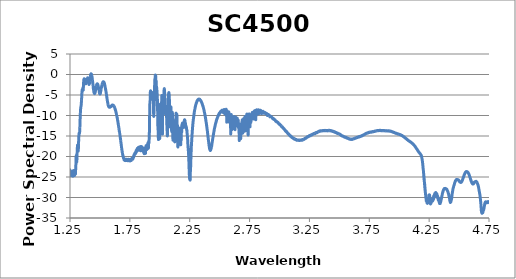
| Category | Power Spectral Density (dBm/nm) |
|---|---|
| 0.9997208862 | -20.139 |
| 0.9997697754 | -20.165 |
| 0.9998187865999999 | -20.043 |
| 0.9998677368 | -20.116 |
| 0.999916748 | -20.263 |
| 0.9999657593 | -20.32 |
| 1.000014709 | -20.365 |
| 1.000063721 | -20.375 |
| 1.000112671 | -20.276 |
| 1.000161743 | -20.173 |
| 1.000210693 | -20.198 |
| 1.000259766 | -20.168 |
| 1.000308716 | -20.151 |
| 1.000357788 | -20.114 |
| 1.000406799 | -20.045 |
| 1.000455872 | -20.029 |
| 1.000504822 | -20.031 |
| 1.000553955 | -19.992 |
| 1.000602905 | -19.99 |
| 1.000652039 | -20.023 |
| 1.00070105 | -20.12 |
| 1.0007501220000001 | -20.165 |
| 1.000799133 | -20.117 |
| 1.000848267 | -19.952 |
| 1.000897278 | -19.904 |
| 1.000946411 | -19.742 |
| 1.000995544 | -19.759 |
| 1.001044617 | -19.882 |
| 1.00109375 | -19.993 |
| 1.0011427609999999 | -20.057 |
| 1.001191956 | -20.022 |
| 1.001240967 | -19.925 |
| 1.001290161 | -19.876 |
| 1.001339233 | -20.106 |
| 1.0013883670000001 | -20.157 |
| 1.001437439 | -20.359 |
| 1.001486633 | -20.383 |
| 1.001535706 | -20.393 |
| 1.0015849 | -20.292 |
| 1.001634033 | -20.338 |
| 1.001683228 | -20.247 |
| 1.0017323 | -20.207 |
| 1.001781555 | -20.369 |
| 1.0018306270000001 | -20.406 |
| 1.001879883 | -20.332 |
| 1.001929016 | -20.382 |
| 1.00197821 | -20.379 |
| 1.002027466 | -20.26 |
| 1.002076599 | -20.318 |
| 1.002125854 | -20.449 |
| 1.002174988 | -20.582 |
| 1.002224243 | -20.711 |
| 1.002273376 | -20.671 |
| 1.002322632 | -20.561 |
| 1.002371826 | -20.684 |
| 1.002421082 | -20.679 |
| 1.002470276 | -20.703 |
| 1.0025195310000001 | -20.886 |
| 1.002568726 | -20.892 |
| 1.002618042 | -20.703 |
| 1.002667236 | -20.747 |
| 1.002716553 | -20.786 |
| 1.002765747 | -20.714 |
| 1.0028150630000001 | -20.658 |
| 1.002864258 | -20.663 |
| 1.0029135740000001 | -20.63 |
| 1.00296283 | -20.564 |
| 1.003012146 | -20.503 |
| 1.003061462 | -20.58 |
| 1.003110718 | -20.808 |
| 1.003160095 | -20.86 |
| 1.003209351 | -20.856 |
| 1.0032586669999999 | -20.959 |
| 1.0033079219999999 | -20.999 |
| 1.0033573 | -20.98 |
| 1.003406555 | -20.862 |
| 1.003455933 | -20.922 |
| 1.003505249 | -20.929 |
| 1.003554626 | -20.678 |
| 1.003603882 | -20.366 |
| 1.00365332 | -20.426 |
| 1.003702576 | -20.477 |
| 1.003752014 | -20.456 |
| 1.003801331 | -20.574 |
| 1.003850708 | -20.634 |
| 1.003900024 | -20.739 |
| 1.003949463 | -20.867 |
| 1.003998779 | -20.813 |
| 1.004048218 | -21.013 |
| 1.004097534 | -21.193 |
| 1.004146973 | -21.091 |
| 1.004196472 | -21.089 |
| 1.004245789 | -21.21 |
| 1.0042952269999998 | -20.983 |
| 1.004344604 | -20.905 |
| 1.004394104 | -20.972 |
| 1.004443481 | -20.967 |
| 1.0044929200000001 | -20.914 |
| 1.004542297 | -20.917 |
| 1.004591797 | -20.922 |
| 1.004641174 | -20.859 |
| 1.004690674 | -20.739 |
| 1.004740112 | -20.684 |
| 1.004789612 | -20.82 |
| 1.004838989 | -20.849 |
| 1.00488855 | -20.797 |
| 1.0049379269999998 | -20.879 |
| 1.004987488 | -21.038 |
| 1.0050368650000001 | -20.986 |
| 1.0050864259999999 | -20.998 |
| 1.0051358639999999 | -20.957 |
| 1.005185425 | -20.895 |
| 1.005234985 | -20.931 |
| 1.0052844239999998 | -20.945 |
| 1.005333984 | -20.971 |
| 1.005383423 | -20.921 |
| 1.005432983 | -20.832 |
| 1.005482483 | -20.871 |
| 1.005532043 | -20.843 |
| 1.005581543 | -20.839 |
| 1.005631165 | -20.859 |
| 1.005680603 | -20.899 |
| 1.005730225 | -20.981 |
| 1.005779724 | -21.065 |
| 1.005829346 | -21.14 |
| 1.005878845 | -21.236 |
| 1.005928467 | -21.141 |
| 1.0059779660000001 | -21.056 |
| 1.006027649 | -21.083 |
| 1.006077148 | -21.098 |
| 1.00612677 | -21.261 |
| 1.006176331 | -21.437 |
| 1.006225952 | -21.449 |
| 1.006275635 | -21.413 |
| 1.006325195 | -21.522 |
| 1.006374878 | -21.502 |
| 1.006424438 | -21.561 |
| 1.00647406 | -21.532 |
| 1.006523682 | -21.541 |
| 1.0065733639999999 | -21.5 |
| 1.006622925 | -21.345 |
| 1.006672607 | -21.195 |
| 1.006722229 | -21.181 |
| 1.006771912 | -21.209 |
| 1.006821533 | -21.071 |
| 1.006871216 | -21.017 |
| 1.006920837 | -21.099 |
| 1.006970581 | -21.027 |
| 1.007020203 | -20.998 |
| 1.0070699459999999 | -21.001 |
| 1.007119568 | -21.035 |
| 1.007169312 | -21.033 |
| 1.007218933 | -21.062 |
| 1.0072686770000001 | -21.015 |
| 1.007318481 | -20.98 |
| 1.0073681030000001 | -20.962 |
| 1.007417908 | -20.983 |
| 1.007467529 | -21.079 |
| 1.007517334 | -21.04 |
| 1.007567017 | -21.127 |
| 1.00761676 | -21.138 |
| 1.0076665040000001 | -21.213 |
| 1.007716248 | -20.931 |
| 1.007765991 | -20.962 |
| 1.007815796 | -21 |
| 1.0078654790000001 | -21.077 |
| 1.007915283 | -21.07 |
| 1.007965027 | -21.159 |
| 1.008014832 | -21.103 |
| 1.008064575 | -20.989 |
| 1.00811438 | -20.917 |
| 1.008164124 | -20.796 |
| 1.008213989 | -20.761 |
| 1.008263733 | -20.78 |
| 1.008313599 | -20.818 |
| 1.008363342 | -20.766 |
| 1.0084132080000001 | -20.628 |
| 1.008463074 | -20.517 |
| 1.008512817 | -20.68 |
| 1.008562744 | -20.749 |
| 1.008612488 | -20.771 |
| 1.008662415 | -20.734 |
| 1.008712158 | -20.832 |
| 1.0087620849999999 | -20.725 |
| 1.00881189 | -20.592 |
| 1.008861816 | -20.518 |
| 1.008911621 | -20.544 |
| 1.008961548 | -20.555 |
| 1.009011353 | -20.557 |
| 1.009061279 | -20.407 |
| 1.009111084 | -20.495 |
| 1.009161072 | -20.584 |
| 1.009210876 | -20.664 |
| 1.009260803 | -20.641 |
| 1.009310669 | -20.598 |
| 1.009360657 | -20.784 |
| 1.009410522 | -20.827 |
| 1.009460449 | -20.74 |
| 1.009510437 | -20.658 |
| 1.009560303 | -20.73 |
| 1.009610291 | -20.625 |
| 1.009660156 | -20.744 |
| 1.009710205 | -20.743 |
| 1.009760071 | -20.697 |
| 1.009810059 | -20.754 |
| 1.009859985 | -20.678 |
| 1.009909973 | -20.674 |
| 1.0099599 | -20.776 |
| 1.010009949 | -20.907 |
| 1.010059875 | -20.98 |
| 1.010109863 | -21.088 |
| 1.0101597900000001 | -20.87 |
| 1.010209839 | -20.93 |
| 1.010259827 | -20.917 |
| 1.0103098750000001 | -20.944 |
| 1.010359802 | -20.866 |
| 1.010409851 | -20.786 |
| 1.010459839 | -20.815 |
| 1.010509888 | -20.57 |
| 1.010559998 | -20.558 |
| 1.010609985 | -20.427 |
| 1.010660034 | -20.526 |
| 1.010710022 | -20.35 |
| 1.010760132 | -20.505 |
| 1.01081012 | -20.471 |
| 1.010860229 | -20.547 |
| 1.0109102779999999 | -20.584 |
| 1.010960388 | -20.616 |
| 1.011010376 | -20.815 |
| 1.0110604859999999 | -20.783 |
| 1.011110535 | -20.877 |
| 1.0111606450000001 | -20.985 |
| 1.011210693 | -21.127 |
| 1.011260864 | -21.026 |
| 1.011310913 | -21.104 |
| 1.011361084 | -21.018 |
| 1.011411133 | -20.986 |
| 1.011461304 | -20.969 |
| 1.011511353 | -20.918 |
| 1.011561523 | -20.99 |
| 1.011611694 | -20.955 |
| 1.011661804 | -20.963 |
| 1.011711975 | -20.901 |
| 1.011762085 | -20.828 |
| 1.011812256 | -20.885 |
| 1.011862366 | -20.974 |
| 1.011912598 | -21.093 |
| 1.011962708 | -20.989 |
| 1.012012939 | -20.958 |
| 1.012063049 | -20.956 |
| 1.012113281 | -20.931 |
| 1.012163391 | -20.833 |
| 1.012213684 | -20.859 |
| 1.0122637939999999 | -20.975 |
| 1.012314026 | -21.017 |
| 1.012364197 | -20.915 |
| 1.01241449 | -20.779 |
| 1.0124646 | -20.805 |
| 1.012514893 | -20.927 |
| 1.012565063 | -20.952 |
| 1.012615356 | -20.9 |
| 1.012665527 | -20.996 |
| 1.01271582 | -21.111 |
| 1.012766113 | -21.128 |
| 1.012816284 | -20.947 |
| 1.012866638 | -21.001 |
| 1.012916809 | -21.017 |
| 1.0129671630000001 | -21.051 |
| 1.013017334 | -20.893 |
| 1.013067688 | -20.911 |
| 1.01311792 | -20.904 |
| 1.013168274 | -20.85 |
| 1.013218506 | -20.862 |
| 1.013268799 | -21.033 |
| 1.013319092 | -21.157 |
| 1.013369446 | -21.195 |
| 1.013419678 | -21.196 |
| 1.0134700319999999 | -21.149 |
| 1.013520325 | -21.22 |
| 1.013570679 | -21.131 |
| 1.013620972 | -21.244 |
| 1.013671387 | -21.19 |
| 1.013721619 | -20.959 |
| 1.013772034 | -20.819 |
| 1.013822449 | -20.85 |
| 1.013872742 | -20.87 |
| 1.013923157 | -20.885 |
| 1.01397345 | -20.968 |
| 1.014023865 | -20.995 |
| 1.014074219 | -21.011 |
| 1.014124634 | -21.165 |
| 1.014174988 | -21.284 |
| 1.014225403 | -21.372 |
| 1.014275757 | -21.387 |
| 1.014326233 | -21.418 |
| 1.0143765869999999 | -21.415 |
| 1.014427002 | -21.461 |
| 1.014477356 | -21.522 |
| 1.014527832 | -21.501 |
| 1.014578247 | -21.567 |
| 1.014628723 | -21.388 |
| 1.014679077 | -21.294 |
| 1.014729553 | -21.349 |
| 1.014779968 | -21.267 |
| 1.014830444 | -21.114 |
| 1.0148809810000001 | -21.101 |
| 1.014931396 | -20.989 |
| 1.014981873 | -20.783 |
| 1.015032288 | -20.877 |
| 1.015082825 | -20.8 |
| 1.01513324 | -20.74 |
| 1.015183777 | -20.834 |
| 1.015234253 | -20.919 |
| 1.01528479 | -20.988 |
| 1.0153352660000001 | -21.204 |
| 1.015385803 | -21.305 |
| 1.015436279 | -21.502 |
| 1.015486816 | -21.612 |
| 1.0155372919999999 | -21.623 |
| 1.01558783 | -21.622 |
| 1.015638367 | -21.828 |
| 1.015688904 | -21.787 |
| 1.015739441 | -21.69 |
| 1.015789978 | -21.613 |
| 1.015840515 | -21.571 |
| 1.0158911130000001 | -21.475 |
| 1.015941711 | -21.539 |
| 1.015992249 | -21.613 |
| 1.016042847 | -21.608 |
| 1.016093384 | -21.536 |
| 1.016143982 | -21.457 |
| 1.016194519 | -21.273 |
| 1.016245178 | -21.227 |
| 1.016295715 | -21.352 |
| 1.016346375 | -21.279 |
| 1.016396912 | -21.265 |
| 1.016447571 | -21.154 |
| 1.016498169 | -21.071 |
| 1.016548828 | -20.847 |
| 1.016599426 | -21.034 |
| 1.016650085 | -20.967 |
| 1.0167006840000001 | -21.177 |
| 1.016751343 | -21.222 |
| 1.016801941 | -21.238 |
| 1.016852661 | -21.164 |
| 1.016903259 | -21.279 |
| 1.016953979 | -21.311 |
| 1.0170047 | -21.391 |
| 1.017055298 | -21.569 |
| 1.017106018 | -21.491 |
| 1.017156677 | -21.678 |
| 1.017207397 | -21.641 |
| 1.017258057 | -21.642 |
| 1.017308777 | -21.543 |
| 1.017359436 | -21.628 |
| 1.017410217 | -21.587 |
| 1.017460876 | -21.57 |
| 1.0175115970000002 | -21.428 |
| 1.017562317 | -21.354 |
| 1.017613037 | -21.385 |
| 1.017663757 | -21.322 |
| 1.017714539 | -21.332 |
| 1.017765198 | -21.468 |
| 1.01781604 | -21.462 |
| 1.017866699 | -21.324 |
| 1.017917542 | -21.306 |
| 1.017968262 | -21.257 |
| 1.018019043 | -21.268 |
| 1.018069763 | -21.221 |
| 1.018120605 | -21.194 |
| 1.0181714480000001 | -21.186 |
| 1.018222168 | -21.255 |
| 1.01827301 | -21.205 |
| 1.0183237920000001 | -21.23 |
| 1.018374634 | -21.235 |
| 1.018425354 | -21.179 |
| 1.018476257 | -21.299 |
| 1.018526978 | -21.465 |
| 1.0185778810000001 | -21.618 |
| 1.018628662 | -21.634 |
| 1.0186795039999998 | -21.697 |
| 1.018730347 | -21.666 |
| 1.018781189 | -21.59 |
| 1.018832031 | -21.639 |
| 1.018882935 | -21.757 |
| 1.018933716 | -21.733 |
| 1.018984619 | -21.529 |
| 1.019035461 | -21.476 |
| 1.019086365 | -21.287 |
| 1.019137207 | -21.231 |
| 1.01918811 | -21.324 |
| 1.019239075 | -21.334 |
| 1.019289917 | -21.4 |
| 1.019340881 | -21.214 |
| 1.0193917239999999 | -21.181 |
| 1.019442688 | -21.202 |
| 1.0194935299999999 | -21.239 |
| 1.0195444949999999 | -21.189 |
| 1.019595398 | -21.399 |
| 1.019646362 | -21.367 |
| 1.019697266 | -21.236 |
| 1.01974823 | -21.241 |
| 1.019799133 | -21.222 |
| 1.019850159 | -21.335 |
| 1.019901062 | -21.347 |
| 1.0199520260000001 | -21.41 |
| 1.02000293 | -21.534 |
| 1.020053955 | -21.569 |
| 1.020104919 | -21.601 |
| 1.020155945 | -21.773 |
| 1.020206848 | -21.718 |
| 1.020257935 | -21.586 |
| 1.02030896 | -21.385 |
| 1.020359924 | -21.388 |
| 1.02041095 | -21.462 |
| 1.020461914 | -21.41 |
| 1.020513 | -21.402 |
| 1.020563965 | -21.405 |
| 1.020615051 | -21.373 |
| 1.020666016 | -21.164 |
| 1.0207171019999999 | -21.208 |
| 1.020768066 | -21.303 |
| 1.020819214 | -21.467 |
| 1.020870178 | -21.418 |
| 1.020921326 | -21.482 |
| 1.02097229 | -21.395 |
| 1.021023438 | -21.297 |
| 1.021074463 | -21.344 |
| 1.021125549 | -21.253 |
| 1.021176575 | -21.326 |
| 1.021227722 | -21.232 |
| 1.021278809 | -21.09 |
| 1.021329956 | -21.042 |
| 1.021381104 | -21.166 |
| 1.0214321290000001 | -21.046 |
| 1.021483276 | -21.188 |
| 1.021534363 | -21.264 |
| 1.021585571 | -21.211 |
| 1.021636597 | -21.271 |
| 1.021687805 | -21.28 |
| 1.021738892 | -21.428 |
| 1.0217901 | -21.461 |
| 1.021841187 | -21.606 |
| 1.021892395 | -21.629 |
| 1.021943481 | -21.64 |
| 1.02199469 | -21.503 |
| 1.022045837 | -21.61 |
| 1.022097046 | -21.718 |
| 1.022148193 | -21.744 |
| 1.022199402 | -21.788 |
| 1.022250549 | -21.809 |
| 1.022301819 | -21.977 |
| 1.0223529660000001 | -21.988 |
| 1.022404236 | -21.946 |
| 1.022455383 | -21.86 |
| 1.022506653 | -22.031 |
| 1.022557922 | -22.046 |
| 1.02260907 | -21.993 |
| 1.022660339 | -21.958 |
| 1.022711548 | -21.946 |
| 1.022762817 | -21.959 |
| 1.022814026 | -21.822 |
| 1.022865356 | -21.601 |
| 1.022916565 | -21.473 |
| 1.0229678340000001 | -21.502 |
| 1.023019043 | -21.438 |
| 1.023070374 | -21.338 |
| 1.0231216429999999 | -21.312 |
| 1.023172974 | -21.369 |
| 1.023224182 | -21.377 |
| 1.023275513 | -21.34 |
| 1.023326782 | -21.336 |
| 1.023378113 | -21.5 |
| 1.023429382 | -21.528 |
| 1.023480774 | -21.557 |
| 1.0235320430000001 | -21.496 |
| 1.023583374 | -21.508 |
| 1.023634766 | -21.573 |
| 1.0236860349999999 | -21.612 |
| 1.023737427 | -21.59 |
| 1.023788757 | -21.49 |
| 1.023840149 | -21.656 |
| 1.023891418 | -21.55 |
| 1.023942871 | -21.587 |
| 1.023994141 | -21.804 |
| 1.0240455320000001 | -21.896 |
| 1.024096924 | -21.753 |
| 1.024148315 | -21.583 |
| 1.024199707 | -21.619 |
| 1.024251099 | -21.725 |
| 1.02430249 | -21.883 |
| 1.0243538820000002 | -21.82 |
| 1.0244052730000002 | -21.918 |
| 1.024456665 | -22.034 |
| 1.024508057 | -21.836 |
| 1.0245595699999999 | -21.909 |
| 1.024610962 | -21.984 |
| 1.024662354 | -22.122 |
| 1.024713867 | -21.937 |
| 1.024765259 | -21.806 |
| 1.0248167719999999 | -21.673 |
| 1.024868164 | -21.65 |
| 1.024919678 | -21.566 |
| 1.024971069 | -21.522 |
| 1.025022583 | -21.571 |
| 1.0250740969999999 | -21.586 |
| 1.0251256100000001 | -21.695 |
| 1.025177002 | -21.758 |
| 1.0252285159999999 | -21.767 |
| 1.025280029 | -21.899 |
| 1.025331543 | -21.961 |
| 1.025382935 | -21.993 |
| 1.0254345699999998 | -22.174 |
| 1.0254859619999999 | -22.144 |
| 1.0255375979999999 | -22.2 |
| 1.025589111 | -22.054 |
| 1.025640625 | -22.014 |
| 1.025692139 | -22.01 |
| 1.025743774 | -22.075 |
| 1.025795288 | -22.025 |
| 1.025846802 | -21.983 |
| 1.025898438 | -21.849 |
| 1.025949951 | -21.727 |
| 1.0260015869999999 | -21.577 |
| 1.026053101 | -21.469 |
| 1.026104736 | -21.486 |
| 1.02615625 | -21.503 |
| 1.026207886 | -21.398 |
| 1.026259399 | -21.356 |
| 1.026311035 | -21.472 |
| 1.026362549 | -21.571 |
| 1.026414307 | -21.657 |
| 1.0264658199999999 | -21.729 |
| 1.026517456 | -21.864 |
| 1.026569092 | -21.788 |
| 1.0266207280000001 | -21.751 |
| 1.0266723629999999 | -21.667 |
| 1.026723999 | -21.56 |
| 1.026775635 | -21.584 |
| 1.0268272710000002 | -21.348 |
| 1.026879028 | -21.268 |
| 1.026930664 | -21.153 |
| 1.0269822999999998 | -21.137 |
| 1.027033936 | -21.251 |
| 1.027085693 | -21.295 |
| 1.0271373289999999 | -21.259 |
| 1.027189087 | -21.2 |
| 1.0272407229999998 | -21.423 |
| 1.02729248 | -21.539 |
| 1.027344116 | -21.592 |
| 1.027395874 | -21.626 |
| 1.02744751 | -21.705 |
| 1.0274992680000001 | -21.66 |
| 1.027550903 | -21.526 |
| 1.027602661 | -21.765 |
| 1.0276544189999999 | -21.928 |
| 1.027706177 | -22.039 |
| 1.027757813 | -22.026 |
| 1.027809692 | -21.961 |
| 1.027861328 | -21.995 |
| 1.027913208 | -21.818 |
| 1.027964844 | -21.746 |
| 1.028016724 | -21.584 |
| 1.028068481 | -21.516 |
| 1.0281202390000002 | -21.292 |
| 1.0281721190000002 | -21.198 |
| 1.0282238769999998 | -21.291 |
| 1.028275635 | -21.271 |
| 1.028327393 | -21.155 |
| 1.028379272 | -21.144 |
| 1.02843103 | -21.34 |
| 1.02848291 | -21.377 |
| 1.028534668 | -21.678 |
| 1.028586548 | -21.76 |
| 1.028638306 | -21.786 |
| 1.028690186 | -21.872 |
| 1.0287420649999999 | -21.671 |
| 1.0287939449999999 | -21.535 |
| 1.028845703 | -21.52 |
| 1.028897583 | -21.639 |
| 1.028949463 | -21.577 |
| 1.029001343 | -21.483 |
| 1.0290532229999998 | -21.412 |
| 1.029105103 | -21.423 |
| 1.0291571039999998 | -21.452 |
| 1.029208862 | -21.42 |
| 1.029260864 | -21.534 |
| 1.029312622 | -21.608 |
| 1.029364624 | -21.802 |
| 1.029416504 | -21.711 |
| 1.029468506 | -21.65 |
| 1.029520264 | -21.893 |
| 1.029572266 | -21.8 |
| 1.0296241460000002 | -21.751 |
| 1.029676147 | -21.757 |
| 1.0297280270000002 | -21.677 |
| 1.029780029 | -21.7 |
| 1.029831909 | -21.647 |
| 1.029883911 | -21.492 |
| 1.029935913 | -21.474 |
| 1.029987915 | -21.532 |
| 1.030039795 | -21.607 |
| 1.030091797 | -21.693 |
| 1.030143799 | -21.832 |
| 1.030195801 | -21.777 |
| 1.030247803 | -21.872 |
| 1.030299805 | -21.924 |
| 1.030351807 | -22.079 |
| 1.0304038089999998 | -22.102 |
| 1.030455933 | -22.087 |
| 1.030507813 | -22.125 |
| 1.030559937 | -22.081 |
| 1.030611938 | -22.09 |
| 1.03066394 | -21.986 |
| 1.030715942 | -22.028 |
| 1.030768066 | -22.03 |
| 1.030820068 | -21.928 |
| 1.0308721920000001 | -21.706 |
| 1.030924194 | -21.754 |
| 1.030976318 | -21.72 |
| 1.0310283199999999 | -21.618 |
| 1.0310804439999999 | -21.51 |
| 1.031132446 | -21.393 |
| 1.031184692 | -21.492 |
| 1.031236694 | -21.612 |
| 1.031288818 | -21.483 |
| 1.0313409420000001 | -21.586 |
| 1.0313930660000001 | -21.709 |
| 1.03144519 | -21.609 |
| 1.0314973139999999 | -21.761 |
| 1.031549438 | -21.925 |
| 1.031601563 | -21.976 |
| 1.031653687 | -22.054 |
| 1.0317058110000001 | -21.951 |
| 1.031758057 | -21.935 |
| 1.031810059 | -22.025 |
| 1.0318623050000002 | -21.954 |
| 1.031914429 | -21.912 |
| 1.0319666749999998 | -21.99 |
| 1.032018799 | -21.988 |
| 1.032071045 | -21.898 |
| 1.032123169 | -21.875 |
| 1.032175415 | -21.847 |
| 1.032227539 | -21.91 |
| 1.0322797849999998 | -21.857 |
| 1.032331909 | -21.806 |
| 1.032384155 | -21.81 |
| 1.0324362790000001 | -21.7 |
| 1.0324886469999999 | -21.679 |
| 1.032540894 | -21.611 |
| 1.032593018 | -21.481 |
| 1.032645386 | -21.481 |
| 1.03269751 | -21.561 |
| 1.0327498780000002 | -21.583 |
| 1.032802002 | -21.444 |
| 1.03285437 | -21.54 |
| 1.032906616 | -21.535 |
| 1.0329588619999999 | -21.737 |
| 1.033011108 | -21.776 |
| 1.033063477 | -21.756 |
| 1.033115601 | -21.829 |
| 1.0331679690000002 | -21.779 |
| 1.033220215 | -21.786 |
| 1.033272583 | -21.691 |
| 1.033324829 | -21.897 |
| 1.033377197 | -22.028 |
| 1.033429443 | -21.907 |
| 1.033481812 | -21.915 |
| 1.0335340579999999 | -22.052 |
| 1.033586548 | -22.165 |
| 1.0336389160000001 | -22.106 |
| 1.033691162 | -22.133 |
| 1.03374353 | -22.114 |
| 1.0337958980000002 | -22.119 |
| 1.033848267 | -21.92 |
| 1.033900635 | -21.82 |
| 1.0339530030000001 | -21.922 |
| 1.034005371 | -21.828 |
| 1.034057739 | -21.69 |
| 1.034110107 | -21.64 |
| 1.034162598 | -21.733 |
| 1.034214844 | -21.743 |
| 1.034267334 | -21.674 |
| 1.034319702 | -21.755 |
| 1.034372192 | -21.854 |
| 1.034424561 | -21.877 |
| 1.034476929 | -21.879 |
| 1.034529419 | -21.976 |
| 1.034581787 | -21.971 |
| 1.034634277 | -21.902 |
| 1.034686768 | -21.844 |
| 1.034739258 | -21.78 |
| 1.0347916259999999 | -21.676 |
| 1.034844116 | -21.682 |
| 1.034896606 | -21.628 |
| 1.034949097 | -21.583 |
| 1.0350014650000001 | -21.537 |
| 1.035054077 | -21.569 |
| 1.0351064449999998 | -21.612 |
| 1.0351590579999999 | -21.703 |
| 1.035211426 | -21.779 |
| 1.035264038 | -21.784 |
| 1.035316406 | -21.94 |
| 1.035369019 | -21.841 |
| 1.035421509 | -21.86 |
| 1.0354739990000001 | -21.792 |
| 1.035526489 | -21.898 |
| 1.035579102 | -21.773 |
| 1.0356315919999999 | -21.691 |
| 1.0356842039999998 | -21.588 |
| 1.035736694 | -21.498 |
| 1.035789307 | -21.557 |
| 1.0358419189999999 | -21.611 |
| 1.035894409 | -21.637 |
| 1.035947021 | -21.696 |
| 1.035999512 | -21.686 |
| 1.036052246 | -21.653 |
| 1.036104736 | -21.757 |
| 1.036157349 | -21.94 |
| 1.036209961 | -21.829 |
| 1.036262573 | -21.899 |
| 1.036315186 | -21.897 |
| 1.036367798 | -21.772 |
| 1.0364204099999998 | -21.789 |
| 1.0364730219999998 | -21.803 |
| 1.036525635 | -21.683 |
| 1.036578369 | -21.707 |
| 1.0366308590000002 | -21.666 |
| 1.036683594 | -21.501 |
| 1.036736206 | -21.702 |
| 1.0367889399999999 | -21.72 |
| 1.036841553 | -21.844 |
| 1.036894287 | -21.857 |
| 1.036946899 | -21.975 |
| 1.036999634 | -21.953 |
| 1.037052368 | -22.061 |
| 1.03710498 | -21.958 |
| 1.037157715 | -21.931 |
| 1.037210327 | -21.993 |
| 1.037263062 | -21.959 |
| 1.0373157960000001 | -21.855 |
| 1.03736853 | -21.782 |
| 1.037421143 | -21.648 |
| 1.0374739990000001 | -21.624 |
| 1.037526611 | -21.473 |
| 1.037579468 | -21.458 |
| 1.03763208 | -21.372 |
| 1.037684937 | -21.399 |
| 1.0377376710000001 | -21.417 |
| 1.037790405 | -21.418 |
| 1.0378431399999999 | -21.518 |
| 1.037895996 | -21.474 |
| 1.03794873 | -21.789 |
| 1.038001465 | -21.632 |
| 1.0380543210000002 | -21.787 |
| 1.038107056 | -21.855 |
| 1.038159912 | -21.88 |
| 1.0382126459999999 | -21.981 |
| 1.038265503 | -21.969 |
| 1.038318359 | -21.91 |
| 1.038371216 | -21.764 |
| 1.03842395 | -21.708 |
| 1.0384768070000001 | -21.66 |
| 1.0385295410000002 | -21.798 |
| 1.0385825199999998 | -21.804 |
| 1.0386352540000001 | -21.804 |
| 1.038688232 | -21.831 |
| 1.0387409669999998 | -21.648 |
| 1.0387939449999999 | -21.627 |
| 1.03884668 | -21.674 |
| 1.038899658 | -21.826 |
| 1.0389525149999999 | -21.705 |
| 1.039005371 | -21.551 |
| 1.039058228 | -21.574 |
| 1.039111206 | -21.46 |
| 1.0391640629999999 | -21.516 |
| 1.039216919 | -21.456 |
| 1.0392698969999998 | -21.447 |
| 1.039322754 | -21.434 |
| 1.0393757319999999 | -21.407 |
| 1.0394285890000001 | -21.49 |
| 1.039481567 | -21.643 |
| 1.039534546 | -21.803 |
| 1.039587524 | -21.679 |
| 1.039640381 | -21.665 |
| 1.0396933590000002 | -21.608 |
| 1.0397463379999998 | -21.785 |
| 1.039799316 | -22.048 |
| 1.039852173 | -22.152 |
| 1.039905273 | -22.084 |
| 1.03995813 | -21.999 |
| 1.0400112300000002 | -21.972 |
| 1.040064087 | -21.805 |
| 1.040117188 | -21.864 |
| 1.040170166 | -22.005 |
| 1.040223145 | -22.006 |
| 1.0402761230000002 | -21.988 |
| 1.0403292240000002 | -21.814 |
| 1.0403823239999999 | -21.807 |
| 1.040435303 | -21.777 |
| 1.0404884030000001 | -21.768 |
| 1.040541382 | -21.798 |
| 1.040594482 | -21.942 |
| 1.040647461 | -21.962 |
| 1.040700562 | -22.01 |
| 1.0407535399999999 | -22.179 |
| 1.0408066409999999 | -22.222 |
| 1.0408596190000001 | -22.299 |
| 1.040912842 | -22.334 |
| 1.0409658199999998 | -22.492 |
| 1.041018921 | -22.542 |
| 1.041072021 | -22.502 |
| 1.041125122 | -22.492 |
| 1.041178223 | -22.503 |
| 1.0412313229999999 | -22.516 |
| 1.0412844239999999 | -22.336 |
| 1.041337646 | -22.222 |
| 1.041390625 | -22 |
| 1.041443848 | -21.824 |
| 1.04149707 | -21.813 |
| 1.0415501710000001 | -21.749 |
| 1.041603394 | -21.998 |
| 1.0416563719999998 | -21.96 |
| 1.041709595 | -21.904 |
| 1.0417626949999998 | -21.799 |
| 1.041815918 | -21.782 |
| 1.0418691409999998 | -21.87 |
| 1.0419223629999999 | -21.804 |
| 1.041975464 | -21.932 |
| 1.042028687 | -21.82 |
| 1.042081787 | -21.879 |
| 1.042135132 | -21.718 |
| 1.042188232 | -21.75 |
| 1.042241455 | -21.637 |
| 1.042294678 | -21.692 |
| 1.0423479 | -21.839 |
| 1.042401123 | -21.852 |
| 1.0424544679999999 | -22.151 |
| 1.042507568 | -22.097 |
| 1.042560913 | -22.225 |
| 1.0426141359999999 | -22.223 |
| 1.0426673579999999 | -22.177 |
| 1.0427207029999999 | -22.101 |
| 1.0427739260000002 | -22.245 |
| 1.0428272710000002 | -22.342 |
| 1.042880493 | -22.152 |
| 1.042933838 | -21.975 |
| 1.042987061 | -21.934 |
| 1.043040405 | -22.04 |
| 1.043093628 | -22.046 |
| 1.0431469729999998 | -22.073 |
| 1.0432001949999998 | -22.219 |
| 1.0432536620000001 | -22.22 |
| 1.043306885 | -22.258 |
| 1.043360229 | -22.076 |
| 1.043413574 | -22.244 |
| 1.0434669189999999 | -22.319 |
| 1.043520264 | -22.283 |
| 1.043573608 | -22.263 |
| 1.043626953 | -22.237 |
| 1.043680298 | -22.074 |
| 1.043733765 | -21.907 |
| 1.0437871090000002 | -21.89 |
| 1.043840454 | -21.83 |
| 1.043893799 | -21.915 |
| 1.043947266 | -21.844 |
| 1.04400061 | -21.864 |
| 1.044054077 | -21.724 |
| 1.044107422 | -21.699 |
| 1.044160889 | -21.668 |
| 1.044214233 | -21.779 |
| 1.0442677 | -21.874 |
| 1.044321045 | -21.755 |
| 1.044374512 | -21.746 |
| 1.044427856 | -21.772 |
| 1.044481445 | -21.758 |
| 1.04453479 | -21.806 |
| 1.044588257 | -21.853 |
| 1.044641724 | -21.866 |
| 1.0446951899999999 | -21.889 |
| 1.0447486570000002 | -21.88 |
| 1.044802124 | -21.736 |
| 1.044855591 | -21.85 |
| 1.044909058 | -21.907 |
| 1.0449626459999999 | -21.874 |
| 1.045016113 | -21.795 |
| 1.045069702 | -21.795 |
| 1.0451230470000001 | -21.817 |
| 1.0451766359999999 | -21.811 |
| 1.0452301030000002 | -21.875 |
| 1.045283691 | -21.785 |
| 1.0453371580000002 | -21.9 |
| 1.045390747 | -21.99 |
| 1.0454442140000002 | -21.918 |
| 1.045497803 | -22.021 |
| 1.0455513920000001 | -22.146 |
| 1.04560498 | -22.061 |
| 1.045658447 | -22.119 |
| 1.0457120359999998 | -22.131 |
| 1.045765625 | -22.044 |
| 1.045819214 | -22.309 |
| 1.045872803 | -22.169 |
| 1.0459263920000001 | -22.098 |
| 1.04597998 | -22.077 |
| 1.046033569 | -21.914 |
| 1.04608728 | -21.908 |
| 1.046140869 | -21.907 |
| 1.046194458 | -21.872 |
| 1.046248047 | -21.753 |
| 1.046301758 | -21.903 |
| 1.046355347 | -21.698 |
| 1.046408936 | -21.936 |
| 1.046462524 | -21.999 |
| 1.0465162350000001 | -21.969 |
| 1.046569946 | -21.988 |
| 1.046623657 | -21.898 |
| 1.046677246 | -21.971 |
| 1.046730957 | -22.029 |
| 1.046784546 | -22.189 |
| 1.046838257 | -22.064 |
| 1.046891968 | -22.116 |
| 1.046945679 | -21.918 |
| 1.046999268 | -21.896 |
| 1.047053101 | -22.018 |
| 1.047106689 | -21.936 |
| 1.047160522 | -22.078 |
| 1.0472142329999998 | -21.996 |
| 1.047267944 | -21.912 |
| 1.047321777 | -21.852 |
| 1.047375366 | -21.756 |
| 1.047429199 | -21.853 |
| 1.04748291 | -21.915 |
| 1.047536743 | -21.944 |
| 1.0475904539999998 | -21.807 |
| 1.047644287 | -21.915 |
| 1.047697998 | -21.82 |
| 1.047751831 | -21.859 |
| 1.047805542 | -21.785 |
| 1.047859375 | -21.587 |
| 1.047913086 | -21.696 |
| 1.047966919 | -21.543 |
| 1.04802063 | -21.627 |
| 1.0480745850000002 | -21.572 |
| 1.048128296 | -21.688 |
| 1.048182129 | -21.739 |
| 1.048235962 | -21.774 |
| 1.0482897949999999 | -21.776 |
| 1.04834375 | -21.924 |
| 1.048397461 | -22.037 |
| 1.048451416 | -21.979 |
| 1.048505249 | -22.062 |
| 1.048559082 | -21.932 |
| 1.0486129149999999 | -21.789 |
| 1.04866687 | -21.732 |
| 1.0487207029999999 | -21.578 |
| 1.0487746580000001 | -21.701 |
| 1.048828491 | -21.76 |
| 1.048882324 | -21.626 |
| 1.048936279 | -21.674 |
| 1.0489902340000001 | -21.739 |
| 1.049044067 | -21.708 |
| 1.049098022 | -21.837 |
| 1.049151855 | -21.985 |
| 1.049205811 | -21.992 |
| 1.0492597659999998 | -22.016 |
| 1.049313721 | -21.786 |
| 1.049367554 | -21.711 |
| 1.049421631 | -21.66 |
| 1.049475586 | -21.715 |
| 1.049529541 | -21.739 |
| 1.049583496 | -21.705 |
| 1.0496374510000002 | -21.481 |
| 1.049691528 | -21.494 |
| 1.049745361 | -21.524 |
| 1.049799438 | -21.519 |
| 1.0498533939999999 | -21.621 |
| 1.049907471 | -21.53 |
| 1.049961426 | -21.739 |
| 1.050015381 | -21.617 |
| 1.050069336 | -21.578 |
| 1.0501234130000001 | -21.626 |
| 1.05017749 | -21.809 |
| 1.050231567 | -21.807 |
| 1.0502855219999998 | -21.503 |
| 1.0503396 | -21.574 |
| 1.050393555 | -21.533 |
| 1.0504477540000001 | -21.703 |
| 1.050501709 | -21.591 |
| 1.0505557859999999 | -21.62 |
| 1.0506099850000001 | -21.589 |
| 1.05066394 | -21.596 |
| 1.0507181399999999 | -21.55 |
| 1.0507720950000001 | -21.651 |
| 1.050826294 | -21.98 |
| 1.0508803709999999 | -21.978 |
| 1.050934448 | -21.865 |
| 1.050988525 | -21.849 |
| 1.051042725 | -21.863 |
| 1.051096802 | -21.991 |
| 1.051150879 | -21.939 |
| 1.051204956 | -21.869 |
| 1.051259155 | -21.833 |
| 1.051313232 | -21.665 |
| 1.051367432 | -21.749 |
| 1.051421631 | -21.72 |
| 1.05147583 | -21.757 |
| 1.0515299070000002 | -21.636 |
| 1.051584106 | -21.66 |
| 1.051638306 | -21.596 |
| 1.0516925049999999 | -21.554 |
| 1.051746582 | -21.551 |
| 1.051800903 | -21.557 |
| 1.051855103 | -21.635 |
| 1.051909302 | -21.389 |
| 1.051963501 | -21.486 |
| 1.0520177000000002 | -21.406 |
| 1.0520720209999999 | -21.542 |
| 1.052126099 | -21.64 |
| 1.05218042 | -21.617 |
| 1.052234619 | -21.82 |
| 1.05228894 | -21.814 |
| 1.0523431399999998 | -21.765 |
| 1.052397339 | -21.686 |
| 1.05245166 | -21.804 |
| 1.052505981 | -21.645 |
| 1.052560181 | -21.753 |
| 1.052614502 | -21.714 |
| 1.052668701 | -21.499 |
| 1.052723022 | -21.41 |
| 1.052777222 | -21.269 |
| 1.052831665 | -21.228 |
| 1.052885864 | -21.295 |
| 1.052940186 | -21.278 |
| 1.052994629 | -21.283 |
| 1.0530488279999999 | -21.385 |
| 1.053103271 | -21.502 |
| 1.053157471 | -21.464 |
| 1.053211914 | -21.494 |
| 1.0532662350000002 | -21.45 |
| 1.053320557 | -21.388 |
| 1.053374878 | -21.299 |
| 1.053429321 | -21.365 |
| 1.053483643 | -21.365 |
| 1.053538086 | -21.574 |
| 1.053592407 | -21.581 |
| 1.0536468509999999 | -21.436 |
| 1.053701172 | -21.33 |
| 1.053755615 | -21.38 |
| 1.053809937 | -21.518 |
| 1.05386438 | -21.477 |
| 1.053918701 | -21.663 |
| 1.0539732670000002 | -21.591 |
| 1.0540275879999998 | -21.757 |
| 1.0540820309999999 | -21.459 |
| 1.0541365969999998 | -21.355 |
| 1.054190918 | -21.291 |
| 1.0542454829999999 | -21.424 |
| 1.054299805 | -21.456 |
| 1.05435437 | -21.41 |
| 1.054408813 | -21.52 |
| 1.054463257 | -21.467 |
| 1.0545177000000001 | -21.439 |
| 1.0545722659999999 | -21.239 |
| 1.0546267089999999 | -21.25 |
| 1.0546811520000001 | -21.216 |
| 1.054735596 | -21.357 |
| 1.054790161 | -21.327 |
| 1.054844604 | -21.317 |
| 1.0548991699999999 | -21.255 |
| 1.054953613 | -21.079 |
| 1.055008301 | -21 |
| 1.055062744 | -20.973 |
| 1.0551173100000002 | -20.986 |
| 1.055171753 | -20.924 |
| 1.05522644 | -20.993 |
| 1.055281006 | -20.913 |
| 1.055335449 | -20.914 |
| 1.055390137 | -20.873 |
| 1.05544458 | -20.856 |
| 1.055499268 | -20.929 |
| 1.0555538329999998 | -20.926 |
| 1.0556083980000002 | -21.004 |
| 1.0556629640000001 | -20.952 |
| 1.055717651 | -20.968 |
| 1.055772217 | -20.89 |
| 1.055826782 | -20.855 |
| 1.055881348 | -20.784 |
| 1.055936035 | -20.82 |
| 1.055990601 | -20.92 |
| 1.056045288 | -21.011 |
| 1.056099854 | -21.09 |
| 1.0561545410000002 | -20.989 |
| 1.056209229 | -20.984 |
| 1.056263916 | -21.069 |
| 1.056318481 | -21.147 |
| 1.056373169 | -21.272 |
| 1.056427979 | -21.237 |
| 1.0564825439999999 | -21.177 |
| 1.056537231 | -21.185 |
| 1.056591919 | -21.099 |
| 1.056646606 | -20.969 |
| 1.056701294 | -20.968 |
| 1.056756104 | -21.018 |
| 1.0568106689999999 | -20.889 |
| 1.056865479 | -20.904 |
| 1.056920166 | -20.82 |
| 1.056974976 | -20.848 |
| 1.057029663 | -20.897 |
| 1.0570843509999999 | -20.907 |
| 1.057139038 | -21.037 |
| 1.0571938479999998 | -21.137 |
| 1.057248535 | -21.182 |
| 1.0573034669999999 | -21.163 |
| 1.057358154 | -21.324 |
| 1.057412964 | -21.337 |
| 1.0574676509999998 | -21.376 |
| 1.057522461 | -21.434 |
| 1.057577393 | -21.383 |
| 1.05763208 | -21.181 |
| 1.05768689 | -21.077 |
| 1.057741699 | -21.04 |
| 1.057796509 | -21.021 |
| 1.057851318 | -21.059 |
| 1.05790625 | -21.018 |
| 1.057960938 | -20.936 |
| 1.058015869 | -20.909 |
| 1.0580706789999998 | -20.874 |
| 1.058125488 | -20.836 |
| 1.058180298 | -20.848 |
| 1.0582352289999999 | -20.881 |
| 1.058290039 | -20.865 |
| 1.058344971 | -20.887 |
| 1.05839978 | -20.824 |
| 1.058454712 | -20.882 |
| 1.058509521 | -20.898 |
| 1.0585645750000001 | -20.956 |
| 1.0586193849999999 | -21.058 |
| 1.058674316 | -21.084 |
| 1.058729126 | -21.184 |
| 1.0587841800000002 | -21.153 |
| 1.058839111 | -21.177 |
| 1.0588939210000001 | -21.013 |
| 1.058948975 | -21.084 |
| 1.0590039059999998 | -21.11 |
| 1.059058838 | -21.219 |
| 1.05911377 | -21.127 |
| 1.0591687010000002 | -20.998 |
| 1.059223633 | -20.991 |
| 1.059278687 | -20.854 |
| 1.059333618 | -21.001 |
| 1.059388672 | -21.044 |
| 1.059443481 | -21.194 |
| 1.059498535 | -21.151 |
| 1.059553467 | -21.001 |
| 1.0596085210000001 | -20.741 |
| 1.059663574 | -20.756 |
| 1.0597186280000002 | -20.743 |
| 1.05977356 | -20.867 |
| 1.0598286129999999 | -21.04 |
| 1.059883545 | -20.994 |
| 1.059938721 | -20.974 |
| 1.059993774 | -21.105 |
| 1.060048828 | -21.147 |
| 1.0601038820000002 | -21.139 |
| 1.060158936 | -21.269 |
| 1.0602139890000002 | -21.225 |
| 1.060269043 | -21.09 |
| 1.0603240969999999 | -20.91 |
| 1.06037915 | -20.84 |
| 1.060434326 | -20.768 |
| 1.06048938 | -20.613 |
| 1.0605444339999999 | -20.465 |
| 1.060599487 | -20.391 |
| 1.060654663 | -20.44 |
| 1.060709717 | -20.488 |
| 1.060764893 | -20.474 |
| 1.060819946 | -20.601 |
| 1.060875244 | -20.604 |
| 1.060930298 | -20.58 |
| 1.060985474 | -20.673 |
| 1.061040527 | -20.8 |
| 1.0610958250000002 | -20.937 |
| 1.061151001 | -20.954 |
| 1.0612060550000002 | -20.941 |
| 1.0612613530000001 | -20.899 |
| 1.061316406 | -20.907 |
| 1.061371704 | -20.861 |
| 1.061426758 | -20.928 |
| 1.061482056 | -20.882 |
| 1.061537231 | -20.733 |
| 1.061592407 | -20.669 |
| 1.0616475829999998 | -20.532 |
| 1.061702881 | -20.595 |
| 1.061758057 | -20.671 |
| 1.0618133539999999 | -20.684 |
| 1.06186853 | -20.699 |
| 1.0619238279999998 | -20.73 |
| 1.0619790040000001 | -20.64 |
| 1.062034302 | -20.706 |
| 1.062089478 | -20.735 |
| 1.062144775 | -20.668 |
| 1.062200073 | -20.618 |
| 1.062255371 | -20.541 |
| 1.062310669 | -20.426 |
| 1.0623659669999999 | -20.479 |
| 1.062421265 | -20.49 |
| 1.062476563 | -20.515 |
| 1.06253186 | -20.589 |
| 1.0625871580000001 | -20.669 |
| 1.062642456 | -20.636 |
| 1.062697754 | -20.812 |
| 1.062753174 | -20.853 |
| 1.062808472 | -20.892 |
| 1.0628637699999999 | -20.866 |
| 1.062919067 | -20.765 |
| 1.062974487 | -20.712 |
| 1.063029785 | -20.709 |
| 1.0630852050000001 | -20.798 |
| 1.063140503 | -20.76 |
| 1.063195923 | -20.796 |
| 1.063251343 | -20.74 |
| 1.0633067630000002 | -20.678 |
| 1.063362061 | -20.75 |
| 1.06341748 | -20.759 |
| 1.063473022 | -20.684 |
| 1.0635283199999999 | -20.689 |
| 1.06358374 | -20.757 |
| 1.06363916 | -20.744 |
| 1.0636945800000002 | -20.697 |
| 1.06375 | -20.693 |
| 1.063805542 | -20.616 |
| 1.06386084 | -20.664 |
| 1.0639163820000002 | -20.52 |
| 1.063971802 | -20.644 |
| 1.064027344 | -20.755 |
| 1.064082764 | -20.826 |
| 1.064138184 | -20.745 |
| 1.064193604 | -20.532 |
| 1.064249146 | -20.515 |
| 1.064304688 | -20.493 |
| 1.0643602289999998 | -20.636 |
| 1.064415649 | -20.773 |
| 1.064471191 | -20.891 |
| 1.064526611 | -20.82 |
| 1.0645821530000001 | -20.881 |
| 1.064637817 | -20.944 |
| 1.064693237 | -21.006 |
| 1.064748901 | -20.932 |
| 1.064804321 | -20.975 |
| 1.064859985 | -20.96 |
| 1.064915405 | -20.806 |
| 1.064971069 | -20.589 |
| 1.065026611 | -20.562 |
| 1.065082153 | -20.631 |
| 1.065137695 | -20.678 |
| 1.065193359 | -20.749 |
| 1.065248901 | -20.861 |
| 1.065304565 | -21.091 |
| 1.065360107 | -21.059 |
| 1.0654157709999998 | -21.027 |
| 1.065471313 | -20.925 |
| 1.065526978 | -20.911 |
| 1.06558252 | -20.792 |
| 1.065638184 | -20.705 |
| 1.065693726 | -20.389 |
| 1.065749512 | -20.311 |
| 1.065805176 | -20.113 |
| 1.065860718 | -20.053 |
| 1.065916504 | -20.163 |
| 1.0659720460000002 | -20.226 |
| 1.066027832 | -20.422 |
| 1.066083374 | -20.498 |
| 1.0661391599999999 | -20.614 |
| 1.0661948239999999 | -20.707 |
| 1.0662504879999999 | -20.911 |
| 1.0663061520000001 | -20.899 |
| 1.066361938 | -20.882 |
| 1.066417603 | -20.968 |
| 1.066473389 | -20.688 |
| 1.066529053 | -20.666 |
| 1.0665848390000001 | -20.481 |
| 1.0666405030000001 | -20.534 |
| 1.066696289 | -20.57 |
| 1.066751953 | -20.541 |
| 1.0668077390000001 | -20.592 |
| 1.0668634030000002 | -20.57 |
| 1.066919312 | -20.715 |
| 1.066974976 | -20.742 |
| 1.0670307620000001 | -20.876 |
| 1.06708667 | -20.93 |
| 1.067142334 | -21.142 |
| 1.067198242 | -21.13 |
| 1.067253906 | -20.971 |
| 1.067309814 | -20.79 |
| 1.0673656009999999 | -20.629 |
| 1.067421387 | -20.527 |
| 1.067477173 | -20.363 |
| 1.067533081 | -20.294 |
| 1.067588867 | -20.269 |
| 1.067644775 | -20.215 |
| 1.067700562 | -20.176 |
| 1.06775647 | -20.191 |
| 1.0678122559999998 | -20.306 |
| 1.067868164 | -20.314 |
| 1.0679239500000002 | -20.385 |
| 1.067979858 | -20.415 |
| 1.068035645 | -20.457 |
| 1.0680916749999998 | -20.418 |
| 1.0681474610000001 | -20.405 |
| 1.0682033690000001 | -20.441 |
| 1.068259399 | -20.44 |
| 1.068315186 | -20.435 |
| 1.068371216 | -20.368 |
| 1.068427002 | -20.518 |
| 1.068483032 | -20.645 |
| 1.0685389399999998 | -20.675 |
| 1.0685948490000001 | -20.803 |
| 1.0686507570000001 | -20.853 |
| 1.068706787 | -20.962 |
| 1.068762695 | -20.891 |
| 1.068818726 | -20.9 |
| 1.068874634 | -20.907 |
| 1.068930664 | -20.816 |
| 1.068986572 | -20.591 |
| 1.0690426030000002 | -20.463 |
| 1.069098511 | -20.484 |
| 1.069154541 | -20.41 |
| 1.0692105710000002 | -20.498 |
| 1.069266602 | -20.509 |
| 1.06932251 | -20.71 |
| 1.069378662 | -20.759 |
| 1.069434692 | -20.673 |
| 1.069490723 | -20.789 |
| 1.069546753 | -21.099 |
| 1.0696027830000001 | -21.082 |
| 1.069658813 | -21.068 |
| 1.0697148440000002 | -21.145 |
| 1.069770996 | -21.024 |
| 1.069827026 | -20.944 |
| 1.069883057 | -20.739 |
| 1.069939087 | -20.624 |
| 1.069995239 | -20.593 |
| 1.07005127 | -20.565 |
| 1.070107422 | -20.45 |
| 1.070163452 | -20.592 |
| 1.0702196039999998 | -20.616 |
| 1.070275757 | -20.616 |
| 1.070331909 | -20.683 |
| 1.070387939 | -20.77 |
| 1.070444092 | -20.854 |
| 1.070500244 | -20.988 |
| 1.070556396 | -21.035 |
| 1.0706126710000001 | -21.185 |
| 1.070668701 | -21.249 |
| 1.070724976 | -20.997 |
| 1.070781006 | -21.001 |
| 1.07083728 | -20.896 |
| 1.070893433 | -20.842 |
| 1.0709495850000001 | -20.719 |
| 1.071005737 | -20.713 |
| 1.071062012 | -20.61 |
| 1.071118164 | -20.691 |
| 1.0711744380000001 | -20.671 |
| 1.071230591 | -20.73 |
| 1.071286865 | -20.934 |
| 1.071343018 | -20.97 |
| 1.0713992920000002 | -21.116 |
| 1.071455444 | -21.218 |
| 1.071511719 | -21.311 |
| 1.071567993 | -21.054 |
| 1.071624268 | -21.026 |
| 1.071680542 | -20.788 |
| 1.071736816 | -20.787 |
| 1.071793091 | -20.78 |
| 1.071849365 | -20.816 |
| 1.07190564 | -20.782 |
| 1.071961914 | -20.744 |
| 1.0720183110000001 | -20.626 |
| 1.0720744629999999 | -20.672 |
| 1.072130859 | -21.033 |
| 1.072187134 | -21.255 |
| 1.07224353 | -21.564 |
| 1.072299805 | -21.438 |
| 1.072356201 | -21.268 |
| 1.072412476 | -21.195 |
| 1.072468872 | -21.101 |
| 1.072525146 | -20.908 |
| 1.072581543 | -20.948 |
| 1.072637817 | -20.869 |
| 1.072694336 | -20.68 |
| 1.0727506100000002 | -20.666 |
| 1.0728070070000002 | -20.638 |
| 1.0728634030000002 | -20.667 |
| 1.0729198 | -20.861 |
| 1.0729761960000002 | -20.817 |
| 1.073032593 | -20.978 |
| 1.073089111 | -21.188 |
| 1.073145386 | -21.256 |
| 1.073201904 | -21.309 |
| 1.073258301 | -21.26 |
| 1.073314697 | -21.12 |
| 1.073371094 | -21.002 |
| 1.073427612 | -20.861 |
| 1.073484009 | -20.59 |
| 1.073540527 | -20.488 |
| 1.0735969239999998 | -20.366 |
| 1.0736534420000001 | -20.251 |
| 1.0737098390000002 | -20.205 |
| 1.073766357 | -20.311 |
| 1.073822876 | -20.304 |
| 1.0738793949999998 | -20.407 |
| 1.073935791 | -20.502 |
| 1.073992432 | -20.603 |
| 1.074048828 | -20.675 |
| 1.074105347 | -20.69 |
| 1.0741619869999999 | -20.697 |
| 1.074218506 | -20.833 |
| 1.074275024 | -20.804 |
| 1.074331543 | -20.646 |
| 1.0743881839999998 | -20.776 |
| 1.07444458 | -20.646 |
| 1.074501221 | -20.641 |
| 1.074557739 | -20.61 |
| 1.07461438 | -20.722 |
| 1.0746708980000002 | -20.719 |
| 1.074727539 | -20.756 |
| 1.0747840579999999 | -20.691 |
| 1.074840698 | -20.74 |
| 1.074897217 | -20.729 |
| 1.074953857 | -20.677 |
| 1.0750104980000001 | -20.71 |
| 1.075067139 | -20.843 |
| 1.075123657 | -21.038 |
| 1.07518042 | -21.046 |
| 1.075236938 | -21.161 |
| 1.075293579 | -21.132 |
| 1.07535022 | -21.08 |
| 1.075406982 | -21.108 |
| 1.075463623 | -21.166 |
| 1.075520264 | -21.172 |
| 1.075577026 | -21.143 |
| 1.0756335449999999 | -21.06 |
| 1.075690308 | -21.04 |
| 1.075746948 | -20.864 |
| 1.075803711 | -20.865 |
| 1.0758603519999999 | -20.854 |
| 1.0759171140000001 | -20.9 |
| 1.075973755 | -20.939 |
| 1.076030518 | -20.934 |
| 1.076087158 | -20.982 |
| 1.076144043 | -21.113 |
| 1.076200684 | -20.981 |
| 1.076257446 | -20.886 |
| 1.076314209 | -20.896 |
| 1.0763709719999999 | -20.894 |
| 1.0764277340000001 | -20.885 |
| 1.0764844969999998 | -20.831 |
| 1.07654126 | -20.753 |
| 1.076598022 | -20.664 |
| 1.076654907 | -20.524 |
| 1.07671167 | -20.501 |
| 1.076768433 | -20.566 |
| 1.0768251949999998 | -20.407 |
| 1.07688208 | -20.449 |
| 1.076938843 | -20.41 |
| 1.0769957280000002 | -20.522 |
| 1.07705249 | -20.534 |
| 1.077109375 | -20.5 |
| 1.077166138 | -20.505 |
| 1.0772230219999999 | -20.662 |
| 1.077279785 | -20.54 |
| 1.077336792 | -20.523 |
| 1.077393555 | -20.713 |
| 1.077450439 | -20.737 |
| 1.077507324 | -20.722 |
| 1.077564209 | -20.633 |
| 1.0776210940000002 | -20.568 |
| 1.077677979 | -20.47 |
| 1.0777348629999999 | -20.436 |
| 1.077791748 | -20.436 |
| 1.077848755 | -20.414 |
| 1.07790564 | -20.288 |
| 1.077962646 | -20.182 |
| 1.0780195309999998 | -20.178 |
| 1.078076416 | -20.335 |
| 1.078133301 | -20.328 |
| 1.078190308 | -20.47 |
| 1.078247192 | -20.572 |
| 1.078304321 | -20.559 |
| 1.078361206 | -20.451 |
| 1.078418213 | -20.542 |
| 1.078475098 | -20.601 |
| 1.078532104 | -20.717 |
| 1.078589111 | -20.624 |
| 1.078646118 | -20.377 |
| 1.078703125 | -20.173 |
| 1.0787601320000002 | -20.001 |
| 1.078817139 | -19.911 |
| 1.0788741460000002 | -19.939 |
| 1.078931152 | -20.014 |
| 1.078988159 | -19.993 |
| 1.079045288 | -19.958 |
| 1.079102295 | -19.897 |
| 1.079159424 | -19.957 |
| 1.079216431 | -19.943 |
| 1.07927356 | -20.174 |
| 1.079330566 | -20.226 |
| 1.0793876949999999 | -20.272 |
| 1.079444702 | -20.269 |
| 1.079501831 | -20.143 |
| 1.0795588379999999 | -20.036 |
| 1.079615967 | -20.04 |
| 1.079673096 | -19.999 |
| 1.079730225 | -20.106 |
| 1.079787231 | -20.226 |
| 1.079844482 | -20.204 |
| 1.079901489 | -20.193 |
| 1.0799587400000001 | -20.164 |
| 1.080015747 | -20.22 |
| 1.0800729980000001 | -20.096 |
| 1.0801301269999999 | -20.151 |
| 1.0801872559999999 | -20.109 |
| 1.0802445070000002 | -20.121 |
| 1.080301636 | -19.985 |
| 1.080358887 | -19.937 |
| 1.0804160159999998 | -19.838 |
| 1.0804732670000001 | -19.844 |
| 1.0805303960000001 | -19.878 |
| 1.080587646 | -19.98 |
| 1.080644775 | -20.18 |
| 1.080702026 | -20.231 |
| 1.080759155 | -20.276 |
| 1.0808164059999998 | -20.248 |
| 1.0808736570000002 | -20.253 |
| 1.080930908 | -20.248 |
| 1.080988159 | -20.201 |
| 1.08104541 | -20.32 |
| 1.0811026609999999 | -20.399 |
| 1.0811599120000002 | -20.194 |
| 1.081217163 | -20.089 |
| 1.081274414 | -20.134 |
| 1.081331665 | -20.207 |
| 1.081389038 | -20.25 |
| 1.081446411 | -20.401 |
| 1.08150354 | -20.452 |
| 1.0815609130000001 | -20.603 |
| 1.081618164 | -20.49 |
| 1.0816755370000002 | -20.492 |
| 1.081732788 | -20.554 |
| 1.0817902830000001 | -20.564 |
| 1.081847534 | -20.395 |
| 1.0819049070000002 | -20.357 |
| 1.081962158 | -20.187 |
| 1.0820195309999998 | -19.993 |
| 1.082076904 | -19.854 |
| 1.0821342770000002 | -19.772 |
| 1.08219165 | -19.726 |
| 1.0822490230000001 | -19.62 |
| 1.082306396 | -19.698 |
| 1.08236377 | -19.706 |
| 1.082421143 | -19.743 |
| 1.082478638 | -19.761 |
| 1.082536011 | -19.882 |
| 1.082593384 | -19.956 |
| 1.082650879 | -20.03 |
| 1.082708252 | -19.919 |
| 1.0827657469999998 | -19.949 |
| 1.08282312 | -19.987 |
| 1.082880615 | -19.837 |
| 1.0829379879999999 | -19.752 |
| 1.082995483 | -19.736 |
| 1.083052979 | -19.668 |
| 1.0831104740000002 | -19.634 |
| 1.083167847 | -19.675 |
| 1.083225464 | -19.718 |
| 1.083282837 | -19.945 |
| 1.083340332 | -19.983 |
| 1.083397827 | -19.889 |
| 1.083455322 | -19.812 |
| 1.0835128170000001 | -19.904 |
| 1.0835704350000002 | -19.845 |
| 1.083627808 | -19.808 |
| 1.0836854249999999 | -19.899 |
| 1.08374292 | -19.842 |
| 1.0838005370000001 | -19.728 |
| 1.083858154 | -19.611 |
| 1.083915649 | -19.475 |
| 1.0839732670000002 | -19.501 |
| 1.084030762 | -19.614 |
| 1.084088379 | -19.725 |
| 1.084145874 | -19.724 |
| 1.084203491 | -19.681 |
| 1.084261108 | -19.56 |
| 1.084318726 | -19.42 |
| 1.084376221 | -19.375 |
| 1.0844339600000001 | -19.283 |
| 1.084491455 | -19.29 |
| 1.084549194 | -19.255 |
| 1.084606689 | -19.244 |
| 1.0846644289999998 | -19.098 |
| 1.084721924 | -19.048 |
| 1.084779663 | -19.021 |
| 1.08483728 | -19.05 |
| 1.0848950199999998 | -19.077 |
| 1.084952637 | -19.178 |
| 1.085010254 | -19.243 |
| 1.0850679929999998 | -19.27 |
| 1.08512561 | -19.252 |
| 1.08518335 | -19.208 |
| 1.0852410890000002 | -19.19 |
| 1.085298828 | -19.234 |
| 1.085356445 | -19.285 |
| 1.085414185 | -19.296 |
| 1.085471924 | -19.319 |
| 1.085529663 | -19.235 |
| 1.08558728 | -19.184 |
| 1.0856451420000002 | -19.182 |
| 1.085702759 | -19.193 |
| 1.08576062 | -19.189 |
| 1.0858183590000001 | -19.267 |
| 1.085876099 | -19.25 |
| 1.0859338379999999 | -19.221 |
| 1.085991699 | -19.119 |
| 1.086049438 | -19.094 |
| 1.086107178 | -19.153 |
| 1.086164917 | -19.293 |
| 1.086222778 | -19.359 |
| 1.0862805180000001 | -19.424 |
| 1.086338379 | -19.366 |
| 1.08639624 | -19.186 |
| 1.0864541019999998 | -19.133 |
| 1.086511963 | -19.154 |
| 1.086569702 | -19.179 |
| 1.086627563 | -19.298 |
| 1.086685425 | -19.368 |
| 1.086743286 | -19.209 |
| 1.0868011469999999 | -19.009 |
| 1.086859009 | -18.911 |
| 1.08691687 | -18.984 |
| 1.086974731 | -19.164 |
| 1.087032593 | -19.318 |
| 1.087090576 | -19.398 |
| 1.087148438 | -19.472 |
| 1.087206299 | -19.297 |
| 1.08726416 | -19.132 |
| 1.087322144 | -19.108 |
| 1.087380005 | -19.212 |
| 1.0874379879999998 | -19.327 |
| 1.08749585 | -19.351 |
| 1.0875538329999999 | -19.233 |
| 1.087611938 | -19.104 |
| 1.0876697999999998 | -18.953 |
| 1.087727783 | -18.884 |
| 1.0877856449999999 | -18.904 |
| 1.08784375 | -19.016 |
| 1.087901611 | -19.138 |
| 1.087959717 | -19.161 |
| 1.0880175779999999 | -19.043 |
| 1.0880756839999999 | -18.996 |
| 1.0881336670000001 | -18.978 |
| 1.08819165 | -19.009 |
| 1.088249634 | -19.086 |
| 1.088307739 | -19.154 |
| 1.088365723 | -19.314 |
| 1.088423706 | -19.277 |
| 1.088481689 | -19.102 |
| 1.088539795 | -19.044 |
| 1.088597778 | -19.079 |
| 1.088656006 | -19.142 |
| 1.0887139890000002 | -19.236 |
| 1.088772095 | -19.462 |
| 1.0888302 | -19.506 |
| 1.088888184 | -19.432 |
| 1.088946411 | -19.349 |
| 1.089004395 | -19.408 |
| 1.089062622 | -19.58 |
| 1.089120605 | -19.737 |
| 1.0891788329999998 | -19.867 |
| 1.089236816 | -19.838 |
| 1.089295044 | -19.821 |
| 1.0893531490000001 | -19.704 |
| 1.089411255 | -19.602 |
| 1.08946936 | -19.663 |
| 1.089527588 | -19.755 |
| 1.089585693 | -19.839 |
| 1.0896439210000002 | -19.919 |
| 1.0897020259999999 | -19.962 |
| 1.089760254 | -19.906 |
| 1.0898183590000001 | -19.889 |
| 1.089876587 | -19.928 |
| 1.0899346920000001 | -19.742 |
| 1.0899930420000001 | -19.871 |
| 1.09005127 | -20.109 |
| 1.090109375 | -19.989 |
| 1.090167725 | -19.789 |
| 1.09022583 | -19.667 |
| 1.09028418 | -19.458 |
| 1.090342285 | -19.451 |
| 1.090400635 | -19.508 |
| 1.090458862 | -19.601 |
| 1.09051709 | -19.821 |
| 1.090575317 | -19.788 |
| 1.090633667 | -19.605 |
| 1.090691895 | -19.528 |
| 1.090750244 | -19.511 |
| 1.090808472 | -19.59 |
| 1.090866821 | -19.78 |
| 1.090925049 | -19.898 |
| 1.090983398 | -19.893 |
| 1.091041626 | -19.68 |
| 1.091099976 | -19.504 |
| 1.091158325 | -19.381 |
| 1.0912166749999999 | -19.273 |
| 1.091275024 | -19.361 |
| 1.091333374 | -19.522 |
| 1.0913917240000002 | -19.536 |
| 1.091450073 | -19.544 |
| 1.091508423 | -19.436 |
| 1.091566772 | -19.292 |
| 1.091625244 | -19.357 |
| 1.091683472 | -19.468 |
| 1.091741943 | -19.575 |
| 1.091800293 | -19.669 |
| 1.091858765 | -19.687 |
| 1.0919171140000001 | -19.558 |
| 1.091975586 | -19.491 |
| 1.092033936 | -19.252 |
| 1.092092407 | -19.148 |
| 1.0921507570000002 | -19.256 |
| 1.092209229 | -19.309 |
| 1.0922677 | -19.305 |
| 1.0923261720000002 | -19.312 |
| 1.092384521 | -19.281 |
| 1.092443115 | -19.294 |
| 1.0925015869999999 | -19.248 |
| 1.092560059 | -19.259 |
| 1.09261853 | -19.521 |
| 1.0926770019999998 | -19.729 |
| 1.0927354740000002 | -19.842 |
| 1.092793945 | -19.782 |
| 1.092852539 | -19.686 |
| 1.092911011 | -19.66 |
| 1.0929696039999999 | -19.654 |
| 1.093028076 | -19.56 |
| 1.09308667 | -19.666 |
| 1.093145142 | -19.659 |
| 1.0932037350000001 | -19.545 |
| 1.093262207 | -19.497 |
| 1.0933208010000002 | -19.412 |
| 1.093379272 | -19.428 |
| 1.093437866 | -19.595 |
| 1.0934964600000001 | -19.613 |
| 1.0935550539999999 | -19.696 |
| 1.093613647 | -19.766 |
| 1.093672241 | -19.781 |
| 1.093730957 | -19.708 |
| 1.0937894289999999 | -19.618 |
| 1.093848145 | -19.573 |
| 1.0939067379999998 | -19.519 |
| 1.093965332 | -19.544 |
| 1.094023926 | -19.492 |
| 1.094082642 | -19.488 |
| 1.0941412350000002 | -19.425 |
| 1.094199951 | -19.361 |
| 1.094258545 | -19.333 |
| 1.0943172609999998 | -19.442 |
| 1.094375854 | -19.558 |
| 1.09443457 | -19.599 |
| 1.094493164 | -19.588 |
| 1.09455188 | -19.492 |
| 1.0946105959999999 | -19.354 |
| 1.094669312 | -19.381 |
| 1.0947280270000002 | -19.401 |
| 1.0947867429999998 | -19.521 |
| 1.0948454589999999 | -19.51 |
| 1.094904175 | -19.52 |
| 1.094963013 | -19.439 |
| 1.095021606 | -19.366 |
| 1.095080444 | -19.429 |
| 1.09513916 | -19.465 |
| 1.0951979980000002 | -19.549 |
| 1.095256714 | -19.575 |
| 1.095315552 | -19.625 |
| 1.095374268 | -19.569 |
| 1.0954331050000001 | -19.567 |
| 1.095491821 | -19.569 |
| 1.095550659 | -19.58 |
| 1.095609375 | -19.625 |
| 1.095668213 | -19.566 |
| 1.095726929 | -19.578 |
| 1.095785889 | -19.508 |
| 1.0958446039999998 | -19.409 |
| 1.0959035639999999 | -19.365 |
| 1.09596228 | -19.455 |
| 1.09602124 | -19.488 |
| 1.096079956 | -19.495 |
| 1.0961389160000001 | -19.617 |
| 1.096197876 | -19.607 |
| 1.096256592 | -19.711 |
| 1.096315552 | -19.716 |
| 1.09637439 | -19.757 |
| 1.09643335 | -19.866 |
| 1.096492188 | -19.932 |
| 1.096551147 | -19.951 |
| 1.096609985 | -19.919 |
| 1.0966689449999998 | -19.927 |
| 1.096727783 | -19.909 |
| 1.096786865 | -20.052 |
| 1.096845703 | -20.049 |
| 1.0969046630000001 | -20.185 |
| 1.0969636230000002 | -20.355 |
| 1.097022583 | -20.436 |
| 1.0970814210000002 | -20.338 |
| 1.097140503 | -20.232 |
| 1.097199463 | -20.266 |
| 1.097258423 | -20.144 |
| 1.097317383 | -20.141 |
| 1.097376465 | -20.148 |
| 1.0974354249999998 | -20.178 |
| 1.097494385 | -20.208 |
| 1.097553467 | -20.043 |
| 1.097612427 | -19.94 |
| 1.097671509 | -19.994 |
| 1.097730469 | -19.995 |
| 1.097789551 | -20.084 |
| 1.097848511 | -20.285 |
| 1.097907715 | -20.307 |
| 1.097966675 | -20.232 |
| 1.098025757 | -20.023 |
| 1.0980848390000002 | -19.904 |
| 1.0981439210000001 | -19.966 |
| 1.098202881 | -20.03 |
| 1.098262085 | -19.937 |
| 1.0983211670000002 | -20.063 |
| 1.098380249 | -19.952 |
| 1.098439331 | -19.818 |
| 1.098498535 | -19.693 |
| 1.098557495 | -19.588 |
| 1.098616699 | -19.64 |
| 1.0986757809999999 | -19.649 |
| 1.098734985 | -19.661 |
| 1.098794189 | -19.588 |
| 1.0988532709999999 | -19.689 |
| 1.098912476 | -19.654 |
| 1.098971558 | -19.672 |
| 1.099030884 | -19.687 |
| 1.099089966 | -19.796 |
| 1.09914917 | -19.899 |
| 1.099208252 | -19.981 |
| 1.0992675779999999 | -20.015 |
| 1.09932666 | -19.959 |
| 1.099385986 | -19.974 |
| 1.099445068 | -19.86 |
| 1.0995043949999999 | -19.841 |
| 1.0995635990000001 | -19.83 |
| 1.099622803 | -19.833 |
| 1.0996820070000002 | -19.853 |
| 1.0997413329999999 | -19.902 |
| 1.0998005370000001 | -19.898 |
| 1.0998598629999998 | -19.859 |
| 1.099919067 | -19.793 |
| 1.099978394 | -19.703 |
| 1.10003772 | -19.851 |
| 1.100096924 | -19.784 |
| 1.10015625 | -19.879 |
| 1.100215576 | -19.882 |
| 1.1002749020000002 | -19.903 |
| 1.100334106 | -19.759 |
| 1.1003935550000001 | -19.726 |
| 1.100452759 | -19.688 |
| 1.100512207 | -19.835 |
| 1.100571411 | -19.964 |
| 1.100630859 | -19.846 |
| 1.100690063 | -19.897 |
| 1.1007495120000002 | -19.823 |
| 1.1008088379999998 | -19.904 |
| 1.1008682859999999 | -19.828 |
| 1.100927612 | -20.014 |
| 1.100986938 | -20.011 |
| 1.101046265 | -20.177 |
| 1.101105713 | -20.153 |
| 1.101165161 | -20.129 |
| 1.1012246090000002 | -20.11 |
| 1.101284058 | -20.081 |
| 1.101343384 | -20.072 |
| 1.101402832 | -20.006 |
| 1.10146228 | -20.182 |
| 1.1015217290000001 | -20.074 |
| 1.1015811770000001 | -20.257 |
| 1.101640625 | -20.23 |
| 1.101700073 | -20.26 |
| 1.101759521 | -20.304 |
| 1.10181897 | -20.501 |
| 1.10187854 | -20.508 |
| 1.1019378659999999 | -20.444 |
| 1.101997437 | -20.441 |
| 1.1020568849999999 | -20.438 |
| 1.102116455 | -20.452 |
| 1.102175903 | -20.269 |
| 1.102235474 | -20.202 |
| 1.102294922 | -20.154 |
| 1.102354492 | -20.131 |
| 1.10241394 | -19.973 |
| 1.102473633 | -20.079 |
| 1.102533203 | -20.227 |
| 1.102592651 | -20.345 |
| 1.102652344 | -20.304 |
| 1.102711792 | -20.392 |
| 1.102771484 | -20.442 |
| 1.102830933 | -20.432 |
| 1.102890625 | -20.466 |
| 1.1029501949999998 | -20.566 |
| 1.103009766 | -20.745 |
| 1.1030693360000001 | -20.782 |
| 1.1031290280000001 | -20.797 |
| 1.103188599 | -20.726 |
| 1.103248291 | -20.62 |
| 1.103307861 | -20.665 |
| 1.1033675539999999 | -20.743 |
| 1.103427124 | -20.832 |
| 1.103486816 | -20.882 |
| 1.1035463870000002 | -20.895 |
| 1.103606079 | -20.82 |
| 1.103665771 | -20.759 |
| 1.103725464 | -20.761 |
| 1.1037851559999998 | -20.777 |
| 1.1038448490000001 | -20.747 |
| 1.1039045410000001 | -20.663 |
| 1.103964233 | -20.683 |
| 1.104023926 | -20.681 |
| 1.104083618 | -20.688 |
| 1.104143433 | -20.605 |
| 1.104203125 | -20.738 |
| 1.104262817 | -20.726 |
| 1.10432251 | -20.778 |
| 1.104382324 | -20.668 |
| 1.104442017 | -20.703 |
| 1.104501831 | -20.728 |
| 1.104561523 | -20.629 |
| 1.1046214600000002 | -20.612 |
| 1.1046811520000002 | -20.663 |
| 1.104740967 | -20.781 |
| 1.104800659 | -20.682 |
| 1.104860596 | -20.659 |
| 1.104920288 | -20.54 |
| 1.104980225 | -20.624 |
| 1.105040039 | -20.7 |
| 1.105099854 | -20.737 |
| 1.105159668 | -20.774 |
| 1.1052194819999999 | -20.843 |
| 1.105279419 | -20.837 |
| 1.105339111 | -20.715 |
| 1.105399048 | -20.73 |
| 1.1054588619999999 | -20.701 |
| 1.105518799 | -20.784 |
| 1.1055786129999998 | -20.753 |
| 1.1056385499999999 | -20.808 |
| 1.105698364 | -20.78 |
| 1.105758301 | -20.778 |
| 1.105818237 | -20.667 |
| 1.1058781739999999 | -20.533 |
| 1.105937988 | -20.509 |
| 1.1059980470000002 | -20.522 |
| 1.106057861 | -20.551 |
| 1.106117798 | -20.587 |
| 1.106177734 | -20.653 |
| 1.1062376710000001 | -20.553 |
| 1.1062977289999998 | -20.548 |
| 1.106357666 | -20.633 |
| 1.106417725 | -20.652 |
| 1.106477539 | -20.737 |
| 1.1065375979999998 | -20.778 |
| 1.106597534 | -20.814 |
| 1.106657593 | -20.827 |
| 1.106717529 | -20.727 |
| 1.106777588 | -20.78 |
| 1.1068375240000001 | -20.717 |
| 1.1068975829999999 | -20.615 |
| 1.106957642 | -20.418 |
| 1.1070177 | -20.489 |
| 1.1070776370000002 | -20.54 |
| 1.1071378170000001 | -20.659 |
| 1.107197754 | -20.667 |
| 1.107257813 | -20.7 |
| 1.107317871 | -20.697 |
| 1.107378052 | -20.637 |
| 1.1074379879999998 | -20.731 |
| 1.1074981689999999 | -20.692 |
| 1.10755835 | -20.935 |
| 1.107618286 | -20.953 |
| 1.107678467 | -21.075 |
| 1.107738525 | -21.121 |
| 1.107798706 | -21.117 |
| 1.107858765 | -21.085 |
| 1.107918945 | -21.057 |
| 1.107979004 | -21.114 |
| 1.108039307 | -21.128 |
| 1.108099365 | -21.212 |
| 1.108159546 | -21.063 |
| 1.1082196039999999 | -21.17 |
| 1.108279907 | -20.99 |
| 1.108339966 | -20.868 |
| 1.1084002689999999 | -20.699 |
| 1.108460327 | -20.575 |
| 1.10852063 | -20.488 |
| 1.108580811 | -20.35 |
| 1.108640991 | -20.34 |
| 1.108701172 | -20.449 |
| 1.108761475 | -20.521 |
| 1.1088217770000002 | -20.424 |
| 1.108881958 | -20.42 |
| 1.108942261 | -20.281 |
| 1.1090024410000001 | -20.297 |
| 1.109062744 | -20.303 |
| 1.1091229249999999 | -20.38 |
| 1.109183228 | -20.468 |
| 1.109243408 | -20.471 |
| 1.109303833 | -20.457 |
| 1.109364014 | -20.391 |
| 1.1094243160000001 | -20.176 |
| 1.109484619 | -20.078 |
| 1.109544922 | -20.156 |
| 1.109605225 | -20.147 |
| 1.109665649 | -20.363 |
| 1.1097258300000001 | -20.388 |
| 1.109786255 | -20.439 |
| 1.1098465579999999 | -20.572 |
| 1.109906982 | -20.487 |
| 1.109967285 | -20.46 |
| 1.11002771 | -20.624 |
| 1.110088135 | -20.655 |
| 1.110148438 | -20.723 |
| 1.110208862 | -20.841 |
| 1.1102691649999998 | -20.804 |
| 1.11032959 | -20.863 |
| 1.110389893 | -20.797 |
| 1.110450439 | -20.612 |
| 1.110510742 | -20.501 |
| 1.110571289 | -20.401 |
| 1.110631592 | -20.398 |
| 1.110692139 | -20.54 |
| 1.110752441 | -20.54 |
| 1.110812988 | -20.51 |
| 1.110873291 | -20.403 |
| 1.110933838 | -20.42 |
| 1.110994263 | -20.473 |
| 1.1110548100000002 | -20.532 |
| 1.1111152340000001 | -20.68 |
| 1.1111757809999998 | -20.974 |
| 1.111236206 | -20.931 |
| 1.111296753 | -20.802 |
| 1.1113572999999999 | -20.665 |
| 1.111417725 | -20.64 |
| 1.111478271 | -20.463 |
| 1.111538818 | -20.433 |
| 1.111599365 | -20.391 |
| 1.1116599120000001 | -20.404 |
| 1.1117204589999998 | -20.357 |
| 1.111780884 | -20.179 |
| 1.1118415529999999 | -20.189 |
| 1.1119021 | -20.183 |
| 1.111962646 | -20.235 |
| 1.112023193 | -20.162 |
| 1.112083862 | -20.339 |
| 1.112144409 | -20.298 |
| 1.112205078 | -20.177 |
| 1.112265625 | -20.141 |
| 1.112326294 | -20.144 |
| 1.112386841 | -20.167 |
| 1.11244751 | -20.088 |
| 1.112508057 | -20.106 |
| 1.112568726 | -20.072 |
| 1.112629395 | -20.086 |
| 1.112690063 | -19.978 |
| 1.112750732 | -19.924 |
| 1.112811279 | -19.922 |
| 1.1128720699999999 | -19.82 |
| 1.112932617 | -19.768 |
| 1.1129934080000001 | -19.59 |
| 1.113054077 | -19.573 |
| 1.113114746 | -19.566 |
| 1.113175415 | -19.584 |
| 1.113236206 | -19.56 |
| 1.113296875 | -19.608 |
| 1.1133576660000002 | -19.673 |
| 1.113418335 | -19.742 |
| 1.1134791259999999 | -19.715 |
| 1.1135397949999999 | -19.69 |
| 1.113600586 | -19.765 |
| 1.113661255 | -19.781 |
| 1.1137220460000001 | -19.757 |
| 1.113782837 | -19.721 |
| 1.1138436280000001 | -19.72 |
| 1.113904419 | -19.716 |
| 1.1139652100000002 | -19.565 |
| 1.114026001 | -19.413 |
| 1.1140867920000002 | -19.354 |
| 1.1141477050000002 | -19.389 |
| 1.114208374 | -19.386 |
| 1.1142692870000002 | -19.45 |
| 1.114330078 | -19.51 |
| 1.114390991 | -19.459 |
| 1.1144517820000002 | -19.562 |
| 1.114512695 | -19.584 |
| 1.114573486 | -19.596 |
| 1.114634399 | -19.641 |
| 1.11469519 | -19.815 |
| 1.114756104 | -19.659 |
| 1.114816895 | -19.757 |
| 1.114877808 | -19.677 |
| 1.114938721 | -19.598 |
| 1.114999634 | -19.666 |
| 1.1150605470000001 | -19.556 |
| 1.1151214600000001 | -19.359 |
| 1.115182495 | -19.389 |
| 1.115243286 | -19.359 |
| 1.115304321 | -19.268 |
| 1.1153652340000002 | -19.305 |
| 1.115426147 | -19.237 |
| 1.115487061 | -19.209 |
| 1.115548096 | -19.237 |
| 1.115609009 | -19.212 |
| 1.115670044 | -19.251 |
| 1.115730957 | -19.392 |
| 1.115791992 | -19.404 |
| 1.115852905 | -19.411 |
| 1.115914063 | -19.382 |
| 1.115974976 | -19.376 |
| 1.1160360109999998 | -19.349 |
| 1.116096924 | -19.439 |
| 1.116158081 | -19.423 |
| 1.116218994 | -19.373 |
| 1.116280151 | -19.323 |
| 1.116341064 | -19.262 |
| 1.1164022219999998 | -19.201 |
| 1.1164632570000002 | -19.189 |
| 1.116524414 | -19.154 |
| 1.116585449 | -19.161 |
| 1.116646484 | -19.208 |
| 1.1167076420000002 | -19.137 |
| 1.116768677 | -19.09 |
| 1.1168298339999998 | -19.107 |
| 1.1168908690000001 | -19.062 |
| 1.1169520259999999 | -19.035 |
| 1.117013184 | -19.117 |
| 1.117074341 | -19.08 |
| 1.117135376 | -19 |
| 1.117196533 | -18.951 |
| 1.11725769 | -18.875 |
| 1.1173188479999998 | -18.858 |
| 1.117380005 | -18.76 |
| 1.117441162 | -18.743 |
| 1.117502319 | -18.685 |
| 1.1175635990000001 | -18.637 |
| 1.1176247559999999 | -18.466 |
| 1.117685913 | -18.467 |
| 1.1177470699999998 | -18.618 |
| 1.11780835 | -18.699 |
| 1.117869629 | -18.762 |
| 1.1179307859999998 | -18.743 |
| 1.117992065 | -18.857 |
| 1.118053223 | -18.747 |
| 1.1181145019999998 | -18.693 |
| 1.118175781 | -18.694 |
| 1.118237061 | -18.758 |
| 1.1182982179999998 | -18.78 |
| 1.118359619 | -18.775 |
| 1.118420776 | -18.825 |
| 1.118482178 | -18.866 |
| 1.118543335 | -18.82 |
| 1.118604736 | -18.814 |
| 1.118665894 | -18.82 |
| 1.118727295 | -18.886 |
| 1.1187885739999999 | -18.858 |
| 1.118849976 | -18.9 |
| 1.118911255 | -18.941 |
| 1.118972656 | -18.988 |
| 1.1190339360000001 | -18.908 |
| 1.119095337 | -18.85 |
| 1.1191567379999998 | -18.946 |
| 1.119218018 | -18.869 |
| 1.119279541 | -18.85 |
| 1.119340942 | -18.84 |
| 1.119402344 | -18.925 |
| 1.1194636230000001 | -19.038 |
| 1.119525146 | -19.026 |
| 1.1195864260000001 | -18.956 |
| 1.119647949 | -18.949 |
| 1.1197092290000001 | -18.89 |
| 1.119770752 | -18.815 |
| 1.1198321530000002 | -18.718 |
| 1.119893677 | -18.767 |
| 1.119954956 | -18.783 |
| 1.1200164789999998 | -18.87 |
| 1.1200778809999998 | -18.832 |
| 1.1201394040000001 | -18.855 |
| 1.1202008060000002 | -18.765 |
| 1.120262329 | -18.694 |
| 1.1203238530000001 | -18.645 |
| 1.120385376 | -18.599 |
| 1.120446899 | -18.731 |
| 1.120508301 | -18.738 |
| 1.120569946 | -18.732 |
| 1.1206313479999999 | -18.715 |
| 1.1206929929999998 | -18.718 |
| 1.1207543949999998 | -18.748 |
| 1.12081604 | -18.772 |
| 1.1208774410000002 | -18.763 |
| 1.120939087 | -18.724 |
| 1.12100061 | -18.757 |
| 1.1210622559999999 | -18.785 |
| 1.121123779 | -18.854 |
| 1.121185425 | -18.901 |
| 1.121246948 | -18.873 |
| 1.121308594 | -18.83 |
| 1.1213701169999999 | -18.776 |
| 1.1214317630000001 | -18.757 |
| 1.121493286 | -18.82 |
| 1.121554932 | -18.957 |
| 1.121616577 | -19.005 |
| 1.121678223 | -18.939 |
| 1.12173999 | -18.908 |
| 1.121801514 | -19.014 |
| 1.121863281 | -18.929 |
| 1.1219248050000001 | -18.917 |
| 1.121986572 | -18.943 |
| 1.122048218 | -18.981 |
| 1.122109863 | -18.98 |
| 1.122171509 | -18.963 |
| 1.122233276 | -19.056 |
| 1.122294922 | -19.076 |
| 1.1223566889999999 | -19.182 |
| 1.122418335 | -19.196 |
| 1.122480103 | -19.311 |
| 1.1225417480000002 | -19.41 |
| 1.122603638 | -19.39 |
| 1.1226652830000001 | -19.451 |
| 1.122727051 | -19.49 |
| 1.122788818 | -19.476 |
| 1.122850586 | -19.388 |
| 1.122912231 | -19.46 |
| 1.122974121 | -19.417 |
| 1.123036011 | -19.419 |
| 1.1230976559999999 | -19.424 |
| 1.1231595460000001 | -19.412 |
| 1.123221313 | -19.525 |
| 1.123283203 | -19.507 |
| 1.123344849 | -19.605 |
| 1.123406738 | -19.634 |
| 1.123468506 | -19.647 |
| 1.123530396 | -19.652 |
| 1.123592285 | -19.695 |
| 1.123654175 | -19.636 |
| 1.123715942 | -19.663 |
| 1.123777832 | -19.702 |
| 1.123839722 | -19.642 |
| 1.123901611 | -19.681 |
| 1.123963379 | -19.677 |
| 1.124025391 | -19.68 |
| 1.124087158 | -19.677 |
| 1.12414917 | -19.671 |
| 1.1242110600000002 | -19.687 |
| 1.1242729489999999 | -19.835 |
| 1.124334961 | -19.884 |
| 1.124396851 | -19.823 |
| 1.124458862 | -19.766 |
| 1.124520752 | -19.729 |
| 1.124582764 | -19.736 |
| 1.124644653 | -19.836 |
| 1.124706665 | -19.792 |
| 1.1247685550000002 | -19.745 |
| 1.1248305660000002 | -19.755 |
| 1.1248925779999999 | -19.696 |
| 1.12495459 | -19.723 |
| 1.125016479 | -19.689 |
| 1.125078613 | -19.718 |
| 1.1251405030000001 | -19.769 |
| 1.1252026370000001 | -19.671 |
| 1.1252646480000001 | -19.492 |
| 1.12532666 | -19.536 |
| 1.1253886720000001 | -19.538 |
| 1.1254508060000001 | -19.538 |
| 1.125512817 | -19.482 |
| 1.1255748289999998 | -19.424 |
| 1.1256369629999998 | -19.39 |
| 1.125698975 | -19.368 |
| 1.1257611079999998 | -19.243 |
| 1.1258232419999998 | -19.277 |
| 1.125885376 | -19.405 |
| 1.125947388 | -19.465 |
| 1.1260095209999998 | -19.486 |
| 1.126071655 | -19.477 |
| 1.126133789 | -19.523 |
| 1.126195923 | -19.509 |
| 1.126258057 | -19.518 |
| 1.12632019 | -19.505 |
| 1.126382324 | -19.475 |
| 1.126444458 | -19.458 |
| 1.126506714 | -19.441 |
| 1.126568726 | -19.451 |
| 1.126630981 | -19.488 |
| 1.1266931150000001 | -19.426 |
| 1.126755371 | -19.33 |
| 1.126817505 | -19.306 |
| 1.1268797609999999 | -19.291 |
| 1.1269420170000002 | -19.327 |
| 1.127004272 | -19.437 |
| 1.127066528 | -19.532 |
| 1.127128662 | -19.591 |
| 1.127190918 | -19.577 |
| 1.127253174 | -19.599 |
| 1.1273154300000001 | -19.749 |
| 1.127377686 | -19.822 |
| 1.127439941 | -19.815 |
| 1.127502197 | -19.79 |
| 1.127564575 | -19.741 |
| 1.127626831 | -19.692 |
| 1.127689087 | -19.605 |
| 1.127751343 | -19.578 |
| 1.1278137209999999 | -19.651 |
| 1.127875977 | -19.545 |
| 1.1279383539999999 | -19.408 |
| 1.12800061 | -19.365 |
| 1.128062988 | -19.358 |
| 1.128125366 | -19.405 |
| 1.128187744 | -19.443 |
| 1.1282501219999999 | -19.537 |
| 1.1283125 | -19.543 |
| 1.128374878 | -19.496 |
| 1.1284371340000001 | -19.392 |
| 1.128499634 | -19.49 |
| 1.1285620120000002 | -19.589 |
| 1.12862439 | -19.535 |
| 1.1286867680000001 | -19.455 |
| 1.128749268 | -19.518 |
| 1.1288116460000002 | -19.538 |
| 1.128874023 | -19.578 |
| 1.128936401 | -19.625 |
| 1.1289989009999999 | -19.766 |
| 1.129061279 | -19.75 |
| 1.129123901 | -19.697 |
| 1.129186279 | -19.566 |
| 1.129248779 | -19.604 |
| 1.129311157 | -19.653 |
| 1.129373779 | -19.613 |
| 1.129436157 | -19.641 |
| 1.129498657 | -19.641 |
| 1.129561279 | -19.59 |
| 1.129623657 | -19.571 |
| 1.129686279 | -19.638 |
| 1.129748779 | -19.614 |
| 1.1298112790000001 | -19.585 |
| 1.129873779 | -19.51 |
| 1.129936401 | -19.518 |
| 1.129998901 | -19.491 |
| 1.1300615230000002 | -19.398 |
| 1.130124023 | -19.344 |
| 1.130186646 | -19.291 |
| 1.1302491460000001 | -19.241 |
| 1.130311768 | -19.155 |
| 1.1303743899999998 | -19.065 |
| 1.130437012 | -19.089 |
| 1.130499512 | -19.127 |
| 1.130562256 | -19.077 |
| 1.130624756 | -19.076 |
| 1.1306875 | -19.122 |
| 1.13075 | -19.075 |
| 1.130812744 | -19.167 |
| 1.1308754879999998 | -19.074 |
| 1.130937988 | -19.145 |
| 1.131000732 | -19.245 |
| 1.131063354 | -19.291 |
| 1.131126099 | -19.358 |
| 1.131188721 | -19.477 |
| 1.131251465 | -19.56 |
| 1.131314087 | -19.638 |
| 1.131376831 | -19.717 |
| 1.131439453 | -19.521 |
| 1.131502319 | -19.506 |
| 1.1315649410000002 | -19.43 |
| 1.131627686 | -19.435 |
| 1.1316904300000001 | -19.346 |
| 1.131753174 | -19.26 |
| 1.131815918 | -19.282 |
| 1.131878662 | -19.184 |
| 1.131941406 | -19.131 |
| 1.1320042719999999 | -19.155 |
| 1.132067017 | -19.243 |
| 1.1321297609999998 | -19.202 |
| 1.132192627 | -19.229 |
| 1.132255371 | -19.155 |
| 1.132318237 | -19.162 |
| 1.132380981 | -19.241 |
| 1.1324438479999999 | -19.201 |
| 1.132506714 | -19.221 |
| 1.1325695800000002 | -19.237 |
| 1.132632324 | -19.241 |
| 1.13269519 | -19.282 |
| 1.132758057 | -19.355 |
| 1.132820923 | -19.279 |
| 1.132883789 | -19.278 |
| 1.132946655 | -19.293 |
| 1.133009521 | -19.289 |
| 1.1330725099999999 | -19.277 |
| 1.133135376 | -19.243 |
| 1.133198242 | -19.219 |
| 1.133261108 | -19.109 |
| 1.133324097 | -19.157 |
| 1.133386963 | -19.177 |
| 1.133449951 | -19.162 |
| 1.133512939 | -19.221 |
| 1.133575806 | -19.206 |
| 1.1336389160000002 | -19.171 |
| 1.1337017820000002 | -19.189 |
| 1.133764771 | -19.224 |
| 1.133827759 | -19.249 |
| 1.133890747 | -19.233 |
| 1.1339536129999999 | -19.119 |
| 1.134016724 | -19.018 |
| 1.134079712 | -19.06 |
| 1.1341427000000002 | -19.087 |
| 1.134205688 | -19.13 |
| 1.134268799 | -19.228 |
| 1.134331787 | -19.228 |
| 1.134394897 | -19.287 |
| 1.134457764 | -19.29 |
| 1.1345208740000001 | -19.338 |
| 1.134583984 | -19.357 |
| 1.134647095 | -19.359 |
| 1.1347100829999999 | -19.463 |
| 1.134773193 | -19.457 |
| 1.134836304 | -19.427 |
| 1.134899414 | -19.357 |
| 1.134962524 | -19.417 |
| 1.1350256349999999 | -19.426 |
| 1.135088745 | -19.35 |
| 1.1351518550000002 | -19.328 |
| 1.135214966 | -19.389 |
| 1.135278076 | -19.539 |
| 1.135341309 | -19.495 |
| 1.1354044189999999 | -19.504 |
| 1.135467651 | -19.611 |
| 1.13553064 | -19.672 |
| 1.1355938719999998 | -19.689 |
| 1.135656982 | -19.779 |
| 1.135720337 | -19.922 |
| 1.1357834470000001 | -20.064 |
| 1.13584668 | -20.075 |
| 1.13590979 | -20.103 |
| 1.135973145 | -20.123 |
| 1.136036255 | -20.099 |
| 1.1360994869999999 | -20.229 |
| 1.136162842 | -20.192 |
| 1.136225952 | -20.17 |
| 1.136289307 | -20.099 |
| 1.136352539 | -20.043 |
| 1.136415894 | -19.962 |
| 1.1364790040000001 | -20 |
| 1.136542358 | -19.909 |
| 1.136605591 | -19.821 |
| 1.1366689449999998 | -19.978 |
| 1.136732178 | -19.919 |
| 1.136795532 | -19.99 |
| 1.136858765 | -19.951 |
| 1.136922241 | -20.007 |
| 1.136985474 | -20.08 |
| 1.137048828 | -20.18 |
| 1.137112061 | -20.139 |
| 1.137175537 | -20.322 |
| 1.13723877 | -20.439 |
| 1.137302246 | -20.406 |
| 1.137365479 | -20.424 |
| 1.137428955 | -20.402 |
| 1.137492432 | -20.433 |
| 1.1375557859999998 | -20.352 |
| 1.137619263 | -20.249 |
| 1.137682495 | -20.261 |
| 1.1377459719999998 | -20.239 |
| 1.137809326 | -20.147 |
| 1.137872803 | -20.232 |
| 1.137936279 | -20.277 |
| 1.137999756 | -20.211 |
| 1.13806311 | -20.238 |
| 1.138126587 | -20.207 |
| 1.138190063 | -20.242 |
| 1.13825354 | -20.361 |
| 1.138316895 | -20.228 |
| 1.1383804929999999 | -20.202 |
| 1.13844397 | -20.204 |
| 1.138507446 | -20.106 |
| 1.138570923 | -20.086 |
| 1.138634521 | -20.06 |
| 1.138697998 | -20.064 |
| 1.138761475 | -20.158 |
| 1.138825073 | -20.177 |
| 1.1388885499999999 | -20.092 |
| 1.138952148 | -20.204 |
| 1.139015747 | -20.386 |
| 1.139079346 | -20.351 |
| 1.139142822 | -20.421 |
| 1.1392064210000001 | -20.219 |
| 1.1392700199999999 | -20.25 |
| 1.139333618 | -20.216 |
| 1.139397095 | -20.172 |
| 1.1394608149999998 | -20.21 |
| 1.139524414 | -20.248 |
| 1.139588013 | -20.299 |
| 1.139651611 | -20.267 |
| 1.139715332 | -20.33 |
| 1.1397788089999998 | -20.318 |
| 1.139842529 | -20.458 |
| 1.139906128 | -20.499 |
| 1.139969849 | -20.46 |
| 1.140033447 | -20.503 |
| 1.140097168 | -20.527 |
| 1.140160889 | -20.535 |
| 1.1402246090000001 | -20.491 |
| 1.1402883300000002 | -20.418 |
| 1.140351929 | -20.419 |
| 1.140415771 | -20.375 |
| 1.14047937 | -20.398 |
| 1.140543213 | -20.353 |
| 1.140606812 | -20.441 |
| 1.140670654 | -20.514 |
| 1.140734375 | -20.492 |
| 1.140798096 | -20.66 |
| 1.1408618160000001 | -20.684 |
| 1.140925659 | -20.838 |
| 1.14098938 | -20.938 |
| 1.141053223 | -21.011 |
| 1.1411169429999999 | -20.981 |
| 1.1411807859999998 | -21.158 |
| 1.1412445070000001 | -21.242 |
| 1.14130835 | -21.25 |
| 1.141372192 | -21.158 |
| 1.141436035 | -20.964 |
| 1.141499878 | -20.879 |
| 1.141563721 | -20.764 |
| 1.141627563 | -20.643 |
| 1.1416914059999999 | -20.653 |
| 1.141755249 | -20.718 |
| 1.141819092 | -20.512 |
| 1.141883057 | -20.34 |
| 1.1419468990000001 | -20.226 |
| 1.1420107419999999 | -20.227 |
| 1.142074585 | -20.208 |
| 1.1421385499999999 | -20.33 |
| 1.142202393 | -20.37 |
| 1.142266357 | -20.487 |
| 1.142330322 | -20.415 |
| 1.1423942870000001 | -20.349 |
| 1.14245813 | -20.472 |
| 1.1425220950000001 | -20.497 |
| 1.1425860600000002 | -20.485 |
| 1.142650024 | -20.545 |
| 1.142713989 | -20.561 |
| 1.1427779539999998 | -20.477 |
| 1.1428420410000002 | -20.529 |
| 1.142906006 | -20.471 |
| 1.142969971 | -20.464 |
| 1.1430339360000001 | -20.517 |
| 1.143098022 | -20.501 |
| 1.143161987 | -20.615 |
| 1.143226074 | -20.656 |
| 1.143290039 | -20.563 |
| 1.143354126 | -20.631 |
| 1.143418091 | -20.701 |
| 1.143482178 | -20.611 |
| 1.143546143 | -20.601 |
| 1.1436103519999998 | -20.699 |
| 1.143674316 | -20.704 |
| 1.143738525 | -20.64 |
| 1.1438024900000001 | -20.581 |
| 1.143866699 | -20.594 |
| 1.143930664 | -20.762 |
| 1.143994873 | -20.873 |
| 1.1440589600000002 | -20.78 |
| 1.1441230470000001 | -20.947 |
| 1.144187256 | -21.061 |
| 1.1442513429999999 | -21.195 |
| 1.1443155520000001 | -21.197 |
| 1.144379639 | -21.29 |
| 1.1444438479999999 | -21.262 |
| 1.144507935 | -21.279 |
| 1.144572266 | -21.282 |
| 1.144636353 | -21.121 |
| 1.144700562 | -21.201 |
| 1.1447647710000002 | -21.049 |
| 1.144828979 | -20.921 |
| 1.144893188 | -20.767 |
| 1.144957397 | -20.782 |
| 1.145021606 | -20.785 |
| 1.1450858149999998 | -20.915 |
| 1.145150024 | -20.887 |
| 1.145214355 | -20.759 |
| 1.145278564 | -20.834 |
| 1.145342896 | -20.759 |
| 1.1454071039999998 | -20.761 |
| 1.145471436 | -20.846 |
| 1.1455357670000001 | -20.834 |
| 1.145599976 | -20.751 |
| 1.145664307 | -20.772 |
| 1.145728516 | -20.656 |
| 1.1457929690000002 | -20.625 |
| 1.145857178 | -20.727 |
| 1.145921631 | -20.716 |
| 1.14598584 | -20.8 |
| 1.146050293 | -20.667 |
| 1.1461145019999999 | -20.533 |
| 1.146178955 | -20.584 |
| 1.1462432859999998 | -20.716 |
| 1.146307617 | -20.682 |
| 1.146371948 | -20.707 |
| 1.1464364009999999 | -20.742 |
| 1.146500732 | -20.715 |
| 1.1465651860000001 | -20.687 |
| 1.146629517 | -20.694 |
| 1.14669397 | -20.895 |
| 1.146758423 | -20.95 |
| 1.1468228759999999 | -20.909 |
| 1.146887329 | -20.797 |
| 1.1469517820000001 | -20.697 |
| 1.1470162350000002 | -20.637 |
| 1.147080688 | -20.564 |
| 1.147145142 | -20.532 |
| 1.147209595 | -20.588 |
| 1.14727417 | -20.621 |
| 1.147338501 | -20.62 |
| 1.147403076 | -20.746 |
| 1.147467529 | -20.774 |
| 1.147532104 | -20.901 |
| 1.147596558 | -20.99 |
| 1.1476611330000002 | -21.033 |
| 1.147725586 | -21.019 |
| 1.1477901609999999 | -20.969 |
| 1.147854614 | -20.967 |
| 1.147919312 | -20.847 |
| 1.147983765 | -20.8 |
| 1.1480483400000001 | -20.718 |
| 1.148112915 | -20.717 |
| 1.1481774900000001 | -20.708 |
| 1.148242188 | -20.687 |
| 1.1483067630000001 | -20.678 |
| 1.148371338 | -20.798 |
| 1.148435913 | -20.818 |
| 1.1485006100000001 | -20.645 |
| 1.1485651860000001 | -20.674 |
| 1.1486298830000001 | -20.64 |
| 1.148694458 | -20.611 |
| 1.148759155 | -20.57 |
| 1.1488237300000002 | -20.475 |
| 1.148888428 | -20.562 |
| 1.1489530030000001 | -20.476 |
| 1.149017822 | -20.383 |
| 1.149082397 | -20.357 |
| 1.149147095 | -20.484 |
| 1.149211792 | -20.476 |
| 1.149276489 | -20.501 |
| 1.149341187 | -20.458 |
| 1.149406006 | -20.552 |
| 1.149470581 | -20.575 |
| 1.1495354 | -20.541 |
| 1.14960022 | -20.621 |
| 1.149664917 | -20.622 |
| 1.149729736 | -20.712 |
| 1.149794434 | -20.734 |
| 1.149859253 | -20.837 |
| 1.14992395 | -20.888 |
| 1.14998877 | -20.994 |
| 1.150053467 | -21 |
| 1.150118408 | -21.054 |
| 1.150183105 | -21.074 |
| 1.150248047 | -21.182 |
| 1.150312744 | -21.303 |
| 1.1503776860000001 | -21.404 |
| 1.1504423830000001 | -21.455 |
| 1.1505073239999999 | -21.553 |
| 1.150572144 | -21.632 |
| 1.150636963 | -21.734 |
| 1.150701782 | -21.735 |
| 1.1507667240000001 | -21.76 |
| 1.150831543 | -21.796 |
| 1.150896484 | -21.73 |
| 1.150961426 | -21.704 |
| 1.151026245 | -21.629 |
| 1.151091309 | -21.633 |
| 1.151156128 | -21.586 |
| 1.151221069 | -21.459 |
| 1.1512860109999998 | -21.443 |
| 1.151350952 | -21.468 |
| 1.151415771 | -21.417 |
| 1.151480835 | -21.361 |
| 1.1515457759999999 | -21.438 |
| 1.151610718 | -21.494 |
| 1.151675659 | -21.533 |
| 1.1517407229999999 | -21.522 |
| 1.151805664 | -21.489 |
| 1.151870728 | -21.572 |
| 1.151935669 | -21.55 |
| 1.1520007319999999 | -21.48 |
| 1.152065674 | -21.447 |
| 1.152130737 | -21.514 |
| 1.1521956789999999 | -21.52 |
| 1.152260864 | -21.411 |
| 1.152325928 | -21.281 |
| 1.152390869 | -21.213 |
| 1.152456055 | -21.128 |
| 1.152520996 | -21.103 |
| 1.152586182 | -21.192 |
| 1.152651245 | -21.279 |
| 1.1527163089999999 | -21.341 |
| 1.152781372 | -21.313 |
| 1.152846558 | -21.312 |
| 1.1529116209999999 | -21.531 |
| 1.152976807 | -21.685 |
| 1.15304187 | -21.676 |
| 1.153107056 | -21.657 |
| 1.1531721190000002 | -21.706 |
| 1.1532373050000002 | -21.578 |
| 1.1533023679999999 | -21.557 |
| 1.153367676 | -21.689 |
| 1.153432739 | -21.638 |
| 1.153497925 | -21.584 |
| 1.1535631100000001 | -21.517 |
| 1.153628418 | -21.412 |
| 1.153693604 | -21.488 |
| 1.153758789 | -21.57 |
| 1.153824097 | -21.535 |
| 1.1538891599999999 | -21.574 |
| 1.153954468 | -21.669 |
| 1.154019653 | -21.556 |
| 1.1540849610000001 | -21.798 |
| 1.1541501459999999 | -21.834 |
| 1.1542154539999998 | -21.904 |
| 1.1542806399999999 | -21.943 |
| 1.154346069 | -22.067 |
| 1.154411255 | -21.992 |
| 1.154476563 | -22.023 |
| 1.15454187 | -22.165 |
| 1.154607178 | -22.059 |
| 1.154672485 | -22.137 |
| 1.154737793 | -21.987 |
| 1.154803101 | -22.018 |
| 1.15486853 | -21.901 |
| 1.154933716 | -21.999 |
| 1.1549991460000002 | -21.907 |
| 1.1550645750000001 | -21.94 |
| 1.155129883 | -22.012 |
| 1.155195313 | -22.012 |
| 1.15526062 | -22.162 |
| 1.15532605 | -22.2 |
| 1.155391357 | -22.141 |
| 1.155456909 | -22.071 |
| 1.155522217 | -21.85 |
| 1.1555876459999999 | -21.756 |
| 1.1556530760000001 | -21.657 |
| 1.155718506 | -21.511 |
| 1.155783936 | -21.449 |
| 1.1558493650000001 | -21.219 |
| 1.155914795 | -21.039 |
| 1.1559803469999999 | -20.894 |
| 1.156045776 | -20.815 |
| 1.156111206 | -20.833 |
| 1.1561766359999999 | -20.92 |
| 1.156242188 | -20.985 |
| 1.156307617 | -20.92 |
| 1.1563731689999999 | -21.121 |
| 1.1564388429999999 | -20.969 |
| 1.1565042719999998 | -20.988 |
| 1.156569824 | -20.947 |
| 1.156635254 | -20.975 |
| 1.156700928 | -20.942 |
| 1.156766357 | -20.986 |
| 1.156832031 | -21.051 |
| 1.156897461 | -21.04 |
| 1.156963135 | -21.139 |
| 1.157028687 | -21.08 |
| 1.15709436 | -21.24 |
| 1.15715979 | -21.299 |
| 1.1572254640000001 | -21.374 |
| 1.1572910159999998 | -21.36 |
| 1.157356689 | -21.365 |
| 1.157422241 | -21.325 |
| 1.157487915 | -21.332 |
| 1.1575535890000002 | -21.307 |
| 1.157619263 | -21.306 |
| 1.157684814 | -21.273 |
| 1.1577506100000001 | -21.341 |
| 1.157816162 | -21.452 |
| 1.157881958 | -21.566 |
| 1.1579476320000002 | -21.712 |
| 1.158013306 | -21.974 |
| 1.158078979 | -22.055 |
| 1.1581446530000001 | -22.082 |
| 1.158210449 | -22.06 |
| 1.158276123 | -22.027 |
| 1.158341919 | -22.117 |
| 1.158407593 | -21.856 |
| 1.158473389 | -21.622 |
| 1.1585390629999999 | -21.465 |
| 1.158604858 | -21.16 |
| 1.1586705320000001 | -20.925 |
| 1.1587364500000001 | -20.802 |
| 1.1588021240000002 | -20.702 |
| 1.1588679199999998 | -20.683 |
| 1.158933716 | -20.802 |
| 1.158999512 | -20.79 |
| 1.159065308 | -20.873 |
| 1.159131226 | -20.841 |
| 1.1591968990000001 | -20.884 |
| 1.1592628170000001 | -20.976 |
| 1.159328735 | -21.107 |
| 1.159394531 | -20.996 |
| 1.159460449 | -21.078 |
| 1.1595262450000001 | -21.074 |
| 1.1595921630000001 | -20.985 |
| 1.1596579589999998 | -20.879 |
| 1.1597238769999998 | -20.911 |
| 1.159789795 | -21.049 |
| 1.159855713 | -21.064 |
| 1.159921509 | -21.2 |
| 1.159987549 | -21.172 |
| 1.1600533450000001 | -21.28 |
| 1.160119385 | -21.325 |
| 1.160185303 | -21.241 |
| 1.160251221 | -21.116 |
| 1.160317139 | -21.113 |
| 1.1603831789999999 | -20.925 |
| 1.1604490969999999 | -20.788 |
| 1.1605151370000002 | -20.709 |
| 1.1605810550000002 | -20.524 |
| 1.160647095 | -20.366 |
| 1.160713135 | -20.322 |
| 1.160779053 | -20.159 |
| 1.1608450929999998 | -20.114 |
| 1.1609111330000002 | -20.156 |
| 1.160977173 | -20.172 |
| 1.161043213 | -20.135 |
| 1.161109253 | -20.099 |
| 1.161175293 | -20.066 |
| 1.161241333 | -20.038 |
| 1.161307373 | -20.096 |
| 1.1613735349999998 | -20.066 |
| 1.161439453 | -20.055 |
| 1.161505615 | -20.179 |
| 1.161571655 | -20.25 |
| 1.1616378170000001 | -20.293 |
| 1.161703857 | -20.441 |
| 1.1617700199999998 | -20.499 |
| 1.161836182 | -20.598 |
| 1.161902344 | -20.739 |
| 1.161968384 | -20.896 |
| 1.162034668 | -20.914 |
| 1.1621008300000002 | -21.101 |
| 1.16216687 | -21.074 |
| 1.162233154 | -21.106 |
| 1.1622993160000001 | -21.099 |
| 1.162365479 | -21.139 |
| 1.162431641 | -21.302 |
| 1.1624979249999998 | -21.295 |
| 1.162564087 | -21.248 |
| 1.1626303709999999 | -21.163 |
| 1.162696533 | -21.254 |
| 1.162762817 | -21.185 |
| 1.162828979 | -21.095 |
| 1.162895264 | -20.978 |
| 1.162961426 | -20.962 |
| 1.1630277100000002 | -20.773 |
| 1.163093994 | -20.624 |
| 1.163160278 | -20.583 |
| 1.163226563 | -20.518 |
| 1.163292847 | -20.476 |
| 1.163359253 | -20.387 |
| 1.1634254149999999 | -20.358 |
| 1.163491821 | -20.278 |
| 1.1635581050000001 | -20.175 |
| 1.1636245120000002 | -20.014 |
| 1.163690796 | -19.981 |
| 1.163757202 | -19.942 |
| 1.163823486 | -19.981 |
| 1.1638898930000001 | -19.994 |
| 1.163956177 | -19.987 |
| 1.164022583 | -19.938 |
| 1.1640889890000001 | -19.926 |
| 1.1641553960000002 | -19.952 |
| 1.16422168 | -19.906 |
| 1.1642882079999999 | -19.925 |
| 1.164354492 | -20.062 |
| 1.1644210210000001 | -20.186 |
| 1.164487427 | -20.044 |
| 1.164553833 | -20.041 |
| 1.164620239 | -20.083 |
| 1.164686768 | -20.069 |
| 1.164753296 | -19.98 |
| 1.164819702 | -20.112 |
| 1.16488623 | -20.239 |
| 1.164952637 | -20.379 |
| 1.165019165 | -20.514 |
| 1.165085571 | -20.418 |
| 1.165152222 | -20.494 |
| 1.165218628 | -20.555 |
| 1.165285156 | -20.536 |
| 1.165351685 | -20.616 |
| 1.165418213 | -20.659 |
| 1.165484741 | -20.517 |
| 1.165551392 | -20.442 |
| 1.165617798 | -20.435 |
| 1.165684448 | -20.349 |
| 1.1657509769999999 | -20.433 |
| 1.1658176269999998 | -20.28 |
| 1.1658841549999999 | -20.222 |
| 1.1659508060000001 | -20.2 |
| 1.166017334 | -20.249 |
| 1.1660839840000001 | -20.277 |
| 1.166150635 | -20.25 |
| 1.166217163 | -20.248 |
| 1.1662839360000001 | -20.22 |
| 1.1663504640000002 | -20.095 |
| 1.166417236 | -19.963 |
| 1.166483765 | -20.085 |
| 1.166550537 | -20.108 |
| 1.1666170649999998 | -20.116 |
| 1.166683838 | -20.082 |
| 1.166750488 | -20.03 |
| 1.1668172609999998 | -20.148 |
| 1.166883911 | -20.208 |
| 1.166950684 | -20.342 |
| 1.1670173339999999 | -20.584 |
| 1.1670841060000001 | -20.592 |
| 1.1671507570000001 | -20.675 |
| 1.167217529 | -20.742 |
| 1.16728418 | -20.893 |
| 1.167351074 | -20.966 |
| 1.167417725 | -21.084 |
| 1.1674846190000001 | -21.141 |
| 1.167551392 | -21.115 |
| 1.167618164 | -21.026 |
| 1.167684937 | -20.845 |
| 1.1677517089999998 | -21.007 |
| 1.167818604 | -21.001 |
| 1.1678853759999999 | -20.969 |
| 1.167952271 | -20.798 |
| 1.168018921 | -20.678 |
| 1.168085815 | -20.543 |
| 1.16815271 | -20.364 |
| 1.168219604 | -20.298 |
| 1.1682863769999998 | -20.195 |
| 1.168353271 | -20.086 |
| 1.1684200439999999 | -19.921 |
| 1.168487061 | -19.771 |
| 1.168553833 | -19.67 |
| 1.16862085 | -19.677 |
| 1.168687622 | -19.715 |
| 1.168754639 | -19.772 |
| 1.168821533 | -19.938 |
| 1.16888855 | -20.027 |
| 1.1689555660000002 | -20.167 |
| 1.169022339 | -20.334 |
| 1.169089355 | -20.566 |
| 1.16915625 | -20.67 |
| 1.169223389 | -20.858 |
| 1.169290283 | -20.842 |
| 1.1693573 | -21.012 |
| 1.1694241939999999 | -21.174 |
| 1.169491211 | -21.146 |
| 1.169558228 | -21.283 |
| 1.1696252440000001 | -21.16 |
| 1.169692261 | -21.234 |
| 1.169759277 | -21.075 |
| 1.169826294 | -21.201 |
| 1.169893433 | -21.186 |
| 1.169960449 | -21.263 |
| 1.170027466 | -21.087 |
| 1.1700944819999999 | -20.876 |
| 1.1701616209999999 | -20.777 |
| 1.170228638 | -20.707 |
| 1.170295776 | -20.671 |
| 1.170363037 | -20.484 |
| 1.1704300539999999 | -20.457 |
| 1.170497192 | -20.419 |
| 1.170564331 | -20.304 |
| 1.17063147 | -20.27 |
| 1.170698486 | -20.323 |
| 1.170765747 | -20.469 |
| 1.170832886 | -20.556 |
| 1.170900024 | -20.487 |
| 1.170967163 | -20.5 |
| 1.171034424 | -20.538 |
| 1.171101563 | -20.519 |
| 1.171168823 | -20.406 |
| 1.17123584 | -20.433 |
| 1.1713032229999998 | -20.378 |
| 1.171370361 | -20.37 |
| 1.171437622 | -20.256 |
| 1.171504761 | -20.176 |
| 1.171572021 | -20.222 |
| 1.1716392820000001 | -20.286 |
| 1.171706543 | -20.344 |
| 1.171773926 | -20.43 |
| 1.1718410639999999 | -20.563 |
| 1.171908447 | -20.663 |
| 1.171975586 | -20.821 |
| 1.172042969 | -20.846 |
| 1.1721102289999998 | -20.94 |
| 1.172177612 | -20.958 |
| 1.1722448730000001 | -20.889 |
| 1.1723122559999999 | -20.782 |
| 1.172379517 | -20.733 |
| 1.172446899 | -20.679 |
| 1.17251416 | -20.58 |
| 1.172581543 | -20.423 |
| 1.1726489260000001 | -20.284 |
| 1.172716309 | -20.175 |
| 1.172783569 | -20.137 |
| 1.172851074 | -20.134 |
| 1.172918457 | -20.189 |
| 1.17298584 | -20.291 |
| 1.173053223 | -20.381 |
| 1.173120728 | -20.445 |
| 1.173188232 | -20.487 |
| 1.1732554929999999 | -20.728 |
| 1.1733229980000002 | -20.769 |
| 1.173390381 | -20.738 |
| 1.173457886 | -20.73 |
| 1.1735253909999999 | -20.758 |
| 1.1735928960000002 | -20.679 |
| 1.173660278 | -20.659 |
| 1.1737277830000001 | -20.628 |
| 1.173795288 | -20.701 |
| 1.173862793 | -20.701 |
| 1.173930298 | -20.63 |
| 1.173997803 | -20.628 |
| 1.1740653079999999 | -20.817 |
| 1.174132935 | -20.908 |
| 1.174200317 | -20.912 |
| 1.174267944 | -21.005 |
| 1.174335449 | -20.924 |
| 1.1744030760000002 | -20.948 |
| 1.174470581 | -20.829 |
| 1.174538208 | -20.806 |
| 1.1746058350000002 | -20.711 |
| 1.174673462 | -20.641 |
| 1.174741089 | -20.565 |
| 1.1748085940000002 | -20.543 |
| 1.174876343 | -20.485 |
| 1.1749438479999998 | -20.487 |
| 1.175011597 | -20.475 |
| 1.175079102 | -20.473 |
| 1.175146851 | -20.43 |
| 1.175214478 | -20.448 |
| 1.1752821039999999 | -20.38 |
| 1.175349731 | -20.399 |
| 1.1754174800000001 | -20.359 |
| 1.1754851069999999 | -20.183 |
| 1.175552856 | -20.214 |
| 1.1756204829999999 | -20.136 |
| 1.175688232 | -20.181 |
| 1.175755981 | -20.092 |
| 1.17582373 | -20.071 |
| 1.175891357 | -19.903 |
| 1.175959229 | -19.91 |
| 1.1760269780000001 | -19.779 |
| 1.176094727 | -19.707 |
| 1.176162598 | -19.707 |
| 1.176230225 | -19.624 |
| 1.176298096 | -19.652 |
| 1.176365845 | -19.568 |
| 1.176433716 | -19.497 |
| 1.176501465 | -19.536 |
| 1.176569336 | -19.662 |
| 1.176637085 | -19.643 |
| 1.176704956 | -19.723 |
| 1.176772705 | -19.658 |
| 1.176840576 | -19.757 |
| 1.176908447 | -19.73 |
| 1.176976318 | -19.662 |
| 1.177044067 | -19.675 |
| 1.177112061 | -19.78 |
| 1.1771798100000002 | -19.76 |
| 1.177247803 | -19.778 |
| 1.177315674 | -19.853 |
| 1.177383667 | -20.017 |
| 1.17745166 | -20.171 |
| 1.177519409 | -20.087 |
| 1.1775874020000001 | -20.158 |
| 1.177655273 | -20.245 |
| 1.177723389 | -20.439 |
| 1.17779126 | -20.454 |
| 1.177859253 | -20.563 |
| 1.177927124 | -20.529 |
| 1.1779952390000001 | -20.549 |
| 1.17806311 | -20.485 |
| 1.178131104 | -20.542 |
| 1.178199097 | -20.665 |
| 1.178267212 | -20.755 |
| 1.178335083 | -20.749 |
| 1.178403198 | -20.644 |
| 1.178471191 | -20.649 |
| 1.178539307 | -20.607 |
| 1.1786073 | -20.725 |
| 1.1786754149999998 | -20.658 |
| 1.178743408 | -20.675 |
| 1.178811523 | -20.606 |
| 1.178879639 | -20.724 |
| 1.178947632 | -20.666 |
| 1.179015869 | -20.658 |
| 1.179083862 | -20.755 |
| 1.1791519780000002 | -20.949 |
| 1.1792200929999999 | -21.066 |
| 1.179288208 | -21.005 |
| 1.179356323 | -21.086 |
| 1.179424561 | -21.094 |
| 1.1794926760000002 | -21.128 |
| 1.179560791 | -21.115 |
| 1.1796289059999998 | -21.251 |
| 1.179697144 | -21.337 |
| 1.179765259 | -21.31 |
| 1.1798334959999999 | -21.066 |
| 1.179901733 | -20.996 |
| 1.179969971 | -21.098 |
| 1.180038086 | -21.156 |
| 1.180106323 | -21.093 |
| 1.180174561 | -21.24 |
| 1.180242798 | -21.128 |
| 1.180311157 | -21.105 |
| 1.180379272 | -21.124 |
| 1.1804476320000001 | -21.198 |
| 1.1805158690000002 | -21.25 |
| 1.1805842290000002 | -21.413 |
| 1.180652466 | -21.494 |
| 1.180720825 | -21.602 |
| 1.18078894 | -21.762 |
| 1.180857422 | -21.681 |
| 1.180925659 | -21.891 |
| 1.180994019 | -21.968 |
| 1.181062256 | -21.999 |
| 1.181130615 | -21.957 |
| 1.181198975 | -21.994 |
| 1.181267334 | -21.842 |
| 1.181335693 | -21.748 |
| 1.181404053 | -21.725 |
| 1.181472412 | -21.726 |
| 1.181540894 | -21.661 |
| 1.1816091309999999 | -21.362 |
| 1.1816776119999999 | -21.172 |
| 1.1817460940000002 | -20.94 |
| 1.1818144529999999 | -20.702 |
| 1.1818829350000002 | -20.622 |
| 1.1819512939999999 | -20.446 |
| 1.182019897 | -20.266 |
| 1.1820882570000002 | -20.121 |
| 1.182156738 | -20.072 |
| 1.182225098 | -20.064 |
| 1.182293701 | -20.111 |
| 1.182362061 | -20.19 |
| 1.182430664 | -20.282 |
| 1.182499023 | -20.568 |
| 1.1825676269999998 | -20.627 |
| 1.1826361079999999 | -20.792 |
| 1.182704712 | -20.999 |
| 1.182773193 | -21.231 |
| 1.182841797 | -21.23 |
| 1.182910278 | -21.336 |
| 1.182978882 | -21.459 |
| 1.1830473629999998 | -21.485 |
| 1.183115967 | -21.579 |
| 1.1831845699999999 | -21.372 |
| 1.1832531739999999 | -21.302 |
| 1.1833217770000002 | -21.135 |
| 1.183390259 | -20.984 |
| 1.183458984 | -20.74 |
| 1.183527588 | -20.567 |
| 1.1835961910000001 | -20.314 |
| 1.1836647949999999 | -20.2 |
| 1.1837335210000002 | -20.104 |
| 1.183802124 | -20.059 |
| 1.18387085 | -19.946 |
| 1.183939453 | -19.932 |
| 1.1840081789999999 | -19.946 |
| 1.184076782 | -19.941 |
| 1.184145508 | -19.968 |
| 1.184214111 | -20.058 |
| 1.184282837 | -20.191 |
| 1.1843515629999999 | -20.244 |
| 1.184420288 | -20.294 |
| 1.184489014 | -20.323 |
| 1.1845577390000002 | -20.433 |
| 1.184626587 | -20.535 |
| 1.184695313 | -20.696 |
| 1.1847641599999998 | -20.794 |
| 1.184832764 | -20.955 |
| 1.184901611 | -21.098 |
| 1.184970337 | -21.104 |
| 1.1850391850000002 | -21.092 |
| 1.18510791 | -21.035 |
| 1.18517688 | -20.978 |
| 1.185245605 | -21.036 |
| 1.185314453 | -21.047 |
| 1.185383179 | -21.005 |
| 1.185452148 | -20.966 |
| 1.185520874 | -20.798 |
| 1.1855898440000001 | -20.757 |
| 1.1856585689999999 | -20.826 |
| 1.185727539 | -20.828 |
| 1.1857963870000001 | -20.791 |
| 1.185865356 | -20.816 |
| 1.1859342039999998 | -20.755 |
| 1.1860031739999999 | -20.733 |
| 1.186072144 | -20.758 |
| 1.186140991 | -20.784 |
| 1.186209961 | -20.85 |
| 1.1862788089999998 | -20.733 |
| 1.186347778 | -20.663 |
| 1.186416748 | -20.76 |
| 1.186485718 | -20.871 |
| 1.186554688 | -20.913 |
| 1.1866236570000002 | -20.915 |
| 1.186692627 | -20.836 |
| 1.1867615969999998 | -20.845 |
| 1.186830566 | -21.048 |
| 1.186899658 | -21.107 |
| 1.186968628 | -21.253 |
| 1.18703772 | -21.381 |
| 1.187106689 | -21.322 |
| 1.1871757809999999 | -21.321 |
| 1.187244751 | -21.385 |
| 1.1873138429999999 | -21.361 |
| 1.187382813 | -21.531 |
| 1.1874520259999999 | -21.579 |
| 1.1875211179999998 | -21.468 |
| 1.18759021 | -21.514 |
| 1.187659302 | -21.65 |
| 1.187728394 | -21.78 |
| 1.1877974850000002 | -21.949 |
| 1.187866577 | -22.13 |
| 1.1879357910000001 | -22.147 |
| 1.188004883 | -22.468 |
| 1.1880740969999999 | -22.387 |
| 1.188143188 | -22.362 |
| 1.188212402 | -22.45 |
| 1.1882814940000002 | -22.424 |
| 1.188350708 | -22.39 |
| 1.1884198 | -22.333 |
| 1.1884891359999998 | -22.354 |
| 1.188558228 | -22.329 |
| 1.1886274410000002 | -22.442 |
| 1.188696655 | -22.339 |
| 1.188765991 | -22.313 |
| 1.1888350829999998 | -22.228 |
| 1.188904419 | -22.09 |
| 1.188973755 | -22.057 |
| 1.1890428469999998 | -21.851 |
| 1.189112183 | -21.747 |
| 1.189181396 | -21.616 |
| 1.1892507319999999 | -21.539 |
| 1.189320068 | -21.416 |
| 1.189389404 | -21.379 |
| 1.189458618 | -21.631 |
| 1.1895279539999999 | -21.826 |
| 1.18959729 | -21.931 |
| 1.189666626 | -22.059 |
| 1.1897359619999999 | -22.185 |
| 1.189805298 | -22.293 |
| 1.189874634 | -22.35 |
| 1.189944092 | -22.363 |
| 1.190013306 | -22.292 |
| 1.190082764 | -22.202 |
| 1.1901521 | -21.885 |
| 1.190221558 | -21.706 |
| 1.1902908939999999 | -21.506 |
| 1.190360352 | -21.398 |
| 1.1904298100000001 | -21.342 |
| 1.190499268 | -21.202 |
| 1.190568726 | -21.225 |
| 1.1906380619999999 | -21.167 |
| 1.190707642 | -21.226 |
| 1.1907769780000002 | -21.336 |
| 1.190846558 | -21.332 |
| 1.190915894 | -21.347 |
| 1.190985474 | -21.58 |
| 1.191054932 | -21.676 |
| 1.191124512 | -21.775 |
| 1.19119397 | -21.857 |
| 1.19126355 | -21.72 |
| 1.191333008 | -21.806 |
| 1.1914025879999999 | -21.815 |
| 1.1914720460000001 | -21.665 |
| 1.191541626 | -21.731 |
| 1.1916110839999998 | -21.685 |
| 1.1916807859999998 | -21.489 |
| 1.191750244 | -21.431 |
| 1.191819946 | -21.47 |
| 1.191889526 | -21.582 |
| 1.191959106 | -21.708 |
| 1.192028809 | -21.724 |
| 1.192098267 | -21.856 |
| 1.192167969 | -21.943 |
| 1.192237549 | -21.972 |
| 1.192307251 | -22.126 |
| 1.192376831 | -22.215 |
| 1.192446533 | -22.031 |
| 1.192516113 | -22.052 |
| 1.192585938 | -21.923 |
| 1.192655518 | -21.764 |
| 1.19272522 | -21.862 |
| 1.192794922 | -21.721 |
| 1.192864624 | -21.739 |
| 1.192934326 | -21.603 |
| 1.193004028 | -21.607 |
| 1.19307373 | -21.572 |
| 1.193143555 | -21.653 |
| 1.193213257 | -21.534 |
| 1.1932830810000001 | -21.563 |
| 1.193352905 | -21.641 |
| 1.193422607 | -21.536 |
| 1.193492432 | -21.579 |
| 1.193562134 | -21.633 |
| 1.1936319579999999 | -21.832 |
| 1.1937016599999999 | -21.717 |
| 1.193771606 | -21.763 |
| 1.193841309 | -21.901 |
| 1.193911255 | -21.849 |
| 1.193980957 | -21.948 |
| 1.1940509030000002 | -21.929 |
| 1.1941207280000001 | -21.831 |
| 1.194190552 | -21.758 |
| 1.194260376 | -21.772 |
| 1.194330322 | -21.842 |
| 1.194400146 | -21.953 |
| 1.1944700929999998 | -22.061 |
| 1.194539917 | -22.172 |
| 1.194609863 | -22.165 |
| 1.19467981 | -22.064 |
| 1.194749756 | -22.229 |
| 1.194819702 | -22.356 |
| 1.194889648 | -22.413 |
| 1.194959595 | -22.434 |
| 1.195029541 | -22.306 |
| 1.1950996090000001 | -22.202 |
| 1.1951694339999999 | -22.133 |
| 1.195239502 | -22.095 |
| 1.195309448 | -22.348 |
| 1.1953795170000001 | -22.467 |
| 1.1954494629999999 | -22.333 |
| 1.195519531 | -22.393 |
| 1.195589478 | -22.406 |
| 1.1956595460000001 | -22.492 |
| 1.195729492 | -22.577 |
| 1.195799683 | -22.748 |
| 1.195869629 | -22.656 |
| 1.195939697 | -22.537 |
| 1.196009766 | -22.505 |
| 1.196079956 | -22.512 |
| 1.1961499020000002 | -22.542 |
| 1.196220093 | -22.416 |
| 1.196290283 | -22.335 |
| 1.196360352 | -22.235 |
| 1.196430542 | -22.32 |
| 1.1965004879999999 | -22.325 |
| 1.196570801 | -22.378 |
| 1.196640869 | -22.494 |
| 1.1967110600000002 | -22.42 |
| 1.196781128 | -22.394 |
| 1.196851318 | -22.473 |
| 1.196921509 | -22.593 |
| 1.196991699 | -22.626 |
| 1.1970618899999999 | -22.788 |
| 1.19713208 | -22.726 |
| 1.197202271 | -22.709 |
| 1.197272583 | -22.833 |
| 1.1973427730000001 | -22.678 |
| 1.1974129640000002 | -22.596 |
| 1.197483154 | -22.579 |
| 1.1975534669999999 | -22.423 |
| 1.197623657 | -22.413 |
| 1.1976940919999999 | -22.482 |
| 1.197764404 | -22.262 |
| 1.197834595 | -22.182 |
| 1.197904907 | -22.168 |
| 1.19797522 | -22.103 |
| 1.198045532 | -22.163 |
| 1.198115845 | -22.226 |
| 1.198186157 | -22.166 |
| 1.19825647 | -22.137 |
| 1.198326904 | -21.997 |
| 1.198397217 | -22.045 |
| 1.1984676509999999 | -21.957 |
| 1.198537842 | -22.008 |
| 1.1986082759999999 | -21.983 |
| 1.198678589 | -21.983 |
| 1.1987491460000002 | -22.148 |
| 1.198819458 | -22.124 |
| 1.198889893 | -21.996 |
| 1.1989602050000001 | -22.228 |
| 1.199030762 | -22.33 |
| 1.1991010739999999 | -22.415 |
| 1.199171631 | -22.668 |
| 1.199242188 | -22.722 |
| 1.1993125 | -22.9 |
| 1.199383057 | -22.939 |
| 1.199453491 | -22.782 |
| 1.199524048 | -22.833 |
| 1.199594482 | -23.083 |
| 1.1996650389999999 | -22.935 |
| 1.1997354740000001 | -22.945 |
| 1.19980603 | -22.765 |
| 1.199876465 | -22.51 |
| 1.199947144 | -22.344 |
| 1.200017578 | -22.063 |
| 1.200088135 | -22.091 |
| 1.2001586910000002 | -22.028 |
| 1.200229248 | -22.036 |
| 1.200299805 | -22.004 |
| 1.200370483 | -22.009 |
| 1.2004410399999998 | -21.977 |
| 1.200511597 | -21.971 |
| 1.200582153 | -22.128 |
| 1.200652832 | -22.227 |
| 1.2007235109999999 | -22.417 |
| 1.2007940670000001 | -22.321 |
| 1.2008648679999998 | -22.414 |
| 1.200935425 | -22.452 |
| 1.201006104 | -22.58 |
| 1.2010767820000001 | -22.734 |
| 1.201147461 | -22.864 |
| 1.20121814 | -22.966 |
| 1.201288818 | -23.012 |
| 1.2013594969999999 | -22.966 |
| 1.201430298 | -22.871 |
| 1.2015008539999998 | -23.04 |
| 1.201571655 | -22.952 |
| 1.201642334 | -22.969 |
| 1.2017131349999999 | -22.797 |
| 1.201783813 | -22.653 |
| 1.2018546140000002 | -22.539 |
| 1.2019254149999998 | -22.575 |
| 1.201996216 | -22.442 |
| 1.202066895 | -22.531 |
| 1.202137817 | -22.474 |
| 1.2022086179999998 | -22.385 |
| 1.202279419 | -22.345 |
| 1.20235022 | -22.266 |
| 1.2024210210000001 | -22.292 |
| 1.202491943 | -22.459 |
| 1.202562744 | -22.516 |
| 1.202633667 | -22.481 |
| 1.202704346 | -22.57 |
| 1.2027753909999999 | -22.604 |
| 1.2028461910000001 | -22.788 |
| 1.2029171140000001 | -22.67 |
| 1.202987915 | -22.786 |
| 1.203058838 | -22.914 |
| 1.203129761 | -22.93 |
| 1.203200684 | -22.96 |
| 1.203271606 | -23.082 |
| 1.203342529 | -23.035 |
| 1.203413452 | -22.947 |
| 1.2034844969999998 | -22.834 |
| 1.203555298 | -22.606 |
| 1.2036263429999998 | -22.757 |
| 1.2036973880000001 | -22.676 |
| 1.2037683110000001 | -22.477 |
| 1.2038393550000002 | -22.41 |
| 1.2039102780000002 | -22.224 |
| 1.203981323 | -22.128 |
| 1.204052368 | -22.125 |
| 1.204123413 | -22.258 |
| 1.204194336 | -22.178 |
| 1.204265503 | -22.306 |
| 1.204336426 | -22.282 |
| 1.204407593 | -22.347 |
| 1.204478638 | -22.455 |
| 1.204549683 | -22.599 |
| 1.204620728 | -22.65 |
| 1.2046918949999998 | -22.619 |
| 1.2047629389999999 | -22.555 |
| 1.204834106 | -22.485 |
| 1.204905151 | -22.543 |
| 1.204976318 | -22.448 |
| 1.2050473629999998 | -22.349 |
| 1.2051186520000001 | -22.218 |
| 1.2051898189999999 | -22.266 |
| 1.205260986 | -22.245 |
| 1.205332153 | -22.205 |
| 1.2054033199999998 | -22.247 |
| 1.205474487 | -22.482 |
| 1.205545654 | -22.472 |
| 1.2056169429999999 | -22.474 |
| 1.20568811 | -22.579 |
| 1.205759399 | -22.639 |
| 1.2058305660000002 | -22.784 |
| 1.205901855 | -22.576 |
| 1.205973022 | -22.54 |
| 1.206044312 | -22.606 |
| 1.2061154790000002 | -22.557 |
| 1.20618689 | -22.395 |
| 1.206258057 | -22.396 |
| 1.206329346 | -22.357 |
| 1.206400635 | -22.381 |
| 1.206471924 | -22.311 |
| 1.206543213 | -22.247 |
| 1.206614624 | -22.365 |
| 1.206686035 | -22.326 |
| 1.206757324 | -22.273 |
| 1.206828735 | -22.215 |
| 1.206900024 | -22.26 |
| 1.2069714360000001 | -22.259 |
| 1.207042725 | -22.279 |
| 1.207114136 | -22.223 |
| 1.2071854249999998 | -22.343 |
| 1.2072569579999999 | -22.491 |
| 1.207328247 | -22.614 |
| 1.20739978 | -22.61 |
| 1.207471069 | -22.805 |
| 1.207542603 | -22.852 |
| 1.2076138920000001 | -22.84 |
| 1.207685425 | -22.889 |
| 1.207756836 | -22.889 |
| 1.207828369 | -22.902 |
| 1.20789978 | -22.9 |
| 1.207971313 | -22.684 |
| 1.208042725 | -22.572 |
| 1.2081142580000002 | -22.591 |
| 1.2081859130000001 | -22.364 |
| 1.2082573239999999 | -22.455 |
| 1.208328857 | -22.399 |
| 1.2084003909999999 | -22.458 |
| 1.208471924 | -22.581 |
| 1.208543457 | -22.619 |
| 1.208615112 | -22.601 |
| 1.2086865230000001 | -22.697 |
| 1.208758179 | -22.815 |
| 1.208829712 | -22.848 |
| 1.208901367 | -22.86 |
| 1.2089729 | -22.892 |
| 1.209044556 | -22.989 |
| 1.2091160890000001 | -22.875 |
| 1.209187866 | -22.85 |
| 1.209259399 | -22.852 |
| 1.209331055 | -22.845 |
| 1.20940271 | -22.876 |
| 1.209474365 | -22.828 |
| 1.209546143 | -22.724 |
| 1.209617798 | -22.677 |
| 1.209689453 | -22.563 |
| 1.209761108 | -22.663 |
| 1.2098328859999998 | -22.697 |
| 1.209904541 | -22.675 |
| 1.209976318 | -22.743 |
| 1.210047974 | -22.805 |
| 1.210119751 | -22.824 |
| 1.2101914059999999 | -22.713 |
| 1.210263306 | -22.779 |
| 1.210334961 | -22.976 |
| 1.2104067379999999 | -23.207 |
| 1.210478516 | -23.24 |
| 1.210550293 | -23.285 |
| 1.2106220699999999 | -23.286 |
| 1.2106939700000001 | -23.288 |
| 1.210765625 | -23.355 |
| 1.210837524 | -23.307 |
| 1.2109093020000001 | -23.363 |
| 1.210981201 | -23.299 |
| 1.211053101 | -23.241 |
| 1.2111248780000001 | -22.974 |
| 1.211196899 | -22.766 |
| 1.211268677 | -22.664 |
| 1.211340576 | -22.763 |
| 1.2114123540000001 | -22.708 |
| 1.211484375 | -22.662 |
| 1.2115561520000002 | -22.71 |
| 1.211628174 | -22.694 |
| 1.211700073 | -22.765 |
| 1.211772095 | -22.797 |
| 1.211843872 | -23.015 |
| 1.2119158939999999 | -23.06 |
| 1.211987793 | -23.234 |
| 1.212059814 | -23.11 |
| 1.212131714 | -22.997 |
| 1.2122037350000001 | -23.029 |
| 1.212275757 | -23.068 |
| 1.212347778 | -23.183 |
| 1.212419678 | -23.11 |
| 1.212491821 | -23.017 |
| 1.2125638429999999 | -22.819 |
| 1.2126358640000001 | -22.738 |
| 1.2127080080000001 | -22.689 |
| 1.212779907 | -22.738 |
| 1.212852051 | -22.833 |
| 1.212924072 | -22.71 |
| 1.212996216 | -22.633 |
| 1.2130682369999999 | -22.648 |
| 1.2131403809999999 | -22.743 |
| 1.2132124020000001 | -22.788 |
| 1.2132845460000001 | -22.896 |
| 1.213356689 | -23.005 |
| 1.213428833 | -22.992 |
| 1.2135008539999999 | -23.047 |
| 1.21357312 | -23.138 |
| 1.213645142 | -23.159 |
| 1.213717407 | -23.225 |
| 1.213789551 | -23.286 |
| 1.213861816 | -23.397 |
| 1.213933838 | -23.556 |
| 1.214006104 | -23.504 |
| 1.214078369 | -23.696 |
| 1.214150513 | -23.796 |
| 1.2142229 | -23.764 |
| 1.214295044 | -23.715 |
| 1.21436731 | -23.75 |
| 1.214439453 | -23.856 |
| 1.214511841 | -23.851 |
| 1.2145839840000001 | -23.811 |
| 1.2146563719999999 | -23.67 |
| 1.2147285159999999 | -23.724 |
| 1.214800903 | -23.416 |
| 1.2148731689999999 | -23.298 |
| 1.214945557 | -23.235 |
| 1.215017822 | -23.198 |
| 1.21509021 | -23.147 |
| 1.215162476 | -22.954 |
| 1.2152348629999998 | -22.908 |
| 1.215307129 | -22.838 |
| 1.2153795170000001 | -22.796 |
| 1.2154517820000001 | -22.796 |
| 1.215524292 | -22.866 |
| 1.215596802 | -22.869 |
| 1.215669067 | -22.872 |
| 1.215741577 | -22.896 |
| 1.2158138429999998 | -22.84 |
| 1.2158863530000001 | -22.941 |
| 1.21595874 | -22.705 |
| 1.21603125 | -22.765 |
| 1.216103638 | -22.858 |
| 1.2161761469999999 | -22.884 |
| 1.2162485349999999 | -22.902 |
| 1.216321045 | -23.03 |
| 1.216393433 | -23.119 |
| 1.216466064 | -23.086 |
| 1.216538452 | -23.221 |
| 1.216610962 | -23.136 |
| 1.216683472 | -23.283 |
| 1.2167561040000001 | -23.345 |
| 1.216828491 | -23.283 |
| 1.2169011230000002 | -23.354 |
| 1.216973633 | -23.38 |
| 1.217046265 | -23.288 |
| 1.217118896 | -23.168 |
| 1.217191406 | -23.281 |
| 1.217264038 | -23.262 |
| 1.217336548 | -23.37 |
| 1.2174091800000002 | -23.412 |
| 1.217481689 | -23.365 |
| 1.217554443 | -23.368 |
| 1.217626953 | -23.324 |
| 1.217699707 | -23.344 |
| 1.217772217 | -23.268 |
| 1.2178449709999999 | -23.304 |
| 1.217917603 | -23.235 |
| 1.217990356 | -23.288 |
| 1.218062866 | -23.212 |
| 1.2181357419999999 | -23.302 |
| 1.218208252 | -23.293 |
| 1.218281128 | -23.396 |
| 1.21835376 | -23.357 |
| 1.218426514 | -23.31 |
| 1.218499146 | -23.34 |
| 1.218572021 | -23.453 |
| 1.218644775 | -23.28 |
| 1.218717529 | -23.275 |
| 1.2187902830000001 | -23.332 |
| 1.218863037 | -23.255 |
| 1.218935913 | -23.174 |
| 1.2190085449999999 | -22.964 |
| 1.219081421 | -22.893 |
| 1.219154175 | -22.952 |
| 1.219227051 | -23.061 |
| 1.2192998050000001 | -23.02 |
| 1.219372803 | -23.288 |
| 1.219445557 | -23.191 |
| 1.219518433 | -23.172 |
| 1.219591187 | -23.264 |
| 1.219664185 | -23.309 |
| 1.219736938 | -23.527 |
| 1.219809937 | -23.582 |
| 1.219882813 | -23.637 |
| 1.219955688 | -23.547 |
| 1.220028564 | -23.569 |
| 1.2201015629999998 | -23.51 |
| 1.220174561 | -23.407 |
| 1.220247437 | -23.398 |
| 1.220320435 | -23.199 |
| 1.220393311 | -23.241 |
| 1.2204663089999999 | -23.262 |
| 1.220539307 | -23.301 |
| 1.2206123050000002 | -23.215 |
| 1.220685303 | -23.358 |
| 1.220758301 | -23.233 |
| 1.2208312989999999 | -23.155 |
| 1.2209042970000001 | -23.234 |
| 1.220977417 | -23.276 |
| 1.221050415 | -23.395 |
| 1.221123413 | -23.37 |
| 1.221196533 | -23.343 |
| 1.221269531 | -23.289 |
| 1.2213426509999998 | -23.248 |
| 1.221415771 | -23.146 |
| 1.22148877 | -23.164 |
| 1.22156189 | -23.208 |
| 1.22163501 | -23.398 |
| 1.22170813 | -23.414 |
| 1.22178125 | -23.385 |
| 1.22185437 | -23.431 |
| 1.2219274900000001 | -23.436 |
| 1.22200061 | -23.501 |
| 1.2220738530000002 | -23.526 |
| 1.2221469729999999 | -23.551 |
| 1.222220093 | -23.645 |
| 1.222293335 | -23.788 |
| 1.222366577 | -23.783 |
| 1.2224398189999999 | -23.716 |
| 1.222513062 | -23.742 |
| 1.222586182 | -23.663 |
| 1.222659424 | -23.586 |
| 1.2227326660000002 | -23.462 |
| 1.222805908 | -23.402 |
| 1.22287915 | -23.389 |
| 1.2229523930000001 | -23.369 |
| 1.223025757 | -23.261 |
| 1.223098999 | -23.106 |
| 1.2231722409999999 | -23.332 |
| 1.223245605 | -23.289 |
| 1.223318848 | -23.279 |
| 1.223392212 | -23.309 |
| 1.2234655760000002 | -23.331 |
| 1.223538818 | -23.446 |
| 1.223612183 | -23.439 |
| 1.223685547 | -23.304 |
| 1.223758911 | -23.375 |
| 1.223832275 | -23.323 |
| 1.22390564 | -23.077 |
| 1.223979126 | -23.095 |
| 1.22405249 | -23.039 |
| 1.224125854 | -22.983 |
| 1.224199341 | -22.981 |
| 1.2242727050000002 | -22.872 |
| 1.2243461910000002 | -22.8 |
| 1.224419556 | -22.895 |
| 1.224493042 | -22.758 |
| 1.224566528 | -22.9 |
| 1.2246400149999999 | -23.024 |
| 1.2247135009999999 | -22.967 |
| 1.2247869869999999 | -23.012 |
| 1.224860474 | -23.091 |
| 1.22493396 | -23.221 |
| 1.225007446 | -23.413 |
| 1.2250809329999999 | -23.467 |
| 1.2251544189999999 | -23.395 |
| 1.2252280270000002 | -23.347 |
| 1.225301514 | -23.336 |
| 1.225375122 | -23.24 |
| 1.22544873 | -23.329 |
| 1.225522339 | -23.44 |
| 1.225595947 | -23.477 |
| 1.2256694339999998 | -23.403 |
| 1.225743042 | -23.304 |
| 1.22581665 | -23.2 |
| 1.225890259 | -23.362 |
| 1.225963867 | -23.56 |
| 1.2260375979999998 | -23.552 |
| 1.2261112060000001 | -23.741 |
| 1.226184814 | -23.802 |
| 1.2262585449999999 | -23.611 |
| 1.226332153 | -23.552 |
| 1.226405884 | -23.456 |
| 1.226479492 | -23.319 |
| 1.2265532229999998 | -23.466 |
| 1.226626953 | -23.369 |
| 1.2267006839999999 | -23.19 |
| 1.2267744139999999 | -22.997 |
| 1.226848145 | -22.87 |
| 1.226921875 | -22.797 |
| 1.2269956050000002 | -22.77 |
| 1.227069458 | -22.801 |
| 1.227143188 | -22.915 |
| 1.227216919 | -22.937 |
| 1.227290771 | -22.816 |
| 1.227364502 | -22.885 |
| 1.2274383539999998 | -22.98 |
| 1.227512085 | -23.117 |
| 1.227585938 | -23.088 |
| 1.22765979 | -23.196 |
| 1.227733643 | -23.216 |
| 1.227807495 | -23.097 |
| 1.227881348 | -23.062 |
| 1.2279552 | -23.182 |
| 1.228029053 | -23.321 |
| 1.2281029049999999 | -23.323 |
| 1.22817688 | -23.289 |
| 1.228250732 | -23.342 |
| 1.228324585 | -23.298 |
| 1.22839856 | -23.196 |
| 1.2284724120000001 | -23.186 |
| 1.228546509 | -23.275 |
| 1.228620361 | -23.36 |
| 1.228694336 | -23.343 |
| 1.228768311 | -23.281 |
| 1.228842285 | -23.25 |
| 1.2289162599999999 | -23.172 |
| 1.228990234 | -22.987 |
| 1.229064209 | -22.911 |
| 1.229138306 | -22.905 |
| 1.22921228 | -22.964 |
| 1.2292862549999999 | -23.064 |
| 1.2293603519999998 | -22.921 |
| 1.229434326 | -22.94 |
| 1.229508423 | -22.962 |
| 1.22958252 | -22.793 |
| 1.229656494 | -22.902 |
| 1.229730591 | -22.935 |
| 1.229804688 | -22.937 |
| 1.229878784 | -23.007 |
| 1.229952881 | -23.06 |
| 1.2300269780000002 | -22.995 |
| 1.2301011960000001 | -22.985 |
| 1.230175293 | -22.984 |
| 1.230249512 | -22.909 |
| 1.230323608 | -23.15 |
| 1.230397827 | -23.127 |
| 1.230471924 | -23.169 |
| 1.230546143 | -23.412 |
| 1.230620361 | -23.502 |
| 1.2306944579999999 | -23.491 |
| 1.230768677 | -23.423 |
| 1.2308428960000002 | -23.413 |
| 1.2309171140000001 | -23.414 |
| 1.230991333 | -23.561 |
| 1.231065552 | -23.39 |
| 1.231139893 | -23.375 |
| 1.231214111 | -23.459 |
| 1.2312883300000002 | -23.4 |
| 1.231362671 | -23.216 |
| 1.23143689 | -23.23 |
| 1.2315112300000002 | -23.253 |
| 1.231585571 | -23.264 |
| 1.231659912 | -23.304 |
| 1.2317342530000002 | -23.299 |
| 1.231808594 | -23.362 |
| 1.231882935 | -23.396 |
| 1.231957275 | -23.428 |
| 1.232031616 | -23.463 |
| 1.232105957 | -23.65 |
| 1.232180298 | -23.58 |
| 1.2322547609999999 | -23.565 |
| 1.232329102 | -23.694 |
| 1.232403442 | -23.603 |
| 1.2324779049999999 | -23.602 |
| 1.232552368 | -23.617 |
| 1.2326267089999998 | -23.669 |
| 1.232701172 | -23.684 |
| 1.2327756349999999 | -23.733 |
| 1.232850098 | -23.622 |
| 1.2329245610000001 | -23.603 |
| 1.232999023 | -23.672 |
| 1.233073486 | -23.709 |
| 1.233147949 | -23.846 |
| 1.233222534 | -23.722 |
| 1.2332969969999998 | -23.701 |
| 1.233371582 | -23.697 |
| 1.233446045 | -23.674 |
| 1.23352063 | -23.601 |
| 1.233595215 | -23.629 |
| 1.233669678 | -23.767 |
| 1.233744263 | -23.694 |
| 1.2338188479999999 | -23.565 |
| 1.233893433 | -23.538 |
| 1.233968018 | -23.645 |
| 1.234042603 | -23.692 |
| 1.234117188 | -23.721 |
| 1.234191895 | -23.693 |
| 1.234266479 | -23.721 |
| 1.2343410639999999 | -23.741 |
| 1.2344157709999999 | -23.659 |
| 1.234490356 | -23.632 |
| 1.234565063 | -23.744 |
| 1.234639771 | -23.741 |
| 1.2347143550000002 | -23.824 |
| 1.2347891850000001 | -23.68 |
| 1.2348638920000001 | -23.613 |
| 1.2349385990000001 | -23.729 |
| 1.2350133060000001 | -23.642 |
| 1.2350880130000002 | -23.505 |
| 1.23516272 | -23.568 |
| 1.235237427 | -23.649 |
| 1.2353122559999998 | -23.685 |
| 1.2353869629999998 | -23.645 |
| 1.2354617920000002 | -23.472 |
| 1.235536499 | -23.565 |
| 1.235611328 | -23.468 |
| 1.2356861570000002 | -23.38 |
| 1.2357608640000002 | -23.332 |
| 1.235835693 | -23.492 |
| 1.235910522 | -23.436 |
| 1.235985352 | -23.451 |
| 1.236060181 | -23.347 |
| 1.236135132 | -23.329 |
| 1.236209961 | -23.42 |
| 1.2362849120000001 | -23.432 |
| 1.236359741 | -23.481 |
| 1.236434692 | -23.531 |
| 1.236509521 | -23.738 |
| 1.236584473 | -23.761 |
| 1.236659302 | -23.777 |
| 1.236734253 | -23.719 |
| 1.2368092039999998 | -23.944 |
| 1.236884155 | -23.902 |
| 1.236959106 | -23.868 |
| 1.2370340579999999 | -23.935 |
| 1.237109009 | -24.04 |
| 1.23718396 | -23.911 |
| 1.237259033 | -23.909 |
| 1.2373339840000002 | -23.759 |
| 1.237408936 | -23.918 |
| 1.237484009 | -23.931 |
| 1.237559082 | -23.774 |
| 1.237634033 | -23.78 |
| 1.237709106 | -23.72 |
| 1.23778418 | -23.585 |
| 1.237859253 | -23.545 |
| 1.237934326 | -23.711 |
| 1.238009399 | -23.743 |
| 1.2380844729999998 | -23.847 |
| 1.238159668 | -23.755 |
| 1.238234741 | -23.796 |
| 1.238309814 | -23.904 |
| 1.23838501 | -23.987 |
| 1.2384600829999999 | -24.122 |
| 1.238535278 | -24.155 |
| 1.238610352 | -24.049 |
| 1.238685547 | -23.947 |
| 1.238760742 | -23.901 |
| 1.238835938 | -23.875 |
| 1.238911011 | -23.846 |
| 1.238986206 | -23.824 |
| 1.2390615230000002 | -23.623 |
| 1.239136719 | -23.634 |
| 1.239211914 | -23.702 |
| 1.2392871090000002 | -23.732 |
| 1.239362427 | -23.879 |
| 1.2394377440000002 | -23.888 |
| 1.239512939 | -23.746 |
| 1.239588257 | -23.747 |
| 1.239663452 | -23.741 |
| 1.23973877 | -23.788 |
| 1.239814087 | -23.931 |
| 1.239889404 | -23.931 |
| 1.2399647219999999 | -23.97 |
| 1.240040039 | -23.973 |
| 1.240115356 | -23.889 |
| 1.240190674 | -23.986 |
| 1.240266113 | -24.054 |
| 1.240341431 | -24.076 |
| 1.2404167480000001 | -23.95 |
| 1.240492188 | -23.898 |
| 1.240567505 | -24.018 |
| 1.240642944 | -24.026 |
| 1.240718384 | -23.901 |
| 1.240793823 | -24.079 |
| 1.240869263 | -24.138 |
| 1.24094458 | -24.09 |
| 1.241020142 | -24.075 |
| 1.241095581 | -23.966 |
| 1.2411710210000002 | -24.01 |
| 1.241246582 | -23.964 |
| 1.241322021 | -23.819 |
| 1.241397461 | -23.78 |
| 1.2414730219999999 | -23.806 |
| 1.241548462 | -23.767 |
| 1.2416240230000002 | -23.824 |
| 1.241699585 | -23.799 |
| 1.241775146 | -23.793 |
| 1.241850586 | -23.86 |
| 1.2419261469999998 | -23.855 |
| 1.242001709 | -23.775 |
| 1.242077271 | -23.712 |
| 1.2421529539999998 | -23.734 |
| 1.242228516 | -23.827 |
| 1.242304077 | -23.776 |
| 1.242379639 | -23.658 |
| 1.242455322 | -23.532 |
| 1.242530884 | -23.486 |
| 1.242606689 | -23.588 |
| 1.242682251 | -23.781 |
| 1.242757935 | -23.833 |
| 1.242833618 | -24.094 |
| 1.242909302 | -24.111 |
| 1.242984985 | -23.925 |
| 1.243060669 | -23.969 |
| 1.2431363530000001 | -24.068 |
| 1.2432120359999999 | -24.216 |
| 1.243287842 | -24.232 |
| 1.243363525 | -24.078 |
| 1.243439209 | -23.953 |
| 1.243515015 | -24.044 |
| 1.243590698 | -23.835 |
| 1.243666626 | -23.832 |
| 1.243742432 | -23.881 |
| 1.243818115 | -23.707 |
| 1.2438939210000002 | -23.686 |
| 1.2439697269999999 | -23.692 |
| 1.2440455320000001 | -23.727 |
| 1.2441214600000001 | -23.792 |
| 1.2441972659999998 | -23.845 |
| 1.244273071 | -23.859 |
| 1.244348999 | -23.813 |
| 1.2444248050000002 | -23.785 |
| 1.2445007319999999 | -23.864 |
| 1.244576538 | -23.959 |
| 1.244652466 | -23.853 |
| 1.244728394 | -23.878 |
| 1.2448041989999998 | -23.91 |
| 1.2448801269999998 | -23.791 |
| 1.244956055 | -23.701 |
| 1.245031982 | -23.768 |
| 1.24510791 | -23.844 |
| 1.24518396 | -23.94 |
| 1.245259888 | -23.756 |
| 1.245335815 | -23.733 |
| 1.2454118650000001 | -23.797 |
| 1.2454877930000001 | -23.733 |
| 1.245563843 | -23.589 |
| 1.245639771 | -23.544 |
| 1.2457159420000001 | -23.679 |
| 1.24579187 | -23.495 |
| 1.24586792 | -23.486 |
| 1.2459439700000001 | -23.341 |
| 1.24602002 | -23.48 |
| 1.246096069 | -23.387 |
| 1.246172241 | -23.46 |
| 1.2462482910000001 | -23.53 |
| 1.246324341 | -23.618 |
| 1.2464003909999999 | -23.676 |
| 1.2464765629999999 | -23.6 |
| 1.246552734 | -23.517 |
| 1.246628784 | -23.371 |
| 1.246704956 | -23.445 |
| 1.246781128 | -23.394 |
| 1.246857178 | -23.403 |
| 1.24693335 | -23.322 |
| 1.2470095209999998 | -23.28 |
| 1.247085693 | -23.309 |
| 1.247161987 | -23.393 |
| 1.247238159 | -23.226 |
| 1.247314453 | -23.449 |
| 1.247390625 | -23.531 |
| 1.247466919 | -23.538 |
| 1.247543091 | -23.521 |
| 1.247619385 | -23.619 |
| 1.247695679 | -23.672 |
| 1.247771851 | -23.654 |
| 1.2478481449999999 | -23.582 |
| 1.247924438 | -23.687 |
| 1.248000732 | -23.766 |
| 1.248077026 | -23.743 |
| 1.24815332 | -23.813 |
| 1.248229736 | -23.71 |
| 1.24830603 | -23.719 |
| 1.2483823239999998 | -23.798 |
| 1.24845874 | -23.817 |
| 1.248535034 | -23.852 |
| 1.24861145 | -23.859 |
| 1.248687866 | -23.688 |
| 1.24876416 | -23.858 |
| 1.248840576 | -23.846 |
| 1.2489171140000002 | -23.898 |
| 1.24899353 | -24.021 |
| 1.249069946 | -24.083 |
| 1.2491463619999998 | -23.943 |
| 1.249222778 | -23.776 |
| 1.249299194 | -23.743 |
| 1.249375732 | -23.729 |
| 1.249452148 | -23.804 |
| 1.249528687 | -23.686 |
| 1.2496051030000002 | -23.57 |
| 1.249681641 | -23.498 |
| 1.2497581789999999 | -23.523 |
| 1.249834717 | -23.511 |
| 1.249911255 | -23.659 |
| 1.249987793 | -23.824 |
| 1.2500643310000001 | -23.863 |
| 1.250140869 | -23.857 |
| 1.250217407 | -23.9 |
| 1.250293945 | -23.843 |
| 1.250370605 | -23.959 |
| 1.250447144 | -24.018 |
| 1.250523804 | -23.864 |
| 1.2506004640000001 | -23.725 |
| 1.250677124 | -23.583 |
| 1.2507536620000002 | -23.395 |
| 1.250830322 | -23.412 |
| 1.250906982 | -23.519 |
| 1.250983643 | -23.487 |
| 1.251060303 | -23.621 |
| 1.251136963 | -23.539 |
| 1.251213745 | -23.585 |
| 1.251290405 | -23.739 |
| 1.251367065 | -23.806 |
| 1.2514438479999999 | -23.897 |
| 1.251520508 | -24.148 |
| 1.2515972899999999 | -24.032 |
| 1.25167395 | -24.057 |
| 1.2517507319999999 | -23.989 |
| 1.251827515 | -23.899 |
| 1.251904297 | -24.073 |
| 1.2519810789999999 | -23.947 |
| 1.2520579829999998 | -24.006 |
| 1.252134766 | -24.057 |
| 1.252211548 | -24.044 |
| 1.25228833 | -23.932 |
| 1.252365234 | -23.9 |
| 1.2524420170000001 | -23.899 |
| 1.252518921 | -23.966 |
| 1.252595703 | -24.032 |
| 1.252672607 | -23.973 |
| 1.252749512 | -23.981 |
| 1.252826416 | -23.837 |
| 1.25290332 | -23.862 |
| 1.252980225 | -23.967 |
| 1.253057129 | -23.952 |
| 1.253134033 | -24.082 |
| 1.253210938 | -24.105 |
| 1.253287842 | -24.045 |
| 1.2533648679999998 | -24.022 |
| 1.253441772 | -23.956 |
| 1.2535187989999999 | -23.884 |
| 1.253595703 | -23.879 |
| 1.253672852 | -23.982 |
| 1.253749756 | -23.809 |
| 1.2538267820000002 | -23.909 |
| 1.2539038089999999 | -23.874 |
| 1.2539808350000001 | -23.664 |
| 1.254057861 | -23.589 |
| 1.254134888 | -23.675 |
| 1.254212036 | -23.713 |
| 1.2542890629999999 | -23.93 |
| 1.2543660890000001 | -23.954 |
| 1.254443237 | -23.949 |
| 1.254520264 | -24.148 |
| 1.254597412 | -24.037 |
| 1.254674561 | -24.109 |
| 1.254751587 | -24.262 |
| 1.254828735 | -24.255 |
| 1.254905884 | -24.133 |
| 1.2549830320000002 | -24.146 |
| 1.2550601810000002 | -23.943 |
| 1.255137451 | -23.843 |
| 1.2552146 | -23.8 |
| 1.25529187 | -23.705 |
| 1.255369019 | -23.679 |
| 1.255446289 | -23.589 |
| 1.255523438 | -23.626 |
| 1.255600708 | -23.63 |
| 1.255677979 | -23.632 |
| 1.2557551269999998 | -23.592 |
| 1.2558323969999998 | -23.722 |
| 1.255909668 | -23.886 |
| 1.255986938 | -23.817 |
| 1.2560642089999998 | -23.929 |
| 1.2561414789999998 | -23.973 |
| 1.2562188719999998 | -23.993 |
| 1.256296143 | -23.958 |
| 1.256373413 | -24.126 |
| 1.2564508060000001 | -24.269 |
| 1.256528198 | -24.408 |
| 1.2566054690000001 | -24.477 |
| 1.256682861 | -24.534 |
| 1.256760254 | -24.53 |
| 1.256837646 | -24.347 |
| 1.256915039 | -24.488 |
| 1.256992432 | -24.624 |
| 1.257069824 | -24.555 |
| 1.257147339 | -24.478 |
| 1.257224731 | -24.358 |
| 1.257302124 | -24.202 |
| 1.257379639 | -24.101 |
| 1.257457031 | -24.081 |
| 1.257534546 | -24.07 |
| 1.257611938 | -24.195 |
| 1.257689453 | -24.231 |
| 1.2577669679999999 | -24.109 |
| 1.2578444819999999 | -24.204 |
| 1.257921997 | -24.202 |
| 1.257999512 | -24.22 |
| 1.258077026 | -24.27 |
| 1.2581545410000001 | -24.171 |
| 1.258232056 | -24.115 |
| 1.258309692 | -24.207 |
| 1.258387207 | -24.104 |
| 1.2584648440000001 | -23.931 |
| 1.25854248 | -23.856 |
| 1.258620117 | -23.787 |
| 1.258697632 | -23.922 |
| 1.258775269 | -23.967 |
| 1.258852905 | -24.036 |
| 1.258930542 | -24.242 |
| 1.2590081789999998 | -24.258 |
| 1.259085815 | -24.251 |
| 1.259163574 | -24.387 |
| 1.259241211 | -24.439 |
| 1.259318848 | -24.597 |
| 1.259396606 | -24.691 |
| 1.2594742429999999 | -24.508 |
| 1.259552002 | -24.629 |
| 1.259629761 | -24.526 |
| 1.259707397 | -24.445 |
| 1.259785156 | -24.465 |
| 1.259862915 | -24.55 |
| 1.2599406739999999 | -24.407 |
| 1.260018433 | -24.497 |
| 1.260096313 | -24.528 |
| 1.260174072 | -24.489 |
| 1.260251953 | -24.58 |
| 1.2603297119999999 | -24.433 |
| 1.2604075929999998 | -24.428 |
| 1.260485352 | -24.541 |
| 1.260563232 | -24.54 |
| 1.260641113 | -24.341 |
| 1.260718872 | -24.374 |
| 1.2607967530000002 | -24.194 |
| 1.260874634 | -24.074 |
| 1.260952515 | -24.252 |
| 1.2610303960000002 | -24.344 |
| 1.2611083980000002 | -24.337 |
| 1.261186279 | -24.265 |
| 1.2612641599999999 | -24.128 |
| 1.2613421630000001 | -24.076 |
| 1.2614200439999999 | -24.146 |
| 1.2614980470000001 | -24.236 |
| 1.261575928 | -24.401 |
| 1.2616539310000001 | -24.319 |
| 1.261732056 | -24.155 |
| 1.2618100589999999 | -23.974 |
| 1.261888062 | -23.947 |
| 1.2619660639999999 | -24.064 |
| 1.262044067 | -24.087 |
| 1.26212207 | -24.056 |
| 1.262200073 | -24.07 |
| 1.262278198 | -23.954 |
| 1.262356201 | -23.934 |
| 1.2624343260000002 | -24.116 |
| 1.262512329 | -24.104 |
| 1.262590454 | -24.169 |
| 1.2626685789999998 | -24.177 |
| 1.262746704 | -24.258 |
| 1.262824829 | -24.223 |
| 1.2629029539999999 | -24.258 |
| 1.262981079 | -24.2 |
| 1.263059204 | -24.172 |
| 1.2631373289999999 | -24.093 |
| 1.263215454 | -24.015 |
| 1.263293701 | -23.965 |
| 1.263371948 | -23.922 |
| 1.2634501949999999 | -23.982 |
| 1.2635283199999998 | -23.921 |
| 1.263606567 | -24.001 |
| 1.2636848139999999 | -23.967 |
| 1.263763062 | -24.033 |
| 1.2638413089999998 | -24.078 |
| 1.263919556 | -24.026 |
| 1.263997803 | -24.015 |
| 1.26407605 | -24.088 |
| 1.2641542970000001 | -24.156 |
| 1.264232666 | -24.169 |
| 1.264310913 | -24.116 |
| 1.264389282 | -23.992 |
| 1.264467529 | -24.169 |
| 1.2645458980000002 | -24.148 |
| 1.264624268 | -24.264 |
| 1.264702515 | -24.328 |
| 1.264780884 | -24.4 |
| 1.264859253 | -24.477 |
| 1.264937622 | -24.509 |
| 1.265016113 | -24.427 |
| 1.265094482 | -24.384 |
| 1.2651729740000002 | -24.441 |
| 1.2652513429999999 | -24.186 |
| 1.2653298339999999 | -24.23 |
| 1.265408203 | -24.129 |
| 1.265486694 | -24.163 |
| 1.2655651860000001 | -23.972 |
| 1.265643555 | -23.987 |
| 1.265722046 | -23.833 |
| 1.265800537 | -23.902 |
| 1.265879028 | -23.892 |
| 1.26595752 | -23.757 |
| 1.266036133 | -23.896 |
| 1.266114624 | -23.837 |
| 1.266193115 | -23.74 |
| 1.266271729 | -23.777 |
| 1.26635022 | -24.055 |
| 1.266428833 | -24.06 |
| 1.266507324 | -24.099 |
| 1.26658606 | -23.984 |
| 1.266664673 | -24.089 |
| 1.2667432859999999 | -24.15 |
| 1.266821899 | -24.101 |
| 1.266900513 | -24.105 |
| 1.2669791259999998 | -24.369 |
| 1.2670577390000002 | -24.338 |
| 1.2671363530000002 | -24.085 |
| 1.267215088 | -24.029 |
| 1.267293701 | -24.114 |
| 1.267372437 | -24.221 |
| 1.2674510499999998 | -24.055 |
| 1.267529785 | -24.119 |
| 1.267608521 | -24.227 |
| 1.2676872559999999 | -24.268 |
| 1.267765991 | -24.177 |
| 1.267844727 | -24.237 |
| 1.267923462 | -24.333 |
| 1.268002197 | -24.332 |
| 1.268080933 | -24.336 |
| 1.26815979 | -24.196 |
| 1.268238647 | -24.285 |
| 1.268317383 | -24.293 |
| 1.26839624 | -24.095 |
| 1.268474976 | -24.187 |
| 1.268553833 | -24.289 |
| 1.26863269 | -24.185 |
| 1.268711548 | -24.381 |
| 1.268790405 | -24.383 |
| 1.268869263 | -24.365 |
| 1.2689481200000001 | -24.53 |
| 1.269026978 | -24.483 |
| 1.269105957 | -24.415 |
| 1.269184814 | -24.494 |
| 1.269263794 | -24.384 |
| 1.2693426509999999 | -24.321 |
| 1.269421631 | -24.328 |
| 1.2695006100000001 | -24.101 |
| 1.2695794679999999 | -24.016 |
| 1.269658447 | -24.092 |
| 1.269737427 | -23.998 |
| 1.269816406 | -24.003 |
| 1.269895508 | -24.201 |
| 1.269974487 | -24.344 |
| 1.2700534669999999 | -24.285 |
| 1.270132568 | -24.289 |
| 1.270211548 | -24.238 |
| 1.270290649 | -24.286 |
| 1.270369629 | -24.345 |
| 1.27044873 | -24.292 |
| 1.270527832 | -24.34 |
| 1.270606934 | -24.461 |
| 1.270686035 | -24.259 |
| 1.2707651370000002 | -24.065 |
| 1.270844238 | -24.065 |
| 1.27092334 | -23.934 |
| 1.271002441 | -24.126 |
| 1.271081543 | -24.236 |
| 1.271160767 | -24.269 |
| 1.2712398679999999 | -24.33 |
| 1.271319092 | -24.349 |
| 1.271398315 | -24.319 |
| 1.271477417 | -24.401 |
| 1.271556763 | -24.523 |
| 1.271635986 | -24.61 |
| 1.27171521 | -24.541 |
| 1.2717944339999998 | -24.293 |
| 1.271873657 | -24.24 |
| 1.271952881 | -24.304 |
| 1.272032104 | -24.244 |
| 1.2721114500000001 | -24.253 |
| 1.272190674 | -24.201 |
| 1.27227002 | -24.17 |
| 1.2723492429999999 | -24.21 |
| 1.272428589 | -24.06 |
| 1.2725079350000001 | -24.094 |
| 1.27258728 | -24.197 |
| 1.272666626 | -24.206 |
| 1.2727459719999998 | -24.161 |
| 1.2728253170000001 | -24.133 |
| 1.272904663 | -24.099 |
| 1.272984009 | -24.239 |
| 1.273063477 | -24.218 |
| 1.273142944 | -24.223 |
| 1.2732222899999999 | -24.425 |
| 1.2733017580000001 | -24.58 |
| 1.273381226 | -24.739 |
| 1.273460571 | -24.745 |
| 1.273540039 | -24.762 |
| 1.273619507 | -24.77 |
| 1.273698975 | -24.794 |
| 1.273778442 | -24.659 |
| 1.27385791 | -24.639 |
| 1.2739375 | -24.579 |
| 1.274016968 | -24.479 |
| 1.274096436 | -24.308 |
| 1.274176025 | -24.177 |
| 1.2742554929999999 | -24.163 |
| 1.274335083 | -24.184 |
| 1.2744146729999999 | -24.144 |
| 1.274494263 | -23.995 |
| 1.27457373 | -23.962 |
| 1.2746533199999999 | -23.859 |
| 1.274733032 | -23.884 |
| 1.274812622 | -23.854 |
| 1.2748923339999998 | -23.903 |
| 1.274971924 | -24.019 |
| 1.275051514 | -23.857 |
| 1.275131226 | -23.732 |
| 1.2752108149999999 | -23.775 |
| 1.2752905270000001 | -23.751 |
| 1.2753702390000001 | -23.752 |
| 1.2754498289999998 | -23.807 |
| 1.275529541 | -23.781 |
| 1.275609253 | -23.807 |
| 1.275688965 | -23.843 |
| 1.275768677 | -23.756 |
| 1.275848511 | -23.793 |
| 1.275928223 | -23.758 |
| 1.276007935 | -23.724 |
| 1.2760877689999999 | -23.812 |
| 1.27616748 | -23.766 |
| 1.276247314 | -23.863 |
| 1.276327148 | -23.916 |
| 1.27640686 | -23.895 |
| 1.276486816 | -23.852 |
| 1.27656665 | -23.83 |
| 1.276646484 | -23.846 |
| 1.276726318 | -23.881 |
| 1.276806152 | -23.937 |
| 1.276885986 | -24.038 |
| 1.2769659420000001 | -24.081 |
| 1.277045776 | -23.813 |
| 1.277125732 | -23.664 |
| 1.2772055660000001 | -23.695 |
| 1.277285522 | -23.579 |
| 1.277365479 | -23.53 |
| 1.2774453129999999 | -23.609 |
| 1.277525269 | -23.569 |
| 1.277605225 | -23.536 |
| 1.277685181 | -23.46 |
| 1.277765259 | -23.469 |
| 1.2778452150000001 | -23.7 |
| 1.2779251710000001 | -23.751 |
| 1.278005249 | -23.813 |
| 1.278085205 | -23.886 |
| 1.278165283 | -23.875 |
| 1.278245361 | -23.912 |
| 1.278325439 | -23.88 |
| 1.278405518 | -23.872 |
| 1.278485474 | -23.917 |
| 1.278565552 | -24.021 |
| 1.2786457519999999 | -24.161 |
| 1.2787258300000002 | -24.037 |
| 1.278805908 | -23.887 |
| 1.278885986 | -23.909 |
| 1.278966187 | -23.849 |
| 1.2790462649999998 | -23.632 |
| 1.279126465 | -23.784 |
| 1.279206543 | -23.687 |
| 1.279286743 | -23.717 |
| 1.279366943 | -23.595 |
| 1.279447144 | -23.492 |
| 1.2795273440000001 | -23.544 |
| 1.2796075439999999 | -23.606 |
| 1.279687744 | -23.602 |
| 1.2797680660000001 | -23.757 |
| 1.279848267 | -23.878 |
| 1.279928589 | -23.701 |
| 1.280008789 | -23.739 |
| 1.2800891110000001 | -23.784 |
| 1.280169312 | -23.805 |
| 1.280249634 | -23.728 |
| 1.280329956 | -23.764 |
| 1.280410278 | -23.569 |
| 1.280490601 | -23.621 |
| 1.280570923 | -23.541 |
| 1.280651245 | -23.445 |
| 1.2807315670000001 | -23.598 |
| 1.2808118899999998 | -23.641 |
| 1.2808923339999998 | -23.661 |
| 1.2809726559999999 | -23.664 |
| 1.281053101 | -23.523 |
| 1.281133423 | -23.451 |
| 1.281213867 | -23.679 |
| 1.281294312 | -23.593 |
| 1.281374756 | -23.528 |
| 1.2814552000000001 | -23.536 |
| 1.281535645 | -23.481 |
| 1.2816160890000001 | -23.498 |
| 1.281696655 | -23.504 |
| 1.2817771 | -23.471 |
| 1.281857544 | -23.628 |
| 1.28193811 | -23.724 |
| 1.282018555 | -23.779 |
| 1.282099121 | -23.765 |
| 1.282179688 | -23.828 |
| 1.2822601320000002 | -23.96 |
| 1.282340698 | -23.952 |
| 1.282421265 | -23.83 |
| 1.282501831 | -23.673 |
| 1.2825823969999999 | -23.726 |
| 1.282662964 | -23.822 |
| 1.2827436520000002 | -23.86 |
| 1.282824219 | -23.597 |
| 1.282904907 | -23.701 |
| 1.282985474 | -23.583 |
| 1.2830661620000001 | -23.596 |
| 1.283146851 | -23.496 |
| 1.283227539 | -23.59 |
| 1.283308228 | -23.577 |
| 1.283388916 | -23.619 |
| 1.283469604 | -23.489 |
| 1.283550293 | -23.432 |
| 1.283630981 | -23.668 |
| 1.28371167 | -23.573 |
| 1.28379248 | -23.833 |
| 1.283873169 | -23.852 |
| 1.2839539789999999 | -23.909 |
| 1.284034668 | -23.951 |
| 1.284115479 | -23.984 |
| 1.284196289 | -23.933 |
| 1.2842771 | -24.006 |
| 1.2843577880000001 | -24.08 |
| 1.284438721 | -23.936 |
| 1.284519531 | -24.017 |
| 1.284600342 | -23.823 |
| 1.284681152 | -23.8 |
| 1.284761963 | -23.882 |
| 1.2848430180000001 | -23.852 |
| 1.284923828 | -23.897 |
| 1.285004761 | -24.008 |
| 1.285085571 | -24.059 |
| 1.285166504 | -23.934 |
| 1.285247437 | -24.15 |
| 1.2853283690000001 | -24.268 |
| 1.285409302 | -24.295 |
| 1.285490234 | -24.277 |
| 1.285571167 | -24.284 |
| 1.285652222 | -24.339 |
| 1.285733154 | -24.265 |
| 1.2858140869999999 | -24.109 |
| 1.285895142 | -23.981 |
| 1.285976196 | -23.968 |
| 1.286057129 | -23.83 |
| 1.286138184 | -23.741 |
| 1.286219238 | -23.729 |
| 1.286300293 | -23.852 |
| 1.286381348 | -23.793 |
| 1.286462524 | -23.781 |
| 1.286543579 | -23.815 |
| 1.286624634 | -24.004 |
| 1.286705811 | -24.191 |
| 1.286786865 | -24.357 |
| 1.28686792 | -24.341 |
| 1.286949097 | -24.266 |
| 1.287030273 | -24.242 |
| 1.28711145 | -24 |
| 1.287192505 | -24.132 |
| 1.287273682 | -24.186 |
| 1.2873548579999998 | -24.203 |
| 1.2874361570000001 | -24.258 |
| 1.287517334 | -24.285 |
| 1.287598511 | -24.197 |
| 1.2876796879999999 | -24.276 |
| 1.287760986 | -24.394 |
| 1.287842163 | -24.545 |
| 1.287923462 | -24.633 |
| 1.2880047609999998 | -24.588 |
| 1.2880860600000001 | -24.473 |
| 1.288167358 | -24.549 |
| 1.288248657 | -24.361 |
| 1.288329956 | -24.154 |
| 1.288411255 | -24.248 |
| 1.2884925539999998 | -24.214 |
| 1.288573975 | -24.136 |
| 1.288655273 | -24.083 |
| 1.288736694 | -24.245 |
| 1.2888179929999999 | -24.174 |
| 1.288899414 | -24.204 |
| 1.288980835 | -24.116 |
| 1.289062134 | -24.144 |
| 1.289143555 | -24.215 |
| 1.289224976 | -24.018 |
| 1.289306396 | -23.91 |
| 1.289387817 | -23.93 |
| 1.28946936 | -24.06 |
| 1.289550781 | -23.917 |
| 1.289632202 | -23.861 |
| 1.289713745 | -23.875 |
| 1.2897951660000002 | -23.773 |
| 1.289876831 | -23.754 |
| 1.289958252 | -23.639 |
| 1.290039795 | -23.621 |
| 1.2901213379999998 | -23.656 |
| 1.290202881 | -23.63 |
| 1.290284424 | -23.485 |
| 1.290365967 | -23.371 |
| 1.290447632 | -23.553 |
| 1.2905291749999999 | -23.394 |
| 1.290610718 | -23.552 |
| 1.290692383 | -23.573 |
| 1.2907739260000002 | -23.785 |
| 1.290855591 | -23.846 |
| 1.2909372559999999 | -23.792 |
| 1.291018921 | -23.692 |
| 1.2911004640000001 | -23.678 |
| 1.291182129 | -23.871 |
| 1.2912639160000001 | -23.615 |
| 1.291345581 | -23.815 |
| 1.291427246 | -23.691 |
| 1.291509033 | -23.645 |
| 1.291590698 | -23.517 |
| 1.291672485 | -23.611 |
| 1.29175415 | -23.626 |
| 1.291835938 | -23.703 |
| 1.291917725 | -23.765 |
| 1.291999512 | -23.651 |
| 1.292081299 | -23.841 |
| 1.292163086 | -23.788 |
| 1.292244873 | -23.866 |
| 1.2923266599999998 | -23.803 |
| 1.2924084470000001 | -23.71 |
| 1.292490356 | -23.707 |
| 1.292572144 | -23.756 |
| 1.292654053 | -23.788 |
| 1.29273584 | -23.772 |
| 1.2928177490000001 | -23.885 |
| 1.292899658 | -23.816 |
| 1.292981445 | -23.817 |
| 1.2930633539999998 | -23.856 |
| 1.293145264 | -23.822 |
| 1.2932272949999999 | -23.921 |
| 1.2933092039999998 | -24.008 |
| 1.293391235 | -23.931 |
| 1.2934731449999999 | -24.074 |
| 1.2935551760000001 | -24.062 |
| 1.293637085 | -23.946 |
| 1.293719116 | -24.015 |
| 1.293801025 | -23.91 |
| 1.293883057 | -23.829 |
| 1.293965088 | -24.013 |
| 1.294047119 | -24.139 |
| 1.29412915 | -24.011 |
| 1.294211182 | -24.077 |
| 1.294293335 | -23.987 |
| 1.294375366 | -23.992 |
| 1.294457397 | -23.987 |
| 1.2945395510000002 | -23.898 |
| 1.294621582 | -23.881 |
| 1.2947037350000001 | -23.929 |
| 1.294785889 | -23.872 |
| 1.294868042 | -23.805 |
| 1.294950195 | -23.914 |
| 1.295032349 | -24.002 |
| 1.295114502 | -24.046 |
| 1.295196655 | -24.079 |
| 1.2952789310000001 | -24.183 |
| 1.2953610839999998 | -24.168 |
| 1.295443237 | -24.255 |
| 1.295525513 | -24.21 |
| 1.2956076660000002 | -24.146 |
| 1.295689941 | -24.256 |
| 1.295772217 | -24.257 |
| 1.295854492 | -24.254 |
| 1.295936768 | -24.204 |
| 1.296019043 | -24.249 |
| 1.296101318 | -24.257 |
| 1.2961835940000002 | -24.188 |
| 1.296265869 | -24.132 |
| 1.2963482670000002 | -24.044 |
| 1.296430542 | -23.96 |
| 1.2965129389999999 | -23.697 |
| 1.296595215 | -23.581 |
| 1.2966777340000002 | -23.476 |
| 1.29676001 | -23.388 |
| 1.2968424070000002 | -23.234 |
| 1.2969248050000002 | -23.105 |
| 1.297007202 | -23.074 |
| 1.2970896 | -23.112 |
| 1.297172119 | -23.105 |
| 1.297254517 | -23.213 |
| 1.297336914 | -23.18 |
| 1.2974194339999998 | -23.161 |
| 1.297501831 | -23.058 |
| 1.297584351 | -23.115 |
| 1.29766687 | -23.064 |
| 1.29774939 | -23.07 |
| 1.297831787 | -23.03 |
| 1.297914307 | -23.007 |
| 1.297996826 | -23.001 |
| 1.2980794679999998 | -22.895 |
| 1.2981619869999999 | -22.972 |
| 1.2982445070000002 | -22.993 |
| 1.298327148 | -23.016 |
| 1.29840979 | -22.851 |
| 1.29849231 | -22.888 |
| 1.298574951 | -22.855 |
| 1.298657593 | -22.749 |
| 1.298740234 | -22.649 |
| 1.298822876 | -22.599 |
| 1.298905518 | -22.386 |
| 1.298988159 | -22.263 |
| 1.299070801 | -22.099 |
| 1.299153442 | -21.939 |
| 1.299236206 | -21.885 |
| 1.299318848 | -21.826 |
| 1.299401611 | -21.72 |
| 1.2994842530000001 | -21.697 |
| 1.299567017 | -21.609 |
| 1.29964978 | -21.42 |
| 1.299732544 | -21.448 |
| 1.299815308 | -21.329 |
| 1.299898071 | -21.131 |
| 1.2999808350000002 | -21.09 |
| 1.300063721 | -21.043 |
| 1.300146484 | -20.967 |
| 1.3002292480000002 | -20.807 |
| 1.3003121340000001 | -20.697 |
| 1.3003950199999998 | -20.538 |
| 1.300477783 | -20.519 |
| 1.300560669 | -20.493 |
| 1.3006435550000002 | -20.356 |
| 1.3007264399999998 | -20.368 |
| 1.300809326 | -20.276 |
| 1.300892212 | -20.268 |
| 1.3009750979999999 | -20.18 |
| 1.301057983 | -20.22 |
| 1.301140991 | -20.222 |
| 1.301223877 | -20.282 |
| 1.301306885 | -20.187 |
| 1.3013897710000002 | -20.12 |
| 1.3014727780000002 | -20.133 |
| 1.301555786 | -20.076 |
| 1.301638794 | -20.066 |
| 1.301721802 | -19.975 |
| 1.3018048100000001 | -19.906 |
| 1.3018878170000001 | -19.926 |
| 1.301970947 | -19.898 |
| 1.302053955 | -19.874 |
| 1.302136963 | -19.963 |
| 1.3022200929999999 | -19.918 |
| 1.302303101 | -19.999 |
| 1.30238623 | -19.954 |
| 1.3024693600000001 | -19.99 |
| 1.30255249 | -19.873 |
| 1.30263562 | -19.939 |
| 1.30271875 | -19.814 |
| 1.30280188 | -19.81 |
| 1.30288501 | -19.794 |
| 1.30296814 | -19.751 |
| 1.3030512699999999 | -19.759 |
| 1.303134521 | -19.76 |
| 1.303217651 | -19.864 |
| 1.303300903 | -19.867 |
| 1.303384155 | -19.936 |
| 1.303467407 | -19.861 |
| 1.303550659 | -19.933 |
| 1.303633911 | -19.969 |
| 1.303717163 | -20.093 |
| 1.303800415 | -20.108 |
| 1.303883667 | -20.19 |
| 1.3039670410000002 | -20.17 |
| 1.304050293 | -20.237 |
| 1.304133667 | -20.293 |
| 1.304216919 | -20.291 |
| 1.304300293 | -20.345 |
| 1.304383667 | -20.376 |
| 1.304466919 | -20.433 |
| 1.304550293 | -20.394 |
| 1.304633667 | -20.487 |
| 1.3047170410000002 | -20.545 |
| 1.304800537 | -20.66 |
| 1.304883911 | -20.658 |
| 1.304967285 | -20.665 |
| 1.3050507809999998 | -20.871 |
| 1.305134155 | -20.935 |
| 1.305217773 | -21.011 |
| 1.305301147 | -21.079 |
| 1.3053846439999999 | -21.177 |
| 1.3054681399999999 | -21.115 |
| 1.305551636 | -21.126 |
| 1.3056351320000001 | -21.053 |
| 1.3057186280000002 | -21.052 |
| 1.305802124 | -21.099 |
| 1.3058857419999998 | -20.996 |
| 1.3059692379999999 | -21.114 |
| 1.306052856 | -21.074 |
| 1.306136353 | -21.056 |
| 1.306219971 | -20.909 |
| 1.306303589 | -21.049 |
| 1.3063870850000001 | -21.085 |
| 1.306470703 | -21.187 |
| 1.3065543210000001 | -21.194 |
| 1.306638062 | -21.231 |
| 1.30672168 | -21.304 |
| 1.306805298 | -21.187 |
| 1.3068889160000001 | -21.21 |
| 1.306972778 | -21.123 |
| 1.307056396 | -21.196 |
| 1.3071401370000002 | -21.116 |
| 1.3072237549999999 | -20.982 |
| 1.307307495 | -20.95 |
| 1.307391235 | -20.955 |
| 1.307474976 | -20.804 |
| 1.307558716 | -20.722 |
| 1.307642456 | -20.68 |
| 1.307726318 | -20.692 |
| 1.307810059 | -20.59 |
| 1.307893799 | -20.548 |
| 1.3079776609999998 | -20.435 |
| 1.308061401 | -20.37 |
| 1.308145264 | -20.293 |
| 1.3082291259999999 | -20.185 |
| 1.308312988 | -20.24 |
| 1.308396851 | -20.212 |
| 1.308480713 | -20.194 |
| 1.3085645750000001 | -20.071 |
| 1.3086485600000002 | -20.097 |
| 1.308732422 | -19.967 |
| 1.3088164059999998 | -19.88 |
| 1.308900269 | -19.777 |
| 1.308984253 | -19.7 |
| 1.309068115 | -19.611 |
| 1.3091521 | -19.497 |
| 1.309236084 | -19.39 |
| 1.309320068 | -19.28 |
| 1.309404053 | -19.228 |
| 1.3094880370000002 | -19.12 |
| 1.309572021 | -19.032 |
| 1.309656006 | -18.927 |
| 1.3097401119999998 | -18.921 |
| 1.309824097 | -18.801 |
| 1.309908203 | -18.752 |
| 1.3099921879999998 | -18.68 |
| 1.310076294 | -18.607 |
| 1.3101604 | -18.554 |
| 1.3102445070000002 | -18.512 |
| 1.3103286129999998 | -18.472 |
| 1.3104128419999999 | -18.372 |
| 1.310496948 | -18.321 |
| 1.310581055 | -18.19 |
| 1.310665161 | -18.127 |
| 1.31074939 | -18.051 |
| 1.3108334959999999 | -18.011 |
| 1.310917725 | -17.984 |
| 1.311001831 | -17.972 |
| 1.31108606 | -17.903 |
| 1.311170288 | -17.915 |
| 1.311254517 | -17.895 |
| 1.311338745 | -17.872 |
| 1.311422974 | -17.871 |
| 1.311507324 | -17.799 |
| 1.311591553 | -17.776 |
| 1.311675781 | -17.667 |
| 1.311760132 | -17.646 |
| 1.31184436 | -17.554 |
| 1.311928711 | -17.564 |
| 1.312013062 | -17.463 |
| 1.3120974120000002 | -17.448 |
| 1.3121817630000001 | -17.438 |
| 1.312266113 | -17.393 |
| 1.312350464 | -17.391 |
| 1.312434937 | -17.324 |
| 1.312519287 | -17.357 |
| 1.3126036380000001 | -17.265 |
| 1.31268811 | -17.324 |
| 1.312772461 | -17.228 |
| 1.3128569339999998 | -17.27 |
| 1.312941406 | -17.28 |
| 1.3130257570000001 | -17.286 |
| 1.3131102289999999 | -17.256 |
| 1.313194702 | -17.288 |
| 1.313279175 | -17.319 |
| 1.31336377 | -17.229 |
| 1.313448242 | -17.312 |
| 1.313532715 | -17.235 |
| 1.3136173100000001 | -17.31 |
| 1.313701782 | -17.257 |
| 1.313786377 | -17.299 |
| 1.313870972 | -17.263 |
| 1.3139555660000002 | -17.353 |
| 1.3140401609999999 | -17.298 |
| 1.314124756 | -17.267 |
| 1.314209351 | -17.305 |
| 1.314293945 | -17.283 |
| 1.3143785399999999 | -17.279 |
| 1.314463257 | -17.245 |
| 1.314547852 | -17.305 |
| 1.314632568 | -17.231 |
| 1.314717163 | -17.359 |
| 1.31480188 | -17.363 |
| 1.3148865969999999 | -17.448 |
| 1.314971313 | -17.475 |
| 1.31505603 | -17.566 |
| 1.3151407469999998 | -17.557 |
| 1.315225464 | -17.644 |
| 1.315310181 | -17.688 |
| 1.315394897 | -17.685 |
| 1.315479736 | -17.774 |
| 1.315564453 | -17.742 |
| 1.315649414 | -17.751 |
| 1.315734131 | -17.762 |
| 1.31581897 | -17.863 |
| 1.315903809 | -17.853 |
| 1.315988647 | -17.909 |
| 1.316073486 | -17.902 |
| 1.3161583250000002 | -17.942 |
| 1.316243164 | -17.952 |
| 1.316328125 | -18.032 |
| 1.3164129640000002 | -18.027 |
| 1.316497803 | -18.082 |
| 1.316582764 | -18.171 |
| 1.316667725 | -18.193 |
| 1.316752563 | -18.251 |
| 1.316837524 | -18.268 |
| 1.316922485 | -18.332 |
| 1.317007446 | -18.364 |
| 1.317092407 | -18.438 |
| 1.31717749 | -18.37 |
| 1.317262451 | -18.455 |
| 1.3173474120000002 | -18.509 |
| 1.317432495 | -18.579 |
| 1.317517578 | -18.64 |
| 1.317602661 | -18.676 |
| 1.317687622 | -18.728 |
| 1.317772705 | -18.715 |
| 1.317857788 | -18.697 |
| 1.317942871 | -18.635 |
| 1.318027954 | -18.689 |
| 1.318113037 | -18.612 |
| 1.318198242 | -18.598 |
| 1.3182833250000001 | -18.512 |
| 1.3183685299999999 | -18.518 |
| 1.318453613 | -18.524 |
| 1.318538818 | -18.505 |
| 1.318623901 | -18.516 |
| 1.318709106 | -18.515 |
| 1.318794312 | -18.593 |
| 1.318879517 | -18.563 |
| 1.318964722 | -18.588 |
| 1.319050049 | -18.53 |
| 1.319135254 | -18.55 |
| 1.319220581 | -18.491 |
| 1.319305786 | -18.475 |
| 1.319391113 | -18.464 |
| 1.319476318 | -18.471 |
| 1.3195616460000001 | -18.472 |
| 1.3196469729999998 | -18.354 |
| 1.3197322999999999 | -18.319 |
| 1.319817627 | -18.205 |
| 1.319902954 | -18.206 |
| 1.3199882809999999 | -18.051 |
| 1.320073608 | -18.053 |
| 1.320159058 | -17.925 |
| 1.320244385 | -17.935 |
| 1.3203298339999998 | -17.769 |
| 1.320415161 | -17.665 |
| 1.32050061 | -17.607 |
| 1.3205860600000001 | -17.543 |
| 1.320671509 | -17.481 |
| 1.320756958 | -17.349 |
| 1.320842407 | -17.358 |
| 1.3209279790000001 | -17.21 |
| 1.3210134279999999 | -17.155 |
| 1.3210988769999998 | -16.999 |
| 1.321184448 | -17.038 |
| 1.3212698969999999 | -16.949 |
| 1.321355469 | -16.94 |
| 1.3214410399999998 | -16.803 |
| 1.321526611 | -16.75 |
| 1.321612183 | -16.656 |
| 1.3216977540000001 | -16.538 |
| 1.3217833250000002 | -16.487 |
| 1.321868896 | -16.44 |
| 1.321954468 | -16.41 |
| 1.322040039 | -16.319 |
| 1.322125732 | -16.333 |
| 1.3222113039999999 | -16.175 |
| 1.322296997 | -16.17 |
| 1.32238269 | -16.067 |
| 1.322468384 | -16.043 |
| 1.322553955 | -15.959 |
| 1.322639648 | -15.893 |
| 1.3227254640000001 | -15.805 |
| 1.322811157 | -15.763 |
| 1.322896973 | -15.7 |
| 1.3229826660000001 | -15.58 |
| 1.323068359 | -15.58 |
| 1.323154175 | -15.498 |
| 1.32323999 | -15.483 |
| 1.3233256839999998 | -15.38 |
| 1.323411499 | -15.354 |
| 1.323497314 | -15.283 |
| 1.32358313 | -15.259 |
| 1.3236689449999999 | -15.171 |
| 1.323754761 | -15.128 |
| 1.323840698 | -15.093 |
| 1.323926514 | -15.025 |
| 1.3240123289999999 | -15.01 |
| 1.324098267 | -14.945 |
| 1.3241842039999998 | -14.977 |
| 1.32427002 | -14.891 |
| 1.324355957 | -14.865 |
| 1.3244418949999999 | -14.782 |
| 1.324527954 | -14.782 |
| 1.3246138920000001 | -14.736 |
| 1.3246998289999998 | -14.708 |
| 1.324785767 | -14.718 |
| 1.324871826 | -14.678 |
| 1.324957764 | -14.699 |
| 1.325043823 | -14.601 |
| 1.325129761 | -14.636 |
| 1.32521582 | -14.572 |
| 1.32530188 | -14.596 |
| 1.325387939 | -14.521 |
| 1.325473999 | -14.523 |
| 1.3255600589999998 | -14.489 |
| 1.3256461179999999 | -14.476 |
| 1.325732178 | -14.465 |
| 1.3258183590000001 | -14.426 |
| 1.325904419 | -14.457 |
| 1.325990601 | -14.412 |
| 1.32607666 | -14.432 |
| 1.326162842 | -14.344 |
| 1.326249146 | -14.37 |
| 1.3263352050000001 | -14.288 |
| 1.3264213870000001 | -14.327 |
| 1.32650769 | -14.262 |
| 1.326593872 | -14.289 |
| 1.3266800539999999 | -14.273 |
| 1.326766235 | -14.298 |
| 1.3268525389999999 | -14.3 |
| 1.3269387209999999 | -14.296 |
| 1.327025024 | -14.337 |
| 1.327111328 | -14.308 |
| 1.327197632 | -14.357 |
| 1.327283936 | -14.301 |
| 1.3273702390000002 | -14.353 |
| 1.327456543 | -14.295 |
| 1.327542847 | -14.364 |
| 1.32762915 | -14.302 |
| 1.3277155760000001 | -14.335 |
| 1.32780188 | -14.303 |
| 1.327888306 | -14.317 |
| 1.3279746090000002 | -14.293 |
| 1.328061157 | -14.27 |
| 1.328147583 | -14.282 |
| 1.328234009 | -14.256 |
| 1.3283204350000002 | -14.305 |
| 1.32840686 | -14.243 |
| 1.3284932859999998 | -14.293 |
| 1.328579712 | -14.268 |
| 1.3286662599999999 | -14.341 |
| 1.328752686 | -14.304 |
| 1.3288392329999998 | -14.346 |
| 1.328925659 | -14.328 |
| 1.329012207 | -14.334 |
| 1.329098755 | -14.315 |
| 1.329185303 | -14.268 |
| 1.329271851 | -14.281 |
| 1.329358398 | -14.266 |
| 1.3294449460000002 | -14.283 |
| 1.329531616 | -14.222 |
| 1.329618164 | -14.275 |
| 1.329704834 | -14.237 |
| 1.3297915040000001 | -14.259 |
| 1.3298781739999999 | -14.188 |
| 1.329964844 | -14.179 |
| 1.330051392 | -14.147 |
| 1.330138062 | -14.106 |
| 1.330224731 | -14.095 |
| 1.330311523 | -14.061 |
| 1.330398193 | -14.079 |
| 1.330484863 | -14.006 |
| 1.330571655 | -13.999 |
| 1.3306583250000001 | -13.925 |
| 1.330745117 | -13.948 |
| 1.330831909 | -13.879 |
| 1.330918579 | -13.853 |
| 1.331005371 | -13.791 |
| 1.331092163 | -13.728 |
| 1.3311789550000002 | -13.679 |
| 1.331265747 | -13.611 |
| 1.331352661 | -13.588 |
| 1.331439453 | -13.529 |
| 1.331526367 | -13.534 |
| 1.3316132809999999 | -13.419 |
| 1.331700073 | -13.393 |
| 1.3317869869999999 | -13.279 |
| 1.331873901 | -13.263 |
| 1.331960815 | -13.167 |
| 1.332047729 | -13.124 |
| 1.332134644 | -13.062 |
| 1.3322215579999999 | -13.001 |
| 1.3323085940000001 | -12.956 |
| 1.332395508 | -12.852 |
| 1.332482422 | -12.801 |
| 1.332569458 | -12.681 |
| 1.332656494 | -12.665 |
| 1.332743408 | -12.525 |
| 1.3328304439999998 | -12.484 |
| 1.33291748 | -12.353 |
| 1.333004517 | -12.322 |
| 1.333091553 | -12.222 |
| 1.333178711 | -12.152 |
| 1.333265747 | -12.078 |
| 1.333352783 | -12.028 |
| 1.333440063 | -11.971 |
| 1.3335271 | -11.848 |
| 1.333614258 | -11.795 |
| 1.333701416 | -11.666 |
| 1.333788452 | -11.638 |
| 1.33387561 | -11.493 |
| 1.333962769 | -11.459 |
| 1.334050049 | -11.342 |
| 1.334137207 | -11.315 |
| 1.334224365 | -11.202 |
| 1.3343116460000002 | -11.135 |
| 1.3343988039999999 | -11.05 |
| 1.334486084 | -10.962 |
| 1.3345733640000002 | -10.901 |
| 1.3346605219999998 | -10.777 |
| 1.334747803 | -10.726 |
| 1.334835083 | -10.622 |
| 1.334922363 | -10.608 |
| 1.335009766 | -10.484 |
| 1.335097046 | -10.458 |
| 1.335184448 | -10.374 |
| 1.335271729 | -10.343 |
| 1.335359131 | -10.246 |
| 1.335446533 | -10.172 |
| 1.335533813 | -10.096 |
| 1.335621216 | -10.017 |
| 1.335708618 | -9.969 |
| 1.3357960210000002 | -9.856 |
| 1.335883423 | -9.838 |
| 1.3359708250000002 | -9.759 |
| 1.33605835 | -9.747 |
| 1.336145752 | -9.642 |
| 1.336233276 | -9.619 |
| 1.336320679 | -9.54 |
| 1.336408203 | -9.507 |
| 1.336495728 | -9.432 |
| 1.3365832519999998 | -9.35 |
| 1.3366707759999998 | -9.319 |
| 1.3367583010000001 | -9.247 |
| 1.3368458250000002 | -9.225 |
| 1.33693335 | -9.128 |
| 1.337020996 | -9.14 |
| 1.3371085210000002 | -9.067 |
| 1.337196167 | -9.062 |
| 1.337283813 | -8.967 |
| 1.3373713379999999 | -8.942 |
| 1.3374589840000002 | -8.887 |
| 1.337546631 | -8.847 |
| 1.337634277 | -8.801 |
| 1.337721924 | -8.734 |
| 1.33780957 | -8.741 |
| 1.3378973390000002 | -8.677 |
| 1.337984985 | -8.677 |
| 1.338072632 | -8.592 |
| 1.3381604 | -8.619 |
| 1.3382481689999999 | -8.536 |
| 1.338335815 | -8.529 |
| 1.3384235839999998 | -8.445 |
| 1.3385113530000001 | -8.434 |
| 1.338599121 | -8.41 |
| 1.33868689 | -8.371 |
| 1.33877478 | -8.354 |
| 1.338862671 | -8.314 |
| 1.338950439 | -8.347 |
| 1.3390383300000002 | -8.281 |
| 1.339126099 | -8.305 |
| 1.339213989 | -8.225 |
| 1.33930188 | -8.257 |
| 1.339389648 | -8.188 |
| 1.339477539 | -8.188 |
| 1.339565552 | -8.135 |
| 1.3396534420000001 | -8.144 |
| 1.3397413329999999 | -8.132 |
| 1.339829224 | -8.102 |
| 1.339917236 | -8.105 |
| 1.340005127 | -8.068 |
| 1.34009314 | -8.103 |
| 1.3401811520000002 | -8.028 |
| 1.340269165 | -8.047 |
| 1.340357056 | -7.973 |
| 1.340445068 | -8.019 |
| 1.340533203 | -7.961 |
| 1.340621216 | -7.974 |
| 1.3407093509999999 | -7.946 |
| 1.3407973629999999 | -7.966 |
| 1.340885498 | -7.956 |
| 1.3409735109999998 | -7.919 |
| 1.3410616460000002 | -7.929 |
| 1.34114978 | -7.879 |
| 1.341237915 | -7.904 |
| 1.34132605 | -7.825 |
| 1.341414185 | -7.845 |
| 1.341502319 | -7.79 |
| 1.3415904539999999 | -7.833 |
| 1.341678589 | -7.784 |
| 1.341766846 | -7.799 |
| 1.3418549800000001 | -7.789 |
| 1.341943237 | -7.786 |
| 1.342031494 | -7.776 |
| 1.342119751 | -7.734 |
| 1.342207886 | -7.739 |
| 1.342296143 | -7.69 |
| 1.342384521 | -7.719 |
| 1.342472778 | -7.644 |
| 1.342561157 | -7.666 |
| 1.342649414 | -7.623 |
| 1.342737793 | -7.647 |
| 1.34282605 | -7.594 |
| 1.342914429 | -7.6 |
| 1.343002808 | -7.572 |
| 1.343091187 | -7.542 |
| 1.343179565 | -7.527 |
| 1.343267944 | -7.457 |
| 1.343356323 | -7.467 |
| 1.3434448239999999 | -7.419 |
| 1.343533203 | -7.441 |
| 1.343621582 | -7.365 |
| 1.343710083 | -7.401 |
| 1.343798584 | -7.338 |
| 1.3438869629999999 | -7.328 |
| 1.3439754640000001 | -7.27 |
| 1.3440639650000001 | -7.229 |
| 1.344152466 | -7.208 |
| 1.344240967 | -7.156 |
| 1.34432959 | -7.133 |
| 1.344418091 | -7.056 |
| 1.344506714 | -7.077 |
| 1.344595215 | -6.995 |
| 1.344683838 | -7.003 |
| 1.344772461 | -6.919 |
| 1.344860962 | -6.919 |
| 1.3449495850000002 | -6.846 |
| 1.3450382079999998 | -6.815 |
| 1.345126831 | -6.75 |
| 1.3452154539999999 | -6.703 |
| 1.3453041989999999 | -6.681 |
| 1.345392822 | -6.625 |
| 1.3454814449999999 | -6.618 |
| 1.3455701899999999 | -6.532 |
| 1.345658936 | -6.548 |
| 1.3457475589999999 | -6.444 |
| 1.3458363039999999 | -6.439 |
| 1.3459250489999999 | -6.332 |
| 1.3460137939999999 | -6.317 |
| 1.346102661 | -6.244 |
| 1.346191406 | -6.199 |
| 1.346280273 | -6.126 |
| 1.346369019 | -6.067 |
| 1.346457764 | -6.064 |
| 1.3465466309999998 | -6.013 |
| 1.3466354980000002 | -6.01 |
| 1.346724365 | -5.951 |
| 1.34681311 | -5.951 |
| 1.346901978 | -5.853 |
| 1.346990845 | -5.842 |
| 1.3470798339999999 | -5.743 |
| 1.347168701 | -5.735 |
| 1.347257568 | -5.692 |
| 1.347346558 | -5.655 |
| 1.3474354249999998 | -5.577 |
| 1.347524414 | -5.519 |
| 1.347613403 | -5.463 |
| 1.347702393 | -5.382 |
| 1.34779126 | -5.362 |
| 1.347880371 | -5.257 |
| 1.34796936 | -5.258 |
| 1.348058472 | -5.163 |
| 1.348147461 | -5.129 |
| 1.3482364500000001 | -5.035 |
| 1.348325562 | -5.027 |
| 1.348414673 | -4.97 |
| 1.3485036620000002 | -4.918 |
| 1.348592773 | -4.874 |
| 1.348681885 | -4.803 |
| 1.348770996 | -4.789 |
| 1.348860107 | -4.7 |
| 1.348949219 | -4.678 |
| 1.349038452 | -4.617 |
| 1.349127563 | -4.645 |
| 1.3492166749999999 | -4.597 |
| 1.349305908 | -4.631 |
| 1.349395142 | -4.575 |
| 1.3494842530000002 | -4.576 |
| 1.349573486 | -4.535 |
| 1.34966272 | -4.469 |
| 1.349752075 | -4.449 |
| 1.3498413089999999 | -4.388 |
| 1.349930664 | -4.374 |
| 1.350019897 | -4.269 |
| 1.350109131 | -4.253 |
| 1.350198486 | -4.153 |
| 1.350287842 | -4.201 |
| 1.3503770750000001 | -4.133 |
| 1.350466431 | -4.126 |
| 1.350555786 | -4.102 |
| 1.350645142 | -4.129 |
| 1.350734497 | -4.099 |
| 1.350823853 | -4.043 |
| 1.35091333 | -4.059 |
| 1.351002686 | -4 |
| 1.3510921630000001 | -4.027 |
| 1.351181519 | -3.921 |
| 1.351270996 | -3.994 |
| 1.351360474 | -4.022 |
| 1.351449951 | -4.021 |
| 1.351539429 | -3.908 |
| 1.351629028 | -3.902 |
| 1.3517185059999999 | -3.869 |
| 1.3518079829999998 | -3.843 |
| 1.351897461 | -3.844 |
| 1.351987061 | -3.881 |
| 1.352076538 | -3.948 |
| 1.352166138 | -3.855 |
| 1.352255737 | -3.813 |
| 1.352345337 | -3.762 |
| 1.352434937 | -3.802 |
| 1.352524536 | -3.792 |
| 1.352614136 | -3.828 |
| 1.352703735 | -3.77 |
| 1.352793457 | -3.765 |
| 1.352883057 | -3.676 |
| 1.352972778 | -3.653 |
| 1.3530623780000002 | -3.656 |
| 1.3531521 | -3.682 |
| 1.3532418210000001 | -3.755 |
| 1.353331543 | -3.713 |
| 1.353421265 | -3.709 |
| 1.353511108 | -3.711 |
| 1.35360083 | -3.887 |
| 1.353690552 | -3.821 |
| 1.353780396 | -3.898 |
| 1.353870117 | -3.954 |
| 1.353959961 | -3.967 |
| 1.354049805 | -3.955 |
| 1.354139648 | -3.925 |
| 1.35422937 | -3.954 |
| 1.354319214 | -3.924 |
| 1.3544091800000002 | -3.901 |
| 1.354499023 | -3.703 |
| 1.354588867 | -3.85 |
| 1.354678833 | -3.977 |
| 1.354768677 | -3.966 |
| 1.354858643 | -3.942 |
| 1.354948486 | -3.931 |
| 1.355038452 | -3.91 |
| 1.355128418 | -3.939 |
| 1.355218384 | -3.969 |
| 1.355308472 | -3.924 |
| 1.355398438 | -3.97 |
| 1.355488403 | -3.831 |
| 1.355578491 | -3.64 |
| 1.355668457 | -3.544 |
| 1.3557585449999998 | -3.574 |
| 1.3558486330000001 | -3.568 |
| 1.3559385990000001 | -3.764 |
| 1.356028687 | -3.814 |
| 1.356118774 | -3.804 |
| 1.356208862 | -3.825 |
| 1.35629895 | -3.826 |
| 1.35638916 | -3.861 |
| 1.356479248 | -3.806 |
| 1.3565694579999998 | -3.906 |
| 1.3566595460000002 | -3.903 |
| 1.356749756 | -3.914 |
| 1.356839966 | -3.7 |
| 1.356930054 | -3.642 |
| 1.357020264 | -3.644 |
| 1.3571104740000002 | -3.649 |
| 1.357200806 | -3.702 |
| 1.3572911380000001 | -3.786 |
| 1.3573813479999999 | -3.777 |
| 1.3574715579999999 | -3.683 |
| 1.35756189 | -3.655 |
| 1.357652222 | -3.639 |
| 1.357742432 | -3.678 |
| 1.357832764 | -3.632 |
| 1.357923096 | -3.666 |
| 1.358013428 | -3.613 |
| 1.3581037599999999 | -3.589 |
| 1.358194214 | -3.422 |
| 1.3582845460000001 | -3.565 |
| 1.358374878 | -3.697 |
| 1.358465332 | -3.687 |
| 1.358555664 | -3.749 |
| 1.3586461179999998 | -3.682 |
| 1.358736572 | -3.719 |
| 1.358827026 | -3.626 |
| 1.3589174800000001 | -3.682 |
| 1.359008057 | -3.586 |
| 1.359098511 | -3.69 |
| 1.359188965 | -3.478 |
| 1.359279541 | -3.33 |
| 1.359369995 | -3.247 |
| 1.359460571 | -3.142 |
| 1.359551147 | -3.108 |
| 1.359641602 | -3.215 |
| 1.359732178 | -3.331 |
| 1.359822754 | -3.256 |
| 1.359913452 | -3.417 |
| 1.360004028 | -3.306 |
| 1.360094604 | -3.375 |
| 1.360185181 | -3.281 |
| 1.360275879 | -3.311 |
| 1.360366577 | -3.193 |
| 1.360457153 | -3.359 |
| 1.3605478519999998 | -3.361 |
| 1.36063855 | -3.241 |
| 1.3607292480000002 | -3.231 |
| 1.3608199460000001 | -3.123 |
| 1.360910767 | -3.233 |
| 1.361001465 | -3.129 |
| 1.361092285 | -3.186 |
| 1.361182983 | -3.422 |
| 1.3612738039999999 | -3.793 |
| 1.3613646240000001 | -3.508 |
| 1.361455322 | -3.3 |
| 1.361546143 | -3.234 |
| 1.361636963 | -3.291 |
| 1.361727783 | -3.184 |
| 1.361818604 | -3.038 |
| 1.3619095460000001 | -3.023 |
| 1.362000366 | -2.919 |
| 1.362091309 | -2.62 |
| 1.362182129 | -2.266 |
| 1.3622730710000002 | -2.275 |
| 1.362364014 | -2.177 |
| 1.362454956 | -2.179 |
| 1.362545898 | -2.044 |
| 1.362636841 | -2.037 |
| 1.362727783 | -1.989 |
| 1.3628188479999999 | -2.006 |
| 1.36290979 | -1.975 |
| 1.3630008539999998 | -2.015 |
| 1.363091797 | -2.075 |
| 1.363182861 | -1.989 |
| 1.363273926 | -2.012 |
| 1.36336499 | -1.927 |
| 1.3634560550000001 | -2.221 |
| 1.3635471190000001 | -2.395 |
| 1.3636381839999998 | -2.436 |
| 1.363729248 | -2.408 |
| 1.363820435 | -2.423 |
| 1.363911499 | -2.314 |
| 1.364002686 | -2.242 |
| 1.36409375 | -2.237 |
| 1.364184937 | -2.307 |
| 1.364276123 | -2.359 |
| 1.36436731 | -2.097 |
| 1.364458496 | -1.959 |
| 1.364549683 | -1.847 |
| 1.364640991 | -1.825 |
| 1.3647322999999998 | -1.767 |
| 1.364823486 | -1.78 |
| 1.364914795 | -1.721 |
| 1.365005981 | -1.717 |
| 1.36509729 | -1.565 |
| 1.3651885990000001 | -1.492 |
| 1.3652799070000001 | -1.401 |
| 1.365371216 | -1.26 |
| 1.365462524 | -1.307 |
| 1.365553955 | -1.242 |
| 1.365645264 | -1.325 |
| 1.365736694 | -1.36 |
| 1.365828003 | -1.42 |
| 1.3659194339999998 | -1.381 |
| 1.3660108640000002 | -1.395 |
| 1.366102173 | -1.331 |
| 1.366193604 | -1.318 |
| 1.366285156 | -1.328 |
| 1.366376587 | -1.418 |
| 1.366468018 | -1.499 |
| 1.36655957 | -1.38 |
| 1.366651123 | -1.505 |
| 1.366742554 | -1.544 |
| 1.366834106 | -1.583 |
| 1.366925659 | -1.525 |
| 1.367017212 | -1.607 |
| 1.367108765 | -1.55 |
| 1.367200317 | -1.566 |
| 1.36729187 | -1.399 |
| 1.367383423 | -1.587 |
| 1.367475098 | -1.788 |
| 1.3675666499999999 | -1.559 |
| 1.367658325 | -1.508 |
| 1.3677498780000001 | -1.476 |
| 1.3678415529999999 | -1.542 |
| 1.367933228 | -1.45 |
| 1.3680249020000002 | -1.511 |
| 1.3681165770000001 | -1.448 |
| 1.3682082519999998 | -1.471 |
| 1.368300049 | -1.181 |
| 1.368391846 | -1.042 |
| 1.3684835210000001 | -1.034 |
| 1.3685753170000001 | -1.029 |
| 1.3686669919999999 | -1.06 |
| 1.368758789 | -1.208 |
| 1.368850586 | -1.361 |
| 1.368942383 | -1.298 |
| 1.36903418 | -1.358 |
| 1.369125977 | -1.295 |
| 1.369217896 | -1.338 |
| 1.369309692 | -1.295 |
| 1.369401611 | -1.343 |
| 1.369493408 | -1.325 |
| 1.369585327 | -1.339 |
| 1.369677246 | -1.209 |
| 1.369769165 | -1.394 |
| 1.3698610839999998 | -1.549 |
| 1.369953003 | -1.483 |
| 1.370044922 | -1.588 |
| 1.370136841 | -1.572 |
| 1.3702288820000001 | -1.628 |
| 1.370320923 | -1.58 |
| 1.370412964 | -1.606 |
| 1.3705048830000002 | -1.621 |
| 1.370596924 | -1.636 |
| 1.370688965 | -1.355 |
| 1.3707810059999999 | -1.256 |
| 1.3708730470000001 | -1.398 |
| 1.370965088 | -1.409 |
| 1.3710572509999999 | -1.453 |
| 1.3711492920000001 | -1.474 |
| 1.371241455 | -1.501 |
| 1.3713334959999999 | -1.485 |
| 1.371425659 | -1.496 |
| 1.371517822 | -1.447 |
| 1.371609985 | -1.483 |
| 1.371702148 | -1.514 |
| 1.371794312 | -1.469 |
| 1.371886475 | -1.414 |
| 1.37197876 | -1.37 |
| 1.3720709229999999 | -1.321 |
| 1.372163208 | -1.333 |
| 1.372255493 | -1.397 |
| 1.372347778 | -1.357 |
| 1.372440063 | -1.408 |
| 1.372532349 | -1.384 |
| 1.3726246340000001 | -1.423 |
| 1.372716919 | -1.372 |
| 1.372809204 | -1.421 |
| 1.372901489 | -1.418 |
| 1.3729938959999999 | -1.433 |
| 1.373086182 | -1.404 |
| 1.3731785890000001 | -1.358 |
| 1.373270996 | -1.418 |
| 1.3733634030000001 | -1.387 |
| 1.3734558110000001 | -1.436 |
| 1.3735482179999998 | -1.388 |
| 1.373640625 | -1.464 |
| 1.373733032 | -1.513 |
| 1.373825562 | -1.602 |
| 1.373917969 | -1.57 |
| 1.374010498 | -1.598 |
| 1.374103027 | -1.565 |
| 1.374195557 | -1.526 |
| 1.374288086 | -1.532 |
| 1.374380615 | -1.494 |
| 1.3744731449999998 | -1.549 |
| 1.3745656739999998 | -1.504 |
| 1.3746582029999999 | -1.498 |
| 1.374750854 | -1.462 |
| 1.374843384 | -1.518 |
| 1.374936035 | -1.492 |
| 1.375028564 | -1.526 |
| 1.375121216 | -1.487 |
| 1.375213867 | -1.491 |
| 1.375306519 | -1.507 |
| 1.37539917 | -1.502 |
| 1.375491821 | -1.514 |
| 1.375584595 | -1.461 |
| 1.375677246 | -1.479 |
| 1.37577002 | -1.593 |
| 1.3758626710000001 | -1.66 |
| 1.375955444 | -1.609 |
| 1.37604834 | -1.69 |
| 1.3761411129999999 | -1.644 |
| 1.3762338870000002 | -1.647 |
| 1.37632666 | -1.599 |
| 1.376419434 | -1.615 |
| 1.376512207 | -1.621 |
| 1.3766051030000002 | -1.583 |
| 1.376697876 | -1.453 |
| 1.376790771 | -1.388 |
| 1.376883667 | -1.425 |
| 1.376976563 | -1.329 |
| 1.377069458 | -1.358 |
| 1.377162354 | -1.301 |
| 1.377255249 | -1.342 |
| 1.377348145 | -1.399 |
| 1.37744104 | -1.425 |
| 1.377534058 | -1.512 |
| 1.377626953 | -1.591 |
| 1.3777199709999999 | -1.664 |
| 1.3778129879999998 | -1.648 |
| 1.377906006 | -1.673 |
| 1.377999023 | -1.627 |
| 1.378092163 | -1.667 |
| 1.378185181 | -1.596 |
| 1.378278198 | -1.522 |
| 1.378371216 | -1.459 |
| 1.378464355 | -1.405 |
| 1.378557495 | -1.309 |
| 1.378650513 | -1.264 |
| 1.378743652 | -1.252 |
| 1.378836792 | -1.254 |
| 1.378929932 | -1.327 |
| 1.379023071 | -1.306 |
| 1.379116211 | -1.319 |
| 1.379209473 | -1.302 |
| 1.379302612 | -1.369 |
| 1.379395874 | -1.526 |
| 1.379489014 | -1.812 |
| 1.379582275 | -1.999 |
| 1.379675537 | -2.079 |
| 1.379768799 | -2.053 |
| 1.379862183 | -2.051 |
| 1.379955444 | -2.178 |
| 1.380048706 | -2.151 |
| 1.380141968 | -2.145 |
| 1.380235352 | -2.039 |
| 1.3803286129999999 | -1.844 |
| 1.380421997 | -1.556 |
| 1.380515381 | -1.415 |
| 1.3806087649999998 | -1.347 |
| 1.3807021480000001 | -1.423 |
| 1.380795532 | -1.354 |
| 1.3808889160000002 | -1.264 |
| 1.3809822999999999 | -1.246 |
| 1.3810758060000001 | -1.229 |
| 1.381169189 | -1.269 |
| 1.381262695 | -1.408 |
| 1.381356079 | -1.503 |
| 1.3814495850000001 | -1.656 |
| 1.381543091 | -1.991 |
| 1.381636597 | -1.961 |
| 1.3817301030000002 | -2.179 |
| 1.38182373 | -2.168 |
| 1.381917236 | -2.278 |
| 1.3820108640000002 | -2.236 |
| 1.38210437 | -2.219 |
| 1.382197998 | -1.99 |
| 1.382291626 | -1.95 |
| 1.3823852540000001 | -1.786 |
| 1.382478882 | -1.489 |
| 1.38257251 | -1.502 |
| 1.382666138 | -1.502 |
| 1.382759766 | -1.575 |
| 1.382853394 | -1.476 |
| 1.382947144 | -1.523 |
| 1.383040771 | -1.465 |
| 1.383134521 | -1.494 |
| 1.383228271 | -1.446 |
| 1.383322021 | -1.434 |
| 1.383415771 | -1.428 |
| 1.383509521 | -1.41 |
| 1.383603271 | -1.286 |
| 1.3836971439999999 | -1.295 |
| 1.3837908939999999 | -1.339 |
| 1.383884766 | -1.471 |
| 1.383978638 | -1.627 |
| 1.384072388 | -1.555 |
| 1.38416626 | -1.623 |
| 1.384260132 | -1.58 |
| 1.384354004 | -1.616 |
| 1.3844478759999999 | -1.617 |
| 1.3845417480000002 | -1.617 |
| 1.384635742 | -1.582 |
| 1.384729614 | -1.655 |
| 1.3848236079999998 | -1.515 |
| 1.3849174800000001 | -1.384 |
| 1.385011475 | -1.44 |
| 1.385105469 | -1.348 |
| 1.385199463 | -1.467 |
| 1.385293457 | -1.43 |
| 1.3853874510000002 | -1.453 |
| 1.385481567 | -1.424 |
| 1.385575562 | -1.418 |
| 1.385669678 | -1.361 |
| 1.385763794 | -1.358 |
| 1.385857788 | -1.398 |
| 1.3859519040000001 | -1.382 |
| 1.386046021 | -1.407 |
| 1.3861401370000002 | -1.272 |
| 1.386234253 | -1.302 |
| 1.386328491 | -1.257 |
| 1.3864226069999999 | -1.317 |
| 1.386516724 | -1.273 |
| 1.386610962 | -1.417 |
| 1.3867050779999999 | -1.592 |
| 1.386799316 | -1.578 |
| 1.3868935550000001 | -1.702 |
| 1.386987793 | -1.704 |
| 1.3870820309999998 | -1.848 |
| 1.3871762699999999 | -1.889 |
| 1.38727063 | -1.954 |
| 1.387364868 | -1.887 |
| 1.387459106 | -1.94 |
| 1.3875535890000001 | -1.793 |
| 1.3876478270000001 | -1.653 |
| 1.387742188 | -1.673 |
| 1.387836548 | -1.612 |
| 1.387930908 | -1.587 |
| 1.388025269 | -1.478 |
| 1.388119629 | -1.404 |
| 1.388214111 | -1.344 |
| 1.3883084719999998 | -1.368 |
| 1.3884029539999998 | -1.34 |
| 1.3884973139999999 | -1.377 |
| 1.3885917970000001 | -1.355 |
| 1.388686279 | -1.468 |
| 1.3887807620000001 | -1.435 |
| 1.388875244 | -1.478 |
| 1.3889697269999999 | -1.45 |
| 1.3890642089999998 | -1.454 |
| 1.389158813 | -1.456 |
| 1.3892532960000001 | -1.433 |
| 1.3893479 | -1.447 |
| 1.3894425049999999 | -1.413 |
| 1.3895371090000002 | -1.46 |
| 1.389631714 | -1.348 |
| 1.389726318 | -1.399 |
| 1.389820923 | -1.349 |
| 1.389915527 | -1.404 |
| 1.3900102540000001 | -1.369 |
| 1.390104858 | -1.377 |
| 1.390199585 | -1.349 |
| 1.390294189 | -1.33 |
| 1.390388916 | -1.347 |
| 1.390483643 | -1.339 |
| 1.390578369 | -1.357 |
| 1.390673096 | -1.308 |
| 1.390767822 | -1.366 |
| 1.390862549 | -1.339 |
| 1.390957397 | -1.473 |
| 1.391052124 | -1.492 |
| 1.391146973 | -1.543 |
| 1.3912416989999998 | -1.63 |
| 1.391336548 | -1.884 |
| 1.391431519 | -1.853 |
| 1.391526367 | -1.888 |
| 1.391621216 | -1.913 |
| 1.391716064 | -1.894 |
| 1.391811035 | -1.908 |
| 1.391905884 | -1.771 |
| 1.392000854 | -1.746 |
| 1.3920957029999999 | -1.652 |
| 1.3921906739999999 | -1.55 |
| 1.3922856449999998 | -1.251 |
| 1.392380615 | -1.256 |
| 1.392475586 | -1.203 |
| 1.392570557 | -1.199 |
| 1.3926655270000001 | -1.204 |
| 1.39276062 | -1.215 |
| 1.392855591 | -1.234 |
| 1.3929506839999999 | -1.206 |
| 1.393045776 | -1.236 |
| 1.393140747 | -1.186 |
| 1.39323584 | -1.202 |
| 1.3933309329999999 | -1.156 |
| 1.393426147 | -1.211 |
| 1.393521362 | -1.195 |
| 1.393616455 | -1.193 |
| 1.393711548 | -1.276 |
| 1.393806763 | -1.479 |
| 1.3939019780000002 | -1.487 |
| 1.39399707 | -1.487 |
| 1.394092285 | -1.509 |
| 1.3941875 | -1.478 |
| 1.3942827150000001 | -1.634 |
| 1.394378052 | -1.576 |
| 1.3944732670000002 | -1.602 |
| 1.394568481 | -1.584 |
| 1.394663818 | -1.509 |
| 1.3947590330000001 | -1.287 |
| 1.39485437 | -1.305 |
| 1.394949707 | -1.288 |
| 1.395045044 | -1.283 |
| 1.395140381 | -1.549 |
| 1.395235718 | -1.402 |
| 1.395331177 | -1.469 |
| 1.3954266359999998 | -1.496 |
| 1.395521973 | -1.485 |
| 1.395617432 | -1.442 |
| 1.395712769 | -1.471 |
| 1.3958082280000002 | -1.433 |
| 1.395903687 | -1.452 |
| 1.395999146 | -1.47 |
| 1.396094604 | -1.219 |
| 1.396190186 | -1.155 |
| 1.3962856449999999 | -1.026 |
| 1.396381104 | -0.937 |
| 1.396476685 | -0.912 |
| 1.396572266 | -0.924 |
| 1.396667725 | -0.876 |
| 1.396763306 | -0.923 |
| 1.396858887 | -0.902 |
| 1.396954468 | -0.904 |
| 1.397050049 | -0.853 |
| 1.397145752 | -0.876 |
| 1.397241333 | -0.868 |
| 1.397337036 | -0.851 |
| 1.397432739 | -0.849 |
| 1.397528442 | -0.806 |
| 1.397624146 | -0.85 |
| 1.397719849 | -0.817 |
| 1.397815552 | -0.861 |
| 1.397911255 | -0.816 |
| 1.3980069579999999 | -0.877 |
| 1.3981026609999998 | -0.849 |
| 1.398198486 | -0.875 |
| 1.398294312 | -1.021 |
| 1.398390015 | -1.091 |
| 1.39848584 | -1.082 |
| 1.398581665 | -1.08 |
| 1.39867749 | -1.081 |
| 1.398773315 | -1.121 |
| 1.3988691409999998 | -1.259 |
| 1.398965088 | -1.208 |
| 1.399060913 | -1.281 |
| 1.39915686 | -1.286 |
| 1.399252686 | -1.166 |
| 1.3993487549999999 | -1.094 |
| 1.399444702 | -1.304 |
| 1.399540649 | -1.42 |
| 1.399636597 | -1.45 |
| 1.399732544 | -1.41 |
| 1.399828491 | -1.323 |
| 1.399924561 | -1.379 |
| 1.400020508 | -1.364 |
| 1.400116577 | -1.438 |
| 1.400212646 | -1.369 |
| 1.400308716 | -1.469 |
| 1.4004047849999999 | -1.24 |
| 1.400500854 | -1.143 |
| 1.400596924 | -1.116 |
| 1.4006929929999998 | -1.116 |
| 1.400789185 | -1.11 |
| 1.400885254 | -1.136 |
| 1.400981445 | -1.148 |
| 1.4010775149999999 | -1.07 |
| 1.401173706 | -1.12 |
| 1.40127002 | -1.001 |
| 1.401366211 | -1.04 |
| 1.4014624020000002 | -0.966 |
| 1.4015585940000002 | -0.993 |
| 1.4016549070000002 | -0.969 |
| 1.4017510990000002 | -1.02 |
| 1.4018474120000002 | -1.018 |
| 1.401943604 | -1.045 |
| 1.402039917 | -1.083 |
| 1.40213623 | -1.101 |
| 1.4022325439999999 | -1.137 |
| 1.4023288569999999 | -1.108 |
| 1.402425293 | -1.157 |
| 1.402521606 | -1.124 |
| 1.40261792 | -1.167 |
| 1.402714355 | -1.128 |
| 1.402810791 | -1.163 |
| 1.4029071039999998 | -1.187 |
| 1.4030035399999998 | -1.242 |
| 1.403099976 | -1.251 |
| 1.403196411 | -1.327 |
| 1.403292969 | -1.381 |
| 1.403389526 | -1.365 |
| 1.403485962 | -1.408 |
| 1.4035825199999998 | -1.368 |
| 1.4036789550000002 | -1.581 |
| 1.403775513 | -1.801 |
| 1.4038720699999998 | -1.849 |
| 1.403968628 | -1.839 |
| 1.404065186 | -1.909 |
| 1.404161743 | -1.887 |
| 1.404258301 | -1.914 |
| 1.4043549800000001 | -1.927 |
| 1.404451538 | -1.911 |
| 1.404548218 | -1.945 |
| 1.4046448969999998 | -1.733 |
| 1.404741577 | -1.526 |
| 1.4048382570000002 | -1.467 |
| 1.404934937 | -1.515 |
| 1.405031616 | -1.496 |
| 1.405128296 | -1.532 |
| 1.4052250979999998 | -1.518 |
| 1.405321899 | -1.568 |
| 1.405418579 | -1.602 |
| 1.4055153809999998 | -1.646 |
| 1.405612183 | -1.676 |
| 1.405708984 | -1.675 |
| 1.405805786 | -1.766 |
| 1.405902588 | -1.745 |
| 1.4059993899999998 | -1.864 |
| 1.406096313 | -1.928 |
| 1.406193115 | -2.01 |
| 1.406290039 | -2.086 |
| 1.406386841 | -2.117 |
| 1.406483765 | -2.064 |
| 1.406580688 | -2.073 |
| 1.406677612 | -2.052 |
| 1.406774536 | -2.005 |
| 1.406871582 | -2.013 |
| 1.406968506 | -1.932 |
| 1.40706543 | -1.92 |
| 1.4071624759999999 | -1.903 |
| 1.4072595209999998 | -1.878 |
| 1.4073565670000001 | -1.853 |
| 1.407453613 | -1.923 |
| 1.407550659 | -1.889 |
| 1.407647705 | -1.942 |
| 1.4077447509999998 | -1.953 |
| 1.407841919 | -1.979 |
| 1.407938965 | -2.009 |
| 1.408036133 | -2.09 |
| 1.4081333010000001 | -2.122 |
| 1.408230347 | -2.23 |
| 1.4083275149999999 | -2.382 |
| 1.408424683 | -2.367 |
| 1.408521851 | -2.436 |
| 1.408619141 | -2.388 |
| 1.4087163089999999 | -2.433 |
| 1.4088134769999998 | -2.391 |
| 1.408910767 | -2.396 |
| 1.409007935 | -2.283 |
| 1.409105225 | -2.318 |
| 1.4092026370000001 | -2.235 |
| 1.409299927 | -2.145 |
| 1.409397217 | -2.183 |
| 1.409494507 | -2.163 |
| 1.409591919 | -2.198 |
| 1.409689209 | -2.1 |
| 1.409786621 | -2.15 |
| 1.4098839109999999 | -2.096 |
| 1.409981323 | -2.156 |
| 1.4100787350000001 | -2.126 |
| 1.4101761469999998 | -2.145 |
| 1.41027356 | -2.16 |
| 1.410370972 | -2.167 |
| 1.410468384 | -2.179 |
| 1.410565918 | -2.151 |
| 1.41066333 | -2.194 |
| 1.410760864 | -2.128 |
| 1.410858398 | -2.164 |
| 1.4109559329999999 | -2.093 |
| 1.411053467 | -2.166 |
| 1.411151001 | -2.151 |
| 1.411248657 | -2.184 |
| 1.411346191 | -2.155 |
| 1.411443726 | -2.177 |
| 1.411541382 | -2.189 |
| 1.4116390380000001 | -2.169 |
| 1.4117365720000001 | -2.174 |
| 1.411834229 | -2.117 |
| 1.411931885 | -2.125 |
| 1.412029541 | -2.028 |
| 1.412127197 | -2.043 |
| 1.412224976 | -1.992 |
| 1.4123226320000002 | -2.045 |
| 1.41242041 | -2.041 |
| 1.412518066 | -2.062 |
| 1.412615845 | -2.041 |
| 1.4127136230000001 | -2.03 |
| 1.412811401 | -2.079 |
| 1.4129091800000002 | -2.121 |
| 1.413006958 | -2.171 |
| 1.413104736 | -2.13 |
| 1.413202759 | -2.15 |
| 1.413300537 | -2.114 |
| 1.413398438 | -2.166 |
| 1.4134963379999999 | -2.141 |
| 1.413594116 | -2.207 |
| 1.413692017 | -2.196 |
| 1.4137899170000001 | -2.131 |
| 1.4138879389999999 | -2.011 |
| 1.41398584 | -1.93 |
| 1.4140837400000001 | -1.92 |
| 1.414181763 | -1.892 |
| 1.414279785 | -1.878 |
| 1.4143776860000001 | -1.792 |
| 1.4144757079999999 | -1.818 |
| 1.41457373 | -1.746 |
| 1.4146717530000001 | -1.753 |
| 1.414769775 | -1.704 |
| 1.4148679199999998 | -1.714 |
| 1.414965942 | -1.656 |
| 1.415064087 | -1.609 |
| 1.4151621090000002 | -1.561 |
| 1.415260376 | -1.525 |
| 1.4153585210000001 | -1.541 |
| 1.415456665 | -1.489 |
| 1.4155548100000002 | -1.506 |
| 1.415652954 | -1.469 |
| 1.415751099 | -1.515 |
| 1.4158493650000001 | -1.435 |
| 1.41594751 | -1.449 |
| 1.416045776 | -1.379 |
| 1.416144043 | -1.369 |
| 1.416242188 | -1.339 |
| 1.416340454 | -1.346 |
| 1.416438721 | -1.337 |
| 1.416537109 | -1.318 |
| 1.416635376 | -1.335 |
| 1.416733643 | -1.263 |
| 1.416832031 | -1.308 |
| 1.41693042 | -1.239 |
| 1.417028687 | -1.256 |
| 1.417127075 | -1.171 |
| 1.417225586 | -1.158 |
| 1.417323975 | -1.054 |
| 1.4174223629999998 | -1.068 |
| 1.417520874 | -1.034 |
| 1.417619263 | -1.042 |
| 1.4177177730000001 | -1.108 |
| 1.417816162 | -1.077 |
| 1.417914673 | -1.1 |
| 1.4180131839999999 | -1.039 |
| 1.418111694 | -1.081 |
| 1.418210205 | -0.996 |
| 1.418308716 | -1.028 |
| 1.4184072269999999 | -0.965 |
| 1.4185058590000001 | -0.972 |
| 1.41860437 | -0.903 |
| 1.418703003 | -0.878 |
| 1.418801636 | -0.864 |
| 1.4189002689999999 | -0.826 |
| 1.418998901 | -0.825 |
| 1.419097534 | -0.74 |
| 1.419196167 | -0.749 |
| 1.419294922 | -0.659 |
| 1.419393677 | -0.65 |
| 1.41949231 | -0.602 |
| 1.419591064 | -0.634 |
| 1.419689819 | -0.555 |
| 1.419788574 | -0.56 |
| 1.4198873289999998 | -0.56 |
| 1.4199860839999998 | -0.552 |
| 1.420084839 | -0.536 |
| 1.420183594 | -0.489 |
| 1.420282471 | -0.497 |
| 1.420381226 | -0.433 |
| 1.420480103 | -0.434 |
| 1.4205789789999999 | -0.352 |
| 1.420677856 | -0.392 |
| 1.4207767329999998 | -0.352 |
| 1.42087561 | -0.369 |
| 1.420974487 | -0.325 |
| 1.4210733640000002 | -0.345 |
| 1.421172363 | -0.324 |
| 1.421271362 | -0.276 |
| 1.421370361 | -0.267 |
| 1.4214693600000001 | -0.213 |
| 1.4215683590000001 | -0.241 |
| 1.4216673579999999 | -0.194 |
| 1.4217663569999999 | -0.216 |
| 1.421865356 | -0.173 |
| 1.421964478 | -0.244 |
| 1.422063477 | -0.207 |
| 1.422162598 | -0.242 |
| 1.4222615969999999 | -0.212 |
| 1.422360718 | -0.19 |
| 1.422459839 | -0.17 |
| 1.4225589600000002 | -0.148 |
| 1.422658081 | -0.176 |
| 1.422757324 | -0.154 |
| 1.4228564449999999 | -0.203 |
| 1.422955688 | -0.144 |
| 1.42305481 | -0.178 |
| 1.423154053 | -0.118 |
| 1.4232532960000002 | -0.158 |
| 1.4233526609999998 | -0.104 |
| 1.423451904 | -0.098 |
| 1.423551147 | -0.037 |
| 1.4236503909999998 | 0.01 |
| 1.4237497559999999 | 0.021 |
| 1.423848999 | 0.063 |
| 1.4239483640000001 | 0.046 |
| 1.424047729 | 0.05 |
| 1.4241469729999998 | -0.009 |
| 1.424246338 | 0.051 |
| 1.424345825 | -0.005 |
| 1.42444519 | 0.037 |
| 1.424544556 | 0.017 |
| 1.424644043 | 0.058 |
| 1.424743408 | 0.064 |
| 1.4248428960000001 | 0.084 |
| 1.424942383 | 0.08 |
| 1.4250417480000002 | 0.074 |
| 1.4251412350000001 | 0.109 |
| 1.425240845 | 0.059 |
| 1.4253404539999999 | 0.104 |
| 1.425439941 | 0.072 |
| 1.4255394289999999 | 0.135 |
| 1.4256390380000001 | 0.114 |
| 1.425738647 | 0.175 |
| 1.425838135 | 0.143 |
| 1.425937744 | 0.169 |
| 1.426037354 | 0.15 |
| 1.4261370850000001 | 0.129 |
| 1.426236694 | 0.123 |
| 1.4263363039999999 | 0.091 |
| 1.426436035 | 0.119 |
| 1.426535645 | 0.065 |
| 1.426635376 | 0.122 |
| 1.426735107 | 0.081 |
| 1.426834839 | 0.135 |
| 1.4269345699999998 | 0.087 |
| 1.427034302 | 0.129 |
| 1.427134033 | 0.084 |
| 1.427233887 | 0.093 |
| 1.4273336179999998 | 0.079 |
| 1.427433594 | 0.045 |
| 1.4275333250000002 | 0.067 |
| 1.4276331789999999 | 0.026 |
| 1.4277330320000001 | 0.06 |
| 1.427832886 | 0.032 |
| 1.427932861 | 0.102 |
| 1.428032715 | 0.052 |
| 1.428132568 | 0.113 |
| 1.4282325439999999 | 0.063 |
| 1.4283325199999999 | 0.061 |
| 1.4284323730000001 | 0.033 |
| 1.4285323490000001 | 0.036 |
| 1.4286323239999998 | 0.025 |
| 1.4287322999999998 | 0.006 |
| 1.4288323969999999 | 0.048 |
| 1.428932373 | 0.014 |
| 1.429032349 | 0.074 |
| 1.4291324460000001 | 0.016 |
| 1.429232544 | 0.042 |
| 1.42933252 | -0.005 |
| 1.4294327390000001 | 0.026 |
| 1.429532837 | -0.039 |
| 1.429632935 | -0.022 |
| 1.429733154 | -0.019 |
| 1.4298332519999999 | -0.036 |
| 1.4299334719999999 | -0.044 |
| 1.430033569 | -0.079 |
| 1.4301337889999999 | -0.051 |
| 1.430234009 | -0.087 |
| 1.430334229 | -0.075 |
| 1.430434448 | -0.171 |
| 1.430534668 | -0.144 |
| 1.430634888 | -0.204 |
| 1.430735229 | -0.194 |
| 1.430835449 | -0.225 |
| 1.430935791 | -0.181 |
| 1.431036133 | -0.186 |
| 1.431136353 | -0.222 |
| 1.4312366939999999 | -0.228 |
| 1.431337158 | -0.271 |
| 1.4314375 | -0.23 |
| 1.431537964 | -0.288 |
| 1.431638306 | -0.265 |
| 1.43173877 | -0.347 |
| 1.4318392329999998 | -0.311 |
| 1.431939697 | -0.357 |
| 1.4320400389999999 | -0.325 |
| 1.432140503 | -0.306 |
| 1.4322410890000001 | -0.297 |
| 1.4323415529999999 | -0.282 |
| 1.432442017 | -0.315 |
| 1.4325426030000001 | -0.322 |
| 1.432643066 | -0.39 |
| 1.432743652 | -0.357 |
| 1.432844238 | -0.439 |
| 1.432944824 | -0.419 |
| 1.4330454099999999 | -0.483 |
| 1.433145996 | -0.502 |
| 1.433246582 | -0.537 |
| 1.43334729 | -0.526 |
| 1.433447876 | -0.557 |
| 1.433548706 | -0.582 |
| 1.433649414 | -0.579 |
| 1.433750122 | -0.642 |
| 1.4338508300000001 | -0.639 |
| 1.433951538 | -0.712 |
| 1.434052246 | -0.67 |
| 1.434152954 | -0.682 |
| 1.434253784 | -0.632 |
| 1.434354492 | -0.69 |
| 1.434455322 | -0.665 |
| 1.434556152 | -0.695 |
| 1.434656982 | -0.718 |
| 1.434757813 | -0.76 |
| 1.434858643 | -0.812 |
| 1.434959473 | -0.804 |
| 1.4350604249999999 | -0.876 |
| 1.435161255 | -0.851 |
| 1.435262207 | -0.912 |
| 1.4353630370000001 | -0.865 |
| 1.435463989 | -0.916 |
| 1.435564941 | -0.902 |
| 1.4356660159999999 | -0.964 |
| 1.4357669679999998 | -0.951 |
| 1.435868042 | -0.98 |
| 1.435968994 | -1.034 |
| 1.436070068 | -1.05 |
| 1.436171021 | -1.097 |
| 1.436272095 | -1.091 |
| 1.436373169 | -1.147 |
| 1.436474243 | -1.153 |
| 1.436575317 | -1.233 |
| 1.436676514 | -1.2 |
| 1.436777588 | -1.271 |
| 1.436878662 | -1.275 |
| 1.436979858 | -1.322 |
| 1.4370810550000002 | -1.331 |
| 1.4371822509999999 | -1.372 |
| 1.4372833250000001 | -1.398 |
| 1.437384644 | -1.389 |
| 1.4374858400000001 | -1.394 |
| 1.4375870359999998 | -1.337 |
| 1.4376883539999998 | -1.396 |
| 1.437789673 | -1.378 |
| 1.437890869 | -1.443 |
| 1.437992188 | -1.419 |
| 1.438093506 | -1.516 |
| 1.438194824 | -1.544 |
| 1.438296143 | -1.59 |
| 1.438397583 | -1.622 |
| 1.438498901 | -1.63 |
| 1.43860022 | -1.669 |
| 1.43870166 | -1.656 |
| 1.438803101 | -1.703 |
| 1.438904419 | -1.679 |
| 1.439005859 | -1.776 |
| 1.4391072999999999 | -1.751 |
| 1.4392088619999999 | -1.806 |
| 1.439310303 | -1.8 |
| 1.439411743 | -1.858 |
| 1.439513306 | -1.857 |
| 1.4396148679999998 | -1.879 |
| 1.4397163089999998 | -1.892 |
| 1.439817993 | -1.891 |
| 1.439919556 | -1.953 |
| 1.440021118 | -1.936 |
| 1.440122681 | -2.018 |
| 1.440224365 | -2.054 |
| 1.440325928 | -2.149 |
| 1.440427612 | -2.128 |
| 1.440529175 | -2.199 |
| 1.440630859 | -2.187 |
| 1.440732544 | -2.225 |
| 1.440834229 | -2.234 |
| 1.4409359130000001 | -2.245 |
| 1.44103772 | -2.277 |
| 1.441139404 | -2.278 |
| 1.441241211 | -2.307 |
| 1.441342896 | -2.296 |
| 1.441444702 | -2.381 |
| 1.441546509 | -2.39 |
| 1.441648315 | -2.486 |
| 1.441750122 | -2.46 |
| 1.4418520510000001 | -2.508 |
| 1.441953857 | -2.486 |
| 1.4420557859999998 | -2.531 |
| 1.442157715 | -2.546 |
| 1.442259521 | -2.558 |
| 1.4423614500000002 | -2.619 |
| 1.442463379 | -2.639 |
| 1.442565308 | -2.696 |
| 1.442667236 | -2.651 |
| 1.4427692870000002 | -2.73 |
| 1.442871216 | -2.697 |
| 1.4429731449999998 | -2.762 |
| 1.4430751949999998 | -2.74 |
| 1.4431772459999999 | -2.78 |
| 1.4432792970000001 | -2.795 |
| 1.443381348 | -2.843 |
| 1.4434833980000001 | -2.87 |
| 1.443585449 | -2.889 |
| 1.443687622 | -2.968 |
| 1.443789673 | -2.956 |
| 1.443891846 | -3.022 |
| 1.443994019 | -2.985 |
| 1.444096191 | -3.036 |
| 1.444198364 | -3.021 |
| 1.4443005370000002 | -3.11 |
| 1.44440271 | -3.121 |
| 1.444504883 | -3.21 |
| 1.444607178 | -3.263 |
| 1.444709351 | -3.295 |
| 1.444811646 | -3.338 |
| 1.44491394 | -3.346 |
| 1.445016235 | -3.408 |
| 1.44511853 | -3.376 |
| 1.445220825 | -3.428 |
| 1.44532312 | -3.35 |
| 1.445425537 | -3.388 |
| 1.445527832 | -3.354 |
| 1.4456302490000001 | -3.402 |
| 1.445732544 | -3.405 |
| 1.445834961 | -3.471 |
| 1.445937378 | -3.5 |
| 1.446039917 | -3.507 |
| 1.446142334 | -3.547 |
| 1.4462448730000002 | -3.519 |
| 1.4463472899999998 | -3.58 |
| 1.4464498289999999 | -3.555 |
| 1.446552246 | -3.606 |
| 1.446654785 | -3.578 |
| 1.446757324 | -3.667 |
| 1.4468598629999998 | -3.659 |
| 1.446962402 | -3.716 |
| 1.447065063 | -3.725 |
| 1.447167603 | -3.755 |
| 1.447270142 | -3.779 |
| 1.447372803 | -3.768 |
| 1.447475464 | -3.8 |
| 1.447578125 | -3.777 |
| 1.4476807859999998 | -3.855 |
| 1.447783447 | -3.831 |
| 1.4478861079999998 | -3.897 |
| 1.44798877 | -3.885 |
| 1.448091553 | -3.968 |
| 1.448194336 | -3.951 |
| 1.448297119 | -3.988 |
| 1.448399902 | -3.983 |
| 1.448502686 | -3.991 |
| 1.448605469 | -4.026 |
| 1.4487082519999999 | -4.005 |
| 1.4488110349999999 | -4.053 |
| 1.44891394 | -4.053 |
| 1.449016724 | -4.142 |
| 1.4491196290000001 | -4.107 |
| 1.449222534 | -4.193 |
| 1.4493254389999999 | -4.218 |
| 1.449428345 | -4.275 |
| 1.44953125 | -4.255 |
| 1.449634155 | -4.261 |
| 1.449737061 | -4.269 |
| 1.449840088 | -4.292 |
| 1.449943115 | -4.333 |
| 1.4500460210000001 | -4.307 |
| 1.4501490479999999 | -4.378 |
| 1.450252197 | -4.355 |
| 1.450355225 | -4.375 |
| 1.450458252 | -4.326 |
| 1.4505614009999999 | -4.373 |
| 1.450664429 | -4.336 |
| 1.450767578 | -4.363 |
| 1.450870605 | -4.347 |
| 1.450973755 | -4.36 |
| 1.451076904 | -4.388 |
| 1.451180054 | -4.405 |
| 1.451283203 | -4.446 |
| 1.451386475 | -4.423 |
| 1.4514896240000001 | -4.492 |
| 1.4515928960000002 | -4.455 |
| 1.4516960449999998 | -4.508 |
| 1.451799316 | -4.458 |
| 1.4519025879999998 | -4.475 |
| 1.452005859 | -4.446 |
| 1.4521091309999998 | -4.484 |
| 1.452212402 | -4.478 |
| 1.4523157960000002 | -4.493 |
| 1.452419189 | -4.542 |
| 1.452522583 | -4.531 |
| 1.4526259769999998 | -4.566 |
| 1.452729248 | -4.516 |
| 1.4528326420000002 | -4.559 |
| 1.452936035 | -4.508 |
| 1.453039551 | -4.551 |
| 1.4531429439999999 | -4.504 |
| 1.4532464600000001 | -4.546 |
| 1.453349854 | -4.553 |
| 1.453453369 | -4.573 |
| 1.453556885 | -4.579 |
| 1.4536604 | -4.584 |
| 1.4537639160000002 | -4.619 |
| 1.453867432 | -4.571 |
| 1.453970947 | -4.627 |
| 1.454074585 | -4.578 |
| 1.454178101 | -4.62 |
| 1.454281738 | -4.59 |
| 1.4543853759999998 | -4.627 |
| 1.454489014 | -4.599 |
| 1.454592651 | -4.654 |
| 1.4546964109999998 | -4.656 |
| 1.454800049 | -4.655 |
| 1.454903687 | -4.671 |
| 1.455007446 | -4.617 |
| 1.4551110839999999 | -4.624 |
| 1.4552148440000001 | -4.576 |
| 1.4553186040000001 | -4.602 |
| 1.4554223629999998 | -4.555 |
| 1.455526123 | -4.621 |
| 1.455630005 | -4.586 |
| 1.455733765 | -4.629 |
| 1.455837524 | -4.612 |
| 1.455941406 | -4.644 |
| 1.456045288 | -4.632 |
| 1.45614917 | -4.609 |
| 1.456253052 | -4.61 |
| 1.456356934 | -4.572 |
| 1.456460815 | -4.619 |
| 1.4565646970000001 | -4.569 |
| 1.456668823 | -4.61 |
| 1.4567727050000001 | -4.575 |
| 1.4568767089999999 | -4.643 |
| 1.4569807129999999 | -4.594 |
| 1.4570847169999999 | -4.621 |
| 1.457188721 | -4.591 |
| 1.457292725 | -4.584 |
| 1.457396729 | -4.571 |
| 1.4575008539999998 | -4.529 |
| 1.4576048579999998 | -4.541 |
| 1.4577089840000002 | -4.515 |
| 1.45781311 | -4.566 |
| 1.457917236 | -4.511 |
| 1.458021362 | -4.567 |
| 1.4581254879999999 | -4.529 |
| 1.4582296140000002 | -4.565 |
| 1.458333862 | -4.509 |
| 1.4584379879999998 | -4.509 |
| 1.458542236 | -4.474 |
| 1.4586464840000002 | -4.468 |
| 1.458750732 | -4.471 |
| 1.4588549800000001 | -4.431 |
| 1.458959229 | -4.478 |
| 1.459063599 | -4.466 |
| 1.459167847 | -4.507 |
| 1.4592722169999999 | -4.444 |
| 1.459376465 | -4.481 |
| 1.4594808350000001 | -4.414 |
| 1.459585205 | -4.428 |
| 1.459689575 | -4.377 |
| 1.459793945 | -4.363 |
| 1.459898315 | -4.36 |
| 1.460002808 | -4.352 |
| 1.4601073 | -4.341 |
| 1.460211792 | -4.308 |
| 1.460316162 | -4.354 |
| 1.460420654 | -4.303 |
| 1.460525146 | -4.328 |
| 1.460629639 | -4.251 |
| 1.460734131 | -4.261 |
| 1.460838745 | -4.209 |
| 1.460943359 | -4.222 |
| 1.461047974 | -4.171 |
| 1.461152466 | -4.174 |
| 1.46125708 | -4.186 |
| 1.461361694 | -4.167 |
| 1.461466309 | -4.175 |
| 1.461571045 | -4.125 |
| 1.461675659 | -4.152 |
| 1.461780273 | -4.079 |
| 1.46188501 | -4.12 |
| 1.461989746 | -4.047 |
| 1.46209436 | -4.072 |
| 1.4621990969999998 | -4.042 |
| 1.462303833 | -4.053 |
| 1.462408691 | -4.023 |
| 1.462513428 | -4.029 |
| 1.462618164 | -4.039 |
| 1.4627230219999998 | -3.987 |
| 1.462827881 | -3.994 |
| 1.4629326169999999 | -3.897 |
| 1.4630375979999999 | -3.911 |
| 1.4631424560000001 | -3.851 |
| 1.463247314 | -3.87 |
| 1.463352295 | -3.809 |
| 1.463457153 | -3.854 |
| 1.463562134 | -3.825 |
| 1.4636669919999998 | -3.823 |
| 1.4637719729999998 | -3.809 |
| 1.463876953 | -3.798 |
| 1.463981934 | -3.802 |
| 1.464086914 | -3.746 |
| 1.464192017 | -3.75 |
| 1.464296997 | -3.678 |
| 1.4644019780000002 | -3.724 |
| 1.4645070800000002 | -3.665 |
| 1.464612183 | -3.694 |
| 1.4647172849999999 | -3.656 |
| 1.464822388 | -3.686 |
| 1.46492749 | -3.627 |
| 1.4650325929999999 | -3.6 |
| 1.465137817 | -3.576 |
| 1.465243042 | -3.526 |
| 1.465348267 | -3.541 |
| 1.465453369 | -3.481 |
| 1.465558594 | -3.495 |
| 1.465663818 | -3.457 |
| 1.465769043 | -3.514 |
| 1.46587439 | -3.445 |
| 1.465979614 | -3.475 |
| 1.466084961 | -3.423 |
| 1.466190186 | -3.415 |
| 1.4662955320000002 | -3.374 |
| 1.466400879 | -3.334 |
| 1.466506226 | -3.321 |
| 1.466611572 | -3.29 |
| 1.466716919 | -3.306 |
| 1.466822388 | -3.233 |
| 1.4669277340000002 | -3.274 |
| 1.467033203 | -3.227 |
| 1.4671386720000001 | -3.261 |
| 1.467244019 | -3.188 |
| 1.467349609 | -3.196 |
| 1.467455078 | -3.135 |
| 1.467560669 | -3.12 |
| 1.467666138 | -3.092 |
| 1.4677716060000001 | -3.054 |
| 1.467877197 | -3.069 |
| 1.467982788 | -3.045 |
| 1.468088379 | -3.073 |
| 1.46819397 | -3.015 |
| 1.468299561 | -3.093 |
| 1.468405151 | -3.029 |
| 1.4685107419999999 | -3.047 |
| 1.468616455 | -2.977 |
| 1.468722168 | -2.972 |
| 1.468827759 | -2.942 |
| 1.468933472 | -2.946 |
| 1.4690391850000002 | -2.933 |
| 1.4691448969999998 | -2.911 |
| 1.46925061 | -2.946 |
| 1.4693564449999998 | -2.895 |
| 1.46946228 | -2.928 |
| 1.469568115 | -2.855 |
| 1.46967395 | -2.887 |
| 1.469779663 | -2.832 |
| 1.469885498 | -2.852 |
| 1.4699914550000002 | -2.796 |
| 1.47009729 | -2.808 |
| 1.470203125 | -2.808 |
| 1.470309082 | -2.805 |
| 1.470414917 | -2.785 |
| 1.470520874 | -2.748 |
| 1.4706268310000001 | -2.78 |
| 1.470732788 | -2.706 |
| 1.470838745 | -2.715 |
| 1.470944702 | -2.651 |
| 1.471050659 | -2.698 |
| 1.471156738 | -2.655 |
| 1.471262817 | -2.686 |
| 1.471368774 | -2.653 |
| 1.471474854 | -2.677 |
| 1.471580933 | -2.681 |
| 1.471687134 | -2.656 |
| 1.471793213 | -2.668 |
| 1.471899414 | -2.62 |
| 1.472005493 | -2.627 |
| 1.4721116939999999 | -2.546 |
| 1.472217896 | -2.572 |
| 1.4723239750000001 | -2.506 |
| 1.472430176 | -2.568 |
| 1.472536499 | -2.536 |
| 1.4726427000000002 | -2.558 |
| 1.4727489009999999 | -2.542 |
| 1.472855225 | -2.548 |
| 1.4729614260000001 | -2.538 |
| 1.4730677490000001 | -2.497 |
| 1.473174072 | -2.501 |
| 1.473280396 | -2.44 |
| 1.473386719 | -2.483 |
| 1.473493042 | -2.421 |
| 1.473599487 | -2.456 |
| 1.473705811 | -2.418 |
| 1.473812378 | -2.474 |
| 1.473918701 | -2.435 |
| 1.474025146 | -2.446 |
| 1.474131592 | -2.428 |
| 1.4742380370000001 | -2.403 |
| 1.474344604 | -2.41 |
| 1.4744510499999999 | -2.369 |
| 1.4745576169999999 | -2.387 |
| 1.4746640629999999 | -2.357 |
| 1.47477063 | -2.415 |
| 1.474877197 | -2.36 |
| 1.474983765 | -2.408 |
| 1.475090332 | -2.375 |
| 1.475196899 | -2.402 |
| 1.4753035890000001 | -2.364 |
| 1.475410156 | -2.352 |
| 1.4755168459999999 | -2.325 |
| 1.475623535 | -2.309 |
| 1.475730103 | -2.338 |
| 1.475836792 | -2.297 |
| 1.475943604 | -2.342 |
| 1.476050415 | -2.318 |
| 1.4761571039999999 | -2.369 |
| 1.4762639160000002 | -2.316 |
| 1.476370605 | -2.356 |
| 1.4764774170000001 | -2.329 |
| 1.476584229 | -2.352 |
| 1.47669104 | -2.324 |
| 1.476797852 | -2.301 |
| 1.476904663 | -2.314 |
| 1.477011597 | -2.314 |
| 1.477118408 | -2.341 |
| 1.4772253419999999 | -2.304 |
| 1.477332275 | -2.367 |
| 1.477439209 | -2.322 |
| 1.477546143 | -2.341 |
| 1.477653076 | -2.275 |
| 1.47776001 | -2.292 |
| 1.4778670649999999 | -2.259 |
| 1.477973999 | -2.282 |
| 1.478081055 | -2.271 |
| 1.478188232 | -2.281 |
| 1.478295288 | -2.326 |
| 1.478402344 | -2.311 |
| 1.478509399 | -2.352 |
| 1.478616455 | -2.307 |
| 1.478723633 | -2.355 |
| 1.478830688 | -2.297 |
| 1.4789378659999999 | -2.337 |
| 1.479045044 | -2.296 |
| 1.479152222 | -2.325 |
| 1.479259399 | -2.322 |
| 1.479366577 | -2.349 |
| 1.479473755 | -2.354 |
| 1.4795810550000001 | -2.359 |
| 1.479688232 | -2.405 |
| 1.479795532 | -2.361 |
| 1.479902832 | -2.401 |
| 1.480010132 | -2.332 |
| 1.480117432 | -2.363 |
| 1.480224731 | -2.327 |
| 1.480332153 | -2.375 |
| 1.4804395750000001 | -2.342 |
| 1.4805469969999998 | -2.394 |
| 1.480654297 | -2.406 |
| 1.480761719 | -2.418 |
| 1.4808691409999999 | -2.445 |
| 1.480976563 | -2.424 |
| 1.481083984 | -2.458 |
| 1.481191528 | -2.411 |
| 1.48129895 | -2.445 |
| 1.481406494 | -2.38 |
| 1.481514038 | -2.443 |
| 1.481621582 | -2.418 |
| 1.4817291259999998 | -2.461 |
| 1.4818366699999999 | -2.451 |
| 1.481944214 | -2.492 |
| 1.482051758 | -2.496 |
| 1.482159424 | -2.484 |
| 1.4822670900000001 | -2.498 |
| 1.482374634 | -2.46 |
| 1.4824822999999998 | -2.51 |
| 1.482590088 | -2.469 |
| 1.482697754 | -2.515 |
| 1.4828055420000001 | -2.489 |
| 1.482913208 | -2.567 |
| 1.483020996 | -2.544 |
| 1.4831286620000002 | -2.591 |
| 1.4832364500000002 | -2.589 |
| 1.483344238 | -2.598 |
| 1.483452026 | -2.606 |
| 1.483559814 | -2.58 |
| 1.483667725 | -2.602 |
| 1.483775513 | -2.584 |
| 1.483883423 | -2.653 |
| 1.483991211 | -2.615 |
| 1.484099121 | -2.68 |
| 1.484207031 | -2.669 |
| 1.484314941 | -2.73 |
| 1.484422852 | -2.702 |
| 1.484530884 | -2.724 |
| 1.4846387939999999 | -2.711 |
| 1.484746826 | -2.716 |
| 1.4848549800000002 | -2.74 |
| 1.484962891 | -2.711 |
| 1.485070923 | -2.766 |
| 1.485179077 | -2.762 |
| 1.4852871090000002 | -2.833 |
| 1.485395142 | -2.802 |
| 1.485503296 | -2.875 |
| 1.485611328 | -2.842 |
| 1.485719482 | -2.883 |
| 1.485827637 | -2.86 |
| 1.4859357910000002 | -2.866 |
| 1.4860439449999998 | -2.88 |
| 1.4861521 | -2.896 |
| 1.486260376 | -2.928 |
| 1.48636853 | -2.908 |
| 1.486476807 | -2.98 |
| 1.486585083 | -2.968 |
| 1.486693359 | -3.03 |
| 1.4868016359999998 | -2.986 |
| 1.486909912 | -3.029 |
| 1.4870183110000001 | -3 |
| 1.487126709 | -3.039 |
| 1.487234985 | -3.02 |
| 1.487343384 | -3.039 |
| 1.4874517820000002 | -3.084 |
| 1.487560181 | -3.096 |
| 1.487668579 | -3.135 |
| 1.487776978 | -3.118 |
| 1.487885376 | -3.186 |
| 1.4879938959999999 | -3.141 |
| 1.488102295 | -3.194 |
| 1.488210815 | -3.145 |
| 1.488319336 | -3.197 |
| 1.488427856 | -3.197 |
| 1.488536377 | -3.233 |
| 1.488644897 | -3.236 |
| 1.4887535399999998 | -3.272 |
| 1.488862061 | -3.325 |
| 1.488970703 | -3.311 |
| 1.489079346 | -3.36 |
| 1.48918811 | -3.317 |
| 1.489296753 | -3.37 |
| 1.4894053960000002 | -3.329 |
| 1.489514038 | -3.374 |
| 1.489622681 | -3.34 |
| 1.4897314449999999 | -3.412 |
| 1.48984021 | -3.42 |
| 1.4899489750000001 | -3.453 |
| 1.490057617 | -3.487 |
| 1.490166504 | -3.507 |
| 1.490275269 | -3.545 |
| 1.490384033 | -3.515 |
| 1.4904929199999999 | -3.555 |
| 1.4906016850000001 | -3.512 |
| 1.4907105710000002 | -3.586 |
| 1.490819458 | -3.557 |
| 1.490928345 | -3.614 |
| 1.491037231 | -3.609 |
| 1.4911461179999999 | -3.675 |
| 1.491255005 | -3.676 |
| 1.491364014 | -3.694 |
| 1.4914730219999999 | -3.719 |
| 1.4915820309999999 | -3.702 |
| 1.4916910399999999 | -3.746 |
| 1.4918000489999999 | -3.711 |
| 1.491909058 | -3.758 |
| 1.492018188 | -3.741 |
| 1.492127197 | -3.825 |
| 1.492236328 | -3.8 |
| 1.492345337 | -3.868 |
| 1.4924544679999998 | -3.874 |
| 1.4925635990000001 | -3.915 |
| 1.492672729 | -3.92 |
| 1.49278186 | -3.919 |
| 1.492891113 | -3.938 |
| 1.493000244 | -3.93 |
| 1.4931094969999998 | -3.988 |
| 1.4932186280000002 | -3.959 |
| 1.493327881 | -4.034 |
| 1.493437134 | -4.027 |
| 1.493546387 | -4.104 |
| 1.493655884 | -4.077 |
| 1.493765137 | -4.132 |
| 1.49387439 | -4.118 |
| 1.4939837649999999 | -4.138 |
| 1.49409314 | -4.148 |
| 1.494202515 | -4.134 |
| 1.4943118899999999 | -4.179 |
| 1.494421265 | -4.183 |
| 1.49453064 | -4.25 |
| 1.4946401370000002 | -4.221 |
| 1.494749512 | -4.308 |
| 1.494859009 | -4.281 |
| 1.494968506 | -4.335 |
| 1.4950780030000002 | -4.305 |
| 1.4951875 | -4.33 |
| 1.4952969969999999 | -4.326 |
| 1.495406494 | -4.348 |
| 1.4955161129999999 | -4.369 |
| 1.495625732 | -4.365 |
| 1.4957352289999999 | -4.437 |
| 1.495844849 | -4.426 |
| 1.49595459 | -4.489 |
| 1.4960642089999998 | -4.453 |
| 1.4961739500000002 | -4.509 |
| 1.496283569 | -4.463 |
| 1.496393188 | -4.502 |
| 1.4965029300000001 | -4.467 |
| 1.496612671 | -4.489 |
| 1.496722412 | -4.513 |
| 1.4968321530000002 | -4.531 |
| 1.496941895 | -4.56 |
| 1.497051636 | -4.555 |
| 1.497161499 | -4.625 |
| 1.497271362 | -4.582 |
| 1.497381104 | -4.632 |
| 1.497490967 | -4.573 |
| 1.49760083 | -4.614 |
| 1.497710693 | -4.587 |
| 1.497820557 | -4.62 |
| 1.497930542 | -4.601 |
| 1.498040405 | -4.638 |
| 1.4981505130000001 | -4.67 |
| 1.498260498 | -4.663 |
| 1.498370483 | -4.702 |
| 1.498480469 | -4.674 |
| 1.498590454 | -4.717 |
| 1.498700439 | -4.664 |
| 1.498810547 | -4.699 |
| 1.498920532 | -4.642 |
| 1.49903064 | -4.699 |
| 1.499140747 | -4.684 |
| 1.4992508539999998 | -4.713 |
| 1.499360962 | -4.713 |
| 1.499471069 | -4.739 |
| 1.499581177 | -4.756 |
| 1.499691406 | -4.726 |
| 1.499801636 | -4.749 |
| 1.499911743 | -4.691 |
| 1.500021973 | -4.739 |
| 1.500132202 | -4.689 |
| 1.500242432 | -4.725 |
| 1.500352783 | -4.691 |
| 1.500463135 | -4.755 |
| 1.500573486 | -4.73 |
| 1.500683716 | -4.749 |
| 1.500794067 | -4.749 |
| 1.500904419 | -4.733 |
| 1.5010147710000001 | -4.743 |
| 1.501125122 | -4.692 |
| 1.501235596 | -4.707 |
| 1.5013459470000001 | -4.665 |
| 1.501456421 | -4.722 |
| 1.5015668949999998 | -4.667 |
| 1.501677368 | -4.714 |
| 1.501787842 | -4.687 |
| 1.5018983149999998 | -4.722 |
| 1.502008789 | -4.687 |
| 1.502119263 | -4.677 |
| 1.502229858 | -4.658 |
| 1.5023404539999998 | -4.627 |
| 1.50245105 | -4.646 |
| 1.502561523 | -4.593 |
| 1.502672241 | -4.633 |
| 1.502782959 | -4.602 |
| 1.5028935550000002 | -4.654 |
| 1.5030042719999999 | -4.596 |
| 1.503114868 | -4.637 |
| 1.5032255860000001 | -4.59 |
| 1.5033363039999998 | -4.591 |
| 1.503447021 | -4.556 |
| 1.5035577390000001 | -4.519 |
| 1.503668457 | -4.516 |
| 1.5037792970000001 | -4.495 |
| 1.5038900149999999 | -4.519 |
| 1.5040008539999998 | -4.466 |
| 1.5041116939999999 | -4.524 |
| 1.504222534 | -4.477 |
| 1.504333374 | -4.509 |
| 1.504444214 | -4.442 |
| 1.504555054 | -4.447 |
| 1.5046660159999998 | -4.395 |
| 1.5047769780000002 | -4.392 |
| 1.504887939 | -4.362 |
| 1.504998901 | -4.334 |
| 1.505109863 | -4.361 |
| 1.505220825 | -4.328 |
| 1.505331909 | -4.354 |
| 1.505442871 | -4.299 |
| 1.505553955 | -4.341 |
| 1.505664917 | -4.265 |
| 1.5057760009999999 | -4.28 |
| 1.5058870850000001 | -4.207 |
| 1.505998169 | -4.206 |
| 1.506109375 | -4.182 |
| 1.506220459 | -4.174 |
| 1.506331543 | -4.16 |
| 1.506442749 | -4.142 |
| 1.506553955 | -4.176 |
| 1.506665161 | -4.12 |
| 1.5067763669999998 | -4.144 |
| 1.506887573 | -4.069 |
| 1.5069987790000001 | -4.086 |
| 1.507110107 | -4.019 |
| 1.507221436 | -4.026 |
| 1.507332764 | -3.967 |
| 1.5074440919999998 | -3.984 |
| 1.5075554199999999 | -3.974 |
| 1.5076667480000001 | -3.957 |
| 1.5077780760000001 | -3.959 |
| 1.507889526 | -3.927 |
| 1.5080008539999998 | -3.942 |
| 1.508112305 | -3.868 |
| 1.508223755 | -3.881 |
| 1.508335205 | -3.799 |
| 1.508446655 | -3.83 |
| 1.508558105 | -3.779 |
| 1.508669556 | -3.79 |
| 1.508781128 | -3.754 |
| 1.508892578 | -3.774 |
| 1.50900415 | -3.761 |
| 1.5091157229999999 | -3.726 |
| 1.5092272949999999 | -3.727 |
| 1.5093388669999999 | -3.66 |
| 1.509450562 | -3.677 |
| 1.509562256 | -3.604 |
| 1.509673828 | -3.616 |
| 1.5097855219999998 | -3.555 |
| 1.509897217 | -3.602 |
| 1.510008911 | -3.552 |
| 1.510120605 | -3.565 |
| 1.5102323 | -3.542 |
| 1.510343994 | -3.533 |
| 1.5104558110000001 | -3.513 |
| 1.510567627 | -3.459 |
| 1.510679321 | -3.452 |
| 1.510791138 | -3.394 |
| 1.5109029539999999 | -3.428 |
| 1.511014893 | -3.358 |
| 1.5111267089999998 | -3.39 |
| 1.511238525 | -3.352 |
| 1.5113504640000002 | -3.391 |
| 1.511462402 | -3.335 |
| 1.511574219 | -3.335 |
| 1.5116861570000002 | -3.301 |
| 1.5117983400000001 | -3.268 |
| 1.511910278 | -3.26 |
| 1.512022217 | -3.198 |
| 1.5121342770000001 | -3.212 |
| 1.512246216 | -3.174 |
| 1.5123582759999998 | -3.214 |
| 1.5124703369999999 | -3.146 |
| 1.5125823969999999 | -3.193 |
| 1.512694458 | -3.145 |
| 1.5128066409999998 | -3.155 |
| 1.512918701 | -3.103 |
| 1.513030884 | -3.078 |
| 1.513143066 | -3.052 |
| 1.513255249 | -3.029 |
| 1.513367432 | -3.029 |
| 1.513479614 | -2.976 |
| 1.5135917970000001 | -3.022 |
| 1.513704102 | -2.978 |
| 1.513816284 | -3.01 |
| 1.513928589 | -2.941 |
| 1.514041016 | -2.966 |
| 1.51415332 | -2.902 |
| 1.514265625 | -2.905 |
| 1.5143779300000002 | -2.857 |
| 1.5144902340000002 | -2.834 |
| 1.5146026609999999 | -2.843 |
| 1.514715088 | -2.818 |
| 1.514827393 | -2.832 |
| 1.5149398189999999 | -2.788 |
| 1.515052246 | -2.838 |
| 1.515164795 | -2.768 |
| 1.515277222 | -2.794 |
| 1.5153897710000002 | -2.718 |
| 1.515502197 | -2.726 |
| 1.515614746 | -2.685 |
| 1.5157272949999998 | -2.684 |
| 1.515839844 | -2.656 |
| 1.515952393 | -2.65 |
| 1.516064941 | -2.673 |
| 1.516177612 | -2.635 |
| 1.516290283 | -2.66 |
| 1.516402954 | -2.601 |
| 1.516515625 | -2.627 |
| 1.5166282960000002 | -2.555 |
| 1.516740967 | -2.57 |
| 1.516853638 | -2.501 |
| 1.516966431 | -2.526 |
| 1.5170791019999998 | -2.505 |
| 1.5171918949999998 | -2.506 |
| 1.5173046879999998 | -2.5 |
| 1.51741748 | -2.492 |
| 1.517530273 | -2.508 |
| 1.517643066 | -2.451 |
| 1.517755981 | -2.471 |
| 1.517868774 | -2.394 |
| 1.517981689 | -2.426 |
| 1.518094482 | -2.366 |
| 1.5182073969999998 | -2.385 |
| 1.518320313 | -2.344 |
| 1.51843335 | -2.38 |
| 1.518546265 | -2.362 |
| 1.518659302 | -2.352 |
| 1.518772339 | -2.358 |
| 1.5188853759999998 | -2.319 |
| 1.518998413 | -2.332 |
| 1.51911145 | -2.265 |
| 1.519224487 | -2.28 |
| 1.519337524 | -2.22 |
| 1.519450684 | -2.271 |
| 1.519563721 | -2.22 |
| 1.51967688 | -2.252 |
| 1.5197900389999999 | -2.231 |
| 1.519903198 | -2.251 |
| 1.520016357 | -2.23 |
| 1.520129517 | -2.203 |
| 1.520242798 | -2.199 |
| 1.520355957 | -2.147 |
| 1.520469238 | -2.174 |
| 1.5205825199999998 | -2.109 |
| 1.520695801 | -2.146 |
| 1.520809082 | -2.11 |
| 1.520922485 | -2.16 |
| 1.521035767 | -2.11 |
| 1.52114917 | -2.14 |
| 1.5212624510000001 | -2.113 |
| 1.521375854 | -2.103 |
| 1.5214892580000001 | -2.09 |
| 1.521602661 | -2.044 |
| 1.521716064 | -2.054 |
| 1.52182959 | -2.021 |
| 1.521942993 | -2.06 |
| 1.522056519 | -2.005 |
| 1.5221700439999999 | -2.063 |
| 1.522283447 | -2.026 |
| 1.522396973 | -2.061 |
| 1.52251062 | -2.014 |
| 1.522624146 | -2.018 |
| 1.522737671 | -1.988 |
| 1.522851318 | -1.974 |
| 1.522964966 | -1.97 |
| 1.5230786129999998 | -1.931 |
| 1.523192261 | -1.973 |
| 1.5233060299999999 | -1.945 |
| 1.523419678 | -1.987 |
| 1.523533325 | -1.935 |
| 1.523647095 | -1.989 |
| 1.523760864 | -1.932 |
| 1.5238745120000001 | -1.952 |
| 1.5239882809999998 | -1.904 |
| 1.524102173 | -1.896 |
| 1.524215942 | -1.895 |
| 1.524329712 | -1.886 |
| 1.524443604 | -1.897 |
| 1.5245573730000002 | -1.872 |
| 1.524671265 | -1.929 |
| 1.5247851559999999 | -1.883 |
| 1.524899048 | -1.926 |
| 1.525013062 | -1.866 |
| 1.525126953 | -1.892 |
| 1.5252408450000001 | -1.844 |
| 1.5253548579999998 | -1.858 |
| 1.5254688719999998 | -1.822 |
| 1.5255830080000001 | -1.833 |
| 1.525697021 | -1.854 |
| 1.525811035 | -1.839 |
| 1.525925049 | -1.867 |
| 1.5260391850000001 | -1.838 |
| 1.52615332 | -1.883 |
| 1.526267334 | -1.821 |
| 1.52638147 | -1.852 |
| 1.526495605 | -1.784 |
| 1.526609741 | -1.82 |
| 1.526723999 | -1.794 |
| 1.526838135 | -1.81 |
| 1.526952393 | -1.8 |
| 1.52706665 | -1.82 |
| 1.527180786 | -1.845 |
| 1.527295166 | -1.815 |
| 1.527409424 | -1.85 |
| 1.527523682 | -1.794 |
| 1.527637939 | -1.833 |
| 1.527752319 | -1.776 |
| 1.5278668210000002 | -1.804 |
| 1.527981201 | -1.763 |
| 1.528095581 | -1.816 |
| 1.528209961 | -1.798 |
| 1.528324341 | -1.814 |
| 1.528438721 | -1.827 |
| 1.5285532229999998 | -1.824 |
| 1.528667725 | -1.842 |
| 1.528782227 | -1.794 |
| 1.528896729 | -1.817 |
| 1.52901123 | -1.765 |
| 1.529125732 | -1.819 |
| 1.5292402340000002 | -1.769 |
| 1.5293548579999998 | -1.812 |
| 1.5294694819999999 | -1.795 |
| 1.529584106 | -1.844 |
| 1.529698608 | -1.826 |
| 1.5298133539999998 | -1.833 |
| 1.529927979 | -1.84 |
| 1.530042603 | -1.809 |
| 1.530157349 | -1.834 |
| 1.530272095 | -1.778 |
| 1.530386841 | -1.817 |
| 1.530501587 | -1.787 |
| 1.530616333 | -1.847 |
| 1.530731201 | -1.802 |
| 1.530845947 | -1.858 |
| 1.530960693 | -1.845 |
| 1.531075562 | -1.864 |
| 1.53119043 | -1.85 |
| 1.531305298 | -1.83 |
| 1.5314201660000002 | -1.839 |
| 1.531535034 | -1.816 |
| 1.531650024 | -1.851 |
| 1.531764893 | -1.804 |
| 1.531879883 | -1.87 |
| 1.5319948730000001 | -1.847 |
| 1.5321098629999998 | -1.901 |
| 1.532224854 | -1.864 |
| 1.532339844 | -1.903 |
| 1.532454834 | -1.876 |
| 1.532570068 | -1.882 |
| 1.5326850589999998 | -1.873 |
| 1.532800171 | -1.851 |
| 1.5329152830000001 | -1.89 |
| 1.533030396 | -1.872 |
| 1.533145508 | -1.915 |
| 1.533260742 | -1.882 |
| 1.533375854 | -1.957 |
| 1.5334910890000002 | -1.914 |
| 1.5336063229999999 | -1.957 |
| 1.5337215579999999 | -1.915 |
| 1.533836792 | -1.931 |
| 1.533952026 | -1.922 |
| 1.534067261 | -1.926 |
| 1.534182617 | -1.932 |
| 1.534297852 | -1.928 |
| 1.534413208 | -1.987 |
| 1.534528564 | -1.962 |
| 1.534643921 | -2.018 |
| 1.534759277 | -1.98 |
| 1.534874756 | -2.031 |
| 1.5349902340000001 | -1.984 |
| 1.5351057129999999 | -2.015 |
| 1.5352210689999999 | -1.977 |
| 1.535336548 | -2.003 |
| 1.535452026 | -2.017 |
| 1.5355676269999998 | -2.022 |
| 1.5356831050000002 | -2.054 |
| 1.535798584 | -2.054 |
| 1.535914185 | -2.113 |
| 1.536029785 | -2.069 |
| 1.5361453859999998 | -2.12 |
| 1.536260986 | -2.065 |
| 1.536376587 | -2.113 |
| 1.536492188 | -2.083 |
| 1.5366079099999999 | -2.113 |
| 1.536723511 | -2.103 |
| 1.536839233 | -2.144 |
| 1.536954956 | -2.17 |
| 1.537070679 | -2.167 |
| 1.537186401 | -2.215 |
| 1.537302368 | -2.19 |
| 1.537418091 | -2.239 |
| 1.537533936 | -2.191 |
| 1.537649658 | -2.232 |
| 1.5377655030000001 | -2.191 |
| 1.537881348 | -2.255 |
| 1.537997314 | -2.236 |
| 1.538113159 | -2.275 |
| 1.538229004 | -2.293 |
| 1.538344971 | -2.324 |
| 1.5384609379999998 | -2.349 |
| 1.538576904 | -2.332 |
| 1.538692871 | -2.37 |
| 1.538808838 | -2.331 |
| 1.5389248050000002 | -2.389 |
| 1.539040894 | -2.343 |
| 1.53915686 | -2.397 |
| 1.539272949 | -2.386 |
| 1.539389038 | -2.455 |
| 1.539505127 | -2.443 |
| 1.539621338 | -2.482 |
| 1.539737549 | -2.502 |
| 1.539853638 | -2.504 |
| 1.539969849 | -2.533 |
| 1.540085938 | -2.497 |
| 1.540202148 | -2.539 |
| 1.540318359 | -2.518 |
| 1.540434692 | -2.583 |
| 1.540550903 | -2.547 |
| 1.540667236 | -2.622 |
| 1.540783447 | -2.619 |
| 1.54089978 | -2.672 |
| 1.541016113 | -2.665 |
| 1.541132446 | -2.682 |
| 1.541248779 | -2.696 |
| 1.541365112 | -2.689 |
| 1.541481567 | -2.721 |
| 1.5415980219999998 | -2.689 |
| 1.541714355 | -2.759 |
| 1.541830811 | -2.748 |
| 1.541947266 | -2.817 |
| 1.542063965 | -2.789 |
| 1.54218042 | -2.862 |
| 1.542296875 | -2.849 |
| 1.542413452 | -2.881 |
| 1.542530029 | -2.874 |
| 1.542646606 | -2.873 |
| 1.542763184 | -2.905 |
| 1.542879761 | -2.902 |
| 1.5429964600000001 | -2.947 |
| 1.5431130370000001 | -2.93 |
| 1.543229736 | -3.017 |
| 1.543346436 | -2.992 |
| 1.543463013 | -3.057 |
| 1.543579834 | -3.029 |
| 1.543696533 | -3.076 |
| 1.543813232 | -3.06 |
| 1.5439300539999998 | -3.082 |
| 1.5440467530000002 | -3.081 |
| 1.544163574 | -3.091 |
| 1.544280396 | -3.146 |
| 1.544397339 | -3.141 |
| 1.5445142820000002 | -3.2 |
| 1.544631104 | -3.183 |
| 1.5447479249999998 | -3.258 |
| 1.544864868 | -3.218 |
| 1.544981812 | -3.271 |
| 1.545098755 | -3.233 |
| 1.545215698 | -3.273 |
| 1.545332642 | -3.278 |
| 1.545449707 | -3.3 |
| 1.54556665 | -3.324 |
| 1.545683716 | -3.346 |
| 1.5458007809999998 | -3.408 |
| 1.545917847 | -3.384 |
| 1.546034912 | -3.45 |
| 1.5461519780000001 | -3.412 |
| 1.546269165 | -3.47 |
| 1.54638623 | -3.434 |
| 1.546503418 | -3.474 |
| 1.546620605 | -3.455 |
| 1.546737915 | -3.51 |
| 1.5468551030000002 | -3.528 |
| 1.54697229 | -3.545 |
| 1.5470896 | -3.59 |
| 1.5472067870000001 | -3.593 |
| 1.547324097 | -3.648 |
| 1.547441406 | -3.613 |
| 1.547558716 | -3.664 |
| 1.547676025 | -3.621 |
| 1.547793457 | -3.689 |
| 1.547910767 | -3.662 |
| 1.548028198 | -3.71 |
| 1.5481455080000002 | -3.721 |
| 1.548262939 | -3.772 |
| 1.548380371 | -3.792 |
| 1.548497925 | -3.798 |
| 1.548615356 | -3.842 |
| 1.5487327880000001 | -3.818 |
| 1.548850342 | -3.872 |
| 1.5489678960000002 | -3.828 |
| 1.549085449 | -3.882 |
| 1.549203125 | -3.866 |
| 1.549320679 | -3.939 |
| 1.549438232 | -3.924 |
| 1.549555908 | -3.982 |
| 1.549673584 | -4.005 |
| 1.549791138 | -4.033 |
| 1.549908813 | -4.06 |
| 1.5500264890000002 | -4.043 |
| 1.5501442870000002 | -4.083 |
| 1.5502619629999999 | -4.063 |
| 1.5503797609999999 | -4.126 |
| 1.550497437 | -4.09 |
| 1.5506152340000001 | -4.168 |
| 1.5507330320000001 | -4.164 |
| 1.5508508300000001 | -4.232 |
| 1.5509686280000001 | -4.225 |
| 1.551086548 | -4.268 |
| 1.551204346 | -4.282 |
| 1.551322266 | -4.286 |
| 1.551440186 | -4.313 |
| 1.5515582280000002 | -4.287 |
| 1.551676147 | -4.349 |
| 1.551794067 | -4.339 |
| 1.551912109 | -4.411 |
| 1.552030029 | -4.388 |
| 1.552148071 | -4.478 |
| 1.552266113 | -4.469 |
| 1.552384155 | -4.522 |
| 1.552502197 | -4.516 |
| 1.552620361 | -4.532 |
| 1.552738403 | -4.554 |
| 1.552856567 | -4.559 |
| 1.552974609 | -4.595 |
| 1.5530927730000001 | -4.58 |
| 1.5532109379999999 | -4.666 |
| 1.553329224 | -4.652 |
| 1.5534473880000002 | -4.729 |
| 1.553565674 | -4.709 |
| 1.553683838 | -4.776 |
| 1.553802124 | -4.758 |
| 1.553920532 | -4.793 |
| 1.554038818 | -4.783 |
| 1.554157104 | -4.802 |
| 1.554275513 | -4.848 |
| 1.5543937989999999 | -4.851 |
| 1.554512207 | -4.905 |
| 1.554630615 | -4.905 |
| 1.554749023 | -4.993 |
| 1.554867432 | -4.966 |
| 1.55498584 | -5.033 |
| 1.55510437 | -5 |
| 1.555222778 | -5.053 |
| 1.555341309 | -5.046 |
| 1.555459839 | -5.073 |
| 1.555578369 | -5.08 |
| 1.555696899 | -5.113 |
| 1.55581543 | -5.169 |
| 1.555934082 | -5.165 |
| 1.556052612 | -5.235 |
| 1.556171265 | -5.219 |
| 1.556289917 | -5.291 |
| 1.5564086910000001 | -5.254 |
| 1.556527344 | -5.306 |
| 1.556646118 | -5.281 |
| 1.556764771 | -5.346 |
| 1.5568835449999998 | -5.352 |
| 1.557002197 | -5.381 |
| 1.5571209719999999 | -5.42 |
| 1.557239746 | -5.449 |
| 1.557358643 | -5.503 |
| 1.557477417 | -5.482 |
| 1.557596313 | -5.543 |
| 1.557715088 | -5.508 |
| 1.5578339840000002 | -5.578 |
| 1.5579528809999998 | -5.545 |
| 1.558071777 | -5.595 |
| 1.558190796 | -5.597 |
| 1.5583096920000001 | -5.663 |
| 1.558428711 | -5.674 |
| 1.558547607 | -5.704 |
| 1.558666626 | -5.753 |
| 1.558785767 | -5.751 |
| 1.558904785 | -5.804 |
| 1.559023926 | -5.769 |
| 1.559142944 | -5.823 |
| 1.559262085 | -5.804 |
| 1.559381226 | -5.874 |
| 1.559500244 | -5.846 |
| 1.559619507 | -5.915 |
| 1.5597386469999999 | -5.932 |
| 1.559857788 | -5.978 |
| 1.5599770510000002 | -5.995 |
| 1.5600961910000002 | -6.003 |
| 1.560215454 | -6.042 |
| 1.560334717 | -6.03 |
| 1.5604539789999998 | -6.083 |
| 1.560573242 | -6.049 |
| 1.5606926269999999 | -6.126 |
| 1.5608118899999999 | -6.118 |
| 1.560931274 | -6.19 |
| 1.561050659 | -6.175 |
| 1.561170044 | -6.243 |
| 1.561289551 | -6.249 |
| 1.561408936 | -6.273 |
| 1.561528442 | -6.292 |
| 1.561647949 | -6.28 |
| 1.5617673339999998 | -6.329 |
| 1.561886841 | -6.316 |
| 1.562006348 | -6.373 |
| 1.5621258539999998 | -6.35 |
| 1.5622454829999999 | -6.443 |
| 1.56236499 | -6.427 |
| 1.5624846190000001 | -6.492 |
| 1.5626042480000002 | -6.477 |
| 1.5627238769999998 | -6.516 |
| 1.5628435059999999 | -6.523 |
| 1.562963135 | -6.532 |
| 1.563082886 | -6.553 |
| 1.563202515 | -6.547 |
| 1.563322266 | -6.617 |
| 1.563442017 | -6.601 |
| 1.563561768 | -6.671 |
| 1.5636816409999998 | -6.654 |
| 1.563801392 | -6.733 |
| 1.5639212649999998 | -6.705 |
| 1.564041016 | -6.75 |
| 1.564160889 | -6.731 |
| 1.564280762 | -6.757 |
| 1.564400635 | -6.78 |
| 1.564520508 | -6.785 |
| 1.5646405030000001 | -6.825 |
| 1.564760376 | -6.831 |
| 1.5648803709999999 | -6.908 |
| 1.565000366 | -6.88 |
| 1.565120239 | -6.952 |
| 1.565240356 | -6.922 |
| 1.565360352 | -6.981 |
| 1.5654803469999998 | -6.956 |
| 1.565600464 | -6.986 |
| 1.5657205810000001 | -6.982 |
| 1.565840576 | -7.018 |
| 1.565960693 | -7.051 |
| 1.5660810550000002 | -7.052 |
| 1.566201172 | -7.111 |
| 1.566321289 | -7.101 |
| 1.5664415280000001 | -7.167 |
| 1.5665617680000001 | -7.129 |
| 1.566682007 | -7.187 |
| 1.566802246 | -7.151 |
| 1.566922485 | -7.206 |
| 1.567042725 | -7.189 |
| 1.567163086 | -7.221 |
| 1.567283447 | -7.241 |
| 1.567403687 | -7.276 |
| 1.567524048 | -7.311 |
| 1.567644531 | -7.299 |
| 1.567764893 | -7.353 |
| 1.5678852540000001 | -7.318 |
| 1.568005737 | -7.372 |
| 1.568126221 | -7.325 |
| 1.5682467039999999 | -7.375 |
| 1.5683671879999999 | -7.357 |
| 1.5684876710000002 | -7.415 |
| 1.568608276 | -7.404 |
| 1.568728882 | -7.44 |
| 1.568849365 | -7.469 |
| 1.568969971 | -7.475 |
| 1.569090576 | -7.508 |
| 1.569211182 | -7.478 |
| 1.569331787 | -7.527 |
| 1.569452515 | -7.488 |
| 1.56957312 | -7.542 |
| 1.5696938479999998 | -7.501 |
| 1.569814575 | -7.562 |
| 1.569935303 | -7.553 |
| 1.57005603 | -7.597 |
| 1.57017688 | -7.594 |
| 1.5702976069999999 | -7.611 |
| 1.570418457 | -7.63 |
| 1.5705391850000001 | -7.613 |
| 1.570660034 | -7.645 |
| 1.570780884 | -7.604 |
| 1.570901855 | -7.657 |
| 1.571022827 | -7.627 |
| 1.571143799 | -7.686 |
| 1.571264648 | -7.649 |
| 1.57138562 | -7.708 |
| 1.571506592 | -7.695 |
| 1.571627563 | -7.722 |
| 1.571748657 | -7.712 |
| 1.571869629 | -7.701 |
| 1.5719907229999999 | -7.72 |
| 1.572111816 | -7.696 |
| 1.572232788 | -7.733 |
| 1.5723540040000001 | -7.696 |
| 1.572475098 | -7.769 |
| 1.5725961910000001 | -7.742 |
| 1.572717407 | -7.797 |
| 1.5728385009999999 | -7.764 |
| 1.572959717 | -7.807 |
| 1.573080933 | -7.787 |
| 1.573202148 | -7.79 |
| 1.573323486 | -7.783 |
| 1.5734448239999999 | -7.767 |
| 1.573566162 | -7.808 |
| 1.573687378 | -7.783 |
| 1.573808716 | -7.828 |
| 1.5739300539999999 | -7.796 |
| 1.574051514 | -7.864 |
| 1.574172852 | -7.819 |
| 1.574294189 | -7.86 |
| 1.574415649 | -7.821 |
| 1.574537109 | -7.838 |
| 1.574658569 | -7.829 |
| 1.574780029 | -7.825 |
| 1.5749014890000002 | -7.835 |
| 1.5750230710000002 | -7.83 |
| 1.5751445309999998 | -7.882 |
| 1.5752661129999999 | -7.844 |
| 1.5753876949999999 | -7.897 |
| 1.575509277 | -7.854 |
| 1.575630859 | -7.904 |
| 1.575752563 | -7.857 |
| 1.575874146 | -7.878 |
| 1.5759959719999999 | -7.844 |
| 1.576117676 | -7.87 |
| 1.57623938 | -7.877 |
| 1.576361084 | -7.866 |
| 1.576482788 | -7.896 |
| 1.576604614 | -7.889 |
| 1.576726318 | -7.939 |
| 1.576848145 | -7.892 |
| 1.576969971 | -7.941 |
| 1.577091797 | -7.892 |
| 1.577213623 | -7.937 |
| 1.577335449 | -7.893 |
| 1.5774573969999999 | -7.913 |
| 1.577579346 | -7.908 |
| 1.577701294 | -7.937 |
| 1.577823242 | -7.944 |
| 1.5779451899999999 | -7.932 |
| 1.578067139 | -7.972 |
| 1.578189087 | -7.938 |
| 1.5783111570000001 | -7.98 |
| 1.57843335 | -7.923 |
| 1.5785554199999998 | -7.959 |
| 1.57867749 | -7.919 |
| 1.578799561 | -7.966 |
| 1.5789216309999998 | -7.929 |
| 1.579043823 | -7.958 |
| 1.5791660159999998 | -7.961 |
| 1.579288086 | -7.969 |
| 1.5794102780000001 | -7.983 |
| 1.579532593 | -7.953 |
| 1.579654785 | -7.983 |
| 1.5797769780000002 | -7.945 |
| 1.5798992920000001 | -7.988 |
| 1.580021606 | -7.931 |
| 1.5801439210000001 | -7.983 |
| 1.580266235 | -7.955 |
| 1.58038855 | -7.996 |
| 1.580510864 | -7.967 |
| 1.580633301 | -7.99 |
| 1.580755737 | -7.99 |
| 1.580878174 | -7.977 |
| 1.58100061 | -7.988 |
| 1.581123169 | -7.943 |
| 1.581245605 | -7.984 |
| 1.581368042 | -7.945 |
| 1.581490601 | -7.989 |
| 1.581613159 | -7.942 |
| 1.581735718 | -8 |
| 1.581858276 | -7.963 |
| 1.581980835 | -7.989 |
| 1.5821035159999999 | -7.961 |
| 1.5822260739999998 | -7.959 |
| 1.582348755 | -7.959 |
| 1.582471436 | -7.932 |
| 1.5825941159999999 | -7.948 |
| 1.582716797 | -7.912 |
| 1.5828394780000001 | -7.968 |
| 1.58296228 | -7.925 |
| 1.5830850829999998 | -7.98 |
| 1.583207764 | -7.94 |
| 1.583330566 | -7.985 |
| 1.583453491 | -7.945 |
| 1.583576416 | -7.954 |
| 1.583699219 | -7.93 |
| 1.583822144 | -7.919 |
| 1.5839449460000001 | -7.935 |
| 1.584067871 | -7.91 |
| 1.5841907960000001 | -7.944 |
| 1.5843138429999999 | -7.909 |
| 1.584436768 | -7.968 |
| 1.584559814 | -7.915 |
| 1.584682739 | -7.957 |
| 1.584805786 | -7.906 |
| 1.584928833 | -7.929 |
| 1.58505188 | -7.899 |
| 1.5851750489999998 | -7.898 |
| 1.585298096 | -7.888 |
| 1.585421265 | -7.884 |
| 1.585544434 | -7.919 |
| 1.5856674800000001 | -7.884 |
| 1.5857907709999999 | -7.932 |
| 1.585914063 | -7.887 |
| 1.586037231 | -7.935 |
| 1.586160522 | -7.876 |
| 1.586283813 | -7.901 |
| 1.586406982 | -7.855 |
| 1.5865302730000002 | -7.879 |
| 1.586653687 | -7.862 |
| 1.586776978 | -7.859 |
| 1.586900391 | -7.878 |
| 1.587023682 | -7.872 |
| 1.587147095 | -7.911 |
| 1.587270508 | -7.86 |
| 1.587393921 | -7.902 |
| 1.587517334 | -7.847 |
| 1.5876408690000001 | -7.891 |
| 1.587764404 | -7.838 |
| 1.5878878170000001 | -7.863 |
| 1.5880113530000002 | -7.836 |
| 1.5881348880000001 | -7.866 |
| 1.588258545 | -7.859 |
| 1.588382202 | -7.851 |
| 1.588505859 | -7.88 |
| 1.5886293949999999 | -7.855 |
| 1.588753052 | -7.887 |
| 1.588876709 | -7.827 |
| 1.589000366 | -7.862 |
| 1.589124146 | -7.809 |
| 1.589247803 | -7.853 |
| 1.589371582 | -7.801 |
| 1.589495361 | -7.837 |
| 1.5896191409999998 | -7.833 |
| 1.58974292 | -7.851 |
| 1.5898666989999999 | -7.847 |
| 1.589990601 | -7.827 |
| 1.59011438 | -7.847 |
| 1.590238281 | -7.809 |
| 1.5903621829999999 | -7.845 |
| 1.590486084 | -7.781 |
| 1.590609985 | -7.826 |
| 1.590734009 | -7.787 |
| 1.59085791 | -7.83 |
| 1.590982056 | -7.788 |
| 1.591106079 | -7.82 |
| 1.591230103 | -7.808 |
| 1.591354126 | -7.806 |
| 1.591478149 | -7.805 |
| 1.591602295 | -7.768 |
| 1.591726318 | -7.8 |
| 1.5918504640000002 | -7.759 |
| 1.5919746090000002 | -7.792 |
| 1.592098755 | -7.74 |
| 1.592223022 | -7.806 |
| 1.592347168 | -7.768 |
| 1.592471436 | -7.803 |
| 1.592595703 | -7.765 |
| 1.592719971 | -7.773 |
| 1.5928442379999999 | -7.761 |
| 1.5929685059999998 | -7.745 |
| 1.5930927730000002 | -7.749 |
| 1.593217163 | -7.717 |
| 1.593341553 | -7.764 |
| 1.593466064 | -7.721 |
| 1.5935904539999999 | -7.767 |
| 1.5937148440000002 | -7.725 |
| 1.593839233 | -7.777 |
| 1.593963745 | -7.729 |
| 1.594088135 | -7.751 |
| 1.594212646 | -7.715 |
| 1.594337158 | -7.719 |
| 1.5944616699999998 | -7.719 |
| 1.594586304 | -7.695 |
| 1.594710815 | -7.715 |
| 1.5948354489999998 | -7.694 |
| 1.594960083 | -7.745 |
| 1.595084717 | -7.696 |
| 1.595209351 | -7.743 |
| 1.595333984 | -7.686 |
| 1.5954586179999999 | -7.723 |
| 1.595583374 | -7.68 |
| 1.59570813 | -7.688 |
| 1.595832886 | -7.663 |
| 1.595957764 | -7.667 |
| 1.59608252 | -7.68 |
| 1.596207275 | -7.653 |
| 1.596332153 | -7.687 |
| 1.596457031 | -7.654 |
| 1.596581909 | -7.7 |
| 1.596706787 | -7.636 |
| 1.5968316649999998 | -7.667 |
| 1.5969565430000001 | -7.611 |
| 1.597081543 | -7.647 |
| 1.597206421 | -7.615 |
| 1.597331421 | -7.618 |
| 1.5974564210000002 | -7.622 |
| 1.5975814210000001 | -7.63 |
| 1.597706543 | -7.651 |
| 1.597831543 | -7.616 |
| 1.5979566649999999 | -7.654 |
| 1.5980817870000001 | -7.602 |
| 1.598206909 | -7.643 |
| 1.598332031 | -7.579 |
| 1.598457153 | -7.609 |
| 1.59858252 | -7.573 |
| 1.5987076420000002 | -7.61 |
| 1.5988328859999998 | -7.583 |
| 1.59895813 | -7.588 |
| 1.599083496 | -7.599 |
| 1.5992087400000001 | -7.584 |
| 1.599334106 | -7.605 |
| 1.599459351 | -7.554 |
| 1.599584717 | -7.587 |
| 1.599710083 | -7.536 |
| 1.599835449 | -7.58 |
| 1.599960815 | -7.519 |
| 1.600086182 | -7.564 |
| 1.60021167 | -7.547 |
| 1.600337158 | -7.575 |
| 1.600462646 | -7.555 |
| 1.600588135 | -7.552 |
| 1.600713623 | -7.563 |
| 1.600839111 | -7.527 |
| 1.6009647219999998 | -7.548 |
| 1.601090332 | -7.489 |
| 1.601215942 | -7.538 |
| 1.601341553 | -7.496 |
| 1.6014671630000001 | -7.541 |
| 1.601592896 | -7.493 |
| 1.6017185059999999 | -7.541 |
| 1.601844238 | -7.516 |
| 1.601969849 | -7.522 |
| 1.602095581 | -7.511 |
| 1.602221436 | -7.489 |
| 1.602347168 | -7.507 |
| 1.6024729 | -7.472 |
| 1.602598755 | -7.499 |
| 1.602724609 | -7.452 |
| 1.602850464 | -7.513 |
| 1.602976318 | -7.471 |
| 1.603102173 | -7.513 |
| 1.603228027 | -7.475 |
| 1.603354004 | -7.505 |
| 1.6034799800000001 | -7.48 |
| 1.603606079 | -7.476 |
| 1.6037320560000001 | -7.47 |
| 1.603858032 | -7.452 |
| 1.603984009 | -7.487 |
| 1.604110107 | -7.453 |
| 1.6042360839999998 | -7.497 |
| 1.6043621829999999 | -7.461 |
| 1.6044882809999998 | -7.519 |
| 1.604614502 | -7.468 |
| 1.604740601 | -7.504 |
| 1.604866699 | -7.458 |
| 1.60499292 | -7.472 |
| 1.6051191409999999 | -7.459 |
| 1.605245361 | -7.453 |
| 1.605371582 | -7.468 |
| 1.6054979249999999 | -7.455 |
| 1.605624146 | -7.501 |
| 1.605750488 | -7.459 |
| 1.605876709 | -7.511 |
| 1.606003052 | -7.462 |
| 1.606129517 | -7.505 |
| 1.606255981 | -7.455 |
| 1.606382324 | -7.475 |
| 1.606508789 | -7.444 |
| 1.606635254 | -7.462 |
| 1.606761719 | -7.468 |
| 1.606888184 | -7.458 |
| 1.607014648 | -7.492 |
| 1.607141235 | -7.476 |
| 1.6072677000000002 | -7.523 |
| 1.607394287 | -7.474 |
| 1.607520874 | -7.517 |
| 1.607647461 | -7.462 |
| 1.607774048 | -7.504 |
| 1.6079007570000001 | -7.463 |
| 1.6080273440000001 | -7.486 |
| 1.608154053 | -7.484 |
| 1.6082807620000001 | -7.503 |
| 1.608407471 | -7.515 |
| 1.608534302 | -7.497 |
| 1.608661011 | -7.54 |
| 1.608787964 | -7.499 |
| 1.608914673 | -7.541 |
| 1.6090415040000001 | -7.481 |
| 1.6091683350000001 | -7.521 |
| 1.609295166 | -7.48 |
| 1.609422119 | -7.522 |
| 1.6095489500000002 | -7.494 |
| 1.609675903 | -7.522 |
| 1.609802856 | -7.533 |
| 1.6099298100000001 | -7.535 |
| 1.610056763 | -7.554 |
| 1.610183838 | -7.52 |
| 1.610310791 | -7.554 |
| 1.610437866 | -7.51 |
| 1.610564941 | -7.554 |
| 1.610692017 | -7.5 |
| 1.610819092 | -7.552 |
| 1.610946167 | -7.53 |
| 1.6110733640000001 | -7.574 |
| 1.611200562 | -7.554 |
| 1.611327881 | -7.576 |
| 1.6114550779999999 | -7.585 |
| 1.611582275 | -7.569 |
| 1.611709473 | -7.585 |
| 1.611836792 | -7.54 |
| 1.6119639890000002 | -7.587 |
| 1.612091309 | -7.551 |
| 1.6122186280000002 | -7.596 |
| 1.6123459470000001 | -7.551 |
| 1.612473389 | -7.616 |
| 1.612600708 | -7.597 |
| 1.612728149 | -7.625 |
| 1.612855591 | -7.609 |
| 1.612983032 | -7.606 |
| 1.613110474 | -7.617 |
| 1.613237915 | -7.597 |
| 1.613365479 | -7.619 |
| 1.6134929199999999 | -7.585 |
| 1.6136204829999998 | -7.646 |
| 1.613748047 | -7.608 |
| 1.613875732 | -7.659 |
| 1.614003418 | -7.626 |
| 1.614130981 | -7.673 |
| 1.614258667 | -7.644 |
| 1.614386353 | -7.655 |
| 1.614514038 | -7.636 |
| 1.6146417240000002 | -7.634 |
| 1.614769409 | -7.665 |
| 1.614897217 | -7.642 |
| 1.615024902 | -7.68 |
| 1.61515271 | -7.652 |
| 1.615280518 | -7.717 |
| 1.6154083250000002 | -7.673 |
| 1.615536255 | -7.722 |
| 1.6156640629999999 | -7.681 |
| 1.615791992 | -7.714 |
| 1.6159198 | -7.691 |
| 1.616047729 | -7.692 |
| 1.616175781 | -7.691 |
| 1.616303711 | -7.69 |
| 1.616431641 | -7.729 |
| 1.616559814 | -7.698 |
| 1.616687866 | -7.751 |
| 1.616815918 | -7.716 |
| 1.6169439700000001 | -7.766 |
| 1.617072021 | -7.711 |
| 1.617200195 | -7.747 |
| 1.6173282469999999 | -7.711 |
| 1.6174564210000002 | -7.747 |
| 1.617584595 | -7.736 |
| 1.617712769 | -7.743 |
| 1.617841064 | -7.766 |
| 1.617969238 | -7.766 |
| 1.618097534 | -7.805 |
| 1.618225708 | -7.765 |
| 1.618354004 | -7.815 |
| 1.618482422 | -7.762 |
| 1.618610718 | -7.81 |
| 1.618739014 | -7.762 |
| 1.618867432 | -7.8 |
| 1.6189958500000001 | -7.782 |
| 1.6191243899999999 | -7.818 |
| 1.619252808 | -7.82 |
| 1.619381226 | -7.828 |
| 1.619509766 | -7.866 |
| 1.6196381839999998 | -7.84 |
| 1.619766724 | -7.877 |
| 1.619895264 | -7.825 |
| 1.620023804 | -7.867 |
| 1.620152466 | -7.83 |
| 1.620281006 | -7.886 |
| 1.620409668 | -7.849 |
| 1.620538208 | -7.893 |
| 1.62066687 | -7.896 |
| 1.620795654 | -7.924 |
| 1.6209243160000002 | -7.936 |
| 1.6210529790000001 | -7.927 |
| 1.621181763 | -7.958 |
| 1.621310547 | -7.924 |
| 1.621439331 | -7.967 |
| 1.621568115 | -7.917 |
| 1.621697021 | -7.979 |
| 1.621825928 | -7.953 |
| 1.621954712 | -8.008 |
| 1.6220836179999998 | -7.989 |
| 1.622212524 | -8.039 |
| 1.6223414310000002 | -8.04 |
| 1.6224704589999999 | -8.038 |
| 1.6225993650000001 | -8.055 |
| 1.622728394 | -8.026 |
| 1.622857422 | -8.069 |
| 1.6229864500000002 | -8.036 |
| 1.623115479 | -8.085 |
| 1.6232445070000001 | -8.051 |
| 1.6233736570000001 | -8.126 |
| 1.6235026860000001 | -8.101 |
| 1.623631836 | -8.149 |
| 1.623760986 | -8.141 |
| 1.623890137 | -8.158 |
| 1.624019409 | -8.157 |
| 1.62414856 | -8.147 |
| 1.624277832 | -8.169 |
| 1.6244072269999998 | -8.147 |
| 1.624536499 | -8.204 |
| 1.6246657709999999 | -8.171 |
| 1.6247950439999999 | -8.235 |
| 1.624924438 | -8.214 |
| 1.625053711 | -8.278 |
| 1.625183105 | -8.249 |
| 1.6253125 | -8.286 |
| 1.6254420170000001 | -8.27 |
| 1.625571411 | -8.279 |
| 1.625700806 | -8.302 |
| 1.625830322 | -8.29 |
| 1.625959839 | -8.329 |
| 1.626089355 | -8.317 |
| 1.626218872 | -8.388 |
| 1.626348511 | -8.354 |
| 1.626478027 | -8.418 |
| 1.6266076660000002 | -8.379 |
| 1.626737305 | -8.424 |
| 1.626866943 | -8.4 |
| 1.626996704 | -8.419 |
| 1.6271263429999998 | -8.416 |
| 1.627256104 | -8.433 |
| 1.627385864 | -8.464 |
| 1.627515625 | -8.45 |
| 1.627645386 | -8.509 |
| 1.6277751459999998 | -8.494 |
| 1.627904907 | -8.554 |
| 1.6280347899999998 | -8.509 |
| 1.628164673 | -8.559 |
| 1.628294556 | -8.52 |
| 1.628424438 | -8.567 |
| 1.628554321 | -8.548 |
| 1.6286842039999998 | -8.569 |
| 1.628814209 | -8.593 |
| 1.6289442140000001 | -8.616 |
| 1.629074219 | -8.654 |
| 1.629204224 | -8.638 |
| 1.6293342290000001 | -8.696 |
| 1.629464355 | -8.653 |
| 1.629594482 | -8.71 |
| 1.6297246090000002 | -8.662 |
| 1.629854736 | -8.708 |
| 1.629984863 | -8.694 |
| 1.63011499 | -8.742 |
| 1.6302452390000002 | -8.735 |
| 1.630375366 | -8.761 |
| 1.6305056150000001 | -8.797 |
| 1.630635864 | -8.794 |
| 1.630766113 | -8.835 |
| 1.6308964840000002 | -8.797 |
| 1.631026733 | -8.844 |
| 1.631157104 | -8.809 |
| 1.631287476 | -8.86 |
| 1.631417847 | -8.82 |
| 1.6315482179999998 | -8.882 |
| 1.631678589 | -8.885 |
| 1.631809082 | -8.932 |
| 1.631939453 | -8.941 |
| 1.632069946 | -8.958 |
| 1.632200439 | -8.99 |
| 1.632331177 | -8.971 |
| 1.6324616699999999 | -9.012 |
| 1.632592163 | -8.965 |
| 1.632722778 | -9.028 |
| 1.632853394 | -9 |
| 1.632984009 | -9.057 |
| 1.633114624 | -9.032 |
| 1.633245361 | -9.099 |
| 1.6333759769999998 | -9.097 |
| 1.6335067140000001 | -9.121 |
| 1.633637451 | -9.133 |
| 1.633768188 | -9.122 |
| 1.633898926 | -9.162 |
| 1.6340297849999998 | -9.139 |
| 1.634160522 | -9.184 |
| 1.634291382 | -9.159 |
| 1.634422241 | -9.243 |
| 1.634553101 | -9.223 |
| 1.63468396 | -9.283 |
| 1.6348149410000001 | -9.267 |
| 1.634946045 | -9.314 |
| 1.635076904 | -9.309 |
| 1.6352078859999999 | -9.315 |
| 1.635338867 | -9.323 |
| 1.635469971 | -9.315 |
| 1.635600952 | -9.373 |
| 1.6357320560000002 | -9.346 |
| 1.635863159 | -9.408 |
| 1.635994263 | -9.394 |
| 1.636125366 | -9.475 |
| 1.63625647 | -9.443 |
| 1.6363876949999998 | -9.495 |
| 1.6365189210000002 | -9.473 |
| 1.636650024 | -9.5 |
| 1.63678125 | -9.506 |
| 1.6369125979999999 | -9.502 |
| 1.637043823 | -9.535 |
| 1.637175171 | -9.537 |
| 1.637306396 | -9.608 |
| 1.637437744 | -9.579 |
| 1.637569214 | -9.652 |
| 1.637700684 | -9.627 |
| 1.6378320309999999 | -9.687 |
| 1.637963501 | -9.654 |
| 1.638094849 | -9.687 |
| 1.638226318 | -9.672 |
| 1.638357788 | -9.703 |
| 1.63848938 | -9.722 |
| 1.6386208500000001 | -9.722 |
| 1.638752441 | -9.775 |
| 1.638884033 | -9.776 |
| 1.639015503 | -9.835 |
| 1.6391472169999999 | -9.801 |
| 1.639278809 | -9.863 |
| 1.6394104 | -9.822 |
| 1.6395421140000002 | -9.875 |
| 1.639673828 | -9.85 |
| 1.639805542 | -9.883 |
| 1.6399372559999998 | -9.892 |
| 1.640069092 | -9.931 |
| 1.640200928 | -9.959 |
| 1.640332764 | -9.962 |
| 1.6404646 | -10.025 |
| 1.640596436 | -10.002 |
| 1.640728271 | -10.056 |
| 1.640860107 | -10.011 |
| 1.6409920649999998 | -10.063 |
| 1.6411240230000002 | -10.038 |
| 1.641255981 | -10.102 |
| 1.641387939 | -10.086 |
| 1.641519897 | -10.13 |
| 1.641651855 | -10.164 |
| 1.641783936 | -10.185 |
| 1.641916016 | -10.221 |
| 1.642048096 | -10.212 |
| 1.642180176 | -10.26 |
| 1.6423122559999999 | -10.226 |
| 1.642444458 | -10.29 |
| 1.642576538 | -10.249 |
| 1.64270874 | -10.324 |
| 1.642840942 | -10.322 |
| 1.642973389 | -10.378 |
| 1.643105591 | -10.38 |
| 1.643237793 | -10.428 |
| 1.643370117 | -10.456 |
| 1.643502441 | -10.454 |
| 1.643634766 | -10.488 |
| 1.64376709 | -10.448 |
| 1.643899536 | -10.503 |
| 1.6440318600000001 | -10.477 |
| 1.644164307 | -10.54 |
| 1.644296753 | -10.518 |
| 1.644429199 | -10.593 |
| 1.644561646 | -10.586 |
| 1.644694214 | -10.628 |
| 1.6448266599999999 | -10.635 |
| 1.6449592290000001 | -10.648 |
| 1.645091797 | -10.678 |
| 1.645224365 | -10.665 |
| 1.6453570560000002 | -10.71 |
| 1.645489624 | -10.685 |
| 1.6456224369999999 | -10.767 |
| 1.645755127 | -10.75 |
| 1.645887817 | -10.822 |
| 1.646020508 | -10.817 |
| 1.646153198 | -10.888 |
| 1.646286011 | -10.878 |
| 1.6464188229999999 | -10.901 |
| 1.6465516359999999 | -10.905 |
| 1.646684448 | -10.905 |
| 1.6468172609999998 | -10.952 |
| 1.646950073 | -10.939 |
| 1.647083008 | -10.999 |
| 1.647215942 | -10.99 |
| 1.647348877 | -11.08 |
| 1.647481812 | -11.052 |
| 1.647614746 | -11.122 |
| 1.647747803 | -11.1 |
| 1.647880737 | -11.141 |
| 1.648013794 | -11.135 |
| 1.648146851 | -11.149 |
| 1.648280029 | -11.173 |
| 1.648413208 | -11.192 |
| 1.648546265 | -11.253 |
| 1.648679443 | -11.245 |
| 1.648812622 | -11.332 |
| 1.648945801 | -11.324 |
| 1.649078979 | -11.396 |
| 1.64921228 | -11.364 |
| 1.6493454589999998 | -11.416 |
| 1.64947876 | -11.393 |
| 1.649612061 | -11.439 |
| 1.649745361 | -11.447 |
| 1.649878784 | -11.468 |
| 1.650012085 | -11.504 |
| 1.650145508 | -11.521 |
| 1.6502789310000001 | -11.586 |
| 1.650412354 | -11.573 |
| 1.650545776 | -11.654 |
| 1.6506791989999998 | -11.619 |
| 1.650812744 | -11.684 |
| 1.650946289 | -11.65 |
| 1.651079834 | -11.697 |
| 1.651213379 | -11.704 |
| 1.6513470460000002 | -11.761 |
| 1.651480591 | -11.784 |
| 1.6516142580000002 | -11.812 |
| 1.651747925 | -11.888 |
| 1.65188147 | -11.882 |
| 1.6520152590000001 | -11.935 |
| 1.6521489260000002 | -11.9 |
| 1.6522825929999998 | -11.955 |
| 1.6524163820000002 | -11.924 |
| 1.6525501710000001 | -11.983 |
| 1.65268396 | -11.959 |
| 1.652817749 | -12.018 |
| 1.65295166 | -12.039 |
| 1.653085449 | -12.074 |
| 1.65321936 | -12.108 |
| 1.6533532709999998 | -12.128 |
| 1.653487183 | -12.182 |
| 1.653621094 | -12.163 |
| 1.653755249 | -12.235 |
| 1.6538891599999999 | -12.193 |
| 1.654023193 | -12.27 |
| 1.654157227 | -12.256 |
| 1.65429126 | -12.324 |
| 1.654425415 | -12.323 |
| 1.6545594479999999 | -12.393 |
| 1.654693604 | -12.416 |
| 1.654827759 | -12.424 |
| 1.654961914 | -12.453 |
| 1.6550960689999998 | -12.42 |
| 1.655230225 | -12.476 |
| 1.6553645019999998 | -12.451 |
| 1.655498779 | -12.509 |
| 1.655633057 | -12.488 |
| 1.6557673339999999 | -12.582 |
| 1.655901611 | -12.569 |
| 1.6560360109999999 | -12.64 |
| 1.656170288 | -12.655 |
| 1.6563046879999999 | -12.701 |
| 1.656439209 | -12.733 |
| 1.656573608 | -12.743 |
| 1.65670813 | -12.777 |
| 1.656842529 | -12.767 |
| 1.6569770510000001 | -12.833 |
| 1.657111572 | -12.81 |
| 1.657246094 | -12.892 |
| 1.6573806150000001 | -12.887 |
| 1.657515259 | -12.976 |
| 1.65764978 | -12.954 |
| 1.657784424 | -12.993 |
| 1.6579190670000001 | -12.995 |
| 1.658053711 | -13.008 |
| 1.658188477 | -13.039 |
| 1.65832312 | -13.036 |
| 1.6584578859999999 | -13.085 |
| 1.658592651 | -13.09 |
| 1.6587274170000001 | -13.166 |
| 1.6588621829999999 | -13.142 |
| 1.658996948 | -13.228 |
| 1.659131958 | -13.221 |
| 1.659266846 | -13.282 |
| 1.659401733 | -13.28 |
| 1.659536621 | -13.304 |
| 1.659671509 | -13.321 |
| 1.659806519 | -13.348 |
| 1.659941406 | -13.391 |
| 1.660076416 | -13.392 |
| 1.660211426 | -13.47 |
| 1.660346436 | -13.467 |
| 1.660481567 | -13.546 |
| 1.660616577 | -13.516 |
| 1.660751709 | -13.574 |
| 1.660886841 | -13.561 |
| 1.661021973 | -13.616 |
| 1.661157227 | -13.615 |
| 1.6612923579999999 | -13.635 |
| 1.661427612 | -13.682 |
| 1.661562744 | -13.72 |
| 1.6616979980000002 | -13.783 |
| 1.661833374 | -13.773 |
| 1.66196875 | -13.845 |
| 1.662104126 | -13.827 |
| 1.66223938 | -13.889 |
| 1.662374756 | -13.85 |
| 1.6625101320000002 | -13.891 |
| 1.6626456299999999 | -13.88 |
| 1.662781006 | -13.925 |
| 1.662916504 | -13.927 |
| 1.663052002 | -13.961 |
| 1.6631875 | -14.017 |
| 1.6633229980000002 | -14.031 |
| 1.663458496 | -14.073 |
| 1.663594116 | -14.054 |
| 1.6637296140000002 | -14.108 |
| 1.6638652340000002 | -14.089 |
| 1.664000854 | -14.155 |
| 1.664136597 | -14.132 |
| 1.664272217 | -14.193 |
| 1.6644079589999998 | -14.21 |
| 1.6645437010000002 | -14.27 |
| 1.664679565 | -14.29 |
| 1.6648153079999999 | -14.326 |
| 1.66495105 | -14.383 |
| 1.665086914 | -14.372 |
| 1.665222778 | -14.415 |
| 1.6653585210000001 | -14.383 |
| 1.665494507 | -14.434 |
| 1.665630371 | -14.413 |
| 1.665766235 | -14.467 |
| 1.665902222 | -14.447 |
| 1.666038208 | -14.519 |
| 1.6661741939999999 | -14.543 |
| 1.666310181 | -14.576 |
| 1.6664461670000001 | -14.6 |
| 1.666582275 | -14.622 |
| 1.666718262 | -14.68 |
| 1.66685437 | -14.678 |
| 1.666990479 | -14.747 |
| 1.667126709 | -14.744 |
| 1.6672628170000001 | -14.851 |
| 1.66739917 | -14.848 |
| 1.6675354 | -14.917 |
| 1.667671631 | -14.912 |
| 1.667807861 | -14.971 |
| 1.667944092 | -14.97 |
| 1.6680804439999999 | -14.983 |
| 1.6682166749999998 | -15.005 |
| 1.6683530270000002 | -14.987 |
| 1.66848938 | -15.044 |
| 1.6686258539999999 | -15.018 |
| 1.6687622069999999 | -15.085 |
| 1.668898682 | -15.079 |
| 1.6690351559999999 | -15.18 |
| 1.669171631 | -15.185 |
| 1.669308105 | -15.263 |
| 1.6694445800000002 | -15.258 |
| 1.669581177 | -15.29 |
| 1.669717651 | -15.326 |
| 1.669854248 | -15.336 |
| 1.669990967 | -15.37 |
| 1.670127686 | -15.401 |
| 1.670264282 | -15.466 |
| 1.6704010009999999 | -15.439 |
| 1.67053772 | -15.516 |
| 1.670674438 | -15.502 |
| 1.6708111570000002 | -15.566 |
| 1.670947876 | -15.546 |
| 1.671084717 | -15.582 |
| 1.671221558 | -15.586 |
| 1.6713583980000002 | -15.629 |
| 1.6714952390000002 | -15.656 |
| 1.6716320800000002 | -15.679 |
| 1.671769043 | -15.748 |
| 1.671905884 | -15.753 |
| 1.672042847 | -15.819 |
| 1.67217981 | -15.808 |
| 1.6723167719999998 | -15.914 |
| 1.672453857 | -15.893 |
| 1.67259082 | -15.946 |
| 1.672727905 | -15.935 |
| 1.67286499 | -15.964 |
| 1.673002197 | -15.99 |
| 1.673139404 | -16.028 |
| 1.673276489 | -16.09 |
| 1.6734136960000001 | -16.121 |
| 1.673550903 | -16.231 |
| 1.67368811 | -16.215 |
| 1.6738253170000001 | -16.283 |
| 1.673962524 | -16.243 |
| 1.674099854 | -16.309 |
| 1.674237183 | -16.294 |
| 1.6743745120000002 | -16.352 |
| 1.674511841 | -16.356 |
| 1.67464917 | -16.398 |
| 1.674786621 | -16.434 |
| 1.674924072 | -16.434 |
| 1.675061523 | -16.483 |
| 1.675198975 | -16.493 |
| 1.675336426 | -16.577 |
| 1.675473877 | -16.531 |
| 1.6756114500000001 | -16.597 |
| 1.675749146 | -16.588 |
| 1.6758867190000002 | -16.655 |
| 1.6760242920000001 | -16.656 |
| 1.676161987 | -16.704 |
| 1.676299561 | -16.724 |
| 1.676437256 | -16.774 |
| 1.676574951 | -16.806 |
| 1.676712646 | -16.821 |
| 1.676850342 | -16.898 |
| 1.676988159 | -16.858 |
| 1.6771258539999998 | -16.929 |
| 1.677263672 | -16.927 |
| 1.6774014890000002 | -17.037 |
| 1.6775394289999999 | -17.037 |
| 1.677677246 | -17.142 |
| 1.6778151860000001 | -17.131 |
| 1.677953003 | -17.202 |
| 1.678090942 | -17.224 |
| 1.678229004 | -17.256 |
| 1.678366943 | -17.301 |
| 1.678505127 | -17.302 |
| 1.678643066 | -17.326 |
| 1.678781128 | -17.284 |
| 1.678919189 | -17.373 |
| 1.679057373 | -17.352 |
| 1.679195435 | -17.442 |
| 1.6793336179999998 | -17.457 |
| 1.6794718020000001 | -17.532 |
| 1.6796099850000001 | -17.515 |
| 1.679748169 | -17.564 |
| 1.679886353 | -17.562 |
| 1.680024658 | -17.612 |
| 1.6801629640000002 | -17.667 |
| 1.68030127 | -17.644 |
| 1.680439575 | -17.698 |
| 1.6805778809999998 | -17.688 |
| 1.680716309 | -17.758 |
| 1.680854614 | -17.773 |
| 1.680993042 | -17.866 |
| 1.68113147 | -17.871 |
| 1.681270142 | -17.926 |
| 1.681408569 | -17.921 |
| 1.681547119 | -17.935 |
| 1.681685669 | -17.976 |
| 1.6818242190000001 | -17.986 |
| 1.681962769 | -18.057 |
| 1.682101318 | -18.061 |
| 1.68223999 | -18.131 |
| 1.682378662 | -18.126 |
| 1.682517334 | -18.223 |
| 1.682656006 | -18.197 |
| 1.682794678 | -18.269 |
| 1.68293335 | -18.265 |
| 1.683072144 | -18.327 |
| 1.683210938 | -18.363 |
| 1.683349731 | -18.379 |
| 1.683488525 | -18.415 |
| 1.683627441 | -18.388 |
| 1.683766235 | -18.445 |
| 1.6839051509999998 | -18.407 |
| 1.684044067 | -18.481 |
| 1.6841832280000002 | -18.45 |
| 1.684322144 | -18.505 |
| 1.684461182 | -18.484 |
| 1.684600098 | -18.546 |
| 1.684739136 | -18.548 |
| 1.6848781739999998 | -18.593 |
| 1.6850173339999999 | -18.644 |
| 1.685156372 | -18.672 |
| 1.685295532 | -18.743 |
| 1.685434692 | -18.76 |
| 1.6855738530000002 | -18.801 |
| 1.685713013 | -18.779 |
| 1.685852295 | -18.813 |
| 1.6859914550000001 | -18.762 |
| 1.686130737 | -18.811 |
| 1.68627002 | -18.792 |
| 1.686409302 | -18.805 |
| 1.686548706 | -18.854 |
| 1.6866879879999999 | -18.885 |
| 1.686827393 | -18.924 |
| 1.686966919 | -18.945 |
| 1.687106323 | -19.036 |
| 1.68724585 | -19.037 |
| 1.687385254 | -19.117 |
| 1.68752478 | -19.137 |
| 1.687664307 | -19.201 |
| 1.687803833 | -19.227 |
| 1.6879433590000001 | -19.258 |
| 1.688083008 | -19.251 |
| 1.688222656 | -19.287 |
| 1.688362183 | -19.317 |
| 1.688501831 | -19.31 |
| 1.688641602 | -19.345 |
| 1.68878125 | -19.328 |
| 1.688921021 | -19.335 |
| 1.6890607910000002 | -19.312 |
| 1.689200562 | -19.395 |
| 1.689340332 | -19.362 |
| 1.6894801030000002 | -19.476 |
| 1.689619995 | -19.464 |
| 1.6897600099999999 | -19.495 |
| 1.68989978 | -19.499 |
| 1.690039795 | -19.499 |
| 1.690179688 | -19.542 |
| 1.6903195800000002 | -19.581 |
| 1.690459595 | -19.645 |
| 1.6905996090000002 | -19.601 |
| 1.690739624 | -19.679 |
| 1.690879639 | -19.627 |
| 1.691019775 | -19.684 |
| 1.69115979 | -19.671 |
| 1.691299927 | -19.716 |
| 1.691440063 | -19.75 |
| 1.691580322 | -19.77 |
| 1.691720459 | -19.759 |
| 1.6918607179999998 | -19.756 |
| 1.692000854 | -19.761 |
| 1.692141113 | -19.717 |
| 1.6922814940000002 | -19.773 |
| 1.692421753 | -19.762 |
| 1.692562256 | -19.828 |
| 1.692702515 | -19.818 |
| 1.6928428960000002 | -19.872 |
| 1.6929832759999999 | -19.843 |
| 1.693123779 | -19.901 |
| 1.69326416 | -19.906 |
| 1.693404663 | -19.979 |
| 1.693545166 | -20.045 |
| 1.693685669 | -20.05 |
| 1.693826172 | -20.085 |
| 1.693966797 | -20.076 |
| 1.6941073 | -20.15 |
| 1.694247925 | -20.085 |
| 1.69438855 | -20.158 |
| 1.694529175 | -20.09 |
| 1.694669922 | -20.134 |
| 1.6948105470000001 | -20.066 |
| 1.694951294 | -20.106 |
| 1.695092041 | -20.088 |
| 1.695232788 | -20.116 |
| 1.6953736570000002 | -20.166 |
| 1.695514648 | -20.158 |
| 1.695655396 | -20.23 |
| 1.695796265 | -20.208 |
| 1.695937134 | -20.258 |
| 1.696078125 | -20.281 |
| 1.696218994 | -20.369 |
| 1.696359985 | -20.248 |
| 1.696500977 | -20.323 |
| 1.696641968 | -20.318 |
| 1.6967829589999999 | -20.348 |
| 1.696924072 | -20.333 |
| 1.697065063 | -20.366 |
| 1.697206177 | -20.344 |
| 1.69734729 | -20.352 |
| 1.697488525 | -20.349 |
| 1.697629639 | -20.304 |
| 1.6977708740000002 | -20.399 |
| 1.697912109 | -20.366 |
| 1.698053345 | -20.426 |
| 1.69819458 | -20.41 |
| 1.698335938 | -20.44 |
| 1.698477295 | -20.393 |
| 1.6986186520000002 | -20.432 |
| 1.69876001 | -20.44 |
| 1.698901367 | -20.426 |
| 1.699042725 | -20.44 |
| 1.6991842039999998 | -20.449 |
| 1.699325684 | -20.463 |
| 1.699467163 | -20.373 |
| 1.699608643 | -20.395 |
| 1.699750122 | -20.391 |
| 1.699891724 | -20.454 |
| 1.700033203 | -20.442 |
| 1.700174805 | -20.499 |
| 1.700316406 | -20.442 |
| 1.70045813 | -20.487 |
| 1.700599731 | -20.496 |
| 1.7007414550000002 | -20.501 |
| 1.7008831789999999 | -20.609 |
| 1.7010249020000001 | -20.615 |
| 1.7011667480000001 | -20.677 |
| 1.7013085940000001 | -20.688 |
| 1.701450317 | -20.764 |
| 1.701592163 | -20.706 |
| 1.701734009 | -20.824 |
| 1.7018758539999999 | -20.784 |
| 1.702017822 | -20.839 |
| 1.7021597899999998 | -20.848 |
| 1.7023016359999998 | -20.83 |
| 1.702443604 | -20.834 |
| 1.702585693 | -20.78 |
| 1.702727661 | -20.794 |
| 1.702869751 | -20.746 |
| 1.703011719 | -20.863 |
| 1.703153809 | -20.787 |
| 1.703296021 | -20.813 |
| 1.70343811 | -20.752 |
| 1.7035802000000002 | -20.774 |
| 1.703722412 | -20.747 |
| 1.703864624 | -20.74 |
| 1.70400708 | -20.775 |
| 1.704149292 | -20.797 |
| 1.704291504 | -20.847 |
| 1.704433838 | -20.774 |
| 1.7045761720000001 | -20.841 |
| 1.7047185059999999 | -20.8 |
| 1.704860962 | -20.845 |
| 1.7050032960000001 | -20.784 |
| 1.705145752 | -20.832 |
| 1.705288208 | -20.837 |
| 1.7054306639999999 | -20.895 |
| 1.70557312 | -20.882 |
| 1.705715698 | -20.877 |
| 1.705858154 | -20.901 |
| 1.706000732 | -20.827 |
| 1.706143311 | -20.871 |
| 1.706285889 | -20.794 |
| 1.7064285890000002 | -20.858 |
| 1.706571289 | -20.789 |
| 1.706713867 | -20.803 |
| 1.706856812 | -20.746 |
| 1.706999512 | -20.724 |
| 1.707142212 | -20.688 |
| 1.707285034 | -20.75 |
| 1.707427856 | -20.846 |
| 1.707570679 | -20.896 |
| 1.707713501 | -20.932 |
| 1.707856323 | -20.851 |
| 1.707999268 | -20.87 |
| 1.708142212 | -20.837 |
| 1.7082851559999999 | -20.863 |
| 1.708428101 | -20.824 |
| 1.7085711670000001 | -20.895 |
| 1.708714111 | -20.823 |
| 1.708857178 | -20.828 |
| 1.709000244 | -20.766 |
| 1.709143311 | -20.784 |
| 1.709286377 | -20.843 |
| 1.709429565 | -20.836 |
| 1.709572754 | -20.851 |
| 1.709715942 | -20.794 |
| 1.709859253 | -20.847 |
| 1.710002563 | -20.834 |
| 1.7101457519999999 | -20.918 |
| 1.7102890629999998 | -20.92 |
| 1.7104323730000002 | -20.991 |
| 1.710575684 | -20.995 |
| 1.710718994 | -20.983 |
| 1.7108624270000001 | -20.939 |
| 1.7110058590000001 | -20.95 |
| 1.711149292 | -20.94 |
| 1.711292725 | -20.896 |
| 1.711436157 | -20.862 |
| 1.711579712 | -20.803 |
| 1.711723145 | -20.805 |
| 1.711866699 | -20.756 |
| 1.712010254 | -20.819 |
| 1.712153931 | -20.807 |
| 1.7122974850000001 | -20.872 |
| 1.7124411620000002 | -20.878 |
| 1.712584839 | -20.924 |
| 1.712728638 | -20.955 |
| 1.712872314 | -20.965 |
| 1.713016113 | -20.903 |
| 1.713159912 | -20.869 |
| 1.7133035890000001 | -20.909 |
| 1.71344751 | -20.864 |
| 1.713591309 | -20.908 |
| 1.713735107 | -20.927 |
| 1.713879028 | -20.897 |
| 1.7140229489999999 | -20.84 |
| 1.7141668700000001 | -20.808 |
| 1.7143107910000002 | -20.758 |
| 1.7144548339999999 | -20.833 |
| 1.714598755 | -20.85 |
| 1.714742798 | -20.778 |
| 1.714886841 | -20.784 |
| 1.715031006 | -20.768 |
| 1.715175049 | -20.761 |
| 1.7153192140000002 | -20.762 |
| 1.715463379 | -20.779 |
| 1.7156076660000001 | -20.74 |
| 1.715751831 | -20.737 |
| 1.7158961179999999 | -20.695 |
| 1.716040283 | -20.7 |
| 1.7161845699999998 | -20.691 |
| 1.716328857 | -20.682 |
| 1.716473267 | -20.715 |
| 1.716617554 | -20.716 |
| 1.716761963 | -20.748 |
| 1.716906372 | -20.762 |
| 1.717050781 | -20.821 |
| 1.71719519 | -20.813 |
| 1.7173396 | -20.816 |
| 1.717484131 | -20.731 |
| 1.717628662 | -20.824 |
| 1.717773193 | -20.776 |
| 1.717917725 | -20.762 |
| 1.7180623780000002 | -20.752 |
| 1.718206909 | -20.743 |
| 1.718351563 | -20.787 |
| 1.718496338 | -20.756 |
| 1.7186411129999999 | -20.842 |
| 1.7187857670000002 | -20.825 |
| 1.718930542 | -20.909 |
| 1.719075317 | -20.83 |
| 1.719220093 | -20.876 |
| 1.719364868 | -20.813 |
| 1.719509644 | -20.85 |
| 1.7196545410000001 | -20.837 |
| 1.719799438 | -20.827 |
| 1.719944336 | -20.802 |
| 1.720089233 | -20.78 |
| 1.720234253 | -20.787 |
| 1.72037915 | -20.714 |
| 1.72052417 | -20.763 |
| 1.7206691889999999 | -20.709 |
| 1.7208142089999998 | -20.768 |
| 1.7209593509999999 | -20.734 |
| 1.72110437 | -20.825 |
| 1.7212495120000002 | -20.778 |
| 1.7213946530000002 | -20.89 |
| 1.721540039 | -20.858 |
| 1.721685181 | -20.828 |
| 1.7218304439999998 | -20.858 |
| 1.721975708 | -20.826 |
| 1.722120972 | -20.859 |
| 1.722266235 | -20.842 |
| 1.7224114990000001 | -20.86 |
| 1.722556885 | -20.804 |
| 1.7227022710000002 | -20.872 |
| 1.722847656 | -20.824 |
| 1.7229930420000001 | -20.898 |
| 1.7231385499999998 | -20.898 |
| 1.723283936 | -20.965 |
| 1.723429443 | -20.944 |
| 1.723574951 | -20.985 |
| 1.723720581 | -20.99 |
| 1.7238660890000002 | -20.945 |
| 1.7240117190000002 | -20.906 |
| 1.7241573490000002 | -20.834 |
| 1.724302979 | -20.861 |
| 1.72444873 | -20.79 |
| 1.7245944819999999 | -20.877 |
| 1.7247401119999999 | -20.778 |
| 1.724885864 | -20.767 |
| 1.7250316159999999 | -20.719 |
| 1.72517749 | -20.671 |
| 1.725323242 | -20.694 |
| 1.725469116 | -20.702 |
| 1.72561499 | -20.745 |
| 1.7257608640000002 | -20.71 |
| 1.725906738 | -20.76 |
| 1.726052734 | -20.701 |
| 1.726198608 | -20.72 |
| 1.726344604 | -20.779 |
| 1.726490601 | -20.788 |
| 1.726636719 | -20.799 |
| 1.7267827150000001 | -20.836 |
| 1.7269288329999999 | -20.823 |
| 1.727074951 | -20.828 |
| 1.727221069 | -20.874 |
| 1.72736731 | -20.869 |
| 1.7275135499999998 | -20.892 |
| 1.727659668 | -20.909 |
| 1.7278059080000001 | -20.949 |
| 1.7279522710000002 | -20.89 |
| 1.728098511 | -20.912 |
| 1.7282447509999999 | -20.836 |
| 1.7283911129999998 | -20.85 |
| 1.728537476 | -20.829 |
| 1.728683838 | -20.783 |
| 1.728830322 | -20.798 |
| 1.7289766850000001 | -20.8 |
| 1.729123169 | -20.846 |
| 1.729269653 | -20.745 |
| 1.729416138 | -20.858 |
| 1.729562622 | -20.837 |
| 1.729709229 | -20.927 |
| 1.7298558350000002 | -20.914 |
| 1.7300024410000001 | -20.967 |
| 1.730149048 | -20.959 |
| 1.730295776 | -20.968 |
| 1.730442505 | -20.941 |
| 1.730589233 | -20.901 |
| 1.730735962 | -20.994 |
| 1.7308826899999998 | -20.953 |
| 1.731029419 | -20.985 |
| 1.73117627 | -20.913 |
| 1.73132312 | -20.911 |
| 1.7314699709999999 | -20.784 |
| 1.731616821 | -20.829 |
| 1.731763672 | -20.767 |
| 1.731910645 | -20.836 |
| 1.732057617 | -20.903 |
| 1.73220459 | -20.897 |
| 1.732351563 | -20.946 |
| 1.732498657 | -20.934 |
| 1.73264563 | -20.98 |
| 1.732792725 | -20.963 |
| 1.732939819 | -21.049 |
| 1.733086914 | -21 |
| 1.733234253 | -21.033 |
| 1.73338147 | -20.976 |
| 1.733528687 | -20.93 |
| 1.733675903 | -20.918 |
| 1.73382312 | -20.914 |
| 1.733970337 | -20.909 |
| 1.734117676 | -20.877 |
| 1.7342650149999999 | -20.944 |
| 1.734412354 | -20.953 |
| 1.734559692 | -21.01 |
| 1.734707153 | -20.994 |
| 1.734854614 | -20.981 |
| 1.7350020750000001 | -20.965 |
| 1.735149536 | -20.984 |
| 1.7352969969999998 | -20.945 |
| 1.73544458 | -20.968 |
| 1.735592041 | -20.932 |
| 1.735739624 | -20.919 |
| 1.735887207 | -20.872 |
| 1.736034912 | -20.797 |
| 1.736182495 | -20.794 |
| 1.736330322 | -20.762 |
| 1.7364780270000002 | -20.82 |
| 1.736625732 | -20.768 |
| 1.73677356 | -20.817 |
| 1.7369212649999999 | -20.783 |
| 1.737069092 | -20.85 |
| 1.737216919 | -20.776 |
| 1.7373648679999998 | -20.813 |
| 1.737512695 | -20.793 |
| 1.7376606449999998 | -20.786 |
| 1.737808472 | -20.789 |
| 1.737956421 | -20.727 |
| 1.738104492 | -20.727 |
| 1.738252441 | -20.658 |
| 1.738400513 | -20.725 |
| 1.738548584 | -20.682 |
| 1.738696655 | -20.774 |
| 1.7388447269999998 | -20.801 |
| 1.738992798 | -20.892 |
| 1.739140991 | -20.874 |
| 1.739289307 | -20.928 |
| 1.7394375 | -20.899 |
| 1.7395858149999999 | -20.928 |
| 1.739734009 | -20.923 |
| 1.7398823239999999 | -20.888 |
| 1.7400306399999999 | -20.897 |
| 1.7401789550000002 | -20.856 |
| 1.7403272710000002 | -20.82 |
| 1.740475708 | -20.721 |
| 1.740624146 | -20.737 |
| 1.740772583 | -20.696 |
| 1.7409210210000001 | -20.752 |
| 1.741069458 | -20.684 |
| 1.741218018 | -20.753 |
| 1.741366577 | -20.722 |
| 1.7415151370000002 | -20.792 |
| 1.741663696 | -20.807 |
| 1.741812256 | -20.831 |
| 1.7419609379999998 | -20.904 |
| 1.742109619 | -20.881 |
| 1.742258423 | -20.942 |
| 1.742407104 | -20.849 |
| 1.7425559080000002 | -20.865 |
| 1.74270459 | -20.816 |
| 1.742853394 | -20.879 |
| 1.743002197 | -20.816 |
| 1.743151123 | -20.826 |
| 1.743299927 | -20.867 |
| 1.743448853 | -20.88 |
| 1.743597778 | -20.96 |
| 1.7437467039999999 | -20.931 |
| 1.74389563 | -21.002 |
| 1.744044678 | -20.992 |
| 1.744193726 | -20.968 |
| 1.744342773 | -20.908 |
| 1.744491821 | -20.928 |
| 1.7446408690000001 | -20.874 |
| 1.744790039 | -20.864 |
| 1.7449390869999999 | -20.867 |
| 1.745088379 | -20.839 |
| 1.7452376710000002 | -20.849 |
| 1.745386841 | -20.86 |
| 1.745536133 | -20.891 |
| 1.7456854249999998 | -20.912 |
| 1.745834717 | -20.939 |
| 1.745984009 | -20.872 |
| 1.746133423 | -20.903 |
| 1.746282715 | -20.818 |
| 1.746432129 | -20.824 |
| 1.746581543 | -20.792 |
| 1.746731079 | -20.837 |
| 1.746880493 | -20.802 |
| 1.747030029 | -20.808 |
| 1.747179565 | -20.815 |
| 1.747329102 | -20.744 |
| 1.747478638 | -20.798 |
| 1.747628296 | -20.77 |
| 1.7477779539999998 | -20.847 |
| 1.747927612 | -20.784 |
| 1.748077271 | -20.842 |
| 1.748227051 | -20.794 |
| 1.748376831 | -20.838 |
| 1.748526611 | -20.837 |
| 1.7486763920000001 | -20.824 |
| 1.748826172 | -20.876 |
| 1.748976074 | -20.851 |
| 1.7491258539999999 | -20.849 |
| 1.7492757570000002 | -20.753 |
| 1.749425659 | -20.812 |
| 1.7495756839999999 | -20.789 |
| 1.749725586 | -20.817 |
| 1.7498756100000001 | -20.797 |
| 1.7500256349999999 | -20.869 |
| 1.750175659 | -20.882 |
| 1.7503256839999999 | -20.874 |
| 1.75047583 | -20.848 |
| 1.7506259769999999 | -20.894 |
| 1.750776123 | -20.953 |
| 1.75092627 | -20.96 |
| 1.751076416 | -20.971 |
| 1.751226685 | -20.988 |
| 1.7513770750000002 | -21.034 |
| 1.751527344 | -20.978 |
| 1.751677612 | -21.043 |
| 1.7518280030000002 | -20.999 |
| 1.751978271 | -21.082 |
| 1.752128662 | -21.019 |
| 1.752279053 | -20.977 |
| 1.752429565 | -20.887 |
| 1.752579956 | -20.871 |
| 1.752730469 | -20.853 |
| 1.7528809810000001 | -20.834 |
| 1.753031494 | -20.914 |
| 1.7531820070000002 | -20.867 |
| 1.7533326420000002 | -20.934 |
| 1.7534832759999999 | -20.902 |
| 1.7536339109999999 | -20.96 |
| 1.753784546 | -20.977 |
| 1.7539351810000001 | -21.038 |
| 1.754085938 | -20.986 |
| 1.754236694 | -20.979 |
| 1.754387573 | -20.93 |
| 1.7545383300000001 | -20.881 |
| 1.754689209 | -20.88 |
| 1.754840088 | -20.897 |
| 1.754990967 | -20.922 |
| 1.755141846 | -20.924 |
| 1.755292725 | -20.962 |
| 1.755443726 | -20.9 |
| 1.755594604 | -20.967 |
| 1.755745605 | -20.931 |
| 1.755896606 | -20.967 |
| 1.7560477289999998 | -20.935 |
| 1.7561987300000002 | -20.96 |
| 1.756349854 | -20.91 |
| 1.756500977 | -20.868 |
| 1.756652222 | -20.869 |
| 1.756803345 | -20.832 |
| 1.75695459 | -20.933 |
| 1.7571058350000002 | -20.856 |
| 1.75725708 | -20.844 |
| 1.757408447 | -20.817 |
| 1.757559814 | -20.856 |
| 1.757711182 | -20.789 |
| 1.757862549 | -20.866 |
| 1.7580139160000001 | -20.939 |
| 1.758165283 | -20.912 |
| 1.758316772 | -20.91 |
| 1.758468262 | -20.814 |
| 1.758619751 | -20.852 |
| 1.75877124 | -20.837 |
| 1.7589227289999998 | -20.882 |
| 1.759074341 | -20.802 |
| 1.759225952 | -20.895 |
| 1.759377563 | -20.821 |
| 1.759529175 | -20.844 |
| 1.759680908 | -20.809 |
| 1.7598326420000001 | -20.84 |
| 1.759984375 | -20.883 |
| 1.760136108 | -20.894 |
| 1.7602878419999999 | -20.919 |
| 1.760439819 | -20.898 |
| 1.760591675 | -20.988 |
| 1.76074353 | -20.91 |
| 1.7608953859999998 | -20.982 |
| 1.761047241 | -20.85 |
| 1.761199219 | -20.938 |
| 1.7613511960000001 | -20.9 |
| 1.761503174 | -20.906 |
| 1.761655151 | -20.858 |
| 1.761807251 | -20.821 |
| 1.761959351 | -20.771 |
| 1.7621114500000001 | -20.69 |
| 1.76226355 | -20.666 |
| 1.762415649 | -20.586 |
| 1.762567871 | -20.654 |
| 1.762720093 | -20.562 |
| 1.762872314 | -20.601 |
| 1.7630245359999999 | -20.595 |
| 1.763176758 | -20.652 |
| 1.763329102 | -20.682 |
| 1.7634815670000001 | -20.72 |
| 1.7636339109999999 | -20.735 |
| 1.763786377 | -20.76 |
| 1.763938721 | -20.795 |
| 1.764091187 | -20.786 |
| 1.7642436520000002 | -20.818 |
| 1.7643961179999998 | -20.771 |
| 1.764548706 | -20.788 |
| 1.764701172 | -20.723 |
| 1.76485376 | -20.732 |
| 1.7650063479999998 | -20.677 |
| 1.765158936 | -20.641 |
| 1.765311646 | -20.619 |
| 1.765464355 | -20.557 |
| 1.7656170649999998 | -20.466 |
| 1.7657697749999999 | -20.501 |
| 1.7659224850000002 | -20.515 |
| 1.766075317 | -20.484 |
| 1.7662280270000001 | -20.561 |
| 1.766380859 | -20.555 |
| 1.7665338130000001 | -20.595 |
| 1.766686768 | -20.59 |
| 1.7668397219999998 | -20.599 |
| 1.766992676 | -20.592 |
| 1.76714563 | -20.635 |
| 1.767298828 | -20.612 |
| 1.7674517820000002 | -20.639 |
| 1.767604858 | -20.64 |
| 1.7677579350000001 | -20.632 |
| 1.7679110109999998 | -20.616 |
| 1.768064087 | -20.585 |
| 1.768217285 | -20.601 |
| 1.768370483 | -20.534 |
| 1.768523682 | -20.581 |
| 1.76867688 | -20.6 |
| 1.7688302 | -20.576 |
| 1.768983398 | -20.517 |
| 1.769136719 | -20.546 |
| 1.769290039 | -20.512 |
| 1.769443481 | -20.523 |
| 1.7695968020000001 | -20.539 |
| 1.769750366 | -20.535 |
| 1.7699038089999999 | -20.619 |
| 1.770057373 | -20.617 |
| 1.770210815 | -20.633 |
| 1.77036438 | -20.597 |
| 1.7705179439999998 | -20.704 |
| 1.770671509 | -20.664 |
| 1.770825073 | -20.696 |
| 1.77097876 | -20.686 |
| 1.7711323239999999 | -20.679 |
| 1.771286011 | -20.678 |
| 1.771439697 | -20.642 |
| 1.7715935059999999 | -20.599 |
| 1.771747192 | -20.556 |
| 1.771901001 | -20.58 |
| 1.77205481 | -20.48 |
| 1.77220874 | -20.526 |
| 1.772362549 | -20.487 |
| 1.7725164789999999 | -20.547 |
| 1.77267041 | -20.566 |
| 1.7728244629999999 | -20.619 |
| 1.772978516 | -20.638 |
| 1.773132446 | -20.685 |
| 1.7732864990000001 | -20.658 |
| 1.773440552 | -20.617 |
| 1.773594604 | -20.606 |
| 1.773748779 | -20.495 |
| 1.773902832 | -20.521 |
| 1.7740570070000001 | -20.431 |
| 1.7742113039999998 | -20.488 |
| 1.774365479 | -20.44 |
| 1.774519653 | -20.405 |
| 1.7746739500000002 | -20.366 |
| 1.7748282469999999 | -20.43 |
| 1.774982544 | -20.455 |
| 1.775136963 | -20.45 |
| 1.775291382 | -20.504 |
| 1.775445801 | -20.441 |
| 1.77560022 | -20.501 |
| 1.775754639 | -20.46 |
| 1.775909302 | -20.482 |
| 1.776063843 | -20.492 |
| 1.776218384 | -20.533 |
| 1.776372925 | -20.406 |
| 1.776527466 | -20.398 |
| 1.776682129 | -20.336 |
| 1.776836792 | -20.285 |
| 1.776991455 | -20.268 |
| 1.7771461179999999 | -20.217 |
| 1.777300903 | -20.185 |
| 1.777455566 | -20.187 |
| 1.777610352 | -20.229 |
| 1.777765259 | -20.177 |
| 1.777920044 | -20.266 |
| 1.778074951 | -20.228 |
| 1.778229858 | -20.284 |
| 1.7783847659999998 | -20.223 |
| 1.778539673 | -20.213 |
| 1.77869458 | -20.155 |
| 1.778849609 | -20.129 |
| 1.779004761 | -20.079 |
| 1.7791599120000001 | -20.054 |
| 1.779314941 | -20.062 |
| 1.7794700929999998 | -20.068 |
| 1.779625122 | -20.12 |
| 1.779780396 | -20.115 |
| 1.779935547 | -20.236 |
| 1.780090698 | -20.198 |
| 1.780245972 | -20.222 |
| 1.780401245 | -20.203 |
| 1.780556519 | -20.219 |
| 1.780711914 | -20.173 |
| 1.780867188 | -20.185 |
| 1.781022583 | -20.109 |
| 1.781177979 | -20.023 |
| 1.781333496 | -19.999 |
| 1.781488892 | -19.888 |
| 1.781644409 | -19.915 |
| 1.781799927 | -19.854 |
| 1.7819554439999998 | -19.849 |
| 1.782110962 | -19.791 |
| 1.782266724 | -19.832 |
| 1.782422363 | -19.822 |
| 1.782578003 | -19.915 |
| 1.782733643 | -20.001 |
| 1.782889404 | -20.022 |
| 1.7830451660000002 | -20.042 |
| 1.783200928 | -19.968 |
| 1.7833566889999999 | -19.991 |
| 1.783512451 | -19.904 |
| 1.783668335 | -19.901 |
| 1.783824219 | -19.805 |
| 1.7839801030000002 | -19.814 |
| 1.784135986 | -19.718 |
| 1.784291992 | -19.697 |
| 1.784447876 | -19.633 |
| 1.784603882 | -19.645 |
| 1.78476001 | -19.652 |
| 1.784916016 | -19.653 |
| 1.785072144 | -19.693 |
| 1.785228271 | -19.654 |
| 1.785384521 | -19.67 |
| 1.785540649 | -19.576 |
| 1.785696899 | -19.589 |
| 1.7858530270000001 | -19.547 |
| 1.786009277 | -19.596 |
| 1.786165649 | -19.578 |
| 1.786321899 | -19.642 |
| 1.786478271 | -19.627 |
| 1.786634644 | -19.629 |
| 1.786791016 | -19.632 |
| 1.786947388 | -19.583 |
| 1.787103882 | -19.618 |
| 1.787260254 | -19.57 |
| 1.787416748 | -19.565 |
| 1.787573364 | -19.484 |
| 1.7877298579999998 | -19.5 |
| 1.787886475 | -19.451 |
| 1.788043091 | -19.475 |
| 1.788199707 | -19.431 |
| 1.788356323 | -19.442 |
| 1.788513184 | -19.458 |
| 1.788669922 | -19.458 |
| 1.78882666 | -19.512 |
| 1.788983398 | -19.506 |
| 1.789140259 | -19.546 |
| 1.789296997 | -19.523 |
| 1.789453857 | -19.561 |
| 1.7896107179999998 | -19.492 |
| 1.7897677 | -19.547 |
| 1.789924561 | -19.479 |
| 1.790081543 | -19.459 |
| 1.790238525 | -19.361 |
| 1.79039563 | -19.301 |
| 1.790552612 | -19.285 |
| 1.790709717 | -19.291 |
| 1.790866821 | -19.339 |
| 1.791023926 | -19.315 |
| 1.79118103 | -19.381 |
| 1.791338257 | -19.346 |
| 1.7914954829999998 | -19.434 |
| 1.791652832 | -19.407 |
| 1.791810181 | -19.423 |
| 1.791967407 | -19.369 |
| 1.792124756 | -19.346 |
| 1.7922821039999999 | -19.286 |
| 1.7924394529999998 | -19.216 |
| 1.792596924 | -19.223 |
| 1.7927542719999998 | -19.187 |
| 1.792911743 | -19.197 |
| 1.7930692140000002 | -19.122 |
| 1.793226807 | -19.148 |
| 1.7933842770000001 | -19.15 |
| 1.79354187 | -19.189 |
| 1.7936994629999998 | -19.141 |
| 1.793857056 | -19.169 |
| 1.794014771 | -19.156 |
| 1.794172363 | -19.164 |
| 1.794330078 | -19.17 |
| 1.794487915 | -19.183 |
| 1.79464563 | -19.237 |
| 1.794803589 | -19.232 |
| 1.794961426 | -19.273 |
| 1.7951192630000001 | -19.257 |
| 1.7952771 | -19.29 |
| 1.7954350589999999 | -19.225 |
| 1.795592896 | -19.236 |
| 1.7957508539999998 | -19.186 |
| 1.795908936 | -19.186 |
| 1.7960668949999998 | -19.15 |
| 1.796224976 | -19.141 |
| 1.7963830570000001 | -19.125 |
| 1.796541138 | -19.066 |
| 1.7966992190000002 | -19.054 |
| 1.796857422 | -19.005 |
| 1.7970155030000001 | -19.013 |
| 1.797173828 | -18.967 |
| 1.7973320309999998 | -18.996 |
| 1.797490234 | -18.97 |
| 1.79764856 | -19.014 |
| 1.797806885 | -19.042 |
| 1.797965332 | -19.105 |
| 1.798123779 | -19.147 |
| 1.7982821039999999 | -19.171 |
| 1.798440552 | -19.235 |
| 1.798598999 | -19.255 |
| 1.798757568 | -19.25 |
| 1.798916016 | -19.179 |
| 1.799074585 | -19.202 |
| 1.799233154 | -19.156 |
| 1.7993917240000001 | -19.176 |
| 1.799550415 | -19.053 |
| 1.7997091060000001 | -19.028 |
| 1.799867676 | -18.966 |
| 1.8000264890000002 | -18.914 |
| 1.800185181 | -18.875 |
| 1.8003439940000001 | -18.872 |
| 1.800502686 | -18.888 |
| 1.800661621 | -18.836 |
| 1.800820435 | -18.859 |
| 1.8009792480000002 | -18.792 |
| 1.8011381839999998 | -18.899 |
| 1.8012972409999999 | -18.916 |
| 1.801456299 | -18.997 |
| 1.801615234 | -18.981 |
| 1.8017742920000002 | -18.989 |
| 1.80193335 | -18.947 |
| 1.8020924070000002 | -18.89 |
| 1.802251465 | -18.853 |
| 1.802410645 | -18.751 |
| 1.8025698239999999 | -18.689 |
| 1.8027290040000001 | -18.587 |
| 1.802888184 | -18.592 |
| 1.803047485 | -18.531 |
| 1.8032066649999998 | -18.569 |
| 1.803365967 | -18.564 |
| 1.8035252689999999 | -18.613 |
| 1.803684692 | -18.634 |
| 1.803844116 | -18.723 |
| 1.8040035399999998 | -18.757 |
| 1.804162964 | -18.777 |
| 1.804322388 | -18.874 |
| 1.8044820560000001 | -18.862 |
| 1.804641602 | -18.885 |
| 1.8048011469999998 | -18.839 |
| 1.804960693 | -18.854 |
| 1.805120361 | -18.79 |
| 1.805279907 | -18.801 |
| 1.805439575 | -18.693 |
| 1.805599365 | -18.681 |
| 1.805759033 | -18.637 |
| 1.805918823 | -18.576 |
| 1.806078613 | -18.535 |
| 1.806238403 | -18.521 |
| 1.806398193 | -18.519 |
| 1.8065581050000001 | -18.47 |
| 1.806718018 | -18.511 |
| 1.8068779300000002 | -18.423 |
| 1.807037842 | -18.417 |
| 1.807197876 | -18.358 |
| 1.807357788 | -18.355 |
| 1.807517822 | -18.294 |
| 1.807678101 | -18.306 |
| 1.807838135 | -18.302 |
| 1.807998291 | -18.331 |
| 1.808158447 | -18.388 |
| 1.808318604 | -18.391 |
| 1.80847876 | -18.481 |
| 1.808639038 | -18.504 |
| 1.808799316 | -18.517 |
| 1.8089595950000001 | -18.476 |
| 1.809119873 | -18.504 |
| 1.8092802730000002 | -18.425 |
| 1.809440674 | -18.389 |
| 1.809601074 | -18.33 |
| 1.809761475 | -18.303 |
| 1.809921997 | -18.239 |
| 1.810082397 | -18.187 |
| 1.8102429199999999 | -18.185 |
| 1.8104034420000001 | -18.21 |
| 1.810564087 | -18.264 |
| 1.8107246090000002 | -18.257 |
| 1.8108854980000002 | -18.356 |
| 1.811046143 | -18.403 |
| 1.8112067870000002 | -18.482 |
| 1.8113675539999998 | -18.456 |
| 1.8115283199999999 | -18.528 |
| 1.811689087 | -18.521 |
| 1.811849854 | -18.481 |
| 1.8120106200000001 | -18.413 |
| 1.8121715090000001 | -18.354 |
| 1.8123323969999998 | -18.312 |
| 1.8124932859999998 | -18.166 |
| 1.8126542970000001 | -18.104 |
| 1.812815308 | -18.019 |
| 1.812976318 | -18.09 |
| 1.813137329 | -18.076 |
| 1.81329834 | -18.145 |
| 1.813459473 | -18.146 |
| 1.813620605 | -18.297 |
| 1.8137817379999999 | -18.419 |
| 1.813942871 | -18.419 |
| 1.814104248 | -18.47 |
| 1.8142655030000001 | -18.41 |
| 1.814426758 | -18.467 |
| 1.814588013 | -18.351 |
| 1.81474939 | -18.346 |
| 1.8149106449999999 | -18.293 |
| 1.815072021 | -18.411 |
| 1.8152333980000002 | -18.292 |
| 1.815394897 | -18.215 |
| 1.8155563959999999 | -18.189 |
| 1.8157178960000002 | -18.162 |
| 1.8158793949999998 | -18.152 |
| 1.816040894 | -18.049 |
| 1.8162025149999999 | -18.051 |
| 1.816364136 | -18.005 |
| 1.8165257570000002 | -18.064 |
| 1.8166873780000001 | -17.992 |
| 1.816849121 | -18.035 |
| 1.817010742 | -18.02 |
| 1.817172485 | -18.06 |
| 1.8173344729999998 | -18.038 |
| 1.817496338 | -18.08 |
| 1.817658081 | -18.086 |
| 1.817819946 | -18.095 |
| 1.8179819339999999 | -18.124 |
| 1.818143799 | -18.048 |
| 1.8183057859999998 | -18.129 |
| 1.818467773 | -18.265 |
| 1.818629761 | -18.42 |
| 1.8187917480000002 | -18.431 |
| 1.818953857 | -18.496 |
| 1.819115967 | -18.401 |
| 1.819278076 | -18.362 |
| 1.819440186 | -18.282 |
| 1.819602417 | -18.326 |
| 1.819764648 | -18.309 |
| 1.81992688 | -18.208 |
| 1.820089111 | -18.166 |
| 1.8202513429999998 | -18.143 |
| 1.8204136960000001 | -18.148 |
| 1.8205762939999999 | -18.138 |
| 1.820738647 | -18.249 |
| 1.820901001 | -18.304 |
| 1.8210634769999998 | -18.353 |
| 1.821225952 | -18.219 |
| 1.821388428 | -18.216 |
| 1.821551025 | -18.174 |
| 1.8217135009999998 | -18.056 |
| 1.821876099 | -17.919 |
| 1.8220386960000001 | -17.894 |
| 1.8222014160000002 | -17.885 |
| 1.822364014 | -17.83 |
| 1.822526733 | -17.807 |
| 1.822689453 | -17.742 |
| 1.822852295 | -17.764 |
| 1.823015015 | -17.733 |
| 1.823177856 | -17.785 |
| 1.823340698 | -17.773 |
| 1.82350354 | -17.817 |
| 1.823666504 | -17.814 |
| 1.823829468 | -17.803 |
| 1.823992554 | -17.802 |
| 1.824155518 | -17.773 |
| 1.8243186040000001 | -18.022 |
| 1.824481567 | -18.233 |
| 1.824644653 | -18.255 |
| 1.824807861 | -18.179 |
| 1.824970947 | -18.206 |
| 1.825134155 | -18.172 |
| 1.825297363 | -18.26 |
| 1.825460571 | -18.315 |
| 1.825623779 | -18.415 |
| 1.8257871090000002 | -18.468 |
| 1.8259504389999999 | -18.256 |
| 1.8261137699999999 | -17.991 |
| 1.8262771 | -17.964 |
| 1.826440552 | -18.006 |
| 1.826604004 | -17.887 |
| 1.826767456 | -17.897 |
| 1.826930908 | -17.864 |
| 1.827094482 | -17.946 |
| 1.827258179 | -17.845 |
| 1.827421753 | -17.875 |
| 1.827585327 | -17.834 |
| 1.827749023 | -17.905 |
| 1.827912598 | -17.89 |
| 1.828076294 | -17.914 |
| 1.82823999 | -18.155 |
| 1.8284038089999999 | -18.118 |
| 1.828567627 | -18.116 |
| 1.8287314449999998 | -17.982 |
| 1.828895264 | -18.102 |
| 1.829059082 | -18.015 |
| 1.8292230219999999 | -18.287 |
| 1.829386963 | -18.372 |
| 1.8295509030000001 | -18.344 |
| 1.8297148440000002 | -18.194 |
| 1.8298789059999998 | -17.973 |
| 1.8300429690000002 | -17.966 |
| 1.8302070309999998 | -17.932 |
| 1.830371094 | -17.999 |
| 1.8305354 | -17.94 |
| 1.830699585 | -18.189 |
| 1.83086377 | -18.044 |
| 1.831028076 | -17.944 |
| 1.831192261 | -17.94 |
| 1.831356567 | -17.984 |
| 1.831520874 | -17.919 |
| 1.831685181 | -17.901 |
| 1.831849609 | -17.827 |
| 1.832014038 | -17.789 |
| 1.8321784669999999 | -17.809 |
| 1.832342896 | -17.683 |
| 1.8325073239999998 | -17.663 |
| 1.832671875 | -17.686 |
| 1.832836426 | -17.766 |
| 1.833000977 | -17.863 |
| 1.8331656490000001 | -18.14 |
| 1.8333303220000001 | -18.082 |
| 1.833494873 | -18.12 |
| 1.833659668 | -18.074 |
| 1.833824463 | -18.068 |
| 1.8339892580000001 | -18.039 |
| 1.834154053 | -18.061 |
| 1.834318848 | -18.284 |
| 1.8344837649999999 | -18.403 |
| 1.83464856 | -18.368 |
| 1.834813477 | -18.089 |
| 1.834978394 | -18.133 |
| 1.835143433 | -18.086 |
| 1.83530835 | -18.105 |
| 1.835473389 | -18.191 |
| 1.835638428 | -18.317 |
| 1.8358035890000002 | -18.316 |
| 1.835968628 | -18.35 |
| 1.836133789 | -18.264 |
| 1.8362989500000002 | -18.24 |
| 1.836464111 | -18.327 |
| 1.8366293949999999 | -18.271 |
| 1.836794678 | -18.273 |
| 1.836959961 | -18.177 |
| 1.8371254879999999 | -18.053 |
| 1.837290771 | -17.886 |
| 1.837456177 | -17.859 |
| 1.837621582 | -17.619 |
| 1.8377869869999999 | -17.628 |
| 1.837952515 | -17.822 |
| 1.83811792 | -17.946 |
| 1.838283447 | -17.97 |
| 1.838449097 | -18.041 |
| 1.838614624 | -18.122 |
| 1.838780273 | -18.094 |
| 1.838945923 | -18.194 |
| 1.839111572 | -18.168 |
| 1.839277344 | -18.278 |
| 1.8394429929999998 | -18.254 |
| 1.839608765 | -18.265 |
| 1.839774658 | -18.154 |
| 1.8399404300000002 | -18.332 |
| 1.8401063229999999 | -18.591 |
| 1.8402722169999999 | -18.554 |
| 1.840438232 | -18.543 |
| 1.840604248 | -18.519 |
| 1.840770142 | -18.553 |
| 1.840936157 | -18.436 |
| 1.841102173 | -18.47 |
| 1.841268311 | -18.251 |
| 1.8414343260000001 | -18.284 |
| 1.841600464 | -18.139 |
| 1.8417666019999999 | -17.842 |
| 1.841932861 | -17.806 |
| 1.842099121 | -17.814 |
| 1.842265259 | -17.734 |
| 1.842431641 | -17.644 |
| 1.8425979 | -17.637 |
| 1.842764282 | -17.565 |
| 1.842930542 | -17.579 |
| 1.843097046 | -17.551 |
| 1.843263428 | -17.602 |
| 1.843429932 | -17.599 |
| 1.843596313 | -17.655 |
| 1.843762817 | -17.604 |
| 1.8439295649999998 | -17.611 |
| 1.844096191 | -17.583 |
| 1.844262817 | -17.55 |
| 1.844429443 | -17.583 |
| 1.8445960689999998 | -17.583 |
| 1.844762817 | -17.631 |
| 1.844929443 | -17.687 |
| 1.845096313 | -17.987 |
| 1.845263062 | -18.137 |
| 1.8454298100000002 | -18.194 |
| 1.84559668 | -18.134 |
| 1.8457635499999998 | -18.144 |
| 1.845930542 | -18.169 |
| 1.846097412 | -18.317 |
| 1.846264404 | -18.38 |
| 1.846431396 | -18.323 |
| 1.846598389 | -18.403 |
| 1.846765503 | -18.282 |
| 1.846932617 | -18.198 |
| 1.847099731 | -18.251 |
| 1.847266968 | -18.379 |
| 1.8474342039999998 | -18.398 |
| 1.8476014399999998 | -18.346 |
| 1.847768677 | -18.076 |
| 1.847935913 | -17.951 |
| 1.848103271 | -17.913 |
| 1.8482705080000001 | -17.755 |
| 1.848437866 | -17.682 |
| 1.848605347 | -17.71 |
| 1.848772705 | -17.718 |
| 1.848940186 | -17.705 |
| 1.849107666 | -17.778 |
| 1.8492751459999999 | -17.799 |
| 1.849442749 | -17.882 |
| 1.849610352 | -17.839 |
| 1.849777954 | -17.848 |
| 1.849945557 | -17.822 |
| 1.850113159 | -17.757 |
| 1.850280884 | -17.673 |
| 1.850448608 | -17.672 |
| 1.850616577 | -17.689 |
| 1.850784302 | -17.645 |
| 1.8509521480000002 | -17.803 |
| 1.851119995 | -17.898 |
| 1.8512878419999999 | -17.979 |
| 1.8514558110000001 | -17.989 |
| 1.851623779 | -18.078 |
| 1.8517917480000001 | -18.077 |
| 1.851959717 | -18.312 |
| 1.852127686 | -18.454 |
| 1.8522957759999998 | -18.422 |
| 1.852463867 | -18.452 |
| 1.852631958 | -18.301 |
| 1.8528001710000002 | -18.197 |
| 1.852968384 | -18.149 |
| 1.853136597 | -18.159 |
| 1.85330481 | -18.065 |
| 1.853473022 | -18.102 |
| 1.8536413569999999 | -17.891 |
| 1.853809692 | -17.804 |
| 1.853978271 | -17.857 |
| 1.854146606 | -17.894 |
| 1.854315063 | -17.928 |
| 1.8544835210000001 | -17.945 |
| 1.8546519780000001 | -18.13 |
| 1.854820557 | -18.246 |
| 1.854989136 | -18.235 |
| 1.855157715 | -18.17 |
| 1.855326294 | -18.125 |
| 1.855494873 | -18.082 |
| 1.8556635739999998 | -18.064 |
| 1.855832275 | -17.993 |
| 1.8560009769999999 | -18.017 |
| 1.8561698 | -18.026 |
| 1.856338623 | -17.979 |
| 1.8565074460000002 | -17.905 |
| 1.85667627 | -18.021 |
| 1.856845215 | -18.087 |
| 1.857014038 | -18.18 |
| 1.857182983 | -18.196 |
| 1.857352173 | -18.156 |
| 1.85752124 | -18.172 |
| 1.8576901860000001 | -18.271 |
| 1.857859253 | -18.453 |
| 1.858028442 | -18.324 |
| 1.8581975099999999 | -18.326 |
| 1.8583666989999998 | -18.287 |
| 1.858535889 | -18.356 |
| 1.858705078 | -18.478 |
| 1.85887439 | -18.544 |
| 1.859043701 | -18.624 |
| 1.859213013 | -18.721 |
| 1.859382324 | -18.643 |
| 1.859551758 | -18.42 |
| 1.859721191 | -18.455 |
| 1.859890625 | -18.362 |
| 1.8600600589999998 | -18.319 |
| 1.860229614 | -18.174 |
| 1.8603990479999999 | -18.064 |
| 1.860568604 | -18.001 |
| 1.860738403 | -17.995 |
| 1.860908081 | -17.959 |
| 1.861077759 | -17.944 |
| 1.861247437 | -18 |
| 1.861417114 | -18.018 |
| 1.8615869139999999 | -18.064 |
| 1.8617565919999999 | -18.052 |
| 1.861926514 | -18.085 |
| 1.8620963130000001 | -18.084 |
| 1.862266235 | -18.133 |
| 1.862436035 | -18.073 |
| 1.8626060789999999 | -18.115 |
| 1.8627760009999998 | -18.071 |
| 1.862946045 | -18.04 |
| 1.863115967 | -18.039 |
| 1.8632861330000001 | -18.056 |
| 1.863456177 | -18.11 |
| 1.863626343 | -18.088 |
| 1.863796509 | -18.083 |
| 1.863966675 | -18.03 |
| 1.864137085 | -18.079 |
| 1.864307251 | -18.074 |
| 1.864477539 | -18.183 |
| 1.864647827 | -18.246 |
| 1.864818237 | -18.294 |
| 1.864988525 | -18.318 |
| 1.865158936 | -18.238 |
| 1.8653294679999999 | -18.269 |
| 1.865499878 | -18.213 |
| 1.86567041 | -18.259 |
| 1.865840942 | -18.322 |
| 1.866011475 | -18.294 |
| 1.8661820070000001 | -18.385 |
| 1.8663526609999999 | -18.489 |
| 1.866523315 | -18.576 |
| 1.86669397 | -18.724 |
| 1.866864746 | -18.933 |
| 1.867035522 | -19.057 |
| 1.867206299 | -19.192 |
| 1.867377075 | -19.127 |
| 1.867548096 | -19.205 |
| 1.867718994 | -19.189 |
| 1.867889893 | -18.905 |
| 1.868060791 | -18.67 |
| 1.868231689 | -18.493 |
| 1.86840271 | -18.303 |
| 1.86857373 | -18.2 |
| 1.868744873 | -18.219 |
| 1.868915894 | -18.417 |
| 1.8690870359999998 | -18.651 |
| 1.869258179 | -18.565 |
| 1.8694293210000001 | -18.647 |
| 1.869600586 | -18.758 |
| 1.8697718509999999 | -18.93 |
| 1.869943115 | -19.108 |
| 1.87011438 | -19.279 |
| 1.8702857670000002 | -19.318 |
| 1.870457153 | -19.27 |
| 1.87062854 | -18.98 |
| 1.870799927 | -18.775 |
| 1.870971436 | -18.813 |
| 1.8711430660000001 | -18.899 |
| 1.871314697 | -18.945 |
| 1.871486206 | -18.945 |
| 1.8716578369999999 | -18.813 |
| 1.8718294679999998 | -18.74 |
| 1.872001099 | -18.739 |
| 1.8721727289999999 | -18.597 |
| 1.872344482 | -18.574 |
| 1.872516235 | -18.505 |
| 1.8726879879999998 | -18.471 |
| 1.872859863 | -18.369 |
| 1.873031738 | -18.398 |
| 1.8732036129999998 | -18.434 |
| 1.873375488 | -18.58 |
| 1.873547363 | -18.611 |
| 1.87371936 | -18.664 |
| 1.873891357 | -18.837 |
| 1.8740633539999998 | -18.889 |
| 1.874235474 | -19.005 |
| 1.874407593 | -18.862 |
| 1.874579834 | -18.751 |
| 1.8747520750000002 | -18.526 |
| 1.8749241939999999 | -18.425 |
| 1.875096436 | -18.385 |
| 1.875268677 | -18.408 |
| 1.87544104 | -18.427 |
| 1.875613281 | -18.408 |
| 1.875785645 | -18.433 |
| 1.875958008 | -18.336 |
| 1.8761304929999998 | -18.376 |
| 1.8763028560000001 | -18.398 |
| 1.876475342 | -18.52 |
| 1.8766479489999999 | -18.529 |
| 1.8768204350000002 | -18.546 |
| 1.876993042 | -18.54 |
| 1.877165649 | -18.557 |
| 1.8773382570000001 | -18.614 |
| 1.877510864 | -18.675 |
| 1.877683594 | -18.836 |
| 1.877856323 | -18.961 |
| 1.878029297 | -19.03 |
| 1.8782020259999999 | -18.971 |
| 1.878374878 | -18.879 |
| 1.8785477289999999 | -18.628 |
| 1.878720703 | -18.458 |
| 1.878893555 | -18.321 |
| 1.879066528 | -18.284 |
| 1.879239502 | -18.235 |
| 1.879412476 | -18.281 |
| 1.879585571 | -18.342 |
| 1.8797586670000002 | -18.425 |
| 1.879931763 | -18.588 |
| 1.88010498 | -18.753 |
| 1.880278076 | -19.011 |
| 1.880451294 | -19.185 |
| 1.880624512 | -19.233 |
| 1.880797852 | -19.051 |
| 1.8809710689999999 | -18.92 |
| 1.881144409 | -18.663 |
| 1.881317871 | -18.498 |
| 1.8814914550000001 | -18.354 |
| 1.8816647949999998 | -18.314 |
| 1.881838257 | -18.253 |
| 1.882011841 | -18.269 |
| 1.882185303 | -18.292 |
| 1.882358887 | -18.295 |
| 1.882532471 | -18.338 |
| 1.882706055 | -18.324 |
| 1.8828797609999999 | -18.395 |
| 1.8830534669999999 | -18.302 |
| 1.883227173 | -18.211 |
| 1.883400879 | -17.984 |
| 1.883574707 | -17.815 |
| 1.883748535 | -17.617 |
| 1.883922363 | -17.528 |
| 1.884096313 | -17.555 |
| 1.884270142 | -17.646 |
| 1.8844440919999998 | -17.757 |
| 1.884618042 | -17.779 |
| 1.8847921140000001 | -17.897 |
| 1.884966309 | -17.973 |
| 1.885140381 | -18.094 |
| 1.885314453 | -18.191 |
| 1.8854886469999999 | -18.196 |
| 1.885662842 | -18.053 |
| 1.8858370359999999 | -17.855 |
| 1.88601123 | -17.618 |
| 1.886185547 | -17.436 |
| 1.8863598629999998 | -17.35 |
| 1.8865341800000002 | -17.34 |
| 1.886708496 | -17.397 |
| 1.886882935 | -17.442 |
| 1.8870573730000002 | -17.469 |
| 1.887231812 | -17.527 |
| 1.88740625 | -17.686 |
| 1.887580811 | -17.858 |
| 1.887755371 | -18.039 |
| 1.887929932 | -18.067 |
| 1.8881046140000002 | -18.049 |
| 1.8882791749999999 | -17.907 |
| 1.8884541019999999 | -17.727 |
| 1.888628784 | -17.564 |
| 1.8888035890000001 | -17.46 |
| 1.888978394 | -17.462 |
| 1.889153198 | -17.455 |
| 1.8893280030000001 | -17.496 |
| 1.8895029300000001 | -17.473 |
| 1.889677856 | -17.502 |
| 1.889852783 | -17.436 |
| 1.89002771 | -17.425 |
| 1.8902027590000001 | -17.523 |
| 1.890377808 | -17.654 |
| 1.890552856 | -17.802 |
| 1.8907279049999999 | -17.813 |
| 1.890903076 | -17.743 |
| 1.8910782469999998 | -17.595 |
| 1.891253418 | -17.543 |
| 1.891428711 | -17.593 |
| 1.891604004 | -17.818 |
| 1.891779297 | -18.102 |
| 1.8919548339999999 | -18.27 |
| 1.892130127 | -18.308 |
| 1.8923055420000001 | -18.257 |
| 1.892480957 | -18.192 |
| 1.8926564940000001 | -18.203 |
| 1.892831909 | -18.248 |
| 1.8930074460000001 | -18.264 |
| 1.893182983 | -18.25 |
| 1.893358643 | -18.106 |
| 1.893534302 | -17.916 |
| 1.893709961 | -17.786 |
| 1.89388562 | -17.762 |
| 1.894061279 | -17.787 |
| 1.894237061 | -17.958 |
| 1.894412842 | -18.1 |
| 1.894588745 | -18.15 |
| 1.894764526 | -18.148 |
| 1.8949404300000001 | -18.07 |
| 1.895116333 | -18.031 |
| 1.8952923579999998 | -17.984 |
| 1.8954685059999998 | -17.959 |
| 1.8956445309999999 | -17.956 |
| 1.895820557 | -17.947 |
| 1.8959967039999999 | -17.753 |
| 1.896172729 | -17.567 |
| 1.8963488769999999 | -17.462 |
| 1.8965251459999999 | -17.476 |
| 1.8967012939999999 | -17.553 |
| 1.896877563 | -17.612 |
| 1.897053833 | -17.629 |
| 1.897230103 | -17.557 |
| 1.8974064940000002 | -17.413 |
| 1.897582886 | -17.259 |
| 1.897759277 | -17.191 |
| 1.897935791 | -17.15 |
| 1.898112183 | -17.166 |
| 1.898288696 | -17.183 |
| 1.8984652100000001 | -17.123 |
| 1.898641846 | -17.017 |
| 1.898818481 | -16.918 |
| 1.898995239 | -16.897 |
| 1.8991719969999998 | -16.934 |
| 1.899348633 | -17.018 |
| 1.8995253909999998 | -17.124 |
| 1.899702148 | -17.157 |
| 1.899879028 | -17.049 |
| 1.9000557859999998 | -16.879 |
| 1.9002326660000002 | -16.733 |
| 1.9004095460000001 | -16.681 |
| 1.900586548 | -16.733 |
| 1.90076355 | -16.831 |
| 1.900940552 | -16.956 |
| 1.9011175539999998 | -17.047 |
| 1.901294556 | -17.052 |
| 1.90147168 | -17.061 |
| 1.901648804 | -17.107 |
| 1.90182605 | -17.19 |
| 1.9020031739999999 | -17.314 |
| 1.9021804199999999 | -17.359 |
| 1.9023576660000001 | -17.292 |
| 1.902535034 | -17.09 |
| 1.902712524 | -16.876 |
| 1.902889893 | -16.69 |
| 1.903067261 | -16.633 |
| 1.903244751 | -16.704 |
| 1.903422241 | -16.862 |
| 1.9035997310000001 | -17.019 |
| 1.903777222 | -17.182 |
| 1.9039548339999999 | -17.341 |
| 1.904132446 | -17.478 |
| 1.904310059 | -17.679 |
| 1.904487671 | -17.823 |
| 1.904665405 | -17.95 |
| 1.9048431399999999 | -17.963 |
| 1.905020874 | -17.759 |
| 1.9051987300000002 | -17.421 |
| 1.905376465 | -17.122 |
| 1.905554321 | -16.879 |
| 1.9057323 | -16.796 |
| 1.905910156 | -16.823 |
| 1.906088135 | -16.82 |
| 1.906266357 | -16.713 |
| 1.906444336 | -16.553 |
| 1.906622437 | -16.429 |
| 1.906800537 | -16.378 |
| 1.906978638 | -16.457 |
| 1.90715686 | -16.594 |
| 1.907335083 | -16.742 |
| 1.907513306 | -16.794 |
| 1.907691528 | -16.692 |
| 1.907869873 | -16.539 |
| 1.908048096 | -16.451 |
| 1.908226563 | -16.432 |
| 1.908404907 | -16.497 |
| 1.908583374 | -16.635 |
| 1.908761841 | -16.715 |
| 1.908940308 | -16.736 |
| 1.909118774 | -16.583 |
| 1.9092973629999999 | -16.394 |
| 1.909475952 | -16.213 |
| 1.909654663 | -16.163 |
| 1.909833496 | -16.203 |
| 1.910012207 | -16.336 |
| 1.910190918 | -16.458 |
| 1.910369629 | -16.505 |
| 1.910548462 | -16.433 |
| 1.9107272949999998 | -16.183 |
| 1.9109061280000001 | -16.01 |
| 1.911085083 | -15.752 |
| 1.911263916 | -15.71 |
| 1.9114429929999999 | -15.526 |
| 1.911621948 | -15.585 |
| 1.911801025 | -15.272 |
| 1.9119799800000001 | -14.836 |
| 1.9121591800000002 | -14.489 |
| 1.912338257 | -14.301 |
| 1.912517456 | -14.218 |
| 1.912696655 | -14.205 |
| 1.912875854 | -14.287 |
| 1.913055176 | -14.191 |
| 1.913234375 | -14.109 |
| 1.9134139399999999 | -13.66 |
| 1.913593262 | -13.388 |
| 1.9137727050000002 | -12.966 |
| 1.9139521480000001 | -12.599 |
| 1.914131592 | -12.1 |
| 1.914311157 | -11.56 |
| 1.914490601 | -11.085 |
| 1.914670288 | -10.688 |
| 1.914849854 | -10.362 |
| 1.915029419 | -10.097 |
| 1.915209106 | -9.94 |
| 1.915388794 | -9.774 |
| 1.915568604 | -9.706 |
| 1.915748413 | -9.497 |
| 1.9159282229999999 | -9.33 |
| 1.9161080320000001 | -9.064 |
| 1.916287842 | -8.789 |
| 1.9164677730000002 | -8.42 |
| 1.9166477050000001 | -8.082 |
| 1.916827759 | -7.747 |
| 1.917007935 | -7.419 |
| 1.917187988 | -7.156 |
| 1.917368042 | -6.866 |
| 1.917548096 | -6.784 |
| 1.9177282709999999 | -6.82 |
| 1.917908447 | -6.76 |
| 1.918088623 | -6.672 |
| 1.9182689210000001 | -6.6 |
| 1.918449219 | -6.679 |
| 1.918629517 | -6.973 |
| 1.918809814 | -6.88 |
| 1.918990234 | -6.838 |
| 1.919170654 | -6.619 |
| 1.919351074 | -6.272 |
| 1.919531616 | -5.831 |
| 1.919712036 | -5.524 |
| 1.919892578 | -5.283 |
| 1.920073242 | -5.062 |
| 1.920253784 | -4.824 |
| 1.920434448 | -4.473 |
| 1.920615356 | -4.438 |
| 1.9207960210000001 | -4.325 |
| 1.920976807 | -4.378 |
| 1.921157593 | -4.382 |
| 1.921338379 | -4.439 |
| 1.9215192870000002 | -4.436 |
| 1.9217001949999999 | -4.407 |
| 1.9218811040000001 | -4.44 |
| 1.922062012 | -4.383 |
| 1.922243042 | -4.395 |
| 1.922424072 | -4.193 |
| 1.9226051030000002 | -4.135 |
| 1.9227862549999999 | -4.009 |
| 1.922967407 | -4.02 |
| 1.92314856 | -3.981 |
| 1.923329712 | -4.051 |
| 1.923510986 | -4.12 |
| 1.923692261 | -4.146 |
| 1.923873535 | -4.191 |
| 1.9240548100000001 | -4.151 |
| 1.9242364500000002 | -4.276 |
| 1.924417847 | -4.237 |
| 1.9245992429999998 | -4.316 |
| 1.9247807620000001 | -4.277 |
| 1.92496228 | -4.34 |
| 1.925143799 | -4.313 |
| 1.925325317 | -4.31 |
| 1.925506958 | -4.293 |
| 1.9256885990000001 | -4.306 |
| 1.925870239 | -4.369 |
| 1.9260520019999998 | -4.426 |
| 1.9262337649999999 | -4.583 |
| 1.926415527 | -4.726 |
| 1.92659729 | -4.974 |
| 1.9267791749999998 | -4.981 |
| 1.92696106 | -5.096 |
| 1.9271429439999999 | -5.104 |
| 1.9273249510000001 | -5.173 |
| 1.927506958 | -5.13 |
| 1.927688965 | -5.085 |
| 1.927871216 | -4.988 |
| 1.9280532229999998 | -4.947 |
| 1.928235352 | -4.857 |
| 1.92841748 | -4.696 |
| 1.928599731 | -4.741 |
| 1.928781982 | -4.724 |
| 1.9289642329999999 | -4.848 |
| 1.929146484 | -4.869 |
| 1.929328857 | -4.979 |
| 1.9295112300000001 | -4.982 |
| 1.9296936040000001 | -5.084 |
| 1.929875977 | -5.038 |
| 1.930058472 | -4.98 |
| 1.930240967 | -4.956 |
| 1.930423584 | -4.9 |
| 1.930606079 | -4.922 |
| 1.930788696 | -4.893 |
| 1.930971313 | -4.946 |
| 1.931154053 | -4.951 |
| 1.931336792 | -5.1 |
| 1.931519653 | -5.143 |
| 1.9317023930000001 | -5.29 |
| 1.931885254 | -5.459 |
| 1.932068115 | -5.575 |
| 1.9322509769999998 | -5.618 |
| 1.93243396 | -5.639 |
| 1.932616821 | -5.628 |
| 1.9327998050000001 | -5.586 |
| 1.93298291 | -5.59 |
| 1.933165894 | -5.484 |
| 1.9333489990000001 | -5.473 |
| 1.933532104 | -5.38 |
| 1.933715332 | -5.31 |
| 1.933898438 | -5.237 |
| 1.934081665 | -5.274 |
| 1.934265015 | -5.277 |
| 1.934448242 | -5.436 |
| 1.934631592 | -5.505 |
| 1.9348149410000002 | -5.538 |
| 1.934998413 | -5.589 |
| 1.935182007 | -5.554 |
| 1.935365479 | -5.556 |
| 1.93554895 | -5.461 |
| 1.935732544 | -5.516 |
| 1.935916138 | -5.484 |
| 1.936099731 | -5.502 |
| 1.936283325 | -5.349 |
| 1.936467041 | -5.342 |
| 1.9366507570000002 | -5.331 |
| 1.9368344729999998 | -5.409 |
| 1.937018311 | -5.516 |
| 1.9372021480000001 | -5.539 |
| 1.937385986 | -5.612 |
| 1.9375698239999999 | -5.58 |
| 1.937753784 | -5.518 |
| 1.937937744 | -5.359 |
| 1.9381217039999998 | -5.288 |
| 1.938305786 | -5.135 |
| 1.9384898679999998 | -5.073 |
| 1.93867395 | -4.915 |
| 1.9388580320000002 | -4.806 |
| 1.9390424800000001 | -4.713 |
| 1.9392266850000002 | -4.649 |
| 1.939410889 | -4.586 |
| 1.939595215 | -4.542 |
| 1.939779419 | -4.575 |
| 1.939963867 | -4.559 |
| 1.940148193 | -4.652 |
| 1.940332642 | -4.668 |
| 1.94051709 | -4.765 |
| 1.9407015380000001 | -4.77 |
| 1.940886108 | -4.848 |
| 1.9410706789999999 | -4.808 |
| 1.9412552490000001 | -4.783 |
| 1.941439819 | -4.753 |
| 1.9416245120000002 | -4.688 |
| 1.941809204 | -4.629 |
| 1.941993896 | -4.507 |
| 1.942178711 | -4.487 |
| 1.942363525 | -4.417 |
| 1.94254834 | -4.478 |
| 1.9427333980000001 | -4.516 |
| 1.942918335 | -4.632 |
| 1.943103271 | -4.718 |
| 1.943288208 | -4.865 |
| 1.9434732670000001 | -4.983 |
| 1.9436583250000001 | -5.139 |
| 1.943843384 | -5.296 |
| 1.944028442 | -5.401 |
| 1.944213623 | -5.549 |
| 1.944398804 | -5.573 |
| 1.944584106 | -5.619 |
| 1.9447692870000002 | -5.632 |
| 1.94495459 | -5.726 |
| 1.9451398930000001 | -5.729 |
| 1.945325317 | -5.829 |
| 1.945510742 | -5.848 |
| 1.9456961670000001 | -5.934 |
| 1.9458815919999999 | -5.999 |
| 1.946067139 | -6.089 |
| 1.946252686 | -6.231 |
| 1.9464384769999998 | -6.407 |
| 1.946624023 | -6.675 |
| 1.946809692 | -6.888 |
| 1.946995361 | -7.224 |
| 1.9471810299999999 | -7.478 |
| 1.9473668210000001 | -7.866 |
| 1.947552612 | -8.159 |
| 1.947738403 | -8.518 |
| 1.9479243160000002 | -8.796 |
| 1.9481102289999999 | -9.093 |
| 1.948296143 | -9.318 |
| 1.948482056 | -9.499 |
| 1.948668091 | -9.671 |
| 1.9488541259999999 | -9.779 |
| 1.949040283 | -9.955 |
| 1.949226318 | -10.043 |
| 1.949412476 | -10.203 |
| 1.9495986330000001 | -10.197 |
| 1.9497849120000001 | -10.213 |
| 1.9499711910000002 | -10.094 |
| 1.950157593 | -10.007 |
| 1.950343872 | -9.832 |
| 1.950530273 | -9.672 |
| 1.9507166749999998 | -9.463 |
| 1.9509030760000001 | -9.232 |
| 1.9510896 | -9.032 |
| 1.9512761230000002 | -8.764 |
| 1.951462646 | -8.565 |
| 1.9516491699999998 | -8.334 |
| 1.951835815 | -8.22 |
| 1.952022461 | -8.073 |
| 1.952209106 | -8.032 |
| 1.952395874 | -7.92 |
| 1.952582642 | -7.858 |
| 1.952769409 | -7.697 |
| 1.9529561770000001 | -7.465 |
| 1.953143066 | -7.151 |
| 1.9533299560000001 | -6.732 |
| 1.953516846 | -6.272 |
| 1.953703857 | -5.743 |
| 1.953890991 | -5.322 |
| 1.954078125 | -4.888 |
| 1.9542651370000002 | -4.628 |
| 1.954452271 | -4.326 |
| 1.954639404 | -4.143 |
| 1.954826538 | -3.955 |
| 1.9550137939999999 | -3.86 |
| 1.9552010499999999 | -3.755 |
| 1.9553883060000001 | -3.698 |
| 1.9555756839999998 | -3.673 |
| 1.955763062 | -3.597 |
| 1.955950439 | -3.557 |
| 1.9561378170000001 | -3.388 |
| 1.9563253170000001 | -3.288 |
| 1.9565128170000001 | -3.08 |
| 1.9567003170000001 | -2.932 |
| 1.956887939 | -2.665 |
| 1.957075562 | -2.483 |
| 1.9572631839999999 | -2.231 |
| 1.9574509279999999 | -2.019 |
| 1.957638794 | -1.803 |
| 1.957826538 | -1.608 |
| 1.9580142820000002 | -1.479 |
| 1.958202148 | -1.349 |
| 1.958390015 | -1.31 |
| 1.9585778809999999 | -1.224 |
| 1.958765869 | -1.271 |
| 1.958953857 | -1.243 |
| 1.959141846 | -1.308 |
| 1.9593298339999998 | -1.299 |
| 1.959517944 | -1.353 |
| 1.959706055 | -1.346 |
| 1.959894287 | -1.357 |
| 1.9600823969999999 | -1.331 |
| 1.96027063 | -1.25 |
| 1.9604588619999999 | -1.227 |
| 1.960647217 | -1.103 |
| 1.960835571 | -1.034 |
| 1.961023926 | -0.868 |
| 1.96121228 | -0.801 |
| 1.961401001 | -0.615 |
| 1.961589478 | -0.527 |
| 1.961777954 | -0.369 |
| 1.961966431 | -0.294 |
| 1.962155029 | -0.224 |
| 1.96234375 | -0.171 |
| 1.9625323490000002 | -0.155 |
| 1.9627210689999999 | -0.141 |
| 1.9629097899999999 | -0.203 |
| 1.9630985109999999 | -0.189 |
| 1.963287354 | -0.273 |
| 1.963476196 | -0.255 |
| 1.963665039 | -0.33 |
| 1.963854004 | -0.309 |
| 1.964042969 | -0.349 |
| 1.9642319339999998 | -0.319 |
| 1.964420898 | -0.329 |
| 1.964609985 | -0.325 |
| 1.964799072 | -0.302 |
| 1.964988281 | -0.318 |
| 1.965177612 | -0.296 |
| 1.9653668210000002 | -0.345 |
| 1.96555603 | -0.307 |
| 1.965745361 | -0.387 |
| 1.96593457 | -0.396 |
| 1.966124023 | -0.517 |
| 1.966313354 | -0.594 |
| 1.966502808 | -0.744 |
| 1.966692261 | -0.894 |
| 1.9668817140000001 | -1.087 |
| 1.967071289 | -1.289 |
| 1.967260864 | -1.445 |
| 1.967450439 | -1.649 |
| 1.967640137 | -1.721 |
| 1.967829712 | -1.853 |
| 1.968019531 | -1.838 |
| 1.968209229 | -1.875 |
| 1.968399048 | -1.793 |
| 1.968588867 | -1.774 |
| 1.968778687 | -1.666 |
| 1.96896875 | -1.613 |
| 1.969158691 | -1.56 |
| 1.969348755 | -1.535 |
| 1.969538696 | -1.558 |
| 1.96972876 | -1.576 |
| 1.969918823 | -1.695 |
| 1.970109009 | -1.786 |
| 1.970299072 | -1.997 |
| 1.970489258 | -2.148 |
| 1.970679565 | -2.422 |
| 1.970869751 | -2.649 |
| 1.9710600589999998 | -2.954 |
| 1.971250488 | -3.166 |
| 1.971440796 | -3.374 |
| 1.971631226 | -3.503 |
| 1.971821655 | -3.528 |
| 1.972012207 | -3.532 |
| 1.972202637 | -3.411 |
| 1.972393311 | -3.354 |
| 1.972583862 | -3.208 |
| 1.972774658 | -3.153 |
| 1.972965332 | -3.021 |
| 1.973156006 | -3.019 |
| 1.973346802 | -2.983 |
| 1.9735375979999998 | -3.052 |
| 1.9737283939999999 | -3.137 |
| 1.9739191889999999 | -3.279 |
| 1.974110107 | -3.474 |
| 1.974301025 | -3.658 |
| 1.974492065 | -3.9 |
| 1.974682983 | -4.075 |
| 1.9748740230000001 | -4.34 |
| 1.9750651860000001 | -4.471 |
| 1.97525647 | -4.639 |
| 1.975447632 | -4.622 |
| 1.975638794 | -4.629 |
| 1.975829956 | -4.49 |
| 1.9760212400000001 | -4.377 |
| 1.9762125240000001 | -4.223 |
| 1.9764039310000001 | -4.09 |
| 1.9765954589999999 | -4.015 |
| 1.976786865 | -3.937 |
| 1.976978271 | -3.952 |
| 1.9771698 | -3.97 |
| 1.977361328 | -4.134 |
| 1.977552856 | -4.267 |
| 1.9777445070000002 | -4.545 |
| 1.977936157 | -4.781 |
| 1.978127808 | -5.106 |
| 1.9783194579999999 | -5.39 |
| 1.97851123 | -5.668 |
| 1.9787030030000001 | -5.916 |
| 1.978894897 | -6.123 |
| 1.9790866699999998 | -6.309 |
| 1.979278564 | -6.341 |
| 1.9794704589999998 | -6.393 |
| 1.979662476 | -6.295 |
| 1.9798544919999999 | -6.269 |
| 1.9800465090000001 | -6.149 |
| 1.980238647 | -6.138 |
| 1.980430908 | -6.101 |
| 1.9806230470000001 | -6.187 |
| 1.980815308 | -6.303 |
| 1.981007446 | -6.504 |
| 1.981199707 | -6.819 |
| 1.9813920900000002 | -7.201 |
| 1.981584351 | -7.721 |
| 1.981776733 | -8.248 |
| 1.9819692379999998 | -8.934 |
| 1.982161621 | -9.537 |
| 1.982354126 | -10.264 |
| 1.982546631 | -10.836 |
| 1.982739258 | -11.44 |
| 1.982931763 | -11.902 |
| 1.983124512 | -12.291 |
| 1.983317139 | -12.471 |
| 1.983509888 | -12.505 |
| 1.9837026370000002 | -12.439 |
| 1.983895386 | -12.261 |
| 1.984088257 | -12.136 |
| 1.98428125 | -11.952 |
| 1.9844741209999999 | -11.897 |
| 1.984667114 | -11.814 |
| 1.984860107 | -11.879 |
| 1.9850531009999999 | -11.916 |
| 1.985246094 | -12.093 |
| 1.985439209 | -12.305 |
| 1.985632324 | -12.609 |
| 1.985825562 | -12.951 |
| 1.9860186770000001 | -13.297 |
| 1.986211914 | -13.669 |
| 1.9864052730000001 | -13.925 |
| 1.986598511 | -14.182 |
| 1.98679187 | -14.304 |
| 1.9869853519999998 | -14.488 |
| 1.987178711 | -14.622 |
| 1.987372192 | -14.778 |
| 1.9875656739999998 | -14.913 |
| 1.987759277 | -15.088 |
| 1.9879527590000001 | -15.271 |
| 1.988146484 | -15.469 |
| 1.988340332 | -15.665 |
| 1.988533936 | -15.826 |
| 1.988727661 | -15.872 |
| 1.988921509 | -15.77 |
| 1.989115234 | -15.556 |
| 1.989309082 | -15.175 |
| 1.989503052 | -14.75 |
| 1.9896968990000001 | -14.187 |
| 1.9898908690000001 | -13.634 |
| 1.990084839 | -13.008 |
| 1.990278931 | -12.481 |
| 1.9904728999999999 | -11.991 |
| 1.990667114 | -11.644 |
| 1.990861206 | -11.393 |
| 1.99105542 | -11.209 |
| 1.991249634 | -11.139 |
| 1.9914438479999998 | -11.08 |
| 1.991638184 | -11.136 |
| 1.99183252 | -11.197 |
| 1.992026855 | -11.392 |
| 1.9922214360000001 | -11.528 |
| 1.992415894 | -11.736 |
| 1.9926104740000001 | -11.84 |
| 1.992804932 | -11.924 |
| 1.9929995120000001 | -11.936 |
| 1.993194092 | -11.86 |
| 1.993388794 | -11.732 |
| 1.993583374 | -11.481 |
| 1.9937780760000001 | -11.232 |
| 1.9939729 | -10.84 |
| 1.994167725 | -10.523 |
| 1.9943625489999999 | -10.119 |
| 1.9945573730000001 | -9.838 |
| 1.994752319 | -9.539 |
| 1.9949472659999998 | -9.351 |
| 1.995142212 | -9.166 |
| 1.995337158 | -9.065 |
| 1.995532227 | -9.005 |
| 1.9957274170000001 | -8.966 |
| 1.9959224850000001 | -9.034 |
| 1.9961179199999999 | -9.105 |
| 1.99631311 | -9.313 |
| 1.996508301 | -9.485 |
| 1.996703613 | -9.794 |
| 1.996898926 | -10.064 |
| 1.9970942379999999 | -10.455 |
| 1.997289673 | -10.839 |
| 1.997485107 | -11.308 |
| 1.997680664 | -11.835 |
| 1.997876099 | -12.387 |
| 1.998071655 | -13.029 |
| 1.998267212 | -13.604 |
| 1.998462891 | -14.272 |
| 1.998658569 | -14.746 |
| 1.998854248 | -15.227 |
| 1.999050049 | -15.467 |
| 1.99924585 | -15.643 |
| 1.99944165 | -15.55 |
| 1.9996374510000001 | -15.4 |
| 1.999833374 | -14.927 |
| 2.000029541 | -14.389 |
| 2.000225464 | -13.662 |
| 2.000421509 | -12.893 |
| 2.0006175539999997 | -12.07 |
| 2.000813599 | -11.282 |
| 2.0010097659999997 | -10.6 |
| 2.001205933 | -9.947 |
| 2.0014021 | -9.445 |
| 2.001598389 | -8.902 |
| 2.001794678 | -8.516 |
| 2.001990967 | -8.115 |
| 2.002187378 | -7.843 |
| 2.002383789 | -7.572 |
| 2.0025802 | -7.406 |
| 2.002776611 | -7.302 |
| 2.002973145 | -7.249 |
| 2.003169678 | -7.296 |
| 2.0033663329999998 | -7.343 |
| 2.003562988 | -7.525 |
| 2.003759644 | -7.693 |
| 2.003956543 | -7.991 |
| 2.00415332 | -8.273 |
| 2.0043500979999997 | -8.71 |
| 2.004546875 | -9.154 |
| 2.004743774 | -9.679 |
| 2.0049406739999998 | -10.235 |
| 2.005137573 | -10.777 |
| 2.005334595 | -11.381 |
| 2.005531616 | -11.912 |
| 2.005728638 | -12.516 |
| 2.0059257809999997 | -12.98 |
| 2.006122803 | -13.517 |
| 2.006320068 | -13.777 |
| 2.006517212 | -13.997 |
| 2.006714478 | -13.859 |
| 2.006911743 | -13.633 |
| 2.007109131 | -13.156 |
| 2.007306519 | -12.669 |
| 2.0075039059999997 | -12.115 |
| 2.007701294 | -11.548 |
| 2.007899048 | -11.028 |
| 2.008096558 | -10.477 |
| 2.008294067 | -10.015 |
| 2.008491699 | -9.516 |
| 2.0086893310000002 | -9.142 |
| 2.008886963 | -8.714 |
| 2.009084717 | -8.435 |
| 2.009282471 | -8.145 |
| 2.009480225 | -7.978 |
| 2.009678101 | -7.838 |
| 2.009875977 | -7.77 |
| 2.010073853 | -7.749 |
| 2.010271851 | -7.777 |
| 2.010469849 | -7.895 |
| 2.010667847 | -8.002 |
| 2.010865845 | -8.236 |
| 2.011063965 | -8.42 |
| 2.0112620850000003 | -8.723 |
| 2.011460327 | -8.947 |
| 2.0116585689999997 | -9.255 |
| 2.011857056 | -9.49 |
| 2.012055298 | -9.788 |
| 2.012253662 | -10.022 |
| 2.012452026 | -10.22 |
| 2.0126503909999998 | -10.4 |
| 2.0128488769999997 | -10.475 |
| 2.013047363 | -10.507 |
| 2.013245972 | -10.335 |
| 2.013444458 | -10.191 |
| 2.013643066 | -9.853 |
| 2.013841797 | -9.591 |
| 2.014040405 | -9.182 |
| 2.014239136 | -8.848 |
| 2.014437988 | -8.428 |
| 2.0146367190000003 | -8.08 |
| 2.014835571 | -7.66 |
| 2.015034546 | -7.268 |
| 2.015233398 | -6.907 |
| 2.015432373 | -6.537 |
| 2.015631348 | -6.266 |
| 2.015830688 | -5.965 |
| 2.0160297849999997 | -5.777 |
| 2.016228882 | -5.553 |
| 2.016427979 | -5.448 |
| 2.016627197 | -5.286 |
| 2.0168264160000002 | -5.226 |
| 2.0170257570000003 | -5.15 |
| 2.017225098 | -5.122 |
| 2.017424438 | -5.117 |
| 2.017623779 | -5.128 |
| 2.017823242 | -5.218 |
| 2.018022705 | -5.292 |
| 2.0182222899999998 | -5.476 |
| 2.018421875 | -5.61 |
| 2.01862146 | -5.884 |
| 2.0188210449999997 | -6.143 |
| 2.019020752 | -6.53 |
| 2.019220459 | -6.931 |
| 2.019420166 | -7.44 |
| 2.0196199950000002 | -7.989 |
| 2.019820068 | -8.558 |
| 2.020019897 | -9.202 |
| 2.020219849 | -9.78 |
| 2.0204198 | -10.483 |
| 2.020619751 | -11.083 |
| 2.0208198239999997 | -11.801 |
| 2.021019897 | -12.428 |
| 2.021219971 | -13.199 |
| 2.021420166 | -13.767 |
| 2.021620361 | -14.283 |
| 2.021820557 | -14.483 |
| 2.022020752 | -14.533 |
| 2.022221069 | -14.331 |
| 2.022421509 | -14.011 |
| 2.022621826 | -13.546 |
| 2.022822266 | -12.97 |
| 2.0230227050000003 | -12.396 |
| 2.023223267 | -11.682 |
| 2.023423828 | -11.046 |
| 2.02362439 | -10.321 |
| 2.0238251949999997 | -9.77 |
| 2.024025879 | -9.15 |
| 2.024226563 | -8.695 |
| 2.024427368 | -8.212 |
| 2.024628174 | -7.845 |
| 2.024828979 | -7.51 |
| 2.025029785 | -7.203 |
| 2.025230713 | -6.949 |
| 2.025431641 | -6.69 |
| 2.02563269 | -6.519 |
| 2.025833618 | -6.282 |
| 2.0260347899999998 | -6.167 |
| 2.02623584 | -5.994 |
| 2.026437012 | -5.936 |
| 2.026638184 | -5.841 |
| 2.026839355 | -5.819 |
| 2.027040649 | -5.796 |
| 2.027241943 | -5.829 |
| 2.0274433590000003 | -5.898 |
| 2.027644653 | -5.952 |
| 2.027846313 | -6.093 |
| 2.028047729 | -6.183 |
| 2.028249268 | -6.362 |
| 2.028450806 | -6.451 |
| 2.028652466 | -6.631 |
| 2.028854004 | -6.728 |
| 2.029055664 | -6.91 |
| 2.029257446 | -7.033 |
| 2.029459106 | -7.199 |
| 2.029660889 | -7.373 |
| 2.029862793 | -7.537 |
| 2.030064697 | -7.72 |
| 2.0302666019999998 | -7.827 |
| 2.030468506 | -8.005 |
| 2.0306705320000003 | -8.058 |
| 2.030872559 | -8.2 |
| 2.0310745850000003 | -8.199 |
| 2.031276733 | -8.269 |
| 2.031478882 | -8.216 |
| 2.03168103 | -8.207 |
| 2.031883423 | -8.057 |
| 2.032085693 | -7.906 |
| 2.032287964 | -7.706 |
| 2.032490356 | -7.454 |
| 2.032692749 | -7.214 |
| 2.032895142 | -6.904 |
| 2.033097656 | -6.676 |
| 2.033300171 | -6.375 |
| 2.033502686 | -6.186 |
| 2.033705322 | -5.89 |
| 2.033907959 | -5.701 |
| 2.034110596 | -5.432 |
| 2.034313354 | -5.23 |
| 2.034516113 | -4.974 |
| 2.034718872 | -4.768 |
| 2.034921631 | -4.576 |
| 2.035124512 | -4.381 |
| 2.035327515 | -4.257 |
| 2.035530396 | -4.082 |
| 2.035733398 | -4.012 |
| 2.035936646 | -3.881 |
| 2.036139771 | -3.836 |
| 2.0363428960000003 | -3.708 |
| 2.036546021 | -3.691 |
| 2.036749268 | -3.601 |
| 2.036952393 | -3.563 |
| 2.0371557620000003 | -3.509 |
| 2.037359009 | -3.466 |
| 2.037562378 | -3.468 |
| 2.037765747 | -3.449 |
| 2.037969238 | -3.502 |
| 2.038172729 | -3.499 |
| 2.038376221 | -3.611 |
| 2.038579834 | -3.623 |
| 2.038783447 | -3.733 |
| 2.038987061 | -3.769 |
| 2.039190796 | -3.876 |
| 2.039394531 | -3.93 |
| 2.039598267 | -4.016 |
| 2.039802002 | -4.091 |
| 2.040006104 | -4.16 |
| 2.040209961 | -4.286 |
| 2.04041394 | -4.355 |
| 2.04061792 | -4.507 |
| 2.040821899 | -4.594 |
| 2.041026001 | -4.78 |
| 2.04122998 | -4.861 |
| 2.0414342039999998 | -5.031 |
| 2.041638306 | -5.119 |
| 2.041842529 | -5.274 |
| 2.042046753 | -5.404 |
| 2.042251099 | -5.561 |
| 2.042455444 | -5.739 |
| 2.04265979 | -5.904 |
| 2.0428642580000003 | -6.131 |
| 2.043068726 | -6.28 |
| 2.043273193 | -6.525 |
| 2.043477783 | -6.669 |
| 2.043682373 | -6.896 |
| 2.043886963 | -7.025 |
| 2.044091797 | -7.22 |
| 2.044296509 | -7.349 |
| 2.044501221 | -7.54 |
| 2.0447060550000002 | -7.706 |
| 2.044910889 | -7.876 |
| 2.045115723 | -8.085 |
| 2.045320679 | -8.25 |
| 2.045525635 | -8.468 |
| 2.045730591 | -8.587 |
| 2.045935669 | -8.788 |
| 2.046140747 | -8.876 |
| 2.046345825 | -9.054 |
| 2.046551025 | -9.136 |
| 2.046756226 | -9.278 |
| 2.046961426 | -9.358 |
| 2.047166748 | -9.457 |
| 2.0473720699999998 | -9.521 |
| 2.047577393 | -9.556 |
| 2.047782837 | -9.614 |
| 2.047988281 | -9.584 |
| 2.048193848 | -9.614 |
| 2.048399414 | -9.547 |
| 2.04860498 | -9.552 |
| 2.048810547 | -9.48 |
| 2.049016357 | -9.489 |
| 2.049221924 | -9.425 |
| 2.049427734 | -9.433 |
| 2.0496335450000003 | -9.406 |
| 2.049839355 | -9.391 |
| 2.050045166 | -9.362 |
| 2.050250977 | -9.306 |
| 2.050457031 | -9.295 |
| 2.050663086 | -9.232 |
| 2.050869141 | -9.251 |
| 2.0510751949999997 | -9.173 |
| 2.05128125 | -9.197 |
| 2.051487305 | -9.144 |
| 2.051693604 | -9.153 |
| 2.051899902 | -9.102 |
| 2.052105957 | -9.116 |
| 2.0523125 | -9.097 |
| 2.0525190429999998 | -9.084 |
| 2.052725342 | -9.085 |
| 2.052931885 | -9.056 |
| 2.053138184 | -9.101 |
| 2.0533447270000003 | -9.081 |
| 2.05355127 | -9.16 |
| 2.053758057 | -9.173 |
| 2.0539645999999996 | -9.29 |
| 2.054171387 | -9.323 |
| 2.0543779300000002 | -9.426 |
| 2.054584717 | -9.47 |
| 2.0547915039999998 | -9.554 |
| 2.054998535 | -9.625 |
| 2.055205322 | -9.695 |
| 2.055412354 | -9.782 |
| 2.055619141 | -9.809 |
| 2.055826172 | -9.92 |
| 2.056033447 | -9.941 |
| 2.056240479 | -10.059 |
| 2.0564477539999997 | -10.102 |
| 2.056655029 | -10.249 |
| 2.056862305 | -10.322 |
| 2.05706958 | -10.468 |
| 2.057276855 | -10.583 |
| 2.0574841310000003 | -10.75 |
| 2.05769165 | -10.929 |
| 2.057898926 | -11.092 |
| 2.058106445 | -11.321 |
| 2.058313965 | -11.496 |
| 2.058521484 | -11.751 |
| 2.058729248 | -11.886 |
| 2.058936768 | -12.131 |
| 2.059144531 | -12.25 |
| 2.059352295 | -12.441 |
| 2.059560059 | -12.54 |
| 2.059767822 | -12.681 |
| 2.059975586 | -12.773 |
| 2.060183594 | -12.886 |
| 2.060391602 | -13.016 |
| 2.060599609 | -13.121 |
| 2.060807861 | -13.308 |
| 2.061015869 | -13.421 |
| 2.0612238769999998 | -13.633 |
| 2.061432129 | -13.749 |
| 2.061640381 | -13.968 |
| 2.061848389 | -14.111 |
| 2.062056885 | -14.33 |
| 2.062265137 | -14.469 |
| 2.0624733890000004 | -14.641 |
| 2.062681885 | -14.789 |
| 2.0628903810000003 | -14.892 |
| 2.063098877 | -14.972 |
| 2.0633073730000002 | -14.962 |
| 2.0635158689999997 | -14.977 |
| 2.063724609 | -14.853 |
| 2.0639331050000003 | -14.785 |
| 2.064141846 | -14.575 |
| 2.064350586 | -14.422 |
| 2.064559326 | -14.151 |
| 2.064768555 | -13.917 |
| 2.0649772950000003 | -13.584 |
| 2.065186279 | -13.267 |
| 2.065395264 | -12.914 |
| 2.065604248 | -12.561 |
| 2.065813232 | -12.258 |
| 2.066022217 | -11.926 |
| 2.066231445 | -11.681 |
| 2.066440674 | -11.367 |
| 2.066649658 | -11.16 |
| 2.066859131 | -10.838 |
| 2.067068359 | -10.61 |
| 2.067277588 | -10.283 |
| 2.067487061 | -10.005 |
| 2.067696533 | -9.665 |
| 2.0679060060000003 | -9.372 |
| 2.0681154790000003 | -9.095 |
| 2.068324951 | -8.819 |
| 2.068534668 | -8.614 |
| 2.0687441410000003 | -8.341 |
| 2.068954102 | -8.175 |
| 2.069163818 | -7.932 |
| 2.069373535 | -7.78 |
| 2.0695832519999997 | -7.526 |
| 2.069793213 | -7.371 |
| 2.070003174 | -7.139 |
| 2.070212891 | -6.966 |
| 2.070422852 | -6.771 |
| 2.070633057 | -6.579 |
| 2.070843018 | -6.435 |
| 2.071053223 | -6.262 |
| 2.0712631839999998 | -6.136 |
| 2.0714733890000003 | -5.936 |
| 2.071683594 | -5.839 |
| 2.071894043 | -5.63 |
| 2.072104248 | -5.507 |
| 2.072314697 | -5.309 |
| 2.072525146 | -5.204 |
| 2.072735352 | -5.066 |
| 2.072946045 | -4.976 |
| 2.073156738 | -4.88 |
| 2.073367188 | -4.801 |
| 2.0735778810000003 | -4.779 |
| 2.073788574 | -4.697 |
| 2.073999268 | -4.691 |
| 2.074209961 | -4.608 |
| 2.074420654 | -4.619 |
| 2.0746315920000002 | -4.522 |
| 2.074842529 | -4.521 |
| 2.075053467 | -4.442 |
| 2.075264404 | -4.44 |
| 2.0754753420000003 | -4.417 |
| 2.075686279 | -4.413 |
| 2.075897461 | -4.427 |
| 2.076108643 | -4.433 |
| 2.076319824 | -4.491 |
| 2.076531006 | -4.468 |
| 2.0767421880000003 | -4.542 |
| 2.076953369 | -4.521 |
| 2.0771647950000003 | -4.601 |
| 2.077376465 | -4.603 |
| 2.0775878910000003 | -4.676 |
| 2.077799316 | -4.699 |
| 2.078010742 | -4.8 |
| 2.078222412 | -4.882 |
| 2.0784340820000002 | -4.971 |
| 2.078645752 | -5.103 |
| 2.078857422 | -5.198 |
| 2.079069092 | -5.361 |
| 2.079280762 | -5.446 |
| 2.0794926759999997 | -5.626 |
| 2.07970459 | -5.724 |
| 2.079916504 | -5.931 |
| 2.0801284179999997 | -6.053 |
| 2.080340332 | -6.256 |
| 2.0805522460000003 | -6.437 |
| 2.080764404 | -6.652 |
| 2.080976563 | -6.848 |
| 2.081188721 | -7.021 |
| 2.081400879 | -7.243 |
| 2.081613037 | -7.382 |
| 2.081825684 | -7.606 |
| 2.082038086 | -7.737 |
| 2.082250488 | -7.975 |
| 2.082462891 | -8.16 |
| 2.082675293 | -8.452 |
| 2.0828876949999997 | -8.691 |
| 2.0831003420000003 | -9.028 |
| 2.0833129880000003 | -9.354 |
| 2.083525635 | -9.686 |
| 2.083738281 | -10.046 |
| 2.083950928 | -10.35 |
| 2.084163818 | -10.704 |
| 2.0843764649999996 | -10.967 |
| 2.084589355 | -11.309 |
| 2.084802246 | -11.53 |
| 2.085015137 | -11.858 |
| 2.085228271 | -12.064 |
| 2.085441162 | -12.329 |
| 2.085654297 | -12.482 |
| 2.085867432 | -12.653 |
| 2.086080811 | -12.749 |
| 2.086293945 | -12.789 |
| 2.0865073240000003 | -12.803 |
| 2.086720459 | -12.736 |
| 2.0869338379999998 | -12.691 |
| 2.087147217 | -12.526 |
| 2.087360596 | -12.39 |
| 2.087574219 | -12.113 |
| 2.087787598 | -11.927 |
| 2.088001221 | -11.585 |
| 2.088214844 | -11.318 |
| 2.0884284670000004 | -11.001 |
| 2.08864209 | -10.747 |
| 2.088855713 | -10.475 |
| 2.08906958 | -10.23 |
| 2.0892834469999997 | -10.018 |
| 2.0894973140000004 | -9.78 |
| 2.089711182 | -9.607 |
| 2.089925049 | -9.353 |
| 2.09013916 | -9.192 |
| 2.090353271 | -8.952 |
| 2.0905673830000002 | -8.798 |
| 2.090781494 | -8.575 |
| 2.0909956050000003 | -8.445 |
| 2.091209961 | -8.279 |
| 2.0914240719999997 | -8.163 |
| 2.091638428 | -8.069 |
| 2.0918527829999998 | -7.98 |
| 2.092067139 | -7.946 |
| 2.092281738 | -7.886 |
| 2.092496094 | -7.929 |
| 2.092710693 | -7.906 |
| 2.092925293 | -7.987 |
| 2.093139893 | -7.992 |
| 2.093354492 | -8.105 |
| 2.093569092 | -8.161 |
| 2.093783936 | -8.267 |
| 2.0939985350000003 | -8.364 |
| 2.0942133789999997 | -8.485 |
| 2.094428223 | -8.643 |
| 2.094643555 | -8.758 |
| 2.094858398 | -8.959 |
| 2.095073486 | -9.098 |
| 2.095288574 | -9.34 |
| 2.095503662 | -9.48 |
| 2.09571875 | -9.724 |
| 2.095933838 | -9.908 |
| 2.0961491700000003 | -10.177 |
| 2.096364258 | -10.394 |
| 2.0965795899999997 | -10.666 |
| 2.096794922 | -10.946 |
| 2.097010498 | -11.213 |
| 2.0972258299999997 | -11.53 |
| 2.0974414059999997 | -11.779 |
| 2.097656982 | -12.122 |
| 2.097872559 | -12.377 |
| 2.098088135 | -12.734 |
| 2.0983037110000002 | -12.965 |
| 2.098519531 | -13.314 |
| 2.098735107 | -13.517 |
| 2.098951172 | -13.757 |
| 2.099166992 | -13.862 |
| 2.099382813 | -13.918 |
| 2.099598877 | -13.882 |
| 2.099814941 | -13.739 |
| 2.100030762 | -13.579 |
| 2.1002468260000002 | -13.314 |
| 2.100463135 | -13.091 |
| 2.100679199 | -12.759 |
| 2.100895264 | -12.487 |
| 2.1011115719999998 | -12.08 |
| 2.101327881 | -11.78 |
| 2.101544189 | -11.391 |
| 2.101760498 | -11.091 |
| 2.101977051 | -10.762 |
| 2.102193604 | -10.499 |
| 2.102409912 | -10.272 |
| 2.1026264649999997 | -10.078 |
| 2.102843262 | -9.927 |
| 2.1030598140000003 | -9.732 |
| 2.1032766109999996 | -9.654 |
| 2.103493408 | -9.508 |
| 2.103710205 | -9.452 |
| 2.103927002 | -9.322 |
| 2.104143799 | -9.295 |
| 2.10436084 | -9.228 |
| 2.104577881 | -9.224 |
| 2.104794678 | -9.231 |
| 2.105011719 | -9.269 |
| 2.105229004 | -9.387 |
| 2.1054460450000003 | -9.471 |
| 2.10566333 | -9.641 |
| 2.105880371 | -9.787 |
| 2.1060976559999998 | -10.069 |
| 2.106314941 | -10.274 |
| 2.106532471 | -10.578 |
| 2.106749756 | -10.83 |
| 2.106967285 | -11.146 |
| 2.107184814 | -11.447 |
| 2.107402344 | -11.778 |
| 2.1076201169999997 | -12.155 |
| 2.107837646 | -12.549 |
| 2.1080554200000003 | -13.041 |
| 2.108273193 | -13.455 |
| 2.1084909670000003 | -14.011 |
| 2.10870874 | -14.455 |
| 2.108926514 | -14.976 |
| 2.109144531 | -15.291 |
| 2.1093623050000003 | -15.655 |
| 2.109580322 | -15.822 |
| 2.1097983399999998 | -15.987 |
| 2.110016357 | -15.998 |
| 2.110234619 | -15.908 |
| 2.110452637 | -15.745 |
| 2.110670898 | -15.48 |
| 2.11088916 | -15.229 |
| 2.111107422 | -14.884 |
| 2.1113259280000003 | -14.629 |
| 2.1115441890000004 | -14.31 |
| 2.111762695 | -14.12 |
| 2.111981445 | -13.843 |
| 2.112199951 | -13.654 |
| 2.1124184570000004 | -13.394 |
| 2.112637207 | -13.223 |
| 2.112855713 | -13.009 |
| 2.113074463 | -12.827 |
| 2.113293213 | -12.664 |
| 2.113511963 | -12.498 |
| 2.113730957 | -12.413 |
| 2.113949707 | -12.289 |
| 2.114168701 | -12.272 |
| 2.114387695 | -12.232 |
| 2.1146066890000004 | -12.327 |
| 2.114825928 | -12.376 |
| 2.115044922 | -12.54 |
| 2.11526416 | -12.703 |
| 2.115483398 | -12.952 |
| 2.115702637 | -13.235 |
| 2.115921875 | -13.521 |
| 2.1161411130000003 | -13.87 |
| 2.11636084 | -14.181 |
| 2.116580322 | -14.567 |
| 2.1167998050000003 | -14.859 |
| 2.117019287 | -15.239 |
| 2.1172387699999997 | -15.507 |
| 2.1174584960000002 | -15.816 |
| 2.117678223 | -15.96 |
| 2.117897949 | -16.085 |
| 2.118117676 | -16.039 |
| 2.1183374020000003 | -15.923 |
| 2.1185573730000002 | -15.746 |
| 2.1187771 | -15.53 |
| 2.11899707 | -15.321 |
| 2.1192170409999997 | -15.057 |
| 2.1194370119999997 | -14.839 |
| 2.1196572270000003 | -14.55 |
| 2.1198771969999997 | -14.345 |
| 2.1200974120000002 | -14.058 |
| 2.120317627 | -13.886 |
| 2.120537842 | -13.676 |
| 2.120758545 | -13.56 |
| 2.12097876 | -13.45 |
| 2.121199219 | -13.404 |
| 2.121419678 | -13.408 |
| 2.121640137 | -13.41 |
| 2.121860596 | -13.496 |
| 2.122081299 | -13.56 |
| 2.122302002 | -13.735 |
| 2.122522461 | -13.857 |
| 2.122743164 | -14.121 |
| 2.122964111 | -14.306 |
| 2.123184814 | -14.573 |
| 2.123405762 | -14.792 |
| 2.1236267090000003 | -15.039 |
| 2.1238476559999997 | -15.305 |
| 2.124068604 | -15.566 |
| 2.124289551 | -15.86 |
| 2.124510742 | -16.082 |
| 2.1247316890000003 | -16.35 |
| 2.124952881 | -16.395 |
| 2.1251743160000003 | -16.43 |
| 2.1253957519999997 | -16.187 |
| 2.125616943 | -15.952 |
| 2.1258383789999997 | -15.495 |
| 2.126059814 | -15.1 |
| 2.12628125 | -14.572 |
| 2.126502686 | -14.1 |
| 2.126724365 | -13.621 |
| 2.1269458009999997 | -13.146 |
| 2.12716748 | -12.712 |
| 2.1273891600000003 | -12.283 |
| 2.12761084 | -11.984 |
| 2.1278327640000003 | -11.659 |
| 2.128054443 | -11.489 |
| 2.128276367 | -11.277 |
| 2.128498291 | -11.22 |
| 2.128720215 | -11.15 |
| 2.128942383 | -11.169 |
| 2.129164307 | -11.212 |
| 2.129386475 | -11.321 |
| 2.129608887 | -11.492 |
| 2.129831055 | -11.655 |
| 2.130053223 | -11.92 |
| 2.130275391 | -12.145 |
| 2.1304978030000004 | -12.507 |
| 2.1307202149999998 | -12.779 |
| 2.130942627 | -13.151 |
| 2.131165039 | -13.452 |
| 2.131387695 | -13.82 |
| 2.1316101069999998 | -14.084 |
| 2.1318327640000003 | -14.339 |
| 2.13205542 | -14.47 |
| 2.132278076 | -14.461 |
| 2.1325009770000003 | -14.336 |
| 2.132723633 | -14.03 |
| 2.1329465329999997 | -13.703 |
| 2.133169434 | -13.229 |
| 2.1333923340000003 | -12.838 |
| 2.133615479 | -12.31 |
| 2.1338383789999997 | -11.88 |
| 2.134061768 | -11.379 |
| 2.134284912 | -10.995 |
| 2.134508057 | -10.578 |
| 2.134731201 | -10.251 |
| 2.13495459 | -9.967 |
| 2.135177734 | -9.74 |
| 2.1354011230000003 | -9.608 |
| 2.1356245119999997 | -9.47 |
| 2.1358479000000004 | -9.453 |
| 2.136071533 | -9.438 |
| 2.1362949220000003 | -9.545 |
| 2.1365185550000003 | -9.623 |
| 2.1367421880000004 | -9.842 |
| 2.136966064 | -10.054 |
| 2.1371896969999997 | -10.353 |
| 2.137413574 | -10.664 |
| 2.137637207 | -10.993 |
| 2.1378610840000003 | -11.379 |
| 2.138084961 | -11.748 |
| 2.138309082 | -12.166 |
| 2.138533203 | -12.469 |
| 2.138757324 | -12.843 |
| 2.1389814449999998 | -13.01 |
| 2.1392055660000002 | -13.167 |
| 2.1394296880000003 | -13.059 |
| 2.139654053 | -12.939 |
| 2.139878418 | -12.627 |
| 2.1401027829999997 | -12.311 |
| 2.140327148 | -11.919 |
| 2.140551514 | -11.531 |
| 2.140775879 | -11.188 |
| 2.141000488 | -10.832 |
| 2.141225098 | -10.532 |
| 2.141449707 | -10.208 |
| 2.141674316 | -10.04 |
| 2.1418991700000003 | -9.837 |
| 2.142123779 | -9.778 |
| 2.142348633 | -9.708 |
| 2.142573486 | -9.761 |
| 2.1427983399999997 | -9.847 |
| 2.143023682 | -10.009 |
| 2.143248535 | -10.222 |
| 2.143473633 | -10.503 |
| 2.14369873 | -10.901 |
| 2.143923828 | -11.273 |
| 2.14414917 | -11.781 |
| 2.144374268 | -12.231 |
| 2.1445996089999997 | -12.798 |
| 2.144824951 | -13.234 |
| 2.1450502929999997 | -13.708 |
| 2.1452758789999997 | -14.028 |
| 2.145501221 | -14.357 |
| 2.145726807 | -14.509 |
| 2.145952393 | -14.538 |
| 2.146177979 | -14.417 |
| 2.1464035640000003 | -14.172 |
| 2.1466293949999997 | -13.905 |
| 2.14685498 | -13.529 |
| 2.147080811 | -13.255 |
| 2.147306641 | -12.928 |
| 2.1475329590000003 | -12.756 |
| 2.147758789 | -12.549 |
| 2.147984863 | -12.473 |
| 2.148210938 | -12.418 |
| 2.148437012 | -12.501 |
| 2.148663086 | -12.643 |
| 2.148889404 | -12.863 |
| 2.149115479 | -13.211 |
| 2.149341797 | -13.595 |
| 2.149568115 | -14.122 |
| 2.149794434 | -14.609 |
| 2.1500209960000003 | -15.23 |
| 2.150247314 | -15.817 |
| 2.150473877 | -16.509 |
| 2.1507004390000004 | -17.041 |
| 2.150927246 | -17.504 |
| 2.1511538089999998 | -17.681 |
| 2.151380615 | -17.635 |
| 2.1516071780000003 | -17.293 |
| 2.151833984 | -16.838 |
| 2.152061279 | -16.351 |
| 2.152288086 | -15.887 |
| 2.152514893 | -15.523 |
| 2.152741943 | -15.14 |
| 2.1529689939999996 | -14.887 |
| 2.153196045 | -14.652 |
| 2.15342334 | -14.582 |
| 2.153650391 | -14.53 |
| 2.153877686 | -14.646 |
| 2.15410498 | -14.812 |
| 2.1543322750000002 | -15.074 |
| 2.154559814 | -15.392 |
| 2.154787109 | -15.71 |
| 2.155014648 | -16.109 |
| 2.1552421880000003 | -16.41 |
| 2.1554697270000003 | -16.735 |
| 2.1556972660000002 | -16.825 |
| 2.155925049 | -16.886 |
| 2.156152832 | -16.635 |
| 2.1563806150000002 | -16.299 |
| 2.156608643 | -15.778 |
| 2.156836426 | -15.305 |
| 2.157064453 | -14.82 |
| 2.157292236 | -14.418 |
| 2.1575202640000004 | -14.086 |
| 2.157748291 | -13.785 |
| 2.157976563 | -13.612 |
| 2.15820459 | -13.461 |
| 2.1584328609999996 | -13.456 |
| 2.158661133 | -13.473 |
| 2.158889404 | -13.659 |
| 2.1591176759999997 | -13.847 |
| 2.159346191 | -14.16 |
| 2.1595744629999998 | -14.466 |
| 2.159802979 | -14.838 |
| 2.160031494 | -15.252 |
| 2.1602602539999998 | -15.61 |
| 2.1604887699999997 | -15.942 |
| 2.160717529 | -16.104 |
| 2.160946289 | -16.213 |
| 2.161175293 | -16.003 |
| 2.161404053 | -15.754 |
| 2.161632813 | -15.289 |
| 2.161861816 | -14.903 |
| 2.16209082 | -14.442 |
| 2.1623198240000003 | -14.081 |
| 2.162548828 | -13.697 |
| 2.162778076 | -13.427 |
| 2.163007324 | -13.227 |
| 2.163236328 | -13.092 |
| 2.16346582 | -13.077 |
| 2.163695068 | -13.113 |
| 2.163924316 | -13.299 |
| 2.164153809 | -13.495 |
| 2.164383301 | -13.846 |
| 2.164612793 | -14.172 |
| 2.164842285 | -14.664 |
| 2.165072021 | -15.103 |
| 2.1653015140000003 | -15.572 |
| 2.16553125 | -15.942 |
| 2.16576123 | -16.227 |
| 2.1659909670000004 | -16.308 |
| 2.166220947 | -16.138 |
| 2.166450928 | -15.872 |
| 2.166680664 | -15.441 |
| 2.1669108890000004 | -15.1 |
| 2.167140869 | -14.694 |
| 2.1673708499999997 | -14.417 |
| 2.1676010740000002 | -14.13 |
| 2.167831299 | -14.01 |
| 2.168061523 | -13.914 |
| 2.168291748 | -13.949 |
| 2.168522217 | -14.066 |
| 2.168752441 | -14.275 |
| 2.16898291 | -14.576 |
| 2.169213379 | -14.889 |
| 2.169443848 | -15.285 |
| 2.169674561 | -15.629 |
| 2.169905273 | -16.052 |
| 2.170135742 | -16.286 |
| 2.170366699 | -16.52 |
| 2.170597656 | -16.539 |
| 2.1708283689999996 | -16.488 |
| 2.171059326 | -16.207 |
| 2.171290283 | -15.923 |
| 2.17152124 | -15.602 |
| 2.171752197 | -15.331 |
| 2.171983398 | -15.141 |
| 2.172214355 | -14.965 |
| 2.172445557 | -14.925 |
| 2.172676758 | -14.907 |
| 2.172908203 | -15.055 |
| 2.173139404 | -15.212 |
| 2.17337085 | -15.551 |
| 2.1736022950000002 | -15.87 |
| 2.17383374 | -16.262 |
| 2.174065186 | -16.581 |
| 2.174296875 | -16.857 |
| 2.17452832 | -17.075 |
| 2.17476001 | -17.132 |
| 2.174991943 | -17.104 |
| 2.175223877 | -16.854 |
| 2.175455566 | -16.625 |
| 2.1756875 | -16.231 |
| 2.175919434 | -15.917 |
| 2.176151367 | -15.551 |
| 2.176383301 | -15.351 |
| 2.176615479 | -15.163 |
| 2.176847412 | -15.114 |
| 2.17707959 | -15.117 |
| 2.177311768 | -15.198 |
| 2.1775441890000002 | -15.361 |
| 2.177776367 | -15.539 |
| 2.178008789 | -15.761 |
| 2.178241211 | -15.887 |
| 2.178473633 | -16.033 |
| 2.178706055 | -15.949 |
| 2.178938721 | -15.863 |
| 2.179171387 | -15.554 |
| 2.1794040530000003 | -15.274 |
| 2.179636963 | -14.906 |
| 2.1798696289999997 | -14.582 |
| 2.180102539 | -14.227 |
| 2.180335449 | -13.949 |
| 2.180568359 | -13.736 |
| 2.18080127 | -13.561 |
| 2.18103418 | -13.51 |
| 2.181267334 | -13.468 |
| 2.181500488 | -13.576 |
| 2.181733643 | -13.645 |
| 2.181966797 | -13.82 |
| 2.182199951 | -13.906 |
| 2.1824333499999997 | -14.052 |
| 2.182666748 | -14.081 |
| 2.182900146 | -14.055 |
| 2.183133545 | -13.897 |
| 2.183366943 | -13.656 |
| 2.183600586 | -13.4 |
| 2.183834229 | -13.063 |
| 2.1840678710000003 | -12.822 |
| 2.184301758 | -12.533 |
| 2.1845354 | -12.4 |
| 2.184769287 | -12.254 |
| 2.1850031739999998 | -12.233 |
| 2.1852370609999996 | -12.222 |
| 2.1854709469999998 | -12.341 |
| 2.185705078 | -12.457 |
| 2.1859389649999996 | -12.606 |
| 2.186173096 | -12.769 |
| 2.186407227 | -12.863 |
| 2.1866416020000004 | -12.982 |
| 2.186875732 | -12.947 |
| 2.187110107 | -12.931 |
| 2.187344482 | -12.766 |
| 2.187578857 | -12.672 |
| 2.187813232 | -12.43 |
| 2.188047852 | -12.263 |
| 2.188282471 | -12.063 |
| 2.18851709 | -11.95 |
| 2.188751709 | -11.873 |
| 2.1889865719999997 | -11.855 |
| 2.189221436 | -11.919 |
| 2.189456055 | -11.997 |
| 2.1896909179999997 | -12.185 |
| 2.189926025 | -12.305 |
| 2.1901608890000004 | -12.532 |
| 2.1903957519999997 | -12.655 |
| 2.1906308589999997 | -12.814 |
| 2.190865967 | -12.784 |
| 2.191101318 | -12.772 |
| 2.191336426 | -12.633 |
| 2.191571777 | -12.498 |
| 2.191806885 | -12.35 |
| 2.192042236 | -12.193 |
| 2.1922778320000003 | -12.103 |
| 2.192513184 | -12.025 |
| 2.192748779 | -12.057 |
| 2.192984375 | -12.054 |
| 2.193219971 | -12.207 |
| 2.193455566 | -12.305 |
| 2.1936916500000003 | -12.506 |
| 2.1939272460000003 | -12.621 |
| 2.194163086 | -12.775 |
| 2.194398926 | -12.846 |
| 2.19463501 | -12.914 |
| 2.1948708499999996 | -12.914 |
| 2.195106934 | -12.825 |
| 2.195343018 | -12.767 |
| 2.195579102 | -12.609 |
| 2.195815186 | -12.521 |
| 2.196051514 | -12.371 |
| 2.1962878420000003 | -12.358 |
| 2.19652417 | -12.301 |
| 2.196760498 | -12.376 |
| 2.196996826 | -12.411 |
| 2.197233398 | -12.528 |
| 2.197469971 | -12.653 |
| 2.197706543 | -12.779 |
| 2.197943115 | -12.864 |
| 2.198179688 | -12.867 |
| 2.198416748 | -12.876 |
| 2.1986535640000002 | -12.721 |
| 2.198890381 | -12.623 |
| 2.1991271969999997 | -12.4 |
| 2.199364258 | -12.275 |
| 2.199601318 | -12.108 |
| 2.199838135 | -12.03 |
| 2.2000754390000004 | -11.926 |
| 2.2003125 | -11.924 |
| 2.200549561 | -11.943 |
| 2.200786865 | -11.974 |
| 2.20102417 | -12.047 |
| 2.201261475 | -12.065 |
| 2.2014990229999998 | -12.129 |
| 2.201736328 | -12.079 |
| 2.201973877 | -12.072 |
| 2.202211426 | -11.931 |
| 2.202448975 | -11.877 |
| 2.202686768 | -11.72 |
| 2.2029243160000003 | -11.611 |
| 2.2031623540000003 | -11.461 |
| 2.203400146 | -11.387 |
| 2.203638184 | -11.335 |
| 2.203875977 | -11.306 |
| 2.2041140140000004 | -11.345 |
| 2.204352051 | -11.354 |
| 2.204590088 | -11.471 |
| 2.204828125 | -11.496 |
| 2.205066406 | -11.588 |
| 2.205304443 | -11.553 |
| 2.205542725 | -11.598 |
| 2.205781006 | -11.492 |
| 2.206019531 | -11.412 |
| 2.206257813 | -11.282 |
| 2.206496338 | -11.175 |
| 2.2067348630000003 | -11.108 |
| 2.2069733890000003 | -11.043 |
| 2.207212158 | -11.055 |
| 2.207450928 | -11.061 |
| 2.207689453 | -11.192 |
| 2.2079284670000003 | -11.235 |
| 2.20816748 | -11.385 |
| 2.20840625 | -11.436 |
| 2.2086452640000003 | -11.548 |
| 2.208884277 | -11.528 |
| 2.209123291 | -11.514 |
| 2.209362305 | -11.438 |
| 2.209601563 | -11.37 |
| 2.2098408199999997 | -11.33 |
| 2.210080078 | -11.246 |
| 2.210319336 | -11.256 |
| 2.210558594 | -11.235 |
| 2.210798096 | -11.337 |
| 2.211037598 | -11.364 |
| 2.2112770999999998 | -11.515 |
| 2.211516602 | -11.58 |
| 2.211756104 | -11.714 |
| 2.2119958499999997 | -11.77 |
| 2.212235596 | -11.823 |
| 2.212475586 | -11.853 |
| 2.212715332 | -11.864 |
| 2.212955322 | -11.87 |
| 2.2131953130000004 | -11.802 |
| 2.2134353030000002 | -11.833 |
| 2.2136752929999997 | -11.803 |
| 2.213915283 | -11.887 |
| 2.214155518 | -11.903 |
| 2.214395508 | -12.026 |
| 2.214635742 | -12.096 |
| 2.214876221 | -12.244 |
| 2.215116455 | -12.313 |
| 2.215356934 | -12.396 |
| 2.215597412 | -12.469 |
| 2.215837891 | -12.477 |
| 2.216078369 | -12.488 |
| 2.216319092 | -12.41 |
| 2.21655957 | -12.425 |
| 2.216800293 | -12.369 |
| 2.217041016 | -12.436 |
| 2.217282227 | -12.437 |
| 2.217522949 | -12.557 |
| 2.217763916 | -12.652 |
| 2.218004883 | -12.798 |
| 2.2182458499999997 | -12.88 |
| 2.218487061 | -12.968 |
| 2.218728271 | -13.034 |
| 2.218969238 | -12.991 |
| 2.219210449 | -12.958 |
| 2.219451904 | -12.824 |
| 2.219693115 | -12.789 |
| 2.21993457 | -12.703 |
| 2.220176025 | -12.72 |
| 2.22041748 | -12.682 |
| 2.22065918 | -12.778 |
| 2.220900635 | -12.847 |
| 2.221142334 | -12.961 |
| 2.2213840329999996 | -13.057 |
| 2.221625732 | -13.139 |
| 2.221867676 | -13.213 |
| 2.222109619 | -13.198 |
| 2.222351563 | -13.214 |
| 2.222593506 | -13.118 |
| 2.222835693 | -13.132 |
| 2.223077637 | -13.057 |
| 2.2233198240000003 | -13.071 |
| 2.223562012 | -13.053 |
| 2.2238041990000004 | -13.15 |
| 2.224046387 | -13.212 |
| 2.224288818 | -13.315 |
| 2.22453125 | -13.405 |
| 2.224773682 | -13.459 |
| 2.225016113 | -13.571 |
| 2.225258789 | -13.577 |
| 2.225501221 | -13.625 |
| 2.225743896 | -13.571 |
| 2.2259865719999996 | -13.623 |
| 2.226229492 | -13.56 |
| 2.226472168 | -13.609 |
| 2.2267150879999997 | -13.608 |
| 2.2269582519999997 | -13.699 |
| 2.227201172 | -13.788 |
| 2.227444336 | -13.904 |
| 2.2276872560000003 | -14.036 |
| 2.2279304200000003 | -14.153 |
| 2.2281735840000003 | -14.325 |
| 2.228416992 | -14.367 |
| 2.228660156 | -14.486 |
| 2.2289035640000003 | -14.498 |
| 2.2291469729999998 | -14.6 |
| 2.229390381 | -14.589 |
| 2.229633789 | -14.672 |
| 2.229877441 | -14.705 |
| 2.2301210940000002 | -14.824 |
| 2.2303647460000002 | -14.936 |
| 2.2306083979999998 | -15.048 |
| 2.230852295 | -15.187 |
| 2.2310959469999996 | -15.301 |
| 2.2313398440000003 | -15.453 |
| 2.23158374 | -15.485 |
| 2.231828125 | -15.631 |
| 2.232072021 | -15.667 |
| 2.232316162 | -15.794 |
| 2.232560303 | -15.841 |
| 2.232804443 | -15.981 |
| 2.233048828 | -16.099 |
| 2.233293213 | -16.288 |
| 2.233537354 | -16.448 |
| 2.233781982 | -16.6 |
| 2.234026367 | -16.782 |
| 2.234270752 | -16.876 |
| 2.234515381 | -16.99 |
| 2.23476001 | -16.999 |
| 2.235004639 | -17.104 |
| 2.2352495119999998 | -17.131 |
| 2.235494141 | -17.261 |
| 2.2357390140000004 | -17.338 |
| 2.2359838869999997 | -17.498 |
| 2.2362290039999997 | -17.654 |
| 2.236473877 | -17.841 |
| 2.236719238 | -17.955 |
| 2.236964355 | -18.039 |
| 2.237209473 | -18.144 |
| 2.23745459 | -18.147 |
| 2.237699951 | -18.218 |
| 2.237945313 | -18.219 |
| 2.238190674 | -18.325 |
| 2.2384360350000003 | -18.415 |
| 2.238681885 | -18.592 |
| 2.2389272460000003 | -18.729 |
| 2.2391728520000003 | -18.973 |
| 2.239418701 | -19.192 |
| 2.239664307 | -19.33 |
| 2.239910156 | -19.484 |
| 2.2401557619999997 | -19.531 |
| 2.240401611 | -19.632 |
| 2.2406477049999998 | -19.666 |
| 2.240893555 | -19.729 |
| 2.241139648 | -19.733 |
| 2.241385742 | -19.891 |
| 2.24163208 | -20.029 |
| 2.241878174 | -20.233 |
| 2.2421245119999997 | -20.478 |
| 2.24237085 | -20.695 |
| 2.242617188 | -20.93 |
| 2.242863525 | -21.122 |
| 2.243110107 | -21.278 |
| 2.243356445 | -21.38 |
| 2.2436030270000002 | -21.562 |
| 2.2438496089999997 | -21.673 |
| 2.244096436 | -21.895 |
| 2.244343018 | -22.088 |
| 2.244589844 | -22.378 |
| 2.24483667 | -22.689 |
| 2.2450834960000003 | -23.06 |
| 2.2453305660000002 | -23.308 |
| 2.245577637 | -23.675 |
| 2.245824707 | -24.007 |
| 2.246071777 | -24.228 |
| 2.246318848 | -24.371 |
| 2.246566406 | -24.38 |
| 2.246813721 | -24.54 |
| 2.247061035 | -24.541 |
| 2.24730835 | -24.586 |
| 2.247555664 | -24.625 |
| 2.247803223 | -24.798 |
| 2.248050781 | -24.834 |
| 2.24829834 | -24.917 |
| 2.2485458979999997 | -24.998 |
| 2.248793701 | -25.177 |
| 2.249041504 | -25.336 |
| 2.249289307 | -25.448 |
| 2.249537109 | -25.529 |
| 2.2497851559999997 | -25.584 |
| 2.2500329590000003 | -25.562 |
| 2.2502810060000003 | -25.568 |
| 2.250529297 | -25.517 |
| 2.2507773440000003 | -25.569 |
| 2.251025635 | -25.56 |
| 2.251273682 | -25.441 |
| 2.251522461 | -25.396 |
| 2.251770752 | -25.337 |
| 2.2520190429999998 | -25.371 |
| 2.252267578 | -25.396 |
| 2.252516113 | -25.421 |
| 2.252764648 | -25.508 |
| 2.253013428 | -25.735 |
| 2.253261963 | -25.748 |
| 2.253510742 | -25.762 |
| 2.253759521 | -25.708 |
| 2.254008545 | -25.524 |
| 2.254257324 | -25.25 |
| 2.254506348 | -24.885 |
| 2.2547553710000003 | -24.511 |
| 2.255004395 | -24.311 |
| 2.255253662 | -24.045 |
| 2.255502686 | -23.773 |
| 2.255751953 | -23.613 |
| 2.256001221 | -23.513 |
| 2.256250732 | -23.385 |
| 2.2565002439999997 | -23.33 |
| 2.256749756 | -23.165 |
| 2.256999268 | -23.12 |
| 2.257248779 | -22.976 |
| 2.2574985350000003 | -22.811 |
| 2.257748047 | -22.551 |
| 2.2579978030000003 | -22.331 |
| 2.258247803 | -22.136 |
| 2.258497559 | -21.868 |
| 2.2587473140000003 | -21.618 |
| 2.258997314 | -21.267 |
| 2.259247314 | -21.062 |
| 2.2594975589999997 | -20.773 |
| 2.259747559 | -20.628 |
| 2.259997803 | -20.349 |
| 2.260248047 | -20.209 |
| 2.2604982909999998 | -19.966 |
| 2.260748779 | -19.75 |
| 2.2609990229999997 | -19.51 |
| 2.261249512 | -19.323 |
| 2.261500244 | -19.153 |
| 2.261750732 | -18.959 |
| 2.262001465 | -18.811 |
| 2.2622521969999996 | -18.574 |
| 2.26250293 | -18.435 |
| 2.262753662 | -18.189 |
| 2.263004639 | -18.032 |
| 2.263255371 | -17.777 |
| 2.263506348 | -17.658 |
| 2.263757324 | -17.474 |
| 2.2640085450000003 | -17.362 |
| 2.264259521 | -17.235 |
| 2.264510742 | -17.123 |
| 2.2647619629999998 | -17.061 |
| 2.265013428 | -16.951 |
| 2.265264648 | -16.86 |
| 2.2655161130000003 | -16.696 |
| 2.265767578 | -16.627 |
| 2.2660190429999996 | -16.421 |
| 2.266270508 | -16.316 |
| 2.266522461 | -16.128 |
| 2.26677417 | -16.014 |
| 2.2670258789999997 | -15.863 |
| 2.267277588 | -15.748 |
| 2.267529541 | -15.612 |
| 2.267781494 | -15.507 |
| 2.2680334469999996 | -15.427 |
| 2.2682854000000003 | -15.279 |
| 2.268537598 | -15.202 |
| 2.268789551 | -15.046 |
| 2.2690417480000002 | -14.972 |
| 2.269294189 | -14.803 |
| 2.2695463869999997 | -14.719 |
| 2.269798828 | -14.555 |
| 2.2700512699999997 | -14.495 |
| 2.270303711 | -14.389 |
| 2.270556152 | -14.302 |
| 2.2708088379999998 | -14.216 |
| 2.271061279 | -14.123 |
| 2.271313965 | -14.05 |
| 2.271567139 | -13.891 |
| 2.271819824 | -13.805 |
| 2.272072754 | -13.621 |
| 2.272325684 | -13.554 |
| 2.2725786130000003 | -13.401 |
| 2.2728315429999997 | -13.334 |
| 2.273084717 | -13.229 |
| 2.273337891 | -13.192 |
| 2.273591064 | -13.09 |
| 2.273844238 | -12.98 |
| 2.274097656 | -12.895 |
| 2.274351074 | -12.77 |
| 2.274604492 | -12.696 |
| 2.27485791 | -12.55 |
| 2.275111328 | -12.494 |
| 2.27536499 | -12.378 |
| 2.275618652 | -12.361 |
| 2.2758723140000003 | -12.229 |
| 2.276126221 | -12.174 |
| 2.276379883 | -12.073 |
| 2.2766340329999997 | -12.007 |
| 2.2768879390000003 | -11.904 |
| 2.27714209 | -11.809 |
| 2.277395996 | -11.747 |
| 2.277650146 | -11.643 |
| 2.277904297 | -11.617 |
| 2.2781584469999996 | -11.491 |
| 2.2784128420000003 | -11.47 |
| 2.278667236 | -11.381 |
| 2.2789216310000002 | -11.365 |
| 2.2791760250000004 | -11.243 |
| 2.27943042 | -11.217 |
| 2.2796850589999997 | -11.135 |
| 2.2799396969999997 | -11.068 |
| 2.280194336 | -11.004 |
| 2.2804489749999997 | -10.912 |
| 2.280703857 | -10.88 |
| 2.28095874 | -10.811 |
| 2.281213623 | -10.792 |
| 2.281468506 | -10.675 |
| 2.281723877 | -10.693 |
| 2.2819790039999996 | -10.602 |
| 2.282234131 | -10.584 |
| 2.282489258 | -10.488 |
| 2.282744385 | -10.444 |
| 2.282999756 | -10.36 |
| 2.283255127 | -10.3 |
| 2.283510498 | -10.233 |
| 2.283766113 | -10.144 |
| 2.2840214839999997 | -10.143 |
| 2.2842770999999997 | -10.061 |
| 2.2845327149999997 | -10.041 |
| 2.28478833 | -9.946 |
| 2.285044189 | -9.951 |
| 2.285300049 | -9.833 |
| 2.2855559079999996 | -9.797 |
| 2.285811768 | -9.684 |
| 2.286067871 | -9.64 |
| 2.28632373 | -9.596 |
| 2.2865798340000003 | -9.552 |
| 2.286836426 | -9.504 |
| 2.287092529 | -9.446 |
| 2.287348877 | -9.451 |
| 2.2876052249999996 | -9.344 |
| 2.2878615719999997 | -9.33 |
| 2.2881179200000004 | -9.213 |
| 2.288374512 | -9.196 |
| 2.2886311040000002 | -9.103 |
| 2.288887695 | -9.082 |
| 2.289144287 | -9.003 |
| 2.289401123 | -8.995 |
| 2.289657959 | -8.968 |
| 2.289914795 | -8.906 |
| 2.290171631 | -8.88 |
| 2.290428711 | -8.814 |
| 2.290685547 | -8.799 |
| 2.2909426269999997 | -8.695 |
| 2.291199951 | -8.685 |
| 2.2914570309999998 | -8.595 |
| 2.291714355 | -8.622 |
| 2.291971924 | -8.563 |
| 2.292229248 | -8.549 |
| 2.2924865719999996 | -8.492 |
| 2.292744141 | -8.487 |
| 2.2930017090000003 | -8.445 |
| 2.293259277 | -8.38 |
| 2.293516846 | -8.368 |
| 2.293774658 | -8.286 |
| 2.294032471 | -8.294 |
| 2.2942902829999996 | -8.203 |
| 2.294548096 | -8.201 |
| 2.294806152 | -8.124 |
| 2.2950639649999998 | -8.154 |
| 2.2953222660000003 | -8.082 |
| 2.2955803219999997 | -8.076 |
| 2.2958383789999997 | -8.052 |
| 2.2960966800000002 | -8.021 |
| 2.2963549800000003 | -7.984 |
| 2.296613281 | -7.901 |
| 2.296871826 | -7.876 |
| 2.297130371 | -7.804 |
| 2.297388916 | -7.826 |
| 2.297647461 | -7.739 |
| 2.29790625 | -7.757 |
| 2.298165039 | -7.713 |
| 2.298423584 | -7.73 |
| 2.298682617 | -7.652 |
| 2.298941406 | -7.628 |
| 2.299200195 | -7.571 |
| 2.299459229 | -7.528 |
| 2.299718262 | -7.508 |
| 2.299977539 | -7.44 |
| 2.3002365719999998 | -7.456 |
| 2.30049585 | -7.412 |
| 2.300755127 | -7.433 |
| 2.301014404 | -7.342 |
| 2.301273926 | -7.373 |
| 2.3015334469999997 | -7.303 |
| 2.301792969 | -7.298 |
| 2.30205249 | -7.235 |
| 2.302312256 | -7.207 |
| 2.302572021 | -7.19 |
| 2.302831787 | -7.169 |
| 2.3030915530000002 | -7.159 |
| 2.303351563 | -7.096 |
| 2.303611328 | -7.135 |
| 2.303871338 | -7.082 |
| 2.304131348 | -7.103 |
| 2.304391602 | -7.03 |
| 2.3046516109999997 | -7.047 |
| 2.3049118650000002 | -6.984 |
| 2.305172119 | -6.984 |
| 2.305432617 | -6.921 |
| 2.305692871 | -6.901 |
| 2.305953369 | -6.909 |
| 2.306213867 | -6.887 |
| 2.306474609 | -6.891 |
| 2.306735107 | -6.851 |
| 2.30699585 | -6.888 |
| 2.3072565920000003 | -6.803 |
| 2.307517578 | -6.812 |
| 2.3077785640000004 | -6.719 |
| 2.308039551 | -6.733 |
| 2.308300537 | -6.698 |
| 2.308561523 | -6.702 |
| 2.30882251 | -6.662 |
| 2.30908374 | -6.668 |
| 2.309344971 | -6.679 |
| 2.3096062010000002 | -6.625 |
| 2.3098676759999996 | -6.628 |
| 2.310128906 | -6.558 |
| 2.3103903810000004 | -6.581 |
| 2.3106521 | -6.518 |
| 2.310913574 | -6.534 |
| 2.311175293 | -6.464 |
| 2.311437012 | -6.505 |
| 2.3116987300000003 | -6.475 |
| 2.3119604490000003 | -6.47 |
| 2.312222412 | -6.456 |
| 2.312484375 | -6.453 |
| 2.3127465820000004 | -6.453 |
| 2.313008545 | -6.397 |
| 2.3132707519999998 | -6.406 |
| 2.313532959 | -6.337 |
| 2.313795166 | -6.384 |
| 2.3140573730000003 | -6.326 |
| 2.314319824 | -6.345 |
| 2.3145822750000002 | -6.308 |
| 2.314844727 | -6.363 |
| 2.3151071780000003 | -6.327 |
| 2.3153698730000003 | -6.321 |
| 2.315632324 | -6.307 |
| 2.31589502 | -6.27 |
| 2.3161579590000003 | -6.28 |
| 2.316420654 | -6.222 |
| 2.316683594 | -6.234 |
| 2.316946533 | -6.193 |
| 2.3172094729999997 | -6.258 |
| 2.317472656 | -6.196 |
| 2.3177358399999997 | -6.235 |
| 2.317999268 | -6.206 |
| 2.318262451 | -6.22 |
| 2.3185258789999996 | -6.18 |
| 2.318789063 | -6.161 |
| 2.3190524900000002 | -6.148 |
| 2.3193161620000002 | -6.129 |
| 2.31957959 | -6.155 |
| 2.319843262 | -6.095 |
| 2.320106934 | -6.134 |
| 2.320370605 | -6.112 |
| 2.320634277 | -6.161 |
| 2.320898193 | -6.096 |
| 2.321162109 | -6.133 |
| 2.321426025 | -6.087 |
| 2.3216901859999997 | -6.096 |
| 2.3219541020000003 | -6.068 |
| 2.322218262 | -6.04 |
| 2.322482666 | -6.053 |
| 2.322746826 | -6.054 |
| 2.32301123 | -6.086 |
| 2.3232758789999997 | -6.038 |
| 2.323540283 | -6.103 |
| 2.323804688 | -6.052 |
| 2.324069336 | -6.081 |
| 2.324333984 | -6.023 |
| 2.324598633 | -6.041 |
| 2.324863281 | -6.02 |
| 2.325128174 | -6.043 |
| 2.325393066 | -6.025 |
| 2.325657959 | -6.014 |
| 2.325922852 | -6.06 |
| 2.326187988 | -6.044 |
| 2.326453125 | -6.072 |
| 2.326718262 | -6.027 |
| 2.326983643 | -6.076 |
| 2.327248779 | -6.021 |
| 2.32751416 | -6.054 |
| 2.327779541 | -5.989 |
| 2.328045166 | -6.017 |
| 2.328310547 | -6.021 |
| 2.3285764159999998 | -6.046 |
| 2.3288420409999997 | -6.046 |
| 2.3291079100000003 | -6.05 |
| 2.329373535 | -6.091 |
| 2.329639404 | -6.038 |
| 2.329905273 | -6.069 |
| 2.330171387 | -6.004 |
| 2.330437256 | -6.055 |
| 2.3307033689999996 | -6.022 |
| 2.330969482 | -6.058 |
| 2.331235596 | -6.018 |
| 2.331501953 | -6.069 |
| 2.331768311 | -6.078 |
| 2.332034668 | -6.074 |
| 2.332301025 | -6.088 |
| 2.332567627 | -6.074 |
| 2.332834229 | -6.11 |
| 2.33310083 | -6.068 |
| 2.333367432 | -6.092 |
| 2.333634521 | -6.038 |
| 2.3339013669999997 | -6.11 |
| 2.334168213 | -6.088 |
| 2.334435059 | -6.133 |
| 2.334702148 | -6.12 |
| 2.3349692380000002 | -6.169 |
| 2.335236328 | -6.158 |
| 2.3355034179999996 | -6.145 |
| 2.3357707519999997 | -6.15 |
| 2.336038086 | -6.121 |
| 2.33630542 | -6.177 |
| 2.3365727539999996 | -6.139 |
| 2.3368403320000004 | -6.183 |
| 2.3371079100000003 | -6.161 |
| 2.337375488 | -6.242 |
| 2.337643066 | -6.198 |
| 2.337910889 | -6.242 |
| 2.338178711 | -6.231 |
| 2.338446533 | -6.253 |
| 2.338714355 | -6.254 |
| 2.3389826659999997 | -6.232 |
| 2.339250732 | -6.239 |
| 2.339518799 | -6.235 |
| 2.339786865 | -6.302 |
| 2.340055176 | -6.263 |
| 2.340323486 | -6.334 |
| 2.340591797 | -6.316 |
| 2.340860107 | -6.374 |
| 2.341128662 | -6.33 |
| 2.3413972170000004 | -6.356 |
| 2.3416657709999997 | -6.333 |
| 2.341934326 | -6.36 |
| 2.342203125 | -6.375 |
| 2.342471924 | -6.356 |
| 2.342740723 | -6.405 |
| 2.343009521 | -6.414 |
| 2.3432785640000002 | -6.468 |
| 2.343547607 | -6.429 |
| 2.3438166500000004 | -6.501 |
| 2.344085693 | -6.466 |
| 2.3443552249999997 | -6.516 |
| 2.3446245119999998 | -6.48 |
| 2.344893799 | -6.495 |
| 2.3451633299999997 | -6.505 |
| 2.3454326169999997 | -6.549 |
| 2.345702148 | -6.567 |
| 2.34597168 | -6.563 |
| 2.346241455 | -6.635 |
| 2.3465109859999997 | -6.615 |
| 2.346780762 | -6.669 |
| 2.347050781 | -6.624 |
| 2.347320557 | -6.673 |
| 2.347590576 | -6.649 |
| 2.347860596 | -6.705 |
| 2.348130615 | -6.677 |
| 2.348400635 | -6.713 |
| 2.348670898 | -6.757 |
| 2.348941162 | -6.778 |
| 2.3492114259999997 | -6.804 |
| 2.349481934 | -6.803 |
| 2.349752686 | -6.859 |
| 2.350023193 | -6.824 |
| 2.350293701 | -6.873 |
| 2.3505642090000003 | -6.821 |
| 2.350834961 | -6.883 |
| 2.351105713 | -6.891 |
| 2.351376709 | -6.945 |
| 2.351647461 | -6.93 |
| 2.351918457 | -6.987 |
| 2.352189453 | -7.019 |
| 2.352460449 | -7.019 |
| 2.352731689 | -7.055 |
| 2.35300293 | -7.026 |
| 2.35327417 | -7.083 |
| 2.35354541 | -7.065 |
| 2.353816895 | -7.118 |
| 2.354088135 | -7.085 |
| 2.354359863 | -7.184 |
| 2.354631348 | -7.187 |
| 2.354902832 | -7.232 |
| 2.3551748050000003 | -7.241 |
| 2.355446777 | -7.277 |
| 2.355718506 | -7.299 |
| 2.355990479 | -7.292 |
| 2.3562622070000003 | -7.32 |
| 2.356534424 | -7.3 |
| 2.356806396 | -7.389 |
| 2.357078613 | -7.373 |
| 2.3573508299999997 | -7.43 |
| 2.357623047 | -7.422 |
| 2.357895264 | -7.517 |
| 2.358167725 | -7.5 |
| 2.3584401859999997 | -7.545 |
| 2.358712646 | -7.54 |
| 2.3589853520000004 | -7.555 |
| 2.359257813 | -7.596 |
| 2.359530518 | -7.588 |
| 2.3598032229999997 | -7.633 |
| 2.360076172 | -7.642 |
| 2.360349121 | -7.743 |
| 2.360622314 | -7.71 |
| 2.3608952640000003 | -7.789 |
| 2.361168457 | -7.778 |
| 2.361441406 | -7.843 |
| 2.361714844 | -7.834 |
| 2.361988037 | -7.859 |
| 2.36226123 | -7.869 |
| 2.362534668 | -7.911 |
| 2.362808105 | -7.967 |
| 2.363081787 | -7.957 |
| 2.363355225 | -8.035 |
| 2.3636289059999998 | -8.049 |
| 2.3639025879999997 | -8.133 |
| 2.3641765140000004 | -8.102 |
| 2.364450195 | -8.166 |
| 2.364724121 | -8.145 |
| 2.364998047 | -8.211 |
| 2.3652722170000002 | -8.216 |
| 2.3655463869999998 | -8.242 |
| 2.365820313 | -8.288 |
| 2.366094971 | -8.335 |
| 2.3663691410000003 | -8.389 |
| 2.366643555 | -8.388 |
| 2.366917969 | -8.475 |
| 2.367192383 | -8.462 |
| 2.367467041 | -8.532 |
| 2.367741699 | -8.5 |
| 2.368016357 | -8.552 |
| 2.368291016 | -8.568 |
| 2.368565674 | -8.647 |
| 2.368840576 | -8.649 |
| 2.369115479 | -8.697 |
| 2.369390625 | -8.763 |
| 2.369665527 | -8.793 |
| 2.369940674 | -8.846 |
| 2.37021582 | -8.832 |
| 2.370491211 | -8.894 |
| 2.370766357 | -8.884 |
| 2.371041748 | -8.964 |
| 2.3713171390000003 | -8.934 |
| 2.371593018 | -9.026 |
| 2.3718686520000003 | -9.058 |
| 2.3721442870000002 | -9.13 |
| 2.372419922 | -9.144 |
| 2.372695557 | -9.192 |
| 2.372971436 | -9.247 |
| 2.3732473140000003 | -9.253 |
| 2.373523193 | -9.315 |
| 2.373799316 | -9.286 |
| 2.3740754390000003 | -9.378 |
| 2.3743515630000003 | -9.386 |
| 2.3746276859999997 | -9.462 |
| 2.3749040530000003 | -9.459 |
| 2.3751801759999998 | -9.575 |
| 2.375456787 | -9.604 |
| 2.375733154 | -9.656 |
| 2.376009766 | -9.681 |
| 2.3762861330000002 | -9.695 |
| 2.3765629880000003 | -9.757 |
| 2.3768396 | -9.774 |
| 2.377116699 | -9.83 |
| 2.3773935550000003 | -9.826 |
| 2.3776704100000003 | -9.94 |
| 2.37794751 | -9.943 |
| 2.378224365 | -10.033 |
| 2.378501465 | -10.049 |
| 2.378778809 | -10.141 |
| 2.3790559079999998 | -10.153 |
| 2.379333252 | -10.194 |
| 2.379610596 | -10.207 |
| 2.379887939 | -10.237 |
| 2.380165527 | -10.327 |
| 2.380443115 | -10.342 |
| 2.380720703 | -10.417 |
| 2.380998291 | -10.448 |
| 2.381276123 | -10.568 |
| 2.381553955 | -10.564 |
| 2.381831787 | -10.655 |
| 2.382109863 | -10.651 |
| 2.382387695 | -10.723 |
| 2.382666016 | -10.756 |
| 2.382944336 | -10.798 |
| 2.3832224120000003 | -10.83 |
| 2.383500732 | -10.897 |
| 2.383779053 | -10.989 |
| 2.384057373 | -10.995 |
| 2.384335938 | -11.098 |
| 2.384614502 | -11.109 |
| 2.384893066 | -11.216 |
| 2.385171631 | -11.214 |
| 2.385450439 | -11.29 |
| 2.385729248 | -11.288 |
| 2.386008057 | -11.381 |
| 2.386287109 | -11.417 |
| 2.3865659179999996 | -11.448 |
| 2.386844971 | -11.539 |
| 2.387124268 | -11.604 |
| 2.3874033199999998 | -11.695 |
| 2.387682617 | -11.69 |
| 2.387961914 | -11.789 |
| 2.3882414549999997 | -11.787 |
| 2.388520996 | -11.897 |
| 2.3888005370000003 | -11.898 |
| 2.389080078 | -11.967 |
| 2.389359619 | -12.016 |
| 2.389639404 | -12.113 |
| 2.389919189 | -12.162 |
| 2.3901989749999997 | -12.217 |
| 2.390479004 | -12.319 |
| 2.3907590329999997 | -12.341 |
| 2.391039063 | -12.429 |
| 2.3913190920000003 | -12.422 |
| 2.391599121 | -12.512 |
| 2.391879395 | -12.541 |
| 2.3921596679999997 | -12.656 |
| 2.392440186 | -12.656 |
| 2.392720459 | -12.763 |
| 2.3930009770000003 | -12.827 |
| 2.393281494 | -12.908 |
| 2.393562256 | -12.958 |
| 2.393843262 | -13.004 |
| 2.394124023 | -13.084 |
| 2.3944047850000003 | -13.12 |
| 2.394685547 | -13.222 |
| 2.394966553 | -13.22 |
| 2.395247559 | -13.34 |
| 2.395528564 | -13.374 |
| 2.395809814 | -13.491 |
| 2.396091064 | -13.506 |
| 2.396372314 | -13.619 |
| 2.396653564 | -13.671 |
| 2.396935059 | -13.738 |
| 2.3972165530000002 | -13.783 |
| 2.397498047 | -13.802 |
| 2.397779785 | -13.91 |
| 2.398061523 | -13.949 |
| 2.398343262 | -14.04 |
| 2.398625 | -14.075 |
| 2.398906738 | -14.222 |
| 2.399188721 | -14.263 |
| 2.399471191 | -14.359 |
| 2.3997531739999998 | -14.405 |
| 2.4000354 | -14.485 |
| 2.4003176269999997 | -14.539 |
| 2.400599854 | -14.612 |
| 2.4008820799999997 | -14.661 |
| 2.401164551 | -14.716 |
| 2.401447021 | -14.831 |
| 2.401729492 | -14.891 |
| 2.4020122070000003 | -14.969 |
| 2.402294922 | -15.025 |
| 2.402577637 | -15.126 |
| 2.4028603520000003 | -15.16 |
| 2.403143311 | -15.254 |
| 2.4034262699999998 | -15.261 |
| 2.403709229 | -15.373 |
| 2.403992188 | -15.436 |
| 2.404275391 | -15.528 |
| 2.404558594 | -15.589 |
| 2.4048420409999998 | -15.695 |
| 2.405125488 | -15.793 |
| 2.4054089359999997 | -15.84 |
| 2.405692383 | -15.929 |
| 2.4059760740000002 | -15.934 |
| 2.406259521 | -16.051 |
| 2.406543213 | -16.061 |
| 2.406826904 | -16.158 |
| 2.4071108399999996 | -16.154 |
| 2.407394775 | -16.303 |
| 2.407678711 | -16.372 |
| 2.407962646 | -16.442 |
| 2.408246826 | -16.553 |
| 2.408530762 | -16.622 |
| 2.408815186 | -16.732 |
| 2.409099365 | -16.714 |
| 2.409383789 | -16.803 |
| 2.409668213 | -16.768 |
| 2.409952637 | -16.907 |
| 2.4102370609999997 | -16.884 |
| 2.410521973 | -16.986 |
| 2.410806641 | -17.045 |
| 2.4110915530000003 | -17.126 |
| 2.411376221 | -17.208 |
| 2.411661133 | -17.234 |
| 2.411946045 | -17.351 |
| 2.412231201 | -17.347 |
| 2.412516113 | -17.477 |
| 2.41280127 | -17.459 |
| 2.41308667 | -17.553 |
| 2.413371826 | -17.578 |
| 2.4136572270000003 | -17.72 |
| 2.413942627 | -17.71 |
| 2.414228271 | -17.772 |
| 2.414513672 | -17.856 |
| 2.4147993160000003 | -17.852 |
| 2.415084961 | -17.939 |
| 2.41537085 | -17.947 |
| 2.415656738 | -18.019 |
| 2.4159426269999997 | -18.028 |
| 2.41622876 | -18.096 |
| 2.416514893 | -18.093 |
| 2.416800781 | -18.155 |
| 2.4170871579999997 | -18.225 |
| 2.417373291 | -18.28 |
| 2.4176596679999998 | -18.31 |
| 2.4179460450000003 | -18.313 |
| 2.418232422 | -18.322 |
| 2.418518799 | -18.315 |
| 2.41880542 | -18.32 |
| 2.419092041 | -18.331 |
| 2.419378906 | -18.361 |
| 2.4196655270000003 | -18.431 |
| 2.419952393 | -18.421 |
| 2.420239258 | -18.434 |
| 2.420526367 | -18.46 |
| 2.4208134770000003 | -18.503 |
| 2.421100586 | -18.518 |
| 2.421387695 | -18.508 |
| 2.421675049 | -18.51 |
| 2.421962646 | -18.505 |
| 2.42225 | -18.533 |
| 2.422537354 | -18.5 |
| 2.422824951 | -18.51 |
| 2.423112549 | -18.523 |
| 2.423400146 | -18.545 |
| 2.423687988 | -18.513 |
| 2.42397583 | -18.498 |
| 2.424263672 | -18.468 |
| 2.424551514 | -18.439 |
| 2.4248396 | -18.424 |
| 2.4251276859999997 | -18.35 |
| 2.425415771 | -18.332 |
| 2.425703857 | -18.358 |
| 2.4259921880000004 | -18.327 |
| 2.426280518 | -18.299 |
| 2.4265690920000003 | -18.263 |
| 2.426857422 | -18.255 |
| 2.427145996 | -18.196 |
| 2.42743457 | -18.186 |
| 2.4277236330000003 | -18.138 |
| 2.428012451 | -18.111 |
| 2.42830127 | -18.117 |
| 2.428590088 | -18.074 |
| 2.42887915 | -18.05 |
| 2.429168213 | -18.015 |
| 2.4294572750000003 | -18.024 |
| 2.4297463379999997 | -17.942 |
| 2.430035645 | -17.936 |
| 2.4303249510000002 | -17.828 |
| 2.430614258 | -17.778 |
| 2.4309038089999997 | -17.715 |
| 2.431193359 | -17.659 |
| 2.43148291 | -17.591 |
| 2.431772461 | -17.583 |
| 2.432062256 | -17.563 |
| 2.4323520509999996 | -17.536 |
| 2.432641846 | -17.542 |
| 2.432931885 | -17.526 |
| 2.433221924 | -17.515 |
| 2.433512207 | -17.418 |
| 2.4338022460000004 | -17.37 |
| 2.434092529 | -17.269 |
| 2.434382813 | -17.262 |
| 2.434673096 | -17.183 |
| 2.4349636230000002 | -17.133 |
| 2.43525415 | -17.021 |
| 2.4355446780000003 | -16.99 |
| 2.435835205 | -16.879 |
| 2.436125977 | -16.841 |
| 2.436416748 | -16.791 |
| 2.43670752 | -16.717 |
| 2.4369985350000003 | -16.696 |
| 2.437289307 | -16.587 |
| 2.4375805660000003 | -16.55 |
| 2.437871582 | -16.502 |
| 2.438162842 | -16.518 |
| 2.438454102 | -16.392 |
| 2.4387453609999996 | -16.375 |
| 2.439036621 | -16.294 |
| 2.439328369 | -16.255 |
| 2.4396198730000003 | -16.182 |
| 2.4399116210000003 | -16.123 |
| 2.440203125 | -16.052 |
| 2.440494873 | -16.003 |
| 2.440786865 | -15.961 |
| 2.441078613 | -15.871 |
| 2.441370605 | -15.867 |
| 2.4416625979999997 | -15.796 |
| 2.44195459 | -15.761 |
| 2.442246826 | -15.632 |
| 2.4425390630000003 | -15.61 |
| 2.442831299 | -15.546 |
| 2.443123779 | -15.518 |
| 2.44341626 | -15.436 |
| 2.44370874 | -15.375 |
| 2.444001465 | -15.351 |
| 2.444293945 | -15.322 |
| 2.44458667 | -15.286 |
| 2.4448796390000003 | -15.215 |
| 2.445172363 | -15.223 |
| 2.4454653320000004 | -15.114 |
| 2.4457583009999997 | -15.061 |
| 2.44605127 | -14.949 |
| 2.4463444819999998 | -14.916 |
| 2.4466379390000004 | -14.843 |
| 2.4469311520000003 | -14.817 |
| 2.447224609 | -14.729 |
| 2.447517822 | -14.677 |
| 2.447811279 | -14.667 |
| 2.44810498 | -14.634 |
| 2.448398682 | -14.59 |
| 2.448692383 | -14.49 |
| 2.448986084 | -14.483 |
| 2.4492797850000003 | -14.391 |
| 2.449573975 | -14.389 |
| 2.44986792 | -14.28 |
| 2.450161865 | -14.281 |
| 2.450456055 | -14.238 |
| 2.450750244 | -14.178 |
| 2.451044678 | -14.097 |
| 2.451338867 | -14.076 |
| 2.4516333009999998 | -14.039 |
| 2.451927734 | -13.952 |
| 2.4522224120000002 | -13.904 |
| 2.4525170899999997 | -13.789 |
| 2.452811768 | -13.792 |
| 2.453106445 | -13.727 |
| 2.453401367 | -13.73 |
| 2.453696289 | -13.653 |
| 2.453991211 | -13.664 |
| 2.454286377 | -13.59 |
| 2.454581299 | -13.539 |
| 2.454876465 | -13.481 |
| 2.455171875 | -13.428 |
| 2.455467285 | -13.394 |
| 2.4557626949999998 | -13.31 |
| 2.456058105 | -13.257 |
| 2.45635376 | -13.173 |
| 2.456649414 | -13.225 |
| 2.456945068 | -13.157 |
| 2.457240723 | -13.161 |
| 2.457536621 | -13.112 |
| 2.4578325199999997 | -13.106 |
| 2.458128418 | -13.024 |
| 2.4584245609999997 | -12.978 |
| 2.458720703 | -12.922 |
| 2.459016846 | -12.872 |
| 2.459313232 | -12.856 |
| 2.459609375 | -12.763 |
| 2.459905762 | -12.745 |
| 2.460202393 | -12.694 |
| 2.460498779 | -12.727 |
| 2.4607954100000002 | -12.646 |
| 2.4610922850000003 | -12.644 |
| 2.46138916 | -12.566 |
| 2.461685791 | -12.544 |
| 2.46198291 | -12.504 |
| 2.462279785 | -12.449 |
| 2.462576904 | -12.387 |
| 2.462874023 | -12.353 |
| 2.463171143 | -12.34 |
| 2.4634682619999997 | -12.239 |
| 2.463765625 | -12.254 |
| 2.4640629880000002 | -12.202 |
| 2.464360596 | -12.209 |
| 2.464658203 | -12.121 |
| 2.464955811 | -12.093 |
| 2.4652534179999996 | -12.039 |
| 2.4655512699999997 | -12.058 |
| 2.465849121 | -12.011 |
| 2.466146973 | -11.96 |
| 2.466445068 | -11.96 |
| 2.46674292 | -11.916 |
| 2.46704126 | -11.895 |
| 2.4673396 | -11.808 |
| 2.467637695 | -11.82 |
| 2.467936035 | -11.73 |
| 2.468234375 | -11.741 |
| 2.468532959 | -11.647 |
| 2.468831543 | -11.681 |
| 2.469130127 | -11.677 |
| 2.469428711 | -11.69 |
| 2.469727539 | -11.669 |
| 2.470026367 | -11.614 |
| 2.4703254390000002 | -11.628 |
| 2.4706245119999997 | -11.555 |
| 2.4709235840000003 | -11.551 |
| 2.471222656 | -11.443 |
| 2.4715219729999998 | -11.453 |
| 2.471821045 | -11.349 |
| 2.472120361 | -11.344 |
| 2.472419922 | -11.249 |
| 2.472719482 | -11.255 |
| 2.473019043 | -11.254 |
| 2.473318848 | -11.221 |
| 2.4736184079999997 | -11.179 |
| 2.473918213 | -11.13 |
| 2.474218018 | -11.123 |
| 2.474518066 | -11.059 |
| 2.474818115 | -11.059 |
| 2.475118164 | -10.959 |
| 2.4754182129999998 | -11.007 |
| 2.475718506 | -10.949 |
| 2.4760187989999998 | -10.967 |
| 2.476319336 | -10.909 |
| 2.476619629 | -10.935 |
| 2.4769201659999998 | -10.902 |
| 2.477220703 | -10.873 |
| 2.477521484 | -10.833 |
| 2.477822266 | -10.77 |
| 2.478123047 | -10.794 |
| 2.478423828 | -10.737 |
| 2.478724854 | -10.732 |
| 2.479025879 | -10.665 |
| 2.479327148 | -10.725 |
| 2.479628174 | -10.656 |
| 2.479929443 | -10.658 |
| 2.480230713 | -10.598 |
| 2.4805322270000003 | -10.599 |
| 2.4808334960000002 | -10.608 |
| 2.48113501 | -10.585 |
| 2.481436768 | -10.531 |
| 2.4817385250000004 | -10.495 |
| 2.482040283 | -10.53 |
| 2.482342041 | -10.462 |
| 2.4826440429999996 | -10.477 |
| 2.4829460450000003 | -10.425 |
| 2.483248047 | -10.452 |
| 2.483550293 | -10.378 |
| 2.483852295 | -10.335 |
| 2.4841545409999997 | -10.256 |
| 2.484457031 | -10.296 |
| 2.484759277 | -10.287 |
| 2.4850620119999998 | -10.248 |
| 2.485364502 | -10.244 |
| 2.485667236 | -10.236 |
| 2.485969971 | -10.269 |
| 2.4862727049999997 | -10.186 |
| 2.486575684 | -10.198 |
| 2.486878418 | -10.129 |
| 2.487181396 | -10.142 |
| 2.487484619 | -10.054 |
| 2.4877878420000004 | -10.035 |
| 2.488091309 | -9.985 |
| 2.488394531 | -10.007 |
| 2.488697998 | -10.007 |
| 2.489001465 | -9.964 |
| 2.489304932 | -9.995 |
| 2.4896083979999997 | -9.959 |
| 2.489912109 | -9.976 |
| 2.49021582 | -9.891 |
| 2.490519775 | -9.899 |
| 2.4908237300000002 | -9.821 |
| 2.491127686 | -9.911 |
| 2.491431885 | -9.884 |
| 2.49173584 | -9.862 |
| 2.492040039 | -9.868 |
| 2.4923442380000003 | -9.87 |
| 2.492648682 | -9.847 |
| 2.492953125 | -9.796 |
| 2.493257568 | -9.829 |
| 2.493562256 | -9.762 |
| 2.4938666990000002 | -9.799 |
| 2.494171631 | -9.658 |
| 2.494476318 | -9.641 |
| 2.49478125 | -9.621 |
| 2.495086182 | -9.656 |
| 2.495391113 | -9.589 |
| 2.495696289 | -9.613 |
| 2.496001465 | -9.61 |
| 2.4963066410000003 | -9.565 |
| 2.496612061 | -9.55 |
| 2.49691748 | -9.485 |
| 2.4972229 | -9.495 |
| 2.497528564 | -9.449 |
| 2.497834229 | -9.47 |
| 2.498139893 | -9.388 |
| 2.498445557 | -9.456 |
| 2.498751465 | -9.425 |
| 2.4990573730000003 | -9.447 |
| 2.499363281 | -9.399 |
| 2.499669434 | -9.478 |
| 2.4999753420000004 | -9.467 |
| 2.500281738 | -9.436 |
| 2.500588135 | -9.412 |
| 2.5008945309999997 | -9.346 |
| 2.5012009280000003 | -9.399 |
| 2.5015073240000003 | -9.366 |
| 2.5018139649999998 | -9.39 |
| 2.502120605 | -9.325 |
| 2.5024272460000003 | -9.447 |
| 2.502734131 | -9.337 |
| 2.503041016 | -9.344 |
| 2.503348145 | -9.304 |
| 2.5036552729999997 | -9.293 |
| 2.5039621579999998 | -9.29 |
| 2.504269531 | -9.255 |
| 2.50457666 | -9.236 |
| 2.5048840329999997 | -9.205 |
| 2.505191406 | -9.268 |
| 2.505499023 | -9.159 |
| 2.505806396 | -9.172 |
| 2.5061140140000004 | -9.112 |
| 2.506421875 | -9.13 |
| 2.5067297359999996 | -9.076 |
| 2.5070375979999997 | -9.079 |
| 2.507345459 | -9.044 |
| 2.5076535640000004 | -9.084 |
| 2.5079616700000003 | -9.115 |
| 2.508269775 | -9.081 |
| 2.508578125 | -9.101 |
| 2.5088864749999997 | -9.079 |
| 2.509194824 | -9.13 |
| 2.509503418 | -9.065 |
| 2.509812012 | -9.086 |
| 2.510120605 | -9.006 |
| 2.5104291990000003 | -9.022 |
| 2.510738037 | -8.961 |
| 2.511046875 | -8.937 |
| 2.511355713 | -8.954 |
| 2.511664795 | -9.015 |
| 2.511973877 | -9.029 |
| 2.512282959 | -9.003 |
| 2.512592285 | -9.032 |
| 2.5129016109999998 | -9.037 |
| 2.513211182 | -9.086 |
| 2.513520508 | -9.024 |
| 2.513830078 | -9.071 |
| 2.514139648 | -9.067 |
| 2.514449463 | -9.093 |
| 2.514759033 | -9.003 |
| 2.515068848 | -9.008 |
| 2.515378906 | -8.978 |
| 2.515688965 | -8.992 |
| 2.515999023 | -9.003 |
| 2.5163090820000003 | -8.939 |
| 2.516619385 | -8.943 |
| 2.5169296880000003 | -8.856 |
| 2.51723999 | -8.877 |
| 2.517550537 | -8.795 |
| 2.517861084 | -8.833 |
| 2.518171631 | -8.806 |
| 2.518482422 | -8.863 |
| 2.518793213 | -8.811 |
| 2.519104004 | -8.764 |
| 2.519415039 | -8.76 |
| 2.5197260740000003 | -8.743 |
| 2.520037109 | -8.731 |
| 2.520348145 | -8.718 |
| 2.5206594239999998 | -8.861 |
| 2.520970703 | -8.844 |
| 2.521281982 | -8.901 |
| 2.5215935060000003 | -8.814 |
| 2.521905273 | -8.901 |
| 2.522216797 | -8.882 |
| 2.5225285640000004 | -8.89 |
| 2.5228400879999997 | -8.879 |
| 2.5231521 | -8.897 |
| 2.523463867 | -8.827 |
| 2.523775879 | -8.774 |
| 2.524087891 | -8.779 |
| 2.524400146 | -8.716 |
| 2.524712402 | -8.808 |
| 2.525024902 | -8.76 |
| 2.5253371579999997 | -8.786 |
| 2.525649658 | -8.736 |
| 2.525962158 | -8.78 |
| 2.5262746579999997 | -8.794 |
| 2.526587402 | -8.81 |
| 2.526900146 | -8.712 |
| 2.5272131349999998 | -8.69 |
| 2.5275258789999997 | -8.74 |
| 2.527838867 | -8.761 |
| 2.5281521 | -8.988 |
| 2.528465332 | -9.038 |
| 2.528778564 | -9.09 |
| 2.529091797 | -9.07 |
| 2.529405273 | -9.111 |
| 2.52971875 | -9.186 |
| 2.530032227 | -9.297 |
| 2.530345703 | -9.258 |
| 2.530659424 | -9.265 |
| 2.530973145 | -9.162 |
| 2.5312873540000003 | -8.941 |
| 2.531601074 | -8.947 |
| 2.531915283 | -9.003 |
| 2.532229248 | -8.944 |
| 2.532543457 | -8.937 |
| 2.532857666 | -9.17 |
| 2.533171875 | -9.08 |
| 2.533486328 | -9.129 |
| 2.533800781 | -9.047 |
| 2.534115479 | -9.124 |
| 2.534430176 | -9.12 |
| 2.534744873 | -9.075 |
| 2.53505957 | -9.025 |
| 2.5353745119999997 | -9.085 |
| 2.535689453 | -9.03 |
| 2.536004395 | -8.668 |
| 2.53631958 | -8.619 |
| 2.536634766 | -8.547 |
| 2.536949951 | -8.597 |
| 2.537265381 | -8.533 |
| 2.5375808109999998 | -8.565 |
| 2.5378962400000002 | -8.527 |
| 2.538211914 | -8.641 |
| 2.538527588 | -8.685 |
| 2.538843262 | -8.609 |
| 2.5391589359999998 | -8.745 |
| 2.539474854 | -9.082 |
| 2.539790771 | -9.249 |
| 2.5401069339999998 | -9.19 |
| 2.540423096 | -9.283 |
| 2.540739502 | -9.368 |
| 2.541055664 | -9.461 |
| 2.54137207 | -9.527 |
| 2.541688477 | -9.519 |
| 2.542004883 | -9.575 |
| 2.542321533 | -9.495 |
| 2.542638184 | -9.08 |
| 2.542954834 | -8.925 |
| 2.543271729 | -8.925 |
| 2.543588867 | -8.832 |
| 2.543905762 | -8.864 |
| 2.5442229000000003 | -9.101 |
| 2.544540039 | -9.045 |
| 2.544857178 | -9.122 |
| 2.5451745609999996 | -9.297 |
| 2.545491943 | -9.265 |
| 2.545809326 | -9.31 |
| 2.546126953 | -9.301 |
| 2.5464445799999997 | -9.304 |
| 2.546762451 | -9.312 |
| 2.547080078 | -9.176 |
| 2.547397949 | -9.183 |
| 2.54771582 | -9.209 |
| 2.548033936 | -9.081 |
| 2.5483520509999997 | -8.953 |
| 2.548670166 | -8.946 |
| 2.5489885250000004 | -9.101 |
| 2.549306885 | -9.45 |
| 2.549625244 | -9.508 |
| 2.549943848 | -9.742 |
| 2.550262451 | -9.657 |
| 2.5505810550000003 | -9.383 |
| 2.5508996579999996 | -9.222 |
| 2.551218506 | -9.247 |
| 2.551537354 | -9.262 |
| 2.551856445 | -9.292 |
| 2.552175537 | -9.152 |
| 2.552494629 | -8.806 |
| 2.552813721 | -8.761 |
| 2.553133301 | -8.521 |
| 2.553452637 | -8.566 |
| 2.553771973 | -8.484 |
| 2.554091553 | -8.518 |
| 2.554411133 | -8.513 |
| 2.5547309570000003 | -8.523 |
| 2.555050537 | -8.511 |
| 2.5553703609999996 | -8.52 |
| 2.5556904300000003 | -8.598 |
| 2.556010498 | -8.545 |
| 2.556330566 | -8.741 |
| 2.5566508789999998 | -8.95 |
| 2.556970947 | -9.122 |
| 2.5572915039999997 | -9.207 |
| 2.557611816 | -9.58 |
| 2.5579323730000003 | -10.039 |
| 2.55825293 | -10.203 |
| 2.558573486 | -10.334 |
| 2.558894287 | -10.517 |
| 2.5592150879999997 | -11.337 |
| 2.559536133 | -11.631 |
| 2.559856934 | -11.233 |
| 2.560177979 | -11.096 |
| 2.560499268 | -11.04 |
| 2.560820557 | -11.111 |
| 2.561141846 | -11.01 |
| 2.561463135 | -10.998 |
| 2.5617846679999996 | -11.171 |
| 2.562106201 | -10.992 |
| 2.562427734 | -10.385 |
| 2.562749512 | -9.94 |
| 2.563071289 | -9.906 |
| 2.563393066 | -9.811 |
| 2.563715088 | -9.733 |
| 2.564037109 | -9.333 |
| 2.5643591310000002 | -9.139 |
| 2.564681396 | -9.105 |
| 2.565003662 | -8.96 |
| 2.565325928 | -9.096 |
| 2.565648438 | -9.15 |
| 2.565971191 | -9.521 |
| 2.566293701 | -10.087 |
| 2.5666164549999997 | -10.349 |
| 2.566939209 | -10.35 |
| 2.567261963 | -10.355 |
| 2.567584961 | -10.146 |
| 2.5679079590000002 | -10.112 |
| 2.5682309570000004 | -10.142 |
| 2.568553955 | -9.963 |
| 2.568877197 | -9.938 |
| 2.569200684 | -9.601 |
| 2.56952417 | -9.407 |
| 2.569847656 | -9.73 |
| 2.570171143 | -10.118 |
| 2.570494873 | -10.112 |
| 2.570818604 | -10.226 |
| 2.571142334 | -10.256 |
| 2.571466309 | -10.464 |
| 2.571790283 | -10.623 |
| 2.572114258 | -10.619 |
| 2.572438477 | -10.661 |
| 2.5727626949999998 | -10.396 |
| 2.573087158 | -10.171 |
| 2.5734113769999998 | -10.197 |
| 2.57373584 | -10.721 |
| 2.574060547 | -10.643 |
| 2.57438501 | -10.655 |
| 2.574709717 | -10.391 |
| 2.575034668 | -10.333 |
| 2.575359375 | -10.323 |
| 2.57568457 | -10.291 |
| 2.576009521 | -10.257 |
| 2.5763347170000004 | -9.909 |
| 2.576659912 | -9.545 |
| 2.576985107 | -9.126 |
| 2.577310547 | -9.45 |
| 2.5776359859999998 | -9.813 |
| 2.577961426 | -10.116 |
| 2.5782871089999997 | -10.054 |
| 2.5786127929999996 | -10.134 |
| 2.578938721 | -10.165 |
| 2.5792646479999997 | -10.367 |
| 2.579590576 | -10.572 |
| 2.579916504 | -10.86 |
| 2.5802426759999997 | -11.538 |
| 2.580568848 | -11.491 |
| 2.58089502 | -11.508 |
| 2.581221436 | -11.3 |
| 2.5815478520000004 | -11.436 |
| 2.581874268 | -11.377 |
| 2.582201172 | -11.505 |
| 2.5825278320000002 | -11.203 |
| 2.582854492 | -11.189 |
| 2.583181396 | -11.046 |
| 2.5835083009999997 | -10.996 |
| 2.583835449 | -11.066 |
| 2.584162354 | -10.864 |
| 2.584489746 | -10.844 |
| 2.584816895 | -10.923 |
| 2.585144287 | -11.016 |
| 2.585471924 | -11.044 |
| 2.585799316 | -11.717 |
| 2.586126953 | -11.793 |
| 2.5864545899999998 | -11.679 |
| 2.586782227 | -11.018 |
| 2.587110107 | -10.558 |
| 2.587437988 | -10.244 |
| 2.5877661130000003 | -10.14 |
| 2.588094238 | -10.016 |
| 2.588422607 | -9.953 |
| 2.588750732 | -10.201 |
| 2.5890791020000004 | -10.044 |
| 2.589407471 | -9.958 |
| 2.589736084 | -10.009 |
| 2.590064697 | -10.211 |
| 2.5903933109999997 | -10.554 |
| 2.5907221679999997 | -11.183 |
| 2.591051025 | -11.876 |
| 2.591379883 | -12.662 |
| 2.591708984 | -13.091 |
| 2.592038086 | -13.188 |
| 2.5923671880000003 | -13.599 |
| 2.592696533 | -14.291 |
| 2.593025879 | -14.537 |
| 2.593355225 | -14.284 |
| 2.5936848140000004 | -13.722 |
| 2.594014404 | -13.091 |
| 2.594343994 | -12.336 |
| 2.594673828 | -11.585 |
| 2.595003906 | -11.275 |
| 2.59533374 | -10.793 |
| 2.595663818 | -10.322 |
| 2.595993896 | -10.034 |
| 2.596323975 | -9.939 |
| 2.596654297 | -9.902 |
| 2.5969846189999997 | -9.872 |
| 2.597315186 | -9.773 |
| 2.5976455080000003 | -9.816 |
| 2.597976074 | -10.288 |
| 2.5983071289999997 | -10.448 |
| 2.598637695 | -10.529 |
| 2.59896875 | -10.571 |
| 2.5992995609999996 | -10.572 |
| 2.599630615 | -10.957 |
| 2.5999616700000003 | -11.42 |
| 2.6002929690000003 | -11.724 |
| 2.6006242680000002 | -12.14 |
| 2.600955566 | -12.124 |
| 2.601286865 | -11.675 |
| 2.601618652 | -12.002 |
| 2.6019501949999997 | -12.68 |
| 2.602281982 | -13.205 |
| 2.60261377 | -13.431 |
| 2.602945557 | -13.028 |
| 2.603277588 | -12.524 |
| 2.6036096189999998 | -12.568 |
| 2.6039416500000003 | -12.816 |
| 2.604273926 | -12.97 |
| 2.604606201 | -12.725 |
| 2.604938721 | -12.129 |
| 2.60527124 | -11.507 |
| 2.60560376 | -11.133 |
| 2.605936279 | -11.416 |
| 2.6062690429999997 | -11.745 |
| 2.606601807 | -11.835 |
| 2.606934814 | -11.569 |
| 2.607267822 | -11.013 |
| 2.60760083 | -10.781 |
| 2.607933838 | -10.796 |
| 2.608267334 | -10.796 |
| 2.608600586 | -10.909 |
| 2.608934082 | -10.892 |
| 2.609267578 | -10.734 |
| 2.609601074 | -10.747 |
| 2.6099348140000003 | -10.693 |
| 2.610268555 | -10.808 |
| 2.610602295 | -10.764 |
| 2.610936279 | -10.941 |
| 2.6112702640000003 | -11.036 |
| 2.611604492 | -11.085 |
| 2.6119384770000003 | -11.095 |
| 2.6122727049999996 | -11.135 |
| 2.612607178 | -11.257 |
| 2.6129416500000002 | -11.32 |
| 2.613276123 | -11.743 |
| 2.613610596 | -12.18 |
| 2.6139453130000003 | -12.751 |
| 2.614280029 | -13.009 |
| 2.61461499 | -12.946 |
| 2.6149499510000003 | -13.115 |
| 2.615285156 | -13.107 |
| 2.6156201169999997 | -13.039 |
| 2.6159553219999996 | -12.706 |
| 2.6162905270000003 | -12.362 |
| 2.616625977 | -12.511 |
| 2.616961426 | -12.484 |
| 2.617296875 | -12.359 |
| 2.617632568 | -12.125 |
| 2.6179682619999998 | -12.148 |
| 2.618304199 | -12.049 |
| 2.618640137 | -11.873 |
| 2.6189760740000003 | -11.882 |
| 2.619312256 | -11.673 |
| 2.619648193 | -11.432 |
| 2.619984375 | -10.9 |
| 2.6203208009999996 | -10.509 |
| 2.620657227 | -10.285 |
| 2.620993652 | -10.272 |
| 2.621330322 | -10.268 |
| 2.6216669919999998 | -10.253 |
| 2.6220039059999998 | -10.324 |
| 2.622340576 | -10.391 |
| 2.62267749 | -10.762 |
| 2.623014648 | -11.221 |
| 2.6233515630000004 | -11.584 |
| 2.623688721 | -11.672 |
| 2.624026123 | -11.814 |
| 2.624363525 | -11.834 |
| 2.624700928 | -11.867 |
| 2.625038574 | -11.92 |
| 2.625376221 | -11.998 |
| 2.625713867 | -12.346 |
| 2.626051758 | -12.2 |
| 2.626389404 | -11.944 |
| 2.626727539 | -12.17 |
| 2.62706543 | -12.64 |
| 2.627403564 | -12.969 |
| 2.627741943 | -13.205 |
| 2.628080078 | -13.26 |
| 2.628418701 | -13.448 |
| 2.6287570799999997 | -13.344 |
| 2.629095703 | -12.94 |
| 2.629434326 | -12.886 |
| 2.629773193 | -12.525 |
| 2.6301120609999997 | -12.366 |
| 2.630450928 | -12.259 |
| 2.630789795 | -11.939 |
| 2.631128906 | -11.804 |
| 2.631468262 | -11.788 |
| 2.6318076169999998 | -11.634 |
| 2.632146973 | -11.658 |
| 2.632486328 | -11.576 |
| 2.6328259280000004 | -11.381 |
| 2.633165527 | -11.299 |
| 2.633505127 | -10.905 |
| 2.633844971 | -10.533 |
| 2.634184814 | -10.491 |
| 2.634524902 | -10.446 |
| 2.63486499 | -10.42 |
| 2.635205322 | -10.485 |
| 2.63554541 | -10.486 |
| 2.635885742 | -10.513 |
| 2.636226074 | -10.471 |
| 2.6365666500000002 | -10.541 |
| 2.636907227 | -10.536 |
| 2.637247803 | -10.603 |
| 2.637588623 | -10.618 |
| 2.637929443 | -10.683 |
| 2.638270508 | -10.887 |
| 2.638611572 | -11.104 |
| 2.638952637 | -11.112 |
| 2.639293945 | -11.113 |
| 2.639635254 | -11.199 |
| 2.6399765630000003 | -11.156 |
| 2.640318115 | -11.227 |
| 2.6406596679999996 | -11.152 |
| 2.641001221 | -11.152 |
| 2.641343018 | -11.083 |
| 2.641685059 | -11.046 |
| 2.642026855 | -11.218 |
| 2.642368896 | -11.476 |
| 2.642710938 | -11.511 |
| 2.643053223 | -11.619 |
| 2.643395264 | -11.687 |
| 2.6437377929999997 | -11.632 |
| 2.644080078 | -11.677 |
| 2.644422607 | -11.608 |
| 2.644765381 | -11.615 |
| 2.645108154 | -11.386 |
| 2.6454509280000003 | -10.991 |
| 2.645793945 | -10.77 |
| 2.6461367190000002 | -10.795 |
| 2.64647998 | -10.67 |
| 2.646822998 | -10.695 |
| 2.64716626 | -10.715 |
| 2.647509521 | -10.771 |
| 2.647853027 | -10.834 |
| 2.6481965329999997 | -10.871 |
| 2.648540283 | -11.243 |
| 2.648884033 | -11.654 |
| 2.6492277829999997 | -11.85 |
| 2.649571533 | -11.87 |
| 2.649915527 | -12.036 |
| 2.6502595209999997 | -12.022 |
| 2.65060376 | -12.075 |
| 2.650947998 | -12.025 |
| 2.6512922359999997 | -12.113 |
| 2.6516364749999997 | -12.603 |
| 2.651981201 | -12.422 |
| 2.652325928 | -11.917 |
| 2.6526704100000003 | -11.777 |
| 2.6530151369999997 | -11.798 |
| 2.653360107 | -11.752 |
| 2.6537050779999998 | -11.756 |
| 2.654050049 | -11.803 |
| 2.654395264 | -11.853 |
| 2.654740479 | -11.719 |
| 2.655085693 | -11.281 |
| 2.6554311520000002 | -11.15 |
| 2.655776611 | -11.566 |
| 2.656122314 | -11.856 |
| 2.6564677729999997 | -12.082 |
| 2.656813721 | -12.114 |
| 2.657159424 | -12.204 |
| 2.657505371 | -12.217 |
| 2.657851318 | -12.369 |
| 2.65819751 | -12.964 |
| 2.658543701 | -13.021 |
| 2.6588901369999998 | -13.013 |
| 2.6592365719999997 | -12.458 |
| 2.6595830080000002 | -12.112 |
| 2.659929443 | -11.979 |
| 2.660276123 | -12.171 |
| 2.6606228030000003 | -12.319 |
| 2.6609697270000003 | -12.817 |
| 2.6613166500000003 | -13.27 |
| 2.6616635740000003 | -13.229 |
| 2.662010742 | -13.607 |
| 2.662358154 | -13.817 |
| 2.662705322 | -14.248 |
| 2.663052734 | -15.134 |
| 2.663400146 | -15.945 |
| 2.663747803 | -16.122 |
| 2.6640954590000003 | -15.954 |
| 2.664443115 | -15.363 |
| 2.664791016 | -14.911 |
| 2.665138916 | -14.348 |
| 2.665486816 | -14.189 |
| 2.665835205 | -14.174 |
| 2.66618335 | -14.462 |
| 2.666531494 | -14.488 |
| 2.666879883 | -14.5 |
| 2.667228516 | -14.817 |
| 2.667576904 | -14.944 |
| 2.667925537 | -14.798 |
| 2.668274414 | -14.419 |
| 2.668623047 | -14.397 |
| 2.668972168 | -14.679 |
| 2.669321289 | -14.775 |
| 2.66967041 | -14.138 |
| 2.670019531 | -13.379 |
| 2.670368896 | -12.79 |
| 2.670718262 | -12.385 |
| 2.6710676269999998 | -12.589 |
| 2.671417236 | -12.637 |
| 2.671766846 | -12.706 |
| 2.672116455 | -13.179 |
| 2.672466309 | -13.283 |
| 2.672816406 | -13.215 |
| 2.6731665039999997 | -13.762 |
| 2.6735166020000003 | -14.48 |
| 2.673866699 | -15.347 |
| 2.674217041 | -15.54 |
| 2.674567383 | -15.012 |
| 2.674917969 | -15.03 |
| 2.675268555 | -15.536 |
| 2.6756191410000003 | -15.655 |
| 2.675969971 | -15.21 |
| 2.6763208009999997 | -15.205 |
| 2.676671875 | -14.387 |
| 2.6770229490000004 | -13.776 |
| 2.677374023 | -13.194 |
| 2.677725098 | -12.825 |
| 2.6780764159999997 | -12.753 |
| 2.678427734 | -12.664 |
| 2.678779297 | -12.387 |
| 2.679130859 | -12.024 |
| 2.6794826659999997 | -12.241 |
| 2.679834473 | -12.225 |
| 2.680186279 | -12.303 |
| 2.68053833 | -12.369 |
| 2.680890381 | -12.508 |
| 2.681242432 | -12.663 |
| 2.6815947270000002 | -12.56 |
| 2.681947021 | -12.552 |
| 2.682299316 | -12.728 |
| 2.682651855 | -13.098 |
| 2.6830043949999998 | -12.903 |
| 2.683357422 | -12.801 |
| 2.6837102049999997 | -12.575 |
| 2.684062988 | -12.505 |
| 2.684416016 | -12.246 |
| 2.6847690429999997 | -12.271 |
| 2.68512207 | -12.619 |
| 2.685475342 | -12.517 |
| 2.685828857 | -12.199 |
| 2.6861821289999996 | -11.741 |
| 2.6865358890000004 | -11.486 |
| 2.6868896479999997 | -11.423 |
| 2.6872434079999996 | -11.494 |
| 2.687597168 | -11.311 |
| 2.687951172 | -11.49 |
| 2.688304932 | -11.41 |
| 2.68865918 | -11.095 |
| 2.689013184 | -11.077 |
| 2.689367676 | -11.273 |
| 2.689721924 | -11.706 |
| 2.6900766600000003 | -12.199 |
| 2.690431152 | -12.499 |
| 2.690785645 | -12.799 |
| 2.6911403810000003 | -13.074 |
| 2.691495361 | -13 |
| 2.6918500979999997 | -13.683 |
| 2.692205322 | -14.2 |
| 2.692560303 | -14.303 |
| 2.6929155270000003 | -13.97 |
| 2.693270752 | -13.233 |
| 2.693626465 | -12.594 |
| 2.693981934 | -12.399 |
| 2.694337402 | -12.089 |
| 2.694693115 | -12.062 |
| 2.695048828 | -11.962 |
| 2.695404785 | -11.454 |
| 2.695760742 | -11.091 |
| 2.696116699 | -10.984 |
| 2.6964729000000003 | -11 |
| 2.696829102 | -10.974 |
| 2.697185547 | -11.199 |
| 2.697541992 | -11.526 |
| 2.697898438 | -11.7 |
| 2.698255127 | -11.561 |
| 2.698611816 | -11.523 |
| 2.69896875 | -11.587 |
| 2.6993256839999997 | -11.675 |
| 2.699682617 | -11.537 |
| 2.7000395509999997 | -11.455 |
| 2.700396729 | -11.487 |
| 2.7007541500000003 | -11.176 |
| 2.701111572 | -10.799 |
| 2.701468994 | -10.773 |
| 2.70182666 | -10.851 |
| 2.7021843260000002 | -10.792 |
| 2.702541992 | -10.733 |
| 2.702899902 | -10.737 |
| 2.703257813 | -10.88 |
| 2.703615967 | -10.831 |
| 2.7039738769999997 | -10.819 |
| 2.704332275 | -10.905 |
| 2.704690674 | -10.951 |
| 2.705049072 | -11.238 |
| 2.7054077149999998 | -11.548 |
| 2.705766113 | -11.887 |
| 2.706125 | -11.977 |
| 2.706483643 | -12.109 |
| 2.706842529 | -12.485 |
| 2.70720166 | -13.222 |
| 2.707560547 | -13.756 |
| 2.707919922 | -13.86 |
| 2.7082792970000003 | -13.757 |
| 2.708638672 | -13.126 |
| 2.708998047 | -12.551 |
| 2.709357666 | -12.172 |
| 2.709717285 | -12.093 |
| 2.710076904 | -12.073 |
| 2.710436768 | -11.607 |
| 2.710796875 | -11.014 |
| 2.711156738 | -10.641 |
| 2.7115170899999996 | -10.459 |
| 2.7118771969999997 | -10.356 |
| 2.712237549 | -10.233 |
| 2.712598145 | -10.257 |
| 2.712958496 | -10.342 |
| 2.7133190920000003 | -10.334 |
| 2.713679932 | -10.502 |
| 2.7140405270000003 | -10.805 |
| 2.714401611 | -10.863 |
| 2.714762451 | -10.851 |
| 2.715123779 | -11.011 |
| 2.715484863 | -11.252 |
| 2.7158461910000002 | -11.51 |
| 2.7162075199999998 | -12.062 |
| 2.7165690920000003 | -12.508 |
| 2.716930664 | -13.123 |
| 2.7172922359999996 | -13.407 |
| 2.7176540530000004 | -13.489 |
| 2.718015869 | -13.649 |
| 2.71837793 | -13.639 |
| 2.71873999 | -13.414 |
| 2.7191022950000003 | -13.04 |
| 2.719464355 | -12.812 |
| 2.719826904 | -12.509 |
| 2.720189209 | -12.57 |
| 2.720551758 | -12.528 |
| 2.720914307 | -12.116 |
| 2.7212771 | -11.881 |
| 2.721639893 | -12.366 |
| 2.72200293 | -12.813 |
| 2.722365967 | -12.739 |
| 2.7227292480000003 | -12.682 |
| 2.7230922850000003 | -12.46 |
| 2.723455566 | -12.014 |
| 2.7238190920000003 | -11.427 |
| 2.724182617 | -10.936 |
| 2.724546143 | -10.74 |
| 2.724909912 | -10.556 |
| 2.725273682 | -10.139 |
| 2.725637451 | -9.817 |
| 2.726001709 | -9.809 |
| 2.726365723 | -9.735 |
| 2.72672998 | -9.748 |
| 2.7270942380000003 | -9.701 |
| 2.727458496 | -9.653 |
| 2.727822998 | -9.637 |
| 2.7281875 | -9.704 |
| 2.728552246 | -9.751 |
| 2.728916992 | -9.702 |
| 2.729281982 | -9.782 |
| 2.729646973 | -9.741 |
| 2.730012207 | -9.817 |
| 2.7303771969999997 | -9.819 |
| 2.730742432 | -10.182 |
| 2.73110791 | -10.656 |
| 2.731473389 | -10.831 |
| 2.731838867 | -10.752 |
| 2.732204346 | -10.707 |
| 2.732570313 | -10.76 |
| 2.7329360350000003 | -10.741 |
| 2.733302246 | -10.789 |
| 2.733668213 | -10.795 |
| 2.734034424 | -10.802 |
| 2.734400635 | -10.639 |
| 2.734766846 | -10.573 |
| 2.735133301 | -10.842 |
| 2.7354997560000003 | -11.151 |
| 2.735866455 | -11.488 |
| 2.7362331540000002 | -12.108 |
| 2.736599854 | -12.603 |
| 2.7369670409999998 | -12.877 |
| 2.7373339839999997 | -13.372 |
| 2.737701172 | -14.471 |
| 2.7380683589999997 | -14.765 |
| 2.7384357909999997 | -14.402 |
| 2.7388032229999997 | -13.529 |
| 2.739170654 | -13.041 |
| 2.73953833 | -12.612 |
| 2.739906006 | -11.815 |
| 2.740273926 | -11.445 |
| 2.740641846 | -11.242 |
| 2.7410097660000003 | -10.983 |
| 2.74137793 | -10.498 |
| 2.7417460940000002 | -10.212 |
| 2.7421145019999997 | -9.928 |
| 2.74248291 | -9.824 |
| 2.742851318 | -9.728 |
| 2.743219971 | -9.676 |
| 2.743588623 | -9.749 |
| 2.74395752 | -9.708 |
| 2.744326416 | -9.754 |
| 2.744695557 | -9.837 |
| 2.745064453 | -9.797 |
| 2.745433838 | -9.686 |
| 2.745802979 | -9.663 |
| 2.7461723630000003 | -9.643 |
| 2.746541992 | -9.65 |
| 2.746911621 | -9.671 |
| 2.74728125 | -9.626 |
| 2.7476511230000003 | -9.888 |
| 2.748020996 | -10.112 |
| 2.7483911130000003 | -10.021 |
| 2.74876123 | -9.996 |
| 2.7491313479999997 | -10.073 |
| 2.749501465 | -10.086 |
| 2.74987207 | -10.187 |
| 2.750242432 | -10.418 |
| 2.750613037 | -10.576 |
| 2.750983643 | -11.141 |
| 2.7513547359999997 | -11.248 |
| 2.751725586 | -11.373 |
| 2.75209668 | -11.928 |
| 2.752467529 | -12.23 |
| 2.752838867 | -12.269 |
| 2.753210205 | -12.395 |
| 2.7535815429999997 | -12.764 |
| 2.753952881 | -12.422 |
| 2.754324463 | -12.143 |
| 2.754696289 | -11.445 |
| 2.755068115 | -10.959 |
| 2.755440186 | -10.596 |
| 2.755812012 | -10.134 |
| 2.7561840820000003 | -10.018 |
| 2.756556396 | -10.054 |
| 2.756928711 | -9.889 |
| 2.7573010250000003 | -9.838 |
| 2.757673584 | -9.959 |
| 2.758046143 | -9.924 |
| 2.758418701 | -10.276 |
| 2.758791748 | -10.746 |
| 2.759164551 | -10.756 |
| 2.759537598 | -10.871 |
| 2.7599106449999997 | -11.272 |
| 2.760283936 | -11.557 |
| 2.7606572270000003 | -11.689 |
| 2.761030762 | -11.448 |
| 2.761404053 | -11.141 |
| 2.7617778320000004 | -11.233 |
| 2.762151367 | -11.006 |
| 2.762525391 | -10.832 |
| 2.762899414 | -10.849 |
| 2.763273438 | -10.684 |
| 2.763647461 | -10.536 |
| 2.764021729 | -10.72 |
| 2.764395996 | -10.939 |
| 2.764770264 | -10.87 |
| 2.765144775 | -10.903 |
| 2.765519531 | -10.757 |
| 2.765894287 | -10.499 |
| 2.766269287 | -10.473 |
| 2.766644043 | -10.845 |
| 2.767019043 | -10.958 |
| 2.767394287 | -10.733 |
| 2.767769531 | -10.353 |
| 2.768144775 | -10.557 |
| 2.768520264 | -10.866 |
| 2.7688957519999997 | -10.838 |
| 2.76927124 | -10.819 |
| 2.769646973 | -10.746 |
| 2.770023193 | -10.413 |
| 2.770398926 | -9.907 |
| 2.770775146 | -9.776 |
| 2.771151123 | -9.803 |
| 2.771527344 | -9.762 |
| 2.771903809 | -9.463 |
| 2.772280273 | -9.236 |
| 2.7726567380000002 | -9.454 |
| 2.773033447 | -9.656 |
| 2.7734101559999997 | -9.726 |
| 2.773787354 | -9.833 |
| 2.774164307 | -9.905 |
| 2.77454126 | -9.923 |
| 2.774918457 | -10.002 |
| 2.7752956540000002 | -10.052 |
| 2.775673096 | -10.011 |
| 2.776050537 | -9.978 |
| 2.776427979 | -9.921 |
| 2.776805664 | -9.856 |
| 2.7771835940000003 | -10.152 |
| 2.7775615229999997 | -10.117 |
| 2.777939697 | -10.044 |
| 2.778317627 | -10.042 |
| 2.778695801 | -10.017 |
| 2.779074219 | -10.192 |
| 2.779452637 | -10.146 |
| 2.7798310550000003 | -10.241 |
| 2.780209717 | -10.037 |
| 2.7805883789999997 | -9.913 |
| 2.780967041 | -9.6 |
| 2.781346191 | -9.48 |
| 2.781725342 | -9.436 |
| 2.7821044919999998 | -9.623 |
| 2.782483643 | -9.897 |
| 2.7828630370000003 | -9.655 |
| 2.783242432 | -9.889 |
| 2.783621826 | -10.079 |
| 2.784001465 | -10.666 |
| 2.7843813479999997 | -10.768 |
| 2.7847609859999998 | -10.811 |
| 2.785141357 | -10.866 |
| 2.78552124 | -10.81 |
| 2.785901367 | -10.481 |
| 2.786281738 | -10.041 |
| 2.786662109 | -10.041 |
| 2.78704248 | -9.8 |
| 2.787423096 | -9.596 |
| 2.787803711 | -9.102 |
| 2.78818457 | -9.098 |
| 2.788565674 | -8.986 |
| 2.788946533 | -9.016 |
| 2.789327637 | -9.081 |
| 2.789708984 | -9.123 |
| 2.790090088 | -8.992 |
| 2.79047168 | -8.893 |
| 2.7908530270000003 | -8.876 |
| 2.791234619 | -8.929 |
| 2.7916164549999998 | -9.082 |
| 2.791998291 | -8.964 |
| 2.792380371 | -9.037 |
| 2.792762451 | -8.955 |
| 2.793144531 | -8.999 |
| 2.793526611 | -8.984 |
| 2.79390918 | -8.997 |
| 2.794291504 | -9.004 |
| 2.794674072 | -9.011 |
| 2.795056641 | -8.925 |
| 2.7954394529999997 | -8.801 |
| 2.795822266 | -8.838 |
| 2.7962055660000003 | -8.873 |
| 2.796588623 | -8.994 |
| 2.79697168 | -8.864 |
| 2.79735498 | -8.847 |
| 2.797738525 | -8.878 |
| 2.798121826 | -9.167 |
| 2.798505615 | -9.578 |
| 2.7988891600000003 | -9.629 |
| 2.799272949 | -9.881 |
| 2.799656982 | -10.315 |
| 2.80004126 | -10.66 |
| 2.800425293 | -10.802 |
| 2.8008095699999997 | -10.963 |
| 2.801193848 | -10.996 |
| 2.801578369 | -11.014 |
| 2.801962891 | -10.798 |
| 2.802347412 | -10.241 |
| 2.8027321780000003 | -10.205 |
| 2.8031171880000003 | -10.062 |
| 2.803502197 | -9.613 |
| 2.803887451 | -9.357 |
| 2.804272461 | -9.163 |
| 2.804657959 | -9.346 |
| 2.805043213 | -9.312 |
| 2.8054287110000002 | -9.219 |
| 2.805814453 | -9.037 |
| 2.806199951 | -8.974 |
| 2.806585938 | -8.936 |
| 2.806971924 | -8.853 |
| 2.8073579100000003 | -8.919 |
| 2.807744141 | -8.863 |
| 2.8081303710000003 | -8.87 |
| 2.808516846 | -8.643 |
| 2.8089033199999998 | -8.649 |
| 2.809289795 | -8.69 |
| 2.8096765140000004 | -8.765 |
| 2.810063232 | -8.811 |
| 2.810450195 | -8.758 |
| 2.810837158 | -8.958 |
| 2.8112241210000004 | -9.056 |
| 2.811611572 | -9.071 |
| 2.811998779 | -9.03 |
| 2.81238623 | -9.146 |
| 2.8127739259999998 | -9.129 |
| 2.8131613769999997 | -9.128 |
| 2.813549072 | -9.008 |
| 2.813937012 | -9.098 |
| 2.814324951 | -9.105 |
| 2.814713135 | -8.94 |
| 2.815101074 | -9.033 |
| 2.8154897460000003 | -9.031 |
| 2.81587793 | -9.092 |
| 2.8162666020000002 | -9.212 |
| 2.816655029 | -9.471 |
| 2.8170437010000002 | -9.451 |
| 2.817432617 | -9.658 |
| 2.8178215329999996 | -9.542 |
| 2.818210449 | -9.635 |
| 2.818599609 | -9.532 |
| 2.818989014 | -9.239 |
| 2.819378418 | -9.241 |
| 2.8197678219999998 | -9.184 |
| 2.820157471 | -9.02 |
| 2.820547119 | -8.815 |
| 2.820937012 | -8.891 |
| 2.821326904 | -8.715 |
| 2.821716797 | -8.73 |
| 2.822106934 | -8.616 |
| 2.82249707 | -8.636 |
| 2.822887451 | -8.599 |
| 2.8232780760000002 | -8.684 |
| 2.823668457 | -8.799 |
| 2.824059082 | -8.802 |
| 2.824449951 | -8.834 |
| 2.82484082 | -8.785 |
| 2.825231689 | -8.851 |
| 2.8256228030000003 | -8.82 |
| 2.826013916 | -8.879 |
| 2.8264052729999998 | -8.797 |
| 2.826796631 | -8.844 |
| 2.827188477 | -8.699 |
| 2.827580078 | -8.654 |
| 2.82797168 | -8.681 |
| 2.8283635250000003 | -8.699 |
| 2.828755371 | -8.709 |
| 2.829147461 | -8.844 |
| 2.829539551 | -8.957 |
| 2.829931885 | -8.969 |
| 2.830324219 | -9.11 |
| 2.830716797 | -9.187 |
| 2.831109619 | -9.389 |
| 2.831502197 | -9.242 |
| 2.83189502 | -9.291 |
| 2.832288086 | -9.311 |
| 2.832680908 | -9.394 |
| 2.8330742190000002 | -9.302 |
| 2.8334672850000002 | -9.334 |
| 2.83386084 | -9.382 |
| 2.83425415 | -9.502 |
| 2.8346479490000003 | -9.467 |
| 2.835041748 | -9.27 |
| 2.835435547 | -9.338 |
| 2.835829346 | -9.221 |
| 2.836223389 | -9.202 |
| 2.836617432 | -9.133 |
| 2.837011719 | -9.134 |
| 2.837406006 | -9.087 |
| 2.837800537 | -9.084 |
| 2.838195068 | -8.859 |
| 2.838589844 | -8.838 |
| 2.8389846189999997 | -8.833 |
| 2.839379639 | -8.808 |
| 2.8397746579999996 | -8.811 |
| 2.840169678 | -8.757 |
| 2.8405649410000002 | -8.797 |
| 2.840960205 | -8.774 |
| 2.841355713 | -8.767 |
| 2.841751221 | -8.718 |
| 2.842146729 | -8.814 |
| 2.842542725 | -8.777 |
| 2.842938721 | -8.791 |
| 2.8433347170000003 | -8.827 |
| 2.843730713 | -8.825 |
| 2.844126953 | -8.872 |
| 2.844523193 | -8.862 |
| 2.844919678 | -8.995 |
| 2.845316162 | -9.076 |
| 2.8457128910000002 | -9.183 |
| 2.846109619 | -9.15 |
| 2.846506836 | -9.174 |
| 2.846903809 | -9.152 |
| 2.847300781 | -9.148 |
| 2.847697998 | -9.116 |
| 2.848095459 | -9.113 |
| 2.848492676 | -9.089 |
| 2.8488903810000004 | -9.039 |
| 2.8492878420000003 | -9.027 |
| 2.8496857909999997 | -9.009 |
| 2.8500834960000003 | -9.198 |
| 2.850481689 | -9.316 |
| 2.850879883 | -9.426 |
| 2.8512780760000003 | -9.432 |
| 2.85167627 | -9.525 |
| 2.8520747070000003 | -9.453 |
| 2.852473389 | -9.486 |
| 2.85287207 | -9.422 |
| 2.853270752 | -9.371 |
| 2.853669678 | -9.335 |
| 2.854068604 | -9.19 |
| 2.8544677729999997 | -9.115 |
| 2.854867188 | -9.043 |
| 2.855266357 | -9.061 |
| 2.855665771 | -9.071 |
| 2.85606543 | -9.098 |
| 2.8564650879999998 | -9.077 |
| 2.8568647460000003 | -9.109 |
| 2.8572646479999997 | -9.06 |
| 2.857664551 | -9.13 |
| 2.8580646969999997 | -9.117 |
| 2.858465088 | -9.127 |
| 2.858865479 | -9.145 |
| 2.8592658689999997 | -9.139 |
| 2.8596665039999998 | -9.066 |
| 2.8600671390000003 | -9.057 |
| 2.860468018 | -9.056 |
| 2.860868896 | -8.976 |
| 2.8612697750000002 | -9.044 |
| 2.861670898 | -8.99 |
| 2.862072021 | -9.035 |
| 2.862473633 | -9.126 |
| 2.862875 | -9.226 |
| 2.863276611 | -9.183 |
| 2.863678467 | -9.218 |
| 2.8640800779999998 | -9.221 |
| 2.864481934 | -9.23 |
| 2.8648840329999996 | -9.258 |
| 2.865286133 | -9.206 |
| 2.865688477 | -9.241 |
| 2.8660908199999997 | -9.226 |
| 2.8664934079999997 | -9.186 |
| 2.8668959960000002 | -9.12 |
| 2.8672985840000003 | -9.342 |
| 2.867701416 | -9.349 |
| 2.868104492 | -9.38 |
| 2.868507568 | -9.401 |
| 2.868910645 | -9.445 |
| 2.869313965 | -9.421 |
| 2.869717285 | -9.439 |
| 2.870120605 | -9.442 |
| 2.870524414 | -9.404 |
| 2.870928223 | -9.446 |
| 2.871332031 | -9.288 |
| 2.871736084 | -9.302 |
| 2.8721401369999997 | -9.264 |
| 2.872544189 | -9.25 |
| 2.872948486 | -9.179 |
| 2.8733527829999996 | -9.273 |
| 2.873757324 | -9.229 |
| 2.874161865 | -9.233 |
| 2.874566895 | -9.262 |
| 2.8749716800000003 | -9.289 |
| 2.875376709 | -9.294 |
| 2.875781738 | -9.286 |
| 2.876187012 | -9.357 |
| 2.876592285 | -9.326 |
| 2.876997803 | -9.367 |
| 2.87740332 | -9.268 |
| 2.877808838 | -9.287 |
| 2.8782145999999997 | -9.275 |
| 2.87862085 | -9.302 |
| 2.8790266109999996 | -9.272 |
| 2.8794328609999997 | -9.299 |
| 2.879839111 | -9.382 |
| 2.8802453609999996 | -9.394 |
| 2.880651855 | -9.425 |
| 2.88105835 | -9.398 |
| 2.881465088 | -9.432 |
| 2.8818718260000002 | -9.396 |
| 2.8822790530000004 | -9.431 |
| 2.8826860350000003 | -9.371 |
| 2.883093262 | -9.432 |
| 2.883500488 | -9.5 |
| 2.883907715 | -9.486 |
| 2.884315186 | -9.474 |
| 2.8847229000000003 | -9.543 |
| 2.885130615 | -9.567 |
| 2.8855383299999997 | -9.561 |
| 2.885946289 | -9.575 |
| 2.8863544919999997 | -9.526 |
| 2.886762695 | -9.588 |
| 2.887171143 | -9.551 |
| 2.887579346 | -9.521 |
| 2.887988037 | -9.48 |
| 2.888396729 | -9.547 |
| 2.88880542 | -9.496 |
| 2.889214355 | -9.531 |
| 2.889623291 | -9.513 |
| 2.8900322270000003 | -9.529 |
| 2.89044165 | -9.531 |
| 2.890851074 | -9.504 |
| 2.8912604980000003 | -9.509 |
| 2.891670166 | -9.487 |
| 2.892079834 | -9.556 |
| 2.892489502 | -9.511 |
| 2.892899414 | -9.556 |
| 2.89330957 | -9.533 |
| 2.893719727 | -9.596 |
| 2.894129883 | -9.552 |
| 2.894540527 | -9.578 |
| 2.894950928 | -9.549 |
| 2.8953615719999997 | -9.586 |
| 2.895772217 | -9.606 |
| 2.896183105 | -9.653 |
| 2.896594238 | -9.861 |
| 2.897005127 | -9.886 |
| 2.8974165039999997 | -9.953 |
| 2.897827637 | -9.907 |
| 2.8982392580000003 | -10.006 |
| 2.898650879 | -9.957 |
| 2.8990625 | -10.003 |
| 2.899474365 | -9.946 |
| 2.89988623 | -9.955 |
| 2.90029834 | -9.955 |
| 2.900710449 | -9.846 |
| 2.901122559 | -9.841 |
| 2.9015349120000002 | -9.82 |
| 2.90194751 | -9.873 |
| 2.902360107 | -9.836 |
| 2.902772949 | -9.884 |
| 2.903185791 | -9.825 |
| 2.903598877 | -9.857 |
| 2.904011719 | -9.822 |
| 2.904425049 | -9.803 |
| 2.9048383789999996 | -9.73 |
| 2.9052517090000003 | -9.759 |
| 2.905665283 | -9.78 |
| 2.906078857 | -9.819 |
| 2.906492676 | -9.821 |
| 2.906906738 | -9.799 |
| 2.907320801 | -9.847 |
| 2.907734863 | -9.806 |
| 2.90814917 | -9.848 |
| 2.908563477 | -9.792 |
| 2.9089780270000003 | -9.84 |
| 2.909392578 | -9.825 |
| 2.909807373 | -9.896 |
| 2.9102221679999998 | -9.88 |
| 2.910637207 | -9.921 |
| 2.91105249 | -9.954 |
| 2.911467529 | -9.949 |
| 2.911882813 | -9.96 |
| 2.91229834 | -9.92 |
| 2.912713867 | -9.963 |
| 2.913129639 | -9.942 |
| 2.9135454100000002 | -9.995 |
| 2.913961182 | -9.92 |
| 2.914377197 | -9.974 |
| 2.914793457 | -9.973 |
| 2.915209961 | -10.007 |
| 2.915626221 | -9.989 |
| 2.9160427249999996 | -10.011 |
| 2.916459229 | -10.022 |
| 2.916875977 | -10.011 |
| 2.917292969 | -10.032 |
| 2.917709961 | -10.018 |
| 2.918126953 | -10.11 |
| 2.9185441890000003 | -10.094 |
| 2.9189614259999996 | -10.227 |
| 2.91937915 | -10.239 |
| 2.919796875 | -10.334 |
| 2.9202146 | -10.302 |
| 2.920632568 | -10.332 |
| 2.921050293 | -10.289 |
| 2.921468506 | -10.281 |
| 2.921886719 | -10.279 |
| 2.922304932 | -10.254 |
| 2.922723389 | -10.26 |
| 2.923141846 | -10.168 |
| 2.923560791 | -10.207 |
| 2.923979492 | -10.159 |
| 2.9243984380000003 | -10.207 |
| 2.924817383 | -10.157 |
| 2.9252365719999998 | -10.206 |
| 2.925655762 | -10.185 |
| 2.9260751949999997 | -10.205 |
| 2.926494629 | -10.166 |
| 2.926914307 | -10.205 |
| 2.927334229 | -10.232 |
| 2.927753906 | -10.228 |
| 2.928174072 | -10.257 |
| 2.928593994 | -10.257 |
| 2.9290141600000004 | -10.318 |
| 2.9294345699999997 | -10.267 |
| 2.92985498 | -10.303 |
| 2.930275635 | -10.241 |
| 2.930696289 | -10.311 |
| 2.931117188 | -10.292 |
| 2.93153833 | -10.316 |
| 2.931959229 | -10.308 |
| 2.9323803710000003 | -10.36 |
| 2.932801758 | -10.38 |
| 2.933223145 | -10.371 |
| 2.9336447750000003 | -10.419 |
| 2.934066406 | -10.384 |
| 2.9344882809999997 | -10.442 |
| 2.934910156 | -10.404 |
| 2.9353320309999997 | -10.433 |
| 2.935754395 | -10.407 |
| 2.936176758 | -10.485 |
| 2.936599121 | -10.459 |
| 2.937021729 | -10.499 |
| 2.937444336 | -10.498 |
| 2.937866943 | -10.514 |
| 2.938289795 | -10.514 |
| 2.938712891 | -10.524 |
| 2.9391359859999997 | -10.579 |
| 2.939559326 | -10.549 |
| 2.9399829100000003 | -10.615 |
| 2.94040625 | -10.563 |
| 2.940829834 | -10.623 |
| 2.9412536620000003 | -10.616 |
| 2.94167749 | -10.689 |
| 2.942101563 | -10.641 |
| 2.942525635 | -10.726 |
| 2.9429497070000004 | -10.751 |
| 2.943374023 | -10.717 |
| 2.943798584 | -10.745 |
| 2.9442233890000002 | -10.705 |
| 2.944648193 | -10.745 |
| 2.945072998 | -10.743 |
| 2.9454978030000003 | -10.799 |
| 2.9459228520000003 | -10.749 |
| 2.946348145 | -10.837 |
| 2.946773438 | -10.768 |
| 2.9471989749999996 | -10.744 |
| 2.947624512 | -10.703 |
| 2.9480502929999997 | -10.708 |
| 2.948476318 | -10.705 |
| 2.9489020999999997 | -10.751 |
| 2.949328125 | -10.767 |
| 2.949754395 | -10.761 |
| 2.950180664 | -10.859 |
| 2.9506071780000003 | -10.85 |
| 2.951033691 | -10.904 |
| 2.9514604490000003 | -10.867 |
| 2.9518872070000004 | -10.925 |
| 2.9523139649999997 | -10.89 |
| 2.952741211 | -10.936 |
| 2.9531684570000003 | -10.873 |
| 2.953595703 | -10.901 |
| 2.954023193 | -10.917 |
| 2.9544506839999998 | -10.92 |
| 2.954878418 | -10.933 |
| 2.955306152 | -10.929 |
| 2.9557341310000003 | -10.985 |
| 2.956162109 | -10.951 |
| 2.956590332 | -10.992 |
| 2.957018799 | -10.933 |
| 2.957447266 | -10.986 |
| 2.9578757319999998 | -10.962 |
| 2.958304443 | -11.007 |
| 2.958733154 | -10.976 |
| 2.9591621089999998 | -11.033 |
| 2.959591064 | -11.056 |
| 2.960020264 | -11.058 |
| 2.960449463 | -11.068 |
| 2.960878906 | -11.055 |
| 2.961308594 | -11.093 |
| 2.9617382809999997 | -11.067 |
| 2.962168213 | -11.101 |
| 2.9625979 | -11.048 |
| 2.963028076 | -11.129 |
| 2.9634582519999997 | -11.121 |
| 2.963888428 | -11.166 |
| 2.964318848 | -11.153 |
| 2.964749268 | -11.227 |
| 2.965179932 | -11.235 |
| 2.9656110840000003 | -11.232 |
| 2.966041992 | -11.25 |
| 2.9664729000000003 | -11.247 |
| 2.9669040530000004 | -11.321 |
| 2.967335449 | -11.297 |
| 2.967766846 | -11.345 |
| 2.968198242 | -11.332 |
| 2.968629883 | -11.416 |
| 2.969061768 | -11.36 |
| 2.969493652 | -11.4 |
| 2.9699257809999997 | -11.406 |
| 2.970358154 | -11.421 |
| 2.970790283 | -11.396 |
| 2.971222656 | -11.388 |
| 2.9716552729999997 | -11.383 |
| 2.972087891 | -11.389 |
| 2.972520752 | -11.446 |
| 2.972953613 | -11.412 |
| 2.973386719 | -11.473 |
| 2.973820068 | -11.441 |
| 2.974253418 | -11.5 |
| 2.974686768 | -11.44 |
| 2.9751203609999997 | -11.494 |
| 2.9755539549999996 | -11.459 |
| 2.975987793 | -11.504 |
| 2.976421631 | -11.5 |
| 2.976855713 | -11.501 |
| 2.9772897950000003 | -11.546 |
| 2.977724121 | -11.552 |
| 2.978158936 | -11.607 |
| 2.978593506 | -11.536 |
| 2.979028076 | -11.598 |
| 2.9794628910000003 | -11.533 |
| 2.979897705 | -11.586 |
| 2.9803327640000004 | -11.536 |
| 2.980768066 | -11.567 |
| 2.9812033689999997 | -11.558 |
| 2.981638916 | -11.61 |
| 2.982074463 | -11.611 |
| 2.9825102539999997 | -11.618 |
| 2.9829460450000003 | -11.659 |
| 2.9833820799999997 | -11.648 |
| 2.983818115 | -11.692 |
| 2.984254395 | -11.634 |
| 2.984690674 | -11.678 |
| 2.9851271969999997 | -11.644 |
| 2.985563721 | -11.721 |
| 2.986000488 | -11.669 |
| 2.9864372560000003 | -11.728 |
| 2.986874512 | -11.737 |
| 2.987311523 | -11.782 |
| 2.987748779 | -11.781 |
| 2.9881862790000002 | -11.771 |
| 2.988623779 | -11.802 |
| 2.989061279 | -11.784 |
| 2.989499023 | -11.836 |
| 2.989937012 | -11.774 |
| 2.990375 | -11.844 |
| 2.990812988 | -11.838 |
| 2.991251465 | -11.895 |
| 2.991689941 | -11.86 |
| 2.9921284179999996 | -11.963 |
| 2.992567139 | -11.966 |
| 2.9930058589999997 | -11.984 |
| 2.993444824 | -11.978 |
| 2.993883789 | -11.962 |
| 2.994322998 | -12.013 |
| 2.9947622070000004 | -12.016 |
| 2.99520166 | -12.052 |
| 2.995641357 | -12.018 |
| 2.9960810550000003 | -12.107 |
| 2.996520996 | -12.032 |
| 2.996960693 | -12.081 |
| 2.9974008789999997 | -12.038 |
| 2.997841064 | -12.072 |
| 2.998281494 | -12.048 |
| 2.998721924 | -12.062 |
| 2.999162354 | -12.052 |
| 2.999603027 | -12.049 |
| 3.000044189 | -12.121 |
| 3.000485107 | -12.112 |
| 3.00092627 | -12.165 |
| 3.001367432 | -12.142 |
| 3.001808838 | -12.231 |
| 3.002250244 | -12.186 |
| 3.002691895 | -12.238 |
| 3.0031335450000003 | -12.192 |
| 3.003575439 | -12.236 |
| 3.004017578 | -12.249 |
| 3.0044599610000002 | -12.27 |
| 3.0049021 | -12.269 |
| 3.005344482 | -12.283 |
| 3.005787109 | -12.337 |
| 3.006229736 | -12.292 |
| 3.006672607 | -12.343 |
| 3.007115479 | -12.286 |
| 3.0075585940000003 | -12.337 |
| 3.008001709 | -12.299 |
| 3.008445068 | -12.342 |
| 3.008888672 | -12.301 |
| 3.0093322750000002 | -12.367 |
| 3.0097758789999998 | -12.386 |
| 3.010219727 | -12.397 |
| 3.010663574 | -12.421 |
| 3.011107666 | -12.431 |
| 3.0115520019999997 | -12.474 |
| 3.011996338 | -12.436 |
| 3.012440918 | -12.472 |
| 3.012885498 | -12.425 |
| 3.013330322 | -12.536 |
| 3.0137753910000002 | -12.516 |
| 3.014220215 | -12.556 |
| 3.014665527 | -12.557 |
| 3.0151108399999997 | -12.624 |
| 3.0155561520000003 | -12.619 |
| 3.016001709 | -12.643 |
| 3.016447266 | -12.653 |
| 3.016893066 | -12.638 |
| 3.0173391109999996 | -12.721 |
| 3.0177854 | -12.68 |
| 3.0182316890000003 | -12.713 |
| 3.018677979 | -12.707 |
| 3.019124268 | -12.787 |
| 3.019571045 | -12.744 |
| 3.020017578 | -12.8 |
| 3.0204646 | -12.776 |
| 3.020911621 | -12.806 |
| 3.021358643 | -12.795 |
| 3.021806152 | -12.759 |
| 3.0222534179999996 | -12.736 |
| 3.0227009280000003 | -12.754 |
| 3.023148682 | -12.802 |
| 3.0235964359999996 | -12.759 |
| 3.024044434 | -12.826 |
| 3.024492432 | -12.817 |
| 3.0249406739999998 | -12.877 |
| 3.025388916 | -12.842 |
| 3.025837402 | -12.888 |
| 3.026286133 | -12.849 |
| 3.026734863 | -12.898 |
| 3.027183838 | -12.89 |
| 3.0276328130000003 | -12.902 |
| 3.028081787 | -12.949 |
| 3.028531006 | -12.97 |
| 3.028980469 | -13.016 |
| 3.029429932 | -12.986 |
| 3.0298796390000002 | -13.057 |
| 3.030329346 | -13.017 |
| 3.030779541 | -13.082 |
| 3.031229492 | -13.031 |
| 3.031679688 | -13.069 |
| 3.032130127 | -13.071 |
| 3.032580566 | -13.122 |
| 3.03303125 | -13.12 |
| 3.033481934 | -13.16 |
| 3.033932617 | -13.207 |
| 3.034383789 | -13.214 |
| 3.0348347170000003 | -13.248 |
| 3.035286377 | -13.199 |
| 3.0357377929999996 | -13.258 |
| 3.036189209 | -13.235 |
| 3.0366408689999997 | -13.273 |
| 3.037092529 | -13.224 |
| 3.037544678 | -13.28 |
| 3.0379965820000003 | -13.261 |
| 3.0384487300000003 | -13.306 |
| 3.038901123 | -13.302 |
| 3.0393535160000003 | -13.324 |
| 3.039806396 | -13.365 |
| 3.040259277 | -13.343 |
| 3.040712158 | -13.364 |
| 3.041165039 | -13.337 |
| 3.041618164 | -13.399 |
| 3.0420715329999997 | -13.394 |
| 3.0425249020000003 | -13.45 |
| 3.0429785160000002 | -13.429 |
| 3.0434321289999997 | -13.504 |
| 3.043885986 | -13.517 |
| 3.0443400879999998 | -13.54 |
| 3.044794189 | -13.525 |
| 3.045248291 | -13.521 |
| 3.0457026369999998 | -13.534 |
| 3.046157227 | -13.54 |
| 3.046611816 | -13.559 |
| 3.04706665 | -13.578 |
| 3.047521484 | -13.678 |
| 3.047976563 | -13.652 |
| 3.048431641 | -13.698 |
| 3.0488872070000004 | -13.665 |
| 3.049342773 | -13.738 |
| 3.0497983399999997 | -13.767 |
| 3.050253906 | -13.799 |
| 3.050709961 | -13.774 |
| 3.051165771 | -13.794 |
| 3.05162207 | -13.812 |
| 3.052078125 | -13.785 |
| 3.052534668 | -13.828 |
| 3.052991211 | -13.832 |
| 3.053447998 | -13.916 |
| 3.0539047850000003 | -13.846 |
| 3.054361816 | -13.848 |
| 3.054818848 | -13.791 |
| 3.055276123 | -13.839 |
| 3.0557333979999997 | -13.835 |
| 3.056190918 | -13.851 |
| 3.0566484380000003 | -13.847 |
| 3.057106201 | -13.888 |
| 3.057564209 | -13.927 |
| 3.058022461 | -13.91 |
| 3.058480713 | -13.977 |
| 3.058938965 | -13.948 |
| 3.059397461 | -14.01 |
| 3.0598559570000003 | -13.979 |
| 3.060314697 | -14.017 |
| 3.060773682 | -13.984 |
| 3.061232666 | -14.066 |
| 3.06169165 | -14.057 |
| 3.062151123 | -14.089 |
| 3.062610596 | -14.114 |
| 3.0630703130000003 | -14.142 |
| 3.063529785 | -14.157 |
| 3.0639897460000003 | -14.133 |
| 3.064449707 | -14.157 |
| 3.064909912 | -14.139 |
| 3.065370117 | -14.221 |
| 3.0658303219999996 | -14.174 |
| 3.066291016 | -14.225 |
| 3.066751953 | -14.214 |
| 3.0672126459999998 | -14.284 |
| 3.067673584 | -14.275 |
| 3.068134521 | -14.364 |
| 3.068595947 | -14.368 |
| 3.069057129 | -14.38 |
| 3.069518799 | -14.391 |
| 3.0699802249999997 | -14.349 |
| 3.0704421390000003 | -14.393 |
| 3.070904053 | -14.392 |
| 3.071366211 | -14.45 |
| 3.071828369 | -14.409 |
| 3.072290771 | -14.473 |
| 3.072753174 | -14.425 |
| 3.0732158199999997 | -14.472 |
| 3.073678467 | -14.441 |
| 3.074141357 | -14.453 |
| 3.0746044919999997 | -14.455 |
| 3.0750676269999997 | -14.472 |
| 3.0755310060000003 | -14.491 |
| 3.0759946289999998 | -14.474 |
| 3.076458252 | -14.583 |
| 3.076921875 | -14.618 |
| 3.077385742 | -14.666 |
| 3.077849854 | -14.632 |
| 3.078313965 | -14.694 |
| 3.078778076 | -14.662 |
| 3.079242676 | -14.707 |
| 3.079707031 | -14.674 |
| 3.080171875 | -14.689 |
| 3.080636963 | -14.719 |
| 3.081101807 | -14.706 |
| 3.081566895 | -14.698 |
| 3.082032227 | -14.69 |
| 3.082497559 | -14.766 |
| 3.082963135 | -14.735 |
| 3.083428955 | -14.788 |
| 3.083894775 | -14.73 |
| 3.084360596 | -14.795 |
| 3.08482666 | -14.799 |
| 3.085293213 | -14.838 |
| 3.085759521 | -14.804 |
| 3.0862260740000003 | -14.834 |
| 3.0866928710000003 | -14.88 |
| 3.087159668 | -14.878 |
| 3.087626465 | -14.911 |
| 3.08809375 | -14.902 |
| 3.088560791 | -14.958 |
| 3.0890283199999997 | -14.913 |
| 3.0894958499999996 | -14.942 |
| 3.089963623 | -14.896 |
| 3.090431396 | -14.976 |
| 3.090899414 | -14.98 |
| 3.091367432 | -15.027 |
| 3.091835693 | -15.023 |
| 3.0923039549999998 | -15.066 |
| 3.092772705 | -15.059 |
| 3.093241211 | -15.063 |
| 3.093709961 | -15.086 |
| 3.094178955 | -15.045 |
| 3.094648193 | -15.108 |
| 3.095117432 | -15.072 |
| 3.095586914 | -15.102 |
| 3.096056396 | -15.066 |
| 3.0965258789999996 | -15.149 |
| 3.09699585 | -15.116 |
| 3.09746582 | -15.165 |
| 3.097935791 | -15.126 |
| 3.0984060060000003 | -15.144 |
| 3.098876465 | -15.17 |
| 3.099347168 | -15.155 |
| 3.0998176269999997 | -15.177 |
| 3.1002885740000004 | -15.184 |
| 3.100759521 | -15.26 |
| 3.101230469 | -15.258 |
| 3.1017016600000002 | -15.326 |
| 3.102173096 | -15.306 |
| 3.1026445309999997 | -15.367 |
| 3.103116211 | -15.32 |
| 3.103588135 | -15.336 |
| 3.1040603030000002 | -15.311 |
| 3.104532227 | -15.332 |
| 3.105004395 | -15.344 |
| 3.105476807 | -15.315 |
| 3.105949463 | -15.352 |
| 3.106422119 | -15.394 |
| 3.106894775 | -15.436 |
| 3.107367676 | -15.407 |
| 3.10784082 | -15.455 |
| 3.108313965 | -15.414 |
| 3.1087875979999997 | -15.459 |
| 3.10926123 | -15.437 |
| 3.1097348630000003 | -15.447 |
| 3.11020874 | -15.479 |
| 3.110682617 | -15.522 |
| 3.111156738 | -15.493 |
| 3.111630859 | -15.509 |
| 3.1121052249999996 | -15.545 |
| 3.112579834 | -15.532 |
| 3.113054688 | -15.565 |
| 3.1135295409999997 | -15.521 |
| 3.114004639 | -15.542 |
| 3.114479736 | -15.509 |
| 3.114954834 | -15.543 |
| 3.115430176 | -15.478 |
| 3.1159057619999997 | -15.522 |
| 3.116381592 | -15.53 |
| 3.116857422 | -15.57 |
| 3.117333252 | -15.569 |
| 3.11780957 | -15.562 |
| 3.118285889 | -15.59 |
| 3.1187624510000003 | -15.566 |
| 3.119239014 | -15.613 |
| 3.119715576 | -15.57 |
| 3.120192383 | -15.623 |
| 3.120669434 | -15.614 |
| 3.121146484 | -15.672 |
| 3.121623779 | -15.655 |
| 3.122101318 | -15.741 |
| 3.122579102 | -15.741 |
| 3.123056885 | -15.756 |
| 3.1235346679999996 | -15.76 |
| 3.124012695 | -15.746 |
| 3.1244909670000003 | -15.761 |
| 3.1249692380000003 | -15.75 |
| 3.1254477539999996 | -15.792 |
| 3.12592627 | -15.748 |
| 3.126405029 | -15.805 |
| 3.1268840329999996 | -15.752 |
| 3.127363281 | -15.795 |
| 3.127842529 | -15.74 |
| 3.128321777 | -15.768 |
| 3.12880127 | -15.74 |
| 3.129280762 | -15.758 |
| 3.1297607419999998 | -15.748 |
| 3.1302404790000002 | -15.736 |
| 3.130720703 | -15.781 |
| 3.131200928 | -15.774 |
| 3.131681152 | -15.81 |
| 3.132162109 | -15.771 |
| 3.132642578 | -15.845 |
| 3.133123535 | -15.799 |
| 3.133604492 | -15.828 |
| 3.134085449 | -15.797 |
| 3.134566895 | -15.841 |
| 3.135048096 | -15.838 |
| 3.135529785 | -15.873 |
| 3.1360114749999997 | -15.866 |
| 3.1364934079999998 | -15.879 |
| 3.136975586 | -15.929 |
| 3.137457764 | -15.898 |
| 3.137939941 | -15.918 |
| 3.138422363 | -15.881 |
| 3.138905029 | -15.908 |
| 3.139387695 | -15.852 |
| 3.139870605 | -15.894 |
| 3.1403535160000002 | -15.852 |
| 3.140836914 | -15.914 |
| 3.141320068 | -15.972 |
| 3.141803955 | -16.003 |
| 3.142287598 | -15.999 |
| 3.14277124 | -16.016 |
| 3.1432551269999998 | -16.038 |
| 3.143739258 | -15.998 |
| 3.1442233890000004 | -16.023 |
| 3.144707764 | -15.964 |
| 3.145192383 | -16.02 |
| 3.1456770019999998 | -15.984 |
| 3.146161865 | -15.977 |
| 3.1466469729999997 | -15.941 |
| 3.147132324 | -16.005 |
| 3.147617432 | -15.983 |
| 3.1481027829999997 | -15.987 |
| 3.148588379 | -15.984 |
| 3.149074219 | -15.968 |
| 3.1495600589999997 | -15.997 |
| 3.150046143 | -15.971 |
| 3.1505322270000002 | -16 |
| 3.1510185550000003 | -15.973 |
| 3.1515053710000003 | -16.048 |
| 3.151991943 | -16.005 |
| 3.15247876 | -16.051 |
| 3.152965576 | -16.024 |
| 3.153452637 | -16.055 |
| 3.153939941 | -16.025 |
| 3.154427246 | -16.023 |
| 3.1549147950000003 | -16.003 |
| 3.155402344 | -15.993 |
| 3.1558903810000003 | -16.032 |
| 3.1563784179999996 | -15.994 |
| 3.156866699 | -16.038 |
| 3.15735498 | -16.023 |
| 3.1578432619999997 | -16.067 |
| 3.1583317870000003 | -16.003 |
| 3.158820557 | -16.042 |
| 3.15930957 | -15.99 |
| 3.1597985840000002 | -16.029 |
| 3.160287598 | -16.008 |
| 3.160777344 | -16.004 |
| 3.161266846 | -16.016 |
| 3.161756348 | -16.043 |
| 3.162246094 | -16.058 |
| 3.162736084 | -16.024 |
| 3.163226318 | -16.081 |
| 3.163716553 | -16.032 |
| 3.164206787 | -16.07 |
| 3.16469751 | -16.003 |
| 3.1651882319999998 | -16.025 |
| 3.165679199 | -15.999 |
| 3.1661701659999997 | -16.054 |
| 3.166661377 | -16.017 |
| 3.167152588 | -16.042 |
| 3.167644287 | -16.072 |
| 3.168135742 | -16.067 |
| 3.168627441 | -16.078 |
| 3.169119385 | -16.034 |
| 3.169611572 | -16.058 |
| 3.17010376 | -16.022 |
| 3.170596436 | -16.064 |
| 3.171088867 | -15.997 |
| 3.171581543 | -16.051 |
| 3.172074463 | -16.036 |
| 3.172567383 | -16.067 |
| 3.173060547 | -16.03 |
| 3.173553955 | -16.048 |
| 3.174047363 | -16.047 |
| 3.174541016 | -16.024 |
| 3.175034668 | -16.032 |
| 3.175528809 | -15.978 |
| 3.176022949 | -16.019 |
| 3.17651709 | -16.002 |
| 3.1770114749999996 | -16.039 |
| 3.177506104 | -15.992 |
| 3.178000732 | -16.062 |
| 3.178495605 | -16.022 |
| 3.178990479 | -16.039 |
| 3.179485596 | -16.008 |
| 3.179980957 | -15.994 |
| 3.180476807 | -15.991 |
| 3.180972412 | -15.978 |
| 3.181468018 | -15.98 |
| 3.1819641109999997 | -15.948 |
| 3.182459961 | -16.01 |
| 3.1829562989999998 | -15.968 |
| 3.183452637 | -16.007 |
| 3.183949219 | -15.96 |
| 3.184445801 | -15.992 |
| 3.184942627 | -15.944 |
| 3.1854399410000003 | -15.96 |
| 3.1859372560000003 | -15.923 |
| 3.18643457 | -15.971 |
| 3.186931885 | -16 |
| 3.187429443 | -15.991 |
| 3.187927246 | -16.004 |
| 3.188425293 | -15.989 |
| 3.1889233399999997 | -16.041 |
| 3.189421631 | -15.979 |
| 3.189919922 | -16.011 |
| 3.190418701 | -15.937 |
| 3.19091748 | -15.967 |
| 3.19141626 | -15.885 |
| 3.1919152829999997 | -15.895 |
| 3.1924145509999997 | -15.87 |
| 3.192913818 | -15.924 |
| 3.19341333 | -15.933 |
| 3.1939130860000002 | -15.909 |
| 3.194412842 | -15.929 |
| 3.1949128420000004 | -15.889 |
| 3.195413086 | -15.908 |
| 3.195913574 | -15.853 |
| 3.196413818 | -15.875 |
| 3.196914551 | -15.846 |
| 3.1974152829999998 | -15.933 |
| 3.197916016 | -15.871 |
| 3.1984174800000003 | -15.894 |
| 3.198918701 | -15.869 |
| 3.199419922 | -15.897 |
| 3.199921631 | -15.878 |
| 3.200423584 | -15.872 |
| 3.2009252929999996 | -15.882 |
| 3.201427246 | -15.837 |
| 3.201929443 | -15.862 |
| 3.2024318849999998 | -15.769 |
| 3.2029343260000003 | -15.809 |
| 3.2034370119999998 | -15.775 |
| 3.2039396969999996 | -15.876 |
| 3.2044426269999997 | -15.826 |
| 3.2049460450000002 | -15.853 |
| 3.205449219 | -15.814 |
| 3.2059526369999998 | -15.784 |
| 3.206456299 | -15.778 |
| 3.206959961 | -15.725 |
| 3.207463867 | -15.732 |
| 3.207968018 | -15.718 |
| 3.2084721679999997 | -15.757 |
| 3.2089765630000002 | -15.657 |
| 3.2094809570000002 | -15.694 |
| 3.209986084 | -15.659 |
| 3.210490967 | -15.683 |
| 3.2109958499999998 | -15.622 |
| 3.211500977 | -15.617 |
| 3.212006348 | -15.578 |
| 3.212511719 | -15.597 |
| 3.213017578 | -15.587 |
| 3.213523193 | -15.555 |
| 3.214029297 | -15.588 |
| 3.2145354000000004 | -15.569 |
| 3.2150419919999997 | -15.589 |
| 3.21554834 | -15.525 |
| 3.216054932 | -15.572 |
| 3.216561768 | -15.499 |
| 3.217068604 | -15.546 |
| 3.217575684 | -15.489 |
| 3.2180830080000002 | -15.491 |
| 3.218590332 | -15.487 |
| 3.2190979000000004 | -15.535 |
| 3.219605713 | -15.524 |
| 3.2201137699999998 | -15.508 |
| 3.220621826 | -15.555 |
| 3.221129883 | -15.511 |
| 3.2216384280000003 | -15.537 |
| 3.222146729 | -15.447 |
| 3.222655518 | -15.456 |
| 3.2231643070000002 | -15.413 |
| 3.22367334 | -15.453 |
| 3.224182617 | -15.376 |
| 3.224691895 | -15.445 |
| 3.22520166 | -15.441 |
| 3.225711182 | -15.433 |
| 3.226220947 | -15.405 |
| 3.226730957 | -15.385 |
| 3.227241211 | -15.391 |
| 3.227751465 | -15.347 |
| 3.228261963 | -15.363 |
| 3.228772461 | -15.29 |
| 3.229283203 | -15.325 |
| 3.229794189 | -15.255 |
| 3.230305664 | -15.282 |
| 3.230816895 | -15.226 |
| 3.231328125 | -15.274 |
| 3.231839844 | -15.233 |
| 3.2323515630000004 | -15.219 |
| 3.2328635250000004 | -15.193 |
| 3.233375488 | -15.156 |
| 3.233887695 | -15.183 |
| 3.234400146 | -15.167 |
| 3.2349128420000004 | -15.188 |
| 3.235425781 | -15.141 |
| 3.2359384770000004 | -15.209 |
| 3.23645166 | -15.152 |
| 3.236964844 | -15.176 |
| 3.237478271 | -15.124 |
| 3.237991699 | -15.135 |
| 3.238505371 | -15.122 |
| 3.239019287 | -15.113 |
| 3.239533447 | -15.086 |
| 3.240047607 | -15.088 |
| 3.240562012 | -15.124 |
| 3.24107666 | -15.089 |
| 3.241591309 | -15.143 |
| 3.242106201 | -15.12 |
| 3.242621094 | -15.157 |
| 3.24313623 | -15.102 |
| 3.2436516109999998 | -15.112 |
| 3.2441672359999996 | -15.047 |
| 3.244682861 | -15.076 |
| 3.2451987300000003 | -15.051 |
| 3.245714844 | -15.052 |
| 3.2462309570000003 | -15.035 |
| 3.2467473140000003 | -15.017 |
| 3.247263916 | -15.028 |
| 3.247780518 | -14.978 |
| 3.2482973630000003 | -14.99 |
| 3.2488142090000003 | -14.914 |
| 3.249331299 | -14.95 |
| 3.249848633 | -14.893 |
| 3.250366455 | -14.909 |
| 3.2508840329999997 | -14.861 |
| 3.251401855 | -14.916 |
| 3.251919678 | -14.887 |
| 3.252437988 | -14.886 |
| 3.252956299 | -14.89 |
| 3.253474609 | -14.882 |
| 3.253993164 | -14.883 |
| 3.254511963 | -14.844 |
| 3.2550310060000003 | -14.888 |
| 3.2555502929999998 | -14.847 |
| 3.2560695799999997 | -14.911 |
| 3.256589111 | -14.852 |
| 3.257108643 | -14.891 |
| 3.257628418 | -14.904 |
| 3.258148438 | -14.964 |
| 3.258668457 | -14.908 |
| 3.259188721 | -14.916 |
| 3.2597092290000003 | -14.874 |
| 3.26022998 | -14.819 |
| 3.2607509770000003 | -14.827 |
| 3.261271973 | -14.779 |
| 3.261792969 | -14.805 |
| 3.262314209 | -14.79 |
| 3.262835693 | -14.807 |
| 3.263357422 | -14.723 |
| 3.26387915 | -14.779 |
| 3.2644011230000003 | -14.728 |
| 3.264923096 | -14.759 |
| 3.2654453130000003 | -14.715 |
| 3.265968018 | -14.72 |
| 3.266490723 | -14.737 |
| 3.2670134280000003 | -14.747 |
| 3.267536377 | -14.75 |
| 3.2680595699999997 | -14.705 |
| 3.268582764 | -14.764 |
| 3.269106201 | -14.73 |
| 3.269629883 | -14.762 |
| 3.270153809 | -14.685 |
| 3.270677734 | -14.712 |
| 3.271202148 | -14.641 |
| 3.271726318 | -14.646 |
| 3.272250732 | -14.6 |
| 3.272775391 | -14.604 |
| 3.2733002929999997 | -14.62 |
| 3.2738251949999997 | -14.629 |
| 3.274350342 | -14.656 |
| 3.274875488 | -14.63 |
| 3.275401123 | -14.665 |
| 3.275926758 | -14.601 |
| 3.276452637 | -14.629 |
| 3.27697876 | -14.552 |
| 3.277504883 | -14.585 |
| 3.27803125 | -14.558 |
| 3.278557617 | -14.587 |
| 3.279084229 | -14.538 |
| 3.279611084 | -14.543 |
| 3.280138184 | -14.547 |
| 3.280665283 | -14.526 |
| 3.281192627 | -14.53 |
| 3.281720459 | -14.477 |
| 3.282248047 | -14.501 |
| 3.282775879 | -14.463 |
| 3.283303955 | -14.495 |
| 3.2838320309999998 | -14.433 |
| 3.284360352 | -14.497 |
| 3.284888916 | -14.466 |
| 3.28541748 | -14.488 |
| 3.2859465329999997 | -14.449 |
| 3.286475342 | -14.463 |
| 3.2870048830000003 | -14.444 |
| 3.28753418 | -14.424 |
| 3.288063721 | -14.42 |
| 3.288593506 | -14.379 |
| 3.2891232909999997 | -14.428 |
| 3.289653564 | -14.398 |
| 3.290183594 | -14.451 |
| 3.2907141109999998 | -14.408 |
| 3.291244629 | -14.477 |
| 3.2917753910000003 | -14.41 |
| 3.292306641 | -14.452 |
| 3.2928376459999997 | -14.439 |
| 3.293368896 | -14.436 |
| 3.293900391 | -14.455 |
| 3.294431885 | -14.446 |
| 3.294963623 | -14.432 |
| 3.295495605 | -14.398 |
| 3.296027588 | -14.45 |
| 3.296560059 | -14.387 |
| 3.2970927729999997 | -14.432 |
| 3.297625244 | -14.352 |
| 3.298157959 | -14.341 |
| 3.2986909179999997 | -14.283 |
| 3.2992241210000004 | -14.284 |
| 3.299757568 | -14.231 |
| 3.300291016 | -14.258 |
| 3.3008247070000003 | -14.258 |
| 3.3013583979999996 | -14.241 |
| 3.301892334 | -14.259 |
| 3.302427002 | -14.251 |
| 3.302961182 | -14.273 |
| 3.30349585 | -14.213 |
| 3.3040305180000002 | -14.234 |
| 3.3045654300000002 | -14.15 |
| 3.3051003420000002 | -14.193 |
| 3.305635498 | -14.147 |
| 3.306170898 | -14.161 |
| 3.3067065429999998 | -14.138 |
| 3.307242188 | -14.187 |
| 3.3077783199999997 | -14.169 |
| 3.308314453 | -14.159 |
| 3.30885083 | -14.168 |
| 3.3093872070000003 | -14.13 |
| 3.309923828 | -14.165 |
| 3.3104604490000002 | -14.129 |
| 3.310997559 | -14.144 |
| 3.3115346679999997 | -14.108 |
| 3.312072021 | -14.164 |
| 3.312609375 | -14.108 |
| 3.313147217 | -14.14 |
| 3.313685059 | -14.16 |
| 3.314223145 | -14.18 |
| 3.3147612300000002 | -14.142 |
| 3.315299561 | -14.105 |
| 3.315838135 | -14.079 |
| 3.316376953 | -14.085 |
| 3.316915771 | -14.111 |
| 3.3174548340000003 | -14.06 |
| 3.317993896 | -14.1 |
| 3.3185336910000003 | -14.082 |
| 3.319073242 | -14.085 |
| 3.319613037 | -14.008 |
| 3.320152832 | -14.039 |
| 3.3206928710000003 | -13.988 |
| 3.321233154 | -13.999 |
| 3.321773682 | -13.95 |
| 3.322314453 | -13.939 |
| 3.3228552249999996 | -13.95 |
| 3.3233959960000004 | -13.953 |
| 3.3239375 | -13.968 |
| 3.32447876 | -13.92 |
| 3.3250202640000004 | -13.981 |
| 3.325562012 | -13.928 |
| 3.326104004 | -13.96 |
| 3.3266459960000003 | -13.891 |
| 3.327188232 | -13.902 |
| 3.327730469 | -13.861 |
| 3.328273193 | -13.884 |
| 3.3288159179999997 | -13.848 |
| 3.3293591310000004 | -13.852 |
| 3.3299021 | -13.887 |
| 3.3304453130000002 | -13.868 |
| 3.33098877 | -13.881 |
| 3.331532471 | -13.834 |
| 3.332076416 | -13.864 |
| 3.3326203609999996 | -13.818 |
| 3.333164551 | -13.857 |
| 3.33370874 | -13.802 |
| 3.334253418 | -13.847 |
| 3.33479834 | -13.836 |
| 3.335343262 | -13.858 |
| 3.335888184 | -13.833 |
| 3.3364333499999996 | -13.853 |
| 3.33697876 | -13.858 |
| 3.3375244139999998 | -13.819 |
| 3.3380703130000002 | -13.827 |
| 3.338616211 | -13.76 |
| 3.339162354 | -13.793 |
| 3.339708496 | -13.755 |
| 3.340255371 | -13.789 |
| 3.3408020019999998 | -13.741 |
| 3.3413488769999997 | -13.819 |
| 3.341895752 | -13.786 |
| 3.342443115 | -13.8 |
| 3.342990479 | -13.775 |
| 3.3435378420000004 | -13.766 |
| 3.344085693 | -13.773 |
| 3.344633545 | -13.751 |
| 3.345181885 | -13.753 |
| 3.3457302249999996 | -13.71 |
| 3.3462788089999997 | -13.775 |
| 3.346827393 | -13.728 |
| 3.347376221 | -13.769 |
| 3.347925049 | -13.73 |
| 3.348474365 | -13.78 |
| 3.349023682 | -13.73 |
| 3.349573242 | -13.75 |
| 3.350122803 | -13.708 |
| 3.350673096 | -13.716 |
| 3.351223145 | -13.742 |
| 3.3517734380000004 | -13.721 |
| 3.35232373 | -13.748 |
| 3.352874512 | -13.742 |
| 3.353425293 | -13.792 |
| 3.353976318 | -13.728 |
| 3.354527344 | -13.767 |
| 3.3550786130000003 | -13.701 |
| 3.355630371 | -13.744 |
| 3.356182129 | -13.707 |
| 3.356734131 | -13.711 |
| 3.357286133 | -13.69 |
| 3.357838379 | -13.724 |
| 3.358390869 | -13.73 |
| 3.358943359 | -13.718 |
| 3.359496338 | -13.746 |
| 3.360049316 | -13.714 |
| 3.360602295 | -13.741 |
| 3.3611557619999997 | -13.682 |
| 3.361709473 | -13.706 |
| 3.362263184 | -13.656 |
| 3.362817139 | -13.712 |
| 3.363371094 | -13.67 |
| 3.363925537 | -13.697 |
| 3.36447998 | -13.695 |
| 3.365034424 | -13.725 |
| 3.365589355 | -13.717 |
| 3.366144287 | -13.694 |
| 3.366699463 | -13.699 |
| 3.367255127 | -13.657 |
| 3.367810547 | -13.699 |
| 3.368366211 | -13.643 |
| 3.368922119 | -13.673 |
| 3.3694782709999997 | -13.655 |
| 3.3700346679999997 | -13.714 |
| 3.370591064 | -13.667 |
| 3.371147705 | -13.7 |
| 3.37170459 | -13.68 |
| 3.3722614749999997 | -13.683 |
| 3.372818848 | -13.675 |
| 3.373376221 | -13.643 |
| 3.373933838 | -13.655 |
| 3.374491699 | -13.648 |
| 3.375049561 | -13.687 |
| 3.375607666 | -13.636 |
| 3.376166016 | -13.697 |
| 3.376724365 | -13.664 |
| 3.377282959 | -13.7 |
| 3.377841797 | -13.649 |
| 3.378401123 | -13.668 |
| 3.378960449 | -13.639 |
| 3.3795197750000003 | -13.657 |
| 3.380079346 | -13.647 |
| 3.3806391600000003 | -13.63 |
| 3.381199219 | -13.671 |
| 3.381759277 | -13.67 |
| 3.38231958 | -13.704 |
| 3.382880127 | -13.66 |
| 3.383440918 | -13.712 |
| 3.384001953 | -13.659 |
| 3.3845629880000003 | -13.7 |
| 3.385124268 | -13.643 |
| 3.385685791 | -13.663 |
| 3.3862473140000002 | -13.659 |
| 3.386809326 | -13.692 |
| 3.387371338 | -13.679 |
| 3.38793335 | -13.689 |
| 3.38849585 | -13.728 |
| 3.38905835 | -13.699 |
| 3.389621338 | -13.727 |
| 3.390184326 | -13.664 |
| 3.390747559 | -13.699 |
| 3.391310791 | -13.66 |
| 3.391874268 | -13.702 |
| 3.392437988 | -13.649 |
| 3.393001709 | -13.702 |
| 3.3935659179999997 | -13.701 |
| 3.394130127 | -13.721 |
| 3.394694824 | -13.706 |
| 3.395259521 | -13.707 |
| 3.395824219 | -13.724 |
| 3.3963894040000002 | -13.695 |
| 3.39695459 | -13.712 |
| 3.397519775 | -13.653 |
| 3.3980854490000003 | -13.714 |
| 3.398651123 | -13.691 |
| 3.399217041 | -13.731 |
| 3.399783203 | -13.686 |
| 3.400349854 | -13.746 |
| 3.40091626 | -13.709 |
| 3.401483154 | -13.713 |
| 3.402050049 | -13.685 |
| 3.402616943 | -13.669 |
| 3.403184326 | -13.693 |
| 3.4037517090000002 | -13.668 |
| 3.404319336 | -13.68 |
| 3.4048872070000002 | -13.655 |
| 3.405455322 | -13.729 |
| 3.406023682 | -13.674 |
| 3.4065920409999997 | -13.71 |
| 3.407160645 | -13.664 |
| 3.407729492 | -13.693 |
| 3.40829834 | -13.656 |
| 3.408867676 | -13.66 |
| 3.4094370119999997 | -13.628 |
| 3.4100065920000002 | -13.647 |
| 3.410576172 | -13.674 |
| 3.41114624 | -13.653 |
| 3.411716553 | -13.688 |
| 3.412286865 | -13.664 |
| 3.412857422 | -13.706 |
| 3.413427979 | -13.647 |
| 3.413998779 | -13.68 |
| 3.414570068 | -13.614 |
| 3.4151411130000002 | -13.66 |
| 3.415712646 | -13.633 |
| 3.41628418 | -13.65 |
| 3.416856201 | -13.644 |
| 3.417428467 | -13.678 |
| 3.418000732 | -13.693 |
| 3.418572998 | -13.668 |
| 3.419145752 | -13.7 |
| 3.419718506 | -13.653 |
| 3.4202915039999997 | -13.699 |
| 3.4208645019999997 | -13.652 |
| 3.421437988 | -13.679 |
| 3.4220114749999997 | -13.645 |
| 3.422585205 | -13.714 |
| 3.423159424 | -13.678 |
| 3.423733643 | -13.71 |
| 3.424307861 | -13.712 |
| 3.424882568 | -13.721 |
| 3.4254572750000003 | -13.725 |
| 3.426031982 | -13.695 |
| 3.4266071780000003 | -13.698 |
| 3.427182373 | -13.669 |
| 3.427758057 | -13.726 |
| 3.428333496 | -13.678 |
| 3.4289096679999997 | -13.734 |
| 3.42948584 | -13.719 |
| 3.430062012 | -13.773 |
| 3.4306384280000004 | -13.732 |
| 3.431215088 | -13.762 |
| 3.431791992 | -13.737 |
| 3.432369141 | -13.746 |
| 3.4329462889999998 | -13.752 |
| 3.433523682 | -13.722 |
| 3.434101318 | -13.748 |
| 3.434679443 | -13.752 |
| 3.435257324 | -13.796 |
| 3.435835693 | -13.75 |
| 3.436414063 | -13.814 |
| 3.436992676 | -13.773 |
| 3.437571289 | -13.815 |
| 3.438150391 | -13.774 |
| 3.4387294919999998 | -13.782 |
| 3.439308838 | -13.769 |
| 3.439888672 | -13.805 |
| 3.440468506 | -13.804 |
| 3.4410485840000002 | -13.796 |
| 3.4416286620000003 | -13.847 |
| 3.442208984 | -13.831 |
| 3.4427895509999997 | -13.867 |
| 3.443370361 | -13.818 |
| 3.4439511720000002 | -13.856 |
| 3.4445322270000003 | -13.816 |
| 3.44511377 | -13.863 |
| 3.445695557 | -13.812 |
| 3.4462770999999996 | -13.845 |
| 3.446859131 | -13.86 |
| 3.447441162 | -13.892 |
| 3.4480234380000003 | -13.885 |
| 3.4486059570000003 | -13.888 |
| 3.449188721 | -13.923 |
| 3.449771729 | -13.892 |
| 3.450354736 | -13.925 |
| 3.450937988 | -13.866 |
| 3.451521729 | -13.918 |
| 3.452105469 | -13.902 |
| 3.452689453 | -13.953 |
| 3.453273438 | -13.908 |
| 3.4538576659999998 | -13.973 |
| 3.454442139 | -13.969 |
| 3.4550268550000003 | -13.981 |
| 3.4556118160000002 | -13.972 |
| 3.456196777 | -13.952 |
| 3.456781982 | -13.972 |
| 3.4573679200000003 | -13.951 |
| 3.457953613 | -13.982 |
| 3.458539307 | -13.942 |
| 3.459125488 | -14.026 |
| 3.4597116700000003 | -14.004 |
| 3.460298096 | -14.053 |
| 3.460884766 | -14.022 |
| 3.4614716800000003 | -14.075 |
| 3.462058838 | -14.051 |
| 3.462645996 | -14.068 |
| 3.463233643 | -14.048 |
| 3.463821533 | -14.042 |
| 3.46440918 | -14.087 |
| 3.464997314 | -14.079 |
| 3.465585693 | -14.108 |
| 3.466174072 | -14.089 |
| 3.466762695 | -14.161 |
| 3.4673515630000002 | -14.111 |
| 3.467940674 | -14.158 |
| 3.4685297850000003 | -14.104 |
| 3.4691196289999997 | -14.137 |
| 3.4697092290000002 | -14.125 |
| 3.470299072 | -14.145 |
| 3.47088916 | -14.133 |
| 3.471479492 | -14.162 |
| 3.472069824 | -14.199 |
| 3.472660645 | -14.18 |
| 3.4732514649999997 | -14.22 |
| 3.473842529 | -14.185 |
| 3.474433838 | -14.231 |
| 3.475025391 | -14.189 |
| 3.475617188 | -14.217 |
| 3.476208984 | -14.171 |
| 3.4768010250000003 | -14.237 |
| 3.4773933109999997 | -14.227 |
| 3.4779858399999997 | -14.252 |
| 3.4785786130000003 | -14.254 |
| 3.479171387 | -14.288 |
| 3.479764404 | -14.302 |
| 3.4803576659999997 | -14.275 |
| 3.480951416 | -14.293 |
| 3.481545166 | -14.253 |
| 3.48213916 | -14.32 |
| 3.482733154 | -14.281 |
| 3.483327393 | -14.326 |
| 3.483921875 | -14.306 |
| 3.4845166020000002 | -14.381 |
| 3.4851115719999997 | -14.347 |
| 3.4857065429999996 | -14.384 |
| 3.486302002 | -14.379 |
| 3.486897705 | -14.379 |
| 3.4874934079999997 | -14.388 |
| 3.488089355 | -14.35 |
| 3.488685547 | -14.37 |
| 3.4892817380000003 | -14.363 |
| 3.489878418 | -14.427 |
| 3.490475098 | -14.378 |
| 3.491072021 | -14.439 |
| 3.491669189 | -14.413 |
| 3.492266846 | -14.461 |
| 3.4928645019999998 | -14.424 |
| 3.493462158 | -14.439 |
| 3.4940600589999997 | -14.413 |
| 3.4946582029999997 | -14.435 |
| 3.495256592 | -14.443 |
| 3.4958552249999997 | -14.431 |
| 3.496454102 | -14.479 |
| 3.4970529790000002 | -14.478 |
| 3.4976521 | -14.52 |
| 3.498251953 | -14.471 |
| 3.498851563 | -14.518 |
| 3.499451172 | -14.466 |
| 3.5000512699999997 | -14.52 |
| 3.500651611 | -14.487 |
| 3.501251953 | -14.507 |
| 3.501852539 | -14.512 |
| 3.502453369 | -14.552 |
| 3.503054443 | -14.556 |
| 3.5036557619999997 | -14.565 |
| 3.504257324 | -14.622 |
| 3.5048591310000003 | -14.603 |
| 3.505460938 | -14.649 |
| 3.506062988 | -14.597 |
| 3.506665283 | -14.632 |
| 3.5072678219999998 | -14.618 |
| 3.507870605 | -14.679 |
| 3.508473389 | -14.645 |
| 3.509076416 | -14.702 |
| 3.509679932 | -14.715 |
| 3.510283691 | -14.745 |
| 3.510887451 | -14.746 |
| 3.511491455 | -14.743 |
| 3.512095459 | -14.765 |
| 3.512699951 | -14.751 |
| 3.513304443 | -14.792 |
| 3.51390918 | -14.747 |
| 3.51451416 | -14.817 |
| 3.5151193849999998 | -14.809 |
| 3.515724854 | -14.864 |
| 3.516330566 | -14.836 |
| 3.516936523 | -14.906 |
| 3.51754248 | -14.891 |
| 3.518148682 | -14.909 |
| 3.518755127 | -14.896 |
| 3.519361816 | -14.873 |
| 3.51996875 | -14.913 |
| 3.5205756839999998 | -14.907 |
| 3.521183105 | -14.937 |
| 3.5217905270000003 | -14.911 |
| 3.522398438 | -14.994 |
| 3.523006348 | -14.956 |
| 3.523614502 | -15.003 |
| 3.5242229000000003 | -14.955 |
| 3.524831299 | -14.986 |
| 3.525440186 | -14.972 |
| 3.5260490719999997 | -14.993 |
| 3.5266582029999998 | -14.977 |
| 3.527267578 | -14.994 |
| 3.5278771969999996 | -15.044 |
| 3.528487305 | -15.028 |
| 3.529097412 | -15.068 |
| 3.52970752 | -15.049 |
| 3.530318115 | -15.1 |
| 3.530928711 | -15.052 |
| 3.531539551 | -15.095 |
| 3.532150635 | -15.04 |
| 3.532761963 | -15.091 |
| 3.5333732909999997 | -15.083 |
| 3.533985107 | -15.107 |
| 3.534597656 | -15.105 |
| 3.5352097170000003 | -15.148 |
| 3.535822021 | -15.177 |
| 3.53643457 | -15.157 |
| 3.537047363 | -15.185 |
| 3.5376604 | -15.137 |
| 3.538273438 | -15.19 |
| 3.538886963 | -15.158 |
| 3.5395004880000003 | -15.195 |
| 3.540114746 | -15.153 |
| 3.54072876 | -15.227 |
| 3.541343018 | -15.201 |
| 3.54195752 | -15.229 |
| 3.542572021 | -15.231 |
| 3.5431870119999997 | -15.239 |
| 3.543802002 | -15.243 |
| 3.54441748 | -15.221 |
| 3.5450329590000003 | -15.235 |
| 3.545648682 | -15.219 |
| 3.546264893 | -15.291 |
| 3.546881104 | -15.249 |
| 3.547497559 | -15.299 |
| 3.548114258 | -15.281 |
| 3.548730957 | -15.342 |
| 3.5493479000000003 | -15.302 |
| 3.549965332 | -15.32 |
| 3.550582764 | -15.293 |
| 3.551200439 | -15.314 |
| 3.551818359 | -15.33 |
| 3.552436768 | -15.311 |
| 3.553054932 | -15.342 |
| 3.553673584 | -15.348 |
| 3.5542922359999998 | -15.408 |
| 3.554911133 | -15.363 |
| 3.555530518 | -15.419 |
| 3.556149902 | -15.375 |
| 3.556769531 | -15.419 |
| 3.55738916 | -15.38 |
| 3.558009277 | -15.393 |
| 3.558629883 | -15.385 |
| 3.559250488 | -15.426 |
| 3.559871094 | -15.433 |
| 3.560491943 | -15.43 |
| 3.561113037 | -15.483 |
| 3.561734375 | -15.472 |
| 3.5623559570000003 | -15.509 |
| 3.562977783 | -15.454 |
| 3.563599854 | -15.486 |
| 3.564221924 | -15.454 |
| 3.564844727 | -15.513 |
| 3.565467285 | -15.468 |
| 3.5660903320000004 | -15.503 |
| 3.566713379 | -15.512 |
| 3.56733667 | -15.551 |
| 3.567960205 | -15.549 |
| 3.568583984 | -15.552 |
| 3.569207764 | -15.567 |
| 3.569832031 | -15.542 |
| 3.5704565429999997 | -15.583 |
| 3.571081299 | -15.532 |
| 3.571706299 | -15.587 |
| 3.572331299 | -15.577 |
| 3.5729565429999997 | -15.632 |
| 3.573582031 | -15.592 |
| 3.574207764 | -15.653 |
| 3.574833496 | -15.634 |
| 3.575459717 | -15.649 |
| 3.576086182 | -15.635 |
| 3.576712646 | -15.614 |
| 3.577339844 | -15.637 |
| 3.577966797 | -15.641 |
| 3.578593994 | -15.672 |
| 3.5792214359999996 | -15.637 |
| 3.579849121 | -15.711 |
| 3.580477051 | -15.687 |
| 3.581105225 | -15.745 |
| 3.581733643 | -15.704 |
| 3.582362061 | -15.736 |
| 3.582990967 | -15.711 |
| 3.583620361 | -15.743 |
| 3.584249512 | -15.715 |
| 3.5848789059999997 | -15.718 |
| 3.585508545 | -15.757 |
| 3.5861384280000004 | -15.755 |
| 3.586768555 | -15.79 |
| 3.5873989259999997 | -15.761 |
| 3.588029541 | -15.812 |
| 3.588660156 | -15.757 |
| 3.5892915039999997 | -15.799 |
| 3.589922852 | -15.733 |
| 3.590554199 | -15.766 |
| 3.591185791 | -15.754 |
| 3.5918178710000004 | -15.782 |
| 3.592449951 | -15.758 |
| 3.593082275 | -15.793 |
| 3.593714844 | -15.822 |
| 3.5943474120000003 | -15.805 |
| 3.5949804690000002 | -15.829 |
| 3.595614014 | -15.772 |
| 3.596247559 | -15.81 |
| 3.596881104 | -15.783 |
| 3.597515137 | -15.816 |
| 3.59814917 | -15.759 |
| 3.5987834469999997 | -15.829 |
| 3.599417969 | -15.804 |
| 3.600052979 | -15.832 |
| 3.6006879880000002 | -15.81 |
| 3.601322998 | -15.817 |
| 3.601958984 | -15.813 |
| 3.6025944819999998 | -15.796 |
| 3.603230469 | -15.797 |
| 3.603866699 | -15.755 |
| 3.60450293 | -15.812 |
| 3.6051396479999998 | -15.772 |
| 3.605776367 | -15.803 |
| 3.6064133299999996 | -15.771 |
| 3.607050537 | -15.838 |
| 3.6076879880000003 | -15.787 |
| 3.608326172 | -15.804 |
| 3.6089641109999997 | -15.754 |
| 3.609602295 | -15.75 |
| 3.6102404790000002 | -15.754 |
| 3.61087915 | -15.737 |
| 3.611518066 | -15.733 |
| 3.612156982 | -15.731 |
| 3.612796387 | -15.784 |
| 3.6134357909999997 | -15.729 |
| 3.614075684 | -15.773 |
| 3.61471582 | -15.711 |
| 3.615356201 | -15.741 |
| 3.615996582 | -15.699 |
| 3.616637207 | -15.705 |
| 3.617278076 | -15.658 |
| 3.617919189 | -15.69 |
| 3.618560547 | -15.685 |
| 3.619202148 | -15.667 |
| 3.61984375 | -15.689 |
| 3.6204858399999997 | -15.673 |
| 3.6211284179999996 | -15.695 |
| 3.6217707519999998 | -15.638 |
| 3.6224135740000003 | -15.649 |
| 3.623056396 | -15.59 |
| 3.623699707 | -15.643 |
| 3.6243430180000002 | -15.596 |
| 3.6249865719999996 | -15.611 |
| 3.625630371 | -15.592 |
| 3.626274414 | -15.634 |
| 3.626918701 | -15.611 |
| 3.627563721 | -15.596 |
| 3.628208496 | -15.593 |
| 3.628853516 | -15.553 |
| 3.629498535 | -15.58 |
| 3.6301440429999996 | -15.517 |
| 3.630789795 | -15.534 |
| 3.631435547 | -15.5 |
| 3.632081787 | -15.554 |
| 3.632728027 | -15.501 |
| 3.6333747560000003 | -15.545 |
| 3.634021729 | -15.523 |
| 3.634668945 | -15.533 |
| 3.635316162 | -15.505 |
| 3.6359636230000003 | -15.477 |
| 3.636611328 | -15.463 |
| 3.637259521 | -15.45 |
| 3.637907715 | -15.473 |
| 3.638556152 | -15.423 |
| 3.63920459 | -15.47 |
| 3.6398540039999996 | -15.448 |
| 3.640503174 | -15.486 |
| 3.641152344 | -15.423 |
| 3.641802002 | -15.448 |
| 3.642451904 | -15.391 |
| 3.643101807 | -15.418 |
| 3.643752197 | -15.387 |
| 3.6444025879999997 | -15.37 |
| 3.6450534670000003 | -15.378 |
| 3.645704346 | -15.387 |
| 3.6463559570000004 | -15.398 |
| 3.647007324 | -15.36 |
| 3.6476591800000002 | -15.401 |
| 3.6483110350000003 | -15.341 |
| 3.648963135 | -15.381 |
| 3.649615479 | -15.313 |
| 3.650268066 | -15.331 |
| 3.650921143 | -15.306 |
| 3.651574219 | -15.337 |
| 3.652227539 | -15.293 |
| 3.6528813479999998 | -15.313 |
| 3.653535156 | -15.332 |
| 3.654189209 | -15.321 |
| 3.654843262 | -15.321 |
| 3.6554978030000003 | -15.269 |
| 3.656152588 | -15.285 |
| 3.656807617 | -15.243 |
| 3.657462646 | -15.272 |
| 3.658118164 | -15.21 |
| 3.658773682 | -15.264 |
| 3.659429932 | -15.243 |
| 3.660086182 | -15.276 |
| 3.660742432 | -15.235 |
| 3.66139917 | -15.253 |
| 3.6620559079999997 | -15.233 |
| 3.662713135 | -15.217 |
| 3.6633703609999997 | -15.21 |
| 3.6640278320000004 | -15.157 |
| 3.664685547 | -15.197 |
| 3.66534375 | -15.17 |
| 3.6660021969999996 | -15.201 |
| 3.666660645 | -15.159 |
| 3.66731958 | -15.225 |
| 3.6679785160000002 | -15.174 |
| 3.6686376949999997 | -15.2 |
| 3.669297119 | -15.148 |
| 3.6699567870000003 | -15.144 |
| 3.670616699 | -15.137 |
| 3.671276855 | -15.13 |
| 3.671937256 | -15.114 |
| 3.672598145 | -15.098 |
| 3.673259033 | -15.148 |
| 3.673920166 | -15.109 |
| 3.674581543 | -15.147 |
| 3.67524292 | -15.094 |
| 3.675904785 | -15.125 |
| 3.676566895 | -15.072 |
| 3.677229248 | -15.094 |
| 3.6778916020000003 | -15.029 |
| 3.678554443 | -15.056 |
| 3.679217773 | -15.055 |
| 3.679881104 | -15.051 |
| 3.6805446780000004 | -15.053 |
| 3.681208252 | -15.049 |
| 3.681872314 | -15.065 |
| 3.682536377 | -15.013 |
| 3.683200928 | -15.033 |
| 3.683865479 | -14.959 |
| 3.684530518 | -15.006 |
| 3.685195557 | -14.962 |
| 3.685861328 | -14.983 |
| 3.6865270999999997 | -14.946 |
| 3.687192871 | -15.005 |
| 3.687859131 | -14.978 |
| 3.688525391 | -14.975 |
| 3.689192139 | -14.963 |
| 3.6898588869999998 | -14.928 |
| 3.690525879 | -14.944 |
| 3.6911933589999997 | -14.896 |
| 3.691861084 | -14.896 |
| 3.6925290530000003 | -14.849 |
| 3.693197021 | -14.91 |
| 3.693865479 | -14.849 |
| 3.694533936 | -14.886 |
| 3.695202637 | -14.853 |
| 3.695871826 | -14.875 |
| 3.6965410160000003 | -14.832 |
| 3.697210449 | -14.82 |
| 3.697880127 | -14.782 |
| 3.698550537 | -14.771 |
| 3.699220703 | -14.792 |
| 3.699891357 | -14.747 |
| 3.700562012 | -14.774 |
| 3.7012329100000003 | -14.754 |
| 3.7019040530000002 | -14.792 |
| 3.7025756839999997 | -14.729 |
| 3.7032473140000004 | -14.764 |
| 3.703919189 | -14.695 |
| 3.704591553 | -14.717 |
| 3.70526416 | -14.679 |
| 3.705936768 | -14.662 |
| 3.706609863 | -14.647 |
| 3.707282959 | -14.664 |
| 3.707956299 | -14.663 |
| 3.7086301269999997 | -14.631 |
| 3.7093039549999998 | -14.664 |
| 3.709978027 | -14.604 |
| 3.710652344 | -14.631 |
| 3.7113271479999996 | -14.567 |
| 3.712002197 | -14.577 |
| 3.71267749 | -14.53 |
| 3.713352783 | -14.571 |
| 3.7140283199999997 | -14.522 |
| 3.7147041020000002 | -14.543 |
| 3.715380371 | -14.546 |
| 3.716056641 | -14.544 |
| 3.716733154 | -14.533 |
| 3.717410156 | -14.499 |
| 3.718087158 | -14.503 |
| 3.718764893 | -14.457 |
| 3.719442383 | -14.484 |
| 3.7201203609999998 | -14.411 |
| 3.72079834 | -14.447 |
| 3.721476807 | -14.422 |
| 3.722155273 | -14.46 |
| 3.7228339839999998 | -14.407 |
| 3.7235131839999998 | -14.436 |
| 3.724192383 | -14.401 |
| 3.72487207 | -14.392 |
| 3.7255522460000003 | -14.374 |
| 3.726232178 | -14.33 |
| 3.7269125979999997 | -14.351 |
| 3.727593018 | -14.331 |
| 3.728273926 | -14.356 |
| 3.728954834 | -14.302 |
| 3.72963623 | -14.365 |
| 3.730317871 | -14.319 |
| 3.730999512 | -14.349 |
| 3.731681641 | -14.29 |
| 3.732364258 | -14.296 |
| 3.733046875 | -14.266 |
| 3.733729736 | -14.274 |
| 3.734412598 | -14.251 |
| 3.7350959469999996 | -14.237 |
| 3.735779541 | -14.274 |
| 3.736463379 | -14.253 |
| 3.737147461 | -14.272 |
| 3.737831787 | -14.224 |
| 3.738516113 | -14.258 |
| 3.739201416 | -14.198 |
| 3.7398864749999996 | -14.228 |
| 3.740571777 | -14.155 |
| 3.741257324 | -14.179 |
| 3.741943115 | -14.168 |
| 3.7426291500000004 | -14.185 |
| 3.74331543 | -14.164 |
| 3.744001953 | -14.178 |
| 3.744688721 | -14.195 |
| 3.745376221 | -14.159 |
| 3.7460634770000003 | -14.179 |
| 3.746751221 | -14.115 |
| 3.7474389649999997 | -14.151 |
| 3.748126953 | -14.114 |
| 3.74881543 | -14.141 |
| 3.7495039059999997 | -14.091 |
| 3.750192627 | -14.153 |
| 3.750881836 | -14.125 |
| 3.751571045 | -14.142 |
| 3.7522609859999996 | -14.121 |
| 3.752950928 | -14.112 |
| 3.753641113 | -14.112 |
| 3.754331299 | -14.086 |
| 3.755021973 | -14.085 |
| 3.755712891 | -14.045 |
| 3.7564040530000002 | -14.102 |
| 3.7570954590000003 | -14.062 |
| 3.757786865 | -14.102 |
| 3.75847876 | -14.062 |
| 3.759171387 | -14.111 |
| 3.75986377 | -14.062 |
| 3.760556396 | -14.078 |
| 3.761249268 | -14.032 |
| 3.761942383 | -14.034 |
| 3.762635742 | -14.047 |
| 3.7633295899999997 | -14.029 |
| 3.764023438 | -14.044 |
| 3.764717529 | -14.037 |
| 3.7654121089999997 | -14.085 |
| 3.7661069339999997 | -14.027 |
| 3.766802002 | -14.068 |
| 3.7674973140000003 | -14.001 |
| 3.768192627 | -14.035 |
| 3.7688884280000003 | -13.997 |
| 3.769584229 | -14.006 |
| 3.770280518 | -13.973 |
| 3.770977051 | -14.011 |
| 3.771673828 | -14.008 |
| 3.7723708499999997 | -13.997 |
| 3.773068359 | -14.02 |
| 3.773765869 | -13.993 |
| 3.774463623 | -14.021 |
| 3.775161865 | -13.968 |
| 3.775860107 | -13.984 |
| 3.776558594 | -13.925 |
| 3.7772573240000002 | -13.983 |
| 3.7779565429999997 | -13.935 |
| 3.778655762 | -13.966 |
| 3.779355469 | -13.951 |
| 3.780055664 | -13.984 |
| 3.780755615 | -13.962 |
| 3.781456055 | -13.95 |
| 3.7821567380000003 | -13.944 |
| 3.782857666 | -13.908 |
| 3.783558594 | -13.94 |
| 3.78426001 | -13.887 |
| 3.78496167 | -13.916 |
| 3.785663574 | -13.894 |
| 3.786365967 | -13.95 |
| 3.787068604 | -13.894 |
| 3.78777124 | -13.94 |
| 3.788474365 | -13.903 |
| 3.78917749 | -13.916 |
| 3.789881104 | -13.89 |
| 3.790584717 | -13.868 |
| 3.791288818 | -13.858 |
| 3.791993164 | -13.854 |
| 3.79269751 | -13.873 |
| 3.7934028320000004 | -13.832 |
| 3.79410791 | -13.882 |
| 3.794813232 | -13.847 |
| 3.795518799 | -13.884 |
| 3.796224609 | -13.826 |
| 3.796930664 | -13.848 |
| 3.797636963 | -13.797 |
| 3.79834375 | -13.826 |
| 3.7990505370000003 | -13.793 |
| 3.7997578130000003 | -13.794 |
| 3.800465576 | -13.805 |
| 3.801173096 | -13.814 |
| 3.801881104 | -13.82 |
| 3.8025893550000003 | -13.79 |
| 3.803297852 | -13.822 |
| 3.8040065920000004 | -13.765 |
| 3.804715576 | -13.803 |
| 3.805424805 | -13.737 |
| 3.806134277 | -13.762 |
| 3.806844238 | -13.741 |
| 3.807554688 | -13.784 |
| 3.808264893 | -13.742 |
| 3.808975586 | -13.773 |
| 3.809686279 | -13.772 |
| 3.810397461 | -13.758 |
| 3.811108887 | -13.764 |
| 3.811820557 | -13.716 |
| 3.812532471 | -13.731 |
| 3.8132446289999997 | -13.702 |
| 3.8139570309999997 | -13.733 |
| 3.814670166 | -13.678 |
| 3.815383057 | -13.738 |
| 3.8160964359999996 | -13.708 |
| 3.816809814 | -13.744 |
| 3.817523682 | -13.706 |
| 3.8182377929999998 | -13.722 |
| 3.8189521479999997 | -13.697 |
| 3.819666748 | -13.693 |
| 3.8203815920000004 | -13.683 |
| 3.82109668 | -13.65 |
| 3.8218125 | -13.687 |
| 3.822528076 | -13.669 |
| 3.823243896 | -13.699 |
| 3.8239602049999997 | -13.656 |
| 3.824676514 | -13.716 |
| 3.825393311 | -13.66 |
| 3.826110352 | -13.694 |
| 3.826827637 | -13.64 |
| 3.8275451659999997 | -13.654 |
| 3.828262939 | -13.647 |
| 3.8289814449999997 | -13.657 |
| 3.829699707 | -13.646 |
| 3.8304184570000004 | -13.651 |
| 3.8311372070000003 | -13.691 |
| 3.831856445 | -13.652 |
| 3.8325759280000002 | -13.688 |
| 3.833295654 | -13.635 |
| 3.834015381 | -13.667 |
| 3.83473584 | -13.623 |
| 3.835456299 | -13.652 |
| 3.83617749 | -13.603 |
| 3.836898438 | -13.65 |
| 3.837619873 | -13.642 |
| 3.838341309 | -13.66 |
| 3.839063232 | -13.658 |
| 3.8397854000000002 | -13.661 |
| 3.8405078130000003 | -13.672 |
| 3.841230469 | -13.642 |
| 3.8419533689999996 | -13.656 |
| 3.8426765140000003 | -13.604 |
| 3.8434003910000003 | -13.66 |
| 3.844124268 | -13.627 |
| 3.844848145 | -13.666 |
| 3.8455725099999998 | -13.636 |
| 3.846297119 | -13.694 |
| 3.847021973 | -13.66 |
| 3.84774707 | -13.679 |
| 3.8484726559999998 | -13.662 |
| 3.849198242 | -13.651 |
| 3.849924561 | -13.67 |
| 3.850650879 | -13.645 |
| 3.8513771969999997 | -13.661 |
| 3.8521040039999996 | -13.647 |
| 3.8528310550000002 | -13.704 |
| 3.8535583499999997 | -13.66 |
| 3.854286133 | -13.713 |
| 3.855013916 | -13.675 |
| 3.855741943 | -13.709 |
| 3.856470459 | -13.675 |
| 3.8571994629999997 | -13.681 |
| 3.8579284670000002 | -13.649 |
| 3.8586577149999997 | -13.673 |
| 3.859387207 | -13.685 |
| 3.8601171880000003 | -13.669 |
| 3.860847168 | -13.701 |
| 3.861577393 | -13.689 |
| 3.862308105 | -13.728 |
| 3.863039063 | -13.678 |
| 3.8637702640000002 | -13.712 |
| 3.864501953 | -13.652 |
| 3.865233887 | -13.703 |
| 3.86596582 | -13.666 |
| 3.8666979980000002 | -13.686 |
| 3.867430664 | -13.678 |
| 3.868163574 | -13.716 |
| 3.8688967290000003 | -13.706 |
| 3.8696301269999998 | -13.701 |
| 3.87036377 | -13.72 |
| 3.871097656 | -13.684 |
| 3.871832275 | -13.725 |
| 3.872566895 | -13.678 |
| 3.8733015140000004 | -13.704 |
| 3.874036621 | -13.679 |
| 3.874771973 | -13.74 |
| 3.875507568 | -13.694 |
| 3.8762436520000003 | -13.743 |
| 3.8769797359999996 | -13.728 |
| 3.8777163089999998 | -13.747 |
| 3.8784528810000003 | -13.734 |
| 3.87919043 | -13.717 |
| 3.879927734 | -13.71 |
| 3.880665283 | -13.697 |
| 3.8814030760000002 | -13.726 |
| 3.882141357 | -13.684 |
| 3.8828796390000004 | -13.739 |
| 3.883618408 | -13.716 |
| 3.884357422 | -13.763 |
| 3.88509668 | -13.717 |
| 3.885836182 | -13.755 |
| 3.886576416 | -13.71 |
| 3.8873166500000003 | -13.735 |
| 3.888056885 | -13.712 |
| 3.888797607 | -13.706 |
| 3.8895385740000004 | -13.717 |
| 3.890279785 | -13.726 |
| 3.891021484 | -13.744 |
| 3.8917631839999998 | -13.717 |
| 3.8925053710000004 | -13.768 |
| 3.8932478030000004 | -13.72 |
| 3.893990723 | -13.761 |
| 3.894733643 | -13.704 |
| 3.895477051 | -13.728 |
| 3.8962204590000002 | -13.7 |
| 3.896964355 | -13.739 |
| 3.8977082519999997 | -13.703 |
| 3.8984526369999997 | -13.729 |
| 3.8991972660000003 | -13.744 |
| 3.899942383 | -13.739 |
| 3.900687988 | -13.754 |
| 3.9014333499999996 | -13.723 |
| 3.9021791990000003 | -13.746 |
| 3.9029252929999996 | -13.714 |
| 3.9036716310000004 | -13.751 |
| 3.904418213 | -13.698 |
| 3.9051652829999997 | -13.753 |
| 3.9059123540000003 | -13.734 |
| 3.9066599120000003 | -13.773 |
| 3.9074077149999997 | -13.741 |
| 3.90815625 | -13.771 |
| 3.908904541 | -13.753 |
| 3.909653076 | -13.75 |
| 3.9104020999999998 | -13.748 |
| 3.911151367 | -13.716 |
| 3.9119008789999996 | -13.754 |
| 3.912650635 | -13.736 |
| 3.913400635 | -13.771 |
| 3.914151123 | -13.735 |
| 3.914901855 | -13.808 |
| 3.915653076 | -13.767 |
| 3.916404297 | -13.811 |
| 3.9171557619999997 | -13.768 |
| 3.9179077149999997 | -13.782 |
| 3.9186596679999997 | -13.772 |
| 3.919412109 | -13.781 |
| 3.9201647950000003 | -13.772 |
| 3.920917725 | -13.775 |
| 3.921671143 | -13.82 |
| 3.9224245609999997 | -13.795 |
| 3.923178955 | -13.836 |
| 3.923932861 | -13.799 |
| 3.9246875 | -13.842 |
| 3.9254421390000003 | -13.8 |
| 3.926197021 | -13.835 |
| 3.926952393 | -13.787 |
| 3.927708008 | -13.833 |
| 3.928463867 | -13.829 |
| 3.929219971 | -13.849 |
| 3.9299765630000003 | -13.85 |
| 3.930733643 | -13.87 |
| 3.931490723 | -13.893 |
| 3.932248047 | -13.87 |
| 3.933005615 | -13.899 |
| 3.9337634280000002 | -13.852 |
| 3.934521729 | -13.904 |
| 3.935280273 | -13.876 |
| 3.936039063 | -13.914 |
| 3.936798096 | -13.886 |
| 3.937557373 | -13.954 |
| 3.9383173830000002 | -13.932 |
| 3.939077393 | -13.958 |
| 3.939837646 | -13.952 |
| 3.940598145 | -13.952 |
| 3.941359131 | -13.968 |
| 3.942120117 | -13.952 |
| 3.942881592 | -13.967 |
| 3.9436433109999998 | -13.951 |
| 3.9444052729999997 | -14.015 |
| 3.9451677249999997 | -13.982 |
| 3.945930664 | -14.037 |
| 3.946693604 | -14.013 |
| 3.947456787 | -14.067 |
| 3.9482202149999996 | -14.037 |
| 3.948984131 | -14.061 |
| 3.949748047 | -14.034 |
| 3.9505129390000002 | -14.057 |
| 3.951277588 | -14.073 |
| 3.9520424800000002 | -14.065 |
| 3.9528078609999997 | -14.093 |
| 3.95357373 | -14.096 |
| 3.9543396 | -14.148 |
| 3.955105713 | -14.112 |
| 3.955872314 | -14.16 |
| 3.9566389159999997 | -14.109 |
| 3.9574060060000003 | -14.161 |
| 3.9581733399999997 | -14.13 |
| 3.9589409179999997 | -14.156 |
| 3.9597089839999997 | -14.149 |
| 3.9604775389999998 | -14.2 |
| 3.9612460940000003 | -14.201 |
| 3.962014893 | -14.211 |
| 3.9627841800000003 | -14.238 |
| 3.963553467 | -14.225 |
| 3.964323242 | -14.266 |
| 3.965093262 | -14.23 |
| 3.965863525 | -14.261 |
| 3.9666342770000003 | -14.234 |
| 3.967405273 | -14.295 |
| 3.9681767580000002 | -14.254 |
| 3.9689482419999997 | -14.306 |
| 3.9697202149999997 | -14.297 |
| 3.970492188 | -14.336 |
| 3.971264648 | -14.325 |
| 3.9720373540000002 | -14.328 |
| 3.972810547 | -14.324 |
| 3.97358374 | -14.317 |
| 3.974357422 | -14.351 |
| 3.9751313479999997 | -14.316 |
| 3.975906006 | -14.366 |
| 3.97668042 | -14.354 |
| 3.977455322 | -14.409 |
| 3.978230469 | -14.369 |
| 3.979005859 | -14.426 |
| 3.9797817380000002 | -14.389 |
| 3.980557861 | -14.426 |
| 3.981333984 | -14.409 |
| 3.98211084 | -14.412 |
| 3.982887695 | -14.424 |
| 3.9836652829999997 | -14.444 |
| 3.984442871 | -14.461 |
| 3.985220703 | -14.448 |
| 3.9859990229999998 | -14.508 |
| 3.986777344 | -14.477 |
| 3.9875561520000002 | -14.53 |
| 3.988335205 | -14.482 |
| 3.9891147460000003 | -14.515 |
| 3.9898942870000003 | -14.482 |
| 3.990674316 | -14.529 |
| 3.991455078 | -14.496 |
| 3.992235596 | -14.528 |
| 3.993016602 | -14.543 |
| 3.993797852 | -14.556 |
| 3.994579346 | -14.57 |
| 3.9953610840000002 | -14.555 |
| 3.996143311 | -14.581 |
| 3.996925781 | -14.55 |
| 3.997708496 | -14.595 |
| 3.998491455 | -14.543 |
| 3.9992753910000003 | -14.597 |
| 4.000059082 | -14.581 |
| 4.000843018 | -14.628 |
| 4.0016271969999995 | -14.599 |
| 4.002411865 | -14.649 |
| 4.003196777 | -14.64 |
| 4.003981934 | -14.656 |
| 4.004767334 | -14.663 |
| 4.005553223 | -14.64 |
| 4.006339355 | -14.672 |
| 4.007126221 | -14.661 |
| 4.007913086 | -14.696 |
| 4.008699951 | -14.666 |
| 4.009487305 | -14.737 |
| 4.010275146 | -14.708 |
| 4.011062988 | -14.761 |
| 4.011851318 | -14.726 |
| 4.012639893 | -14.751 |
| 4.013428955 | -14.737 |
| 4.014218506 | -14.761 |
| 4.015008057 | -14.752 |
| 4.015797852 | -14.763 |
| 4.016588135 | -14.801 |
| 4.0173786620000005 | -14.796 |
| 4.018169434 | -14.833 |
| 4.018960449 | -14.817 |
| 4.019751953 | -14.87 |
| 4.0205434570000005 | -14.838 |
| 4.021335693 | -14.886 |
| 4.022128417999999 | -14.839 |
| 4.022920898 | -14.891 |
| 4.023713867 | -14.886 |
| 4.024507324 | -14.925 |
| 4.025300781 | -14.921 |
| 4.026094727 | -14.964 |
| 4.026888916 | -14.985 |
| 4.02768335 | -14.982 |
| 4.028478271 | -15.018 |
| 4.029273438000001 | -14.986 |
| 4.030069336 | -15.042 |
| 4.03086499 | -15.018 |
| 4.031661133 | -15.064 |
| 4.03245752 | -15.04 |
| 4.033254395 | -15.118 |
| 4.034051514000001 | -15.097 |
| 4.034848877 | -15.149 |
| 4.035646484 | -15.145 |
| 4.036444336 | -15.166 |
| 4.037242676 | -15.181 |
| 4.038041748 | -15.181 |
| 4.038840576 | -15.2 |
| 4.039639893 | -15.198 |
| 4.040439453 | -15.261 |
| 4.041239502 | -15.243 |
| 4.042039551 | -15.305 |
| 4.042840088 | -15.287 |
| 4.043640869 | -15.358 |
| 4.044442139 | -15.334 |
| 4.045243652 | -15.379 |
| 4.046045898 | -15.353 |
| 4.0468479 | -15.392 |
| 4.047650391 | -15.404 |
| 4.048453125 | -15.417 |
| 4.049256104 | -15.442 |
| 4.05005957 | -15.468 |
| 4.050863281 | -15.52 |
| 4.051667236 | -15.502 |
| 4.05247168 | -15.561 |
| 4.053276123 | -15.53 |
| 4.054081543 | -15.594 |
| 4.0548869629999995 | -15.567 |
| 4.055692627 | -15.607 |
| 4.056498535 | -15.594 |
| 4.057304688 | -15.657 |
| 4.058111328 | -15.654 |
| 4.058918213 | -15.689 |
| 4.059725342 | -15.714 |
| 4.0605329590000006 | -15.728 |
| 4.06134082 | -15.762 |
| 4.062149414 | -15.746 |
| 4.062958008 | -15.781 |
| 4.063766846 | -15.766 |
| 4.064575928 | -15.832 |
| 4.065385498 | -15.801 |
| 4.066195068 | -15.864 |
| 4.0670053710000005 | -15.859 |
| 4.067815674 | -15.925 |
| 4.0686264649999995 | -15.91 |
| 4.069437988 | -15.947 |
| 4.070249512 | -15.948 |
| 4.0710610350000005 | -15.963 |
| 4.071873291 | -15.992 |
| 4.072685547 | -15.981 |
| 4.073498291 | -16.028 |
| 4.074311279 | -16.032 |
| 4.075124756 | -16.096 |
| 4.075938477 | -16.066 |
| 4.076752441 | -16.139 |
| 4.077567139 | -16.106 |
| 4.078381836 | -16.161 |
| 4.079196777 | -16.141 |
| 4.080011963 | -16.164 |
| 4.080827637 | -16.164 |
| 4.081643555 | -16.202 |
| 4.082459961 | -16.21 |
| 4.083276611 | -16.22 |
| 4.084093506 | -16.272 |
| 4.084910645 | -16.267 |
| 4.08572876 | -16.324 |
| 4.086546631 | -16.292 |
| 4.08736499 | -16.34 |
| 4.088183594 | -16.315 |
| 4.089002441 | -16.377 |
| 4.089821532999999 | -16.341 |
| 4.090641113 | -16.395 |
| 4.091461182 | -16.396 |
| 4.09228125 | -16.436 |
| 4.093101807 | -16.444 |
| 4.093923096 | -16.462 |
| 4.094744385 | -16.487 |
| 4.095565918 | -16.478 |
| 4.096387695000001 | -16.518 |
| 4.097209961 | -16.486 |
| 4.098032715 | -16.541 |
| 4.098855469 | -16.53 |
| 4.099678710999999 | -16.588 |
| 4.100501953 | -16.569 |
| 4.101325684000001 | -16.642 |
| 4.102150391 | -16.632 |
| 4.102975098 | -16.671 |
| 4.1037998049999995 | -16.67 |
| 4.104625 | -16.675 |
| 4.105450684 | -16.696 |
| 4.106276367 | -16.711 |
| 4.107102539 | -16.742 |
| 4.107929199 | -16.735 |
| 4.1087558589999995 | -16.805 |
| 4.1095830079999995 | -16.787 |
| 4.1104111329999995 | -16.852 |
| 4.11123877 | -16.831 |
| 4.112066895 | -16.887 |
| 4.112895507999999 | -16.876 |
| 4.113724121000001 | -16.925 |
| 4.114553223 | -16.91 |
| 4.115382813 | -16.953 |
| 4.116212891 | -16.988 |
| 4.117042969 | -17.015 |
| 4.117873534999999 | -17.052 |
| 4.11870459 | -17.063 |
| 4.1195361329999995 | -17.123 |
| 4.120367676 | -17.104 |
| 4.121199219 | -17.164 |
| 4.12203125 | -17.133 |
| 4.12286377 | -17.201 |
| 4.123696777 | -17.197 |
| 4.124530273 | -17.256 |
| 4.12536377 | -17.248 |
| 4.126197754 | -17.319 |
| 4.127032227 | -17.334 |
| 4.127866699 | -17.377 |
| 4.12870166 | -17.416 |
| 4.129536621000001 | -17.429 |
| 4.13037207 | -17.486 |
| 4.131208008 | -17.488 |
| 4.132044434 | -17.541 |
| 4.132880859 | -17.539 |
| 4.133717773 | -17.633 |
| 4.1345556640000005 | -17.627 |
| 4.135393066 | -17.709 |
| 4.1362309569999995 | -17.702 |
| 4.137069336 | -17.767 |
| 4.137907715 | -17.774 |
| 4.13874707 | -17.817 |
| 4.139586426 | -17.843 |
| 4.140425781 | -17.885 |
| 4.141265625 | -17.937 |
| 4.142105957 | -17.954 |
| 4.142947266 | -18.021 |
| 4.143788086 | -18.035 |
| 4.144629395 | -18.118 |
| 4.1454711909999995 | -18.105 |
| 4.146312988 | -18.183 |
| 4.147155762000001 | -18.168 |
| 4.147998047 | -18.236 |
| 4.148841309000001 | -18.237 |
| 4.149684570000001 | -18.293 |
| 4.15052832 | -18.316 |
| 4.151373047 | -18.377 |
| 4.152217285 | -18.423 |
| 4.153062012 | -18.455 |
| 4.1539072269999995 | -18.526 |
| 4.154752440999999 | -18.519 |
| 4.155598632999999 | -18.595 |
| 4.156444824 | -18.585 |
| 4.157291016 | -18.655 |
| 4.158137695000001 | -18.654 |
| 4.158984863 | -18.744 |
| 4.159833008 | -18.743 |
| 4.160680664 | -18.821 |
| 4.161529297 | -18.837 |
| 4.162377440999999 | -18.892 |
| 4.163226563 | -18.931 |
| 4.164075684 | -18.946 |
| 4.1649252930000005 | -18.98 |
| 4.165775391 | -18.989 |
| 4.166625487999999 | -19.051 |
| 4.1674760740000005 | -19.036 |
| 4.168327637 | -19.113 |
| 4.169179199 | -19.114 |
| 4.170030762000001 | -19.203 |
| 4.170882813 | -19.185 |
| 4.171734862999999 | -19.254 |
| 4.172587891 | -19.243 |
| 4.173440918 | -19.295 |
| 4.174294434 | -19.302 |
| 4.175147949 | -19.331 |
| 4.176001953 | -19.364 |
| 4.176856934000001 | -19.396 |
| 4.1777119140000005 | -19.441 |
| 4.178566895 | -19.458 |
| 4.179422363 | -19.546 |
| 4.18027832 | -19.536 |
| 4.1811347660000004 | -19.622 |
| 4.181991211 | -19.614 |
| 4.182848145 | -19.693 |
| 4.1837055659999995 | -19.704 |
| 4.184563476999999 | -19.82 |
| 4.185421387 | -19.861 |
| 4.186279785 | -19.991 |
| 4.187138672 | -20.07 |
| 4.187997559 | -20.199 |
| 4.188856934 | -20.318 |
| 4.189716797 | -20.441 |
| 4.19057666 | -20.584 |
| 4.191437012000001 | -20.731 |
| 4.192297851999999 | -20.887 |
| 4.193159668 | -21.052 |
| 4.194020996 | -21.216 |
| 4.194882813 | -21.472 |
| 4.195745117 | -21.636 |
| 4.19660791 | -21.965 |
| 4.197470703 | -22.142 |
| 4.198333984 | -22.543 |
| 4.1991972660000005 | -22.679 |
| 4.2000615230000005 | -23.014 |
| 4.200925781 | -23.17 |
| 4.2017910160000005 | -23.407 |
| 4.20265625 | -23.7 |
| 4.2035214839999995 | -23.828 |
| 4.204387207 | -24.406 |
| 4.205253418 | -24.334 |
| 4.206119629 | -25.114 |
| 4.206986816 | -24.857 |
| 4.207854004 | -25.661 |
| 4.2087211909999995 | -25.489 |
| 4.209589355 | -26.042 |
| 4.210458008 | -26.241 |
| 4.21132666 | -26.447 |
| 4.212195801 | -26.936 |
| 4.213064941 | -26.77 |
| 4.21393457 | -27.587 |
| 4.214804688 | -27.451 |
| 4.215675293 | -28.151 |
| 4.216545898000001 | -28.126 |
| 4.217416992 | -28.536 |
| 4.218288574 | -28.746 |
| 4.219160645 | -28.896 |
| 4.220033203 | -29.307 |
| 4.220905762 | -29.288 |
| 4.221778809000001 | -29.914 |
| 4.2226518550000005 | -29.804 |
| 4.223525391 | -30.096 |
| 4.2243994140000005 | -30.349 |
| 4.225273926 | -30.302 |
| 4.226148926 | -30.835 |
| 4.227023926 | -30.65 |
| 4.227899902 | -30.619 |
| 4.228775879 | -30.943 |
| 4.229651855 | -30.779 |
| 4.23052832 | -31.061 |
| 4.231405273 | -31.139 |
| 4.232282715 | -31.177 |
| 4.233160156 | -31.375 |
| 4.234038086 | -31.299 |
| 4.234916504 | -31.166 |
| 4.23579541 | -31.426 |
| 4.236674805 | -31.378 |
| 4.237554688 | -31.363 |
| 4.238434570000001 | -31.31 |
| 4.2393144529999995 | -30.968 |
| 4.240195313 | -31.096 |
| 4.241076172 | -31.223 |
| 4.24195752 | -31.015 |
| 4.242838867000001 | -30.945 |
| 4.243721191 | -31.148 |
| 4.244604004 | -30.919 |
| 4.245486816 | -30.557 |
| 4.246369629 | -30.644 |
| 4.247253418000001 | -30.263 |
| 4.248137207 | -30.126 |
| 4.249021484 | -29.524 |
| 4.24990625 | -29.381 |
| 4.250791016 | -29.672 |
| 4.25167627 | -29.549 |
| 4.252562012 | -29.345 |
| 4.25344873 | -29.489 |
| 4.254334961 | -29.852 |
| 4.255222168 | -29.673 |
| 4.256109375 | -30.122 |
| 4.256996582 | -30.633 |
| 4.257884766 | -31.08 |
| 4.258772949 | -31.243 |
| 4.259661621 | -31.178 |
| 4.260550781 | -31.466 |
| 4.261439941 | -31.576 |
| 4.262330565999999 | -31.52 |
| 4.263220703 | -31.498 |
| 4.264111328 | -31.381 |
| 4.265001953 | -31.356 |
| 4.265893065999999 | -31.278 |
| 4.266785156 | -31.291 |
| 4.2676767579999995 | -31.119 |
| 4.268569336 | -31.043 |
| 4.269461914000001 | -31.001 |
| 4.270355469 | -30.784 |
| 4.271249023 | -30.921 |
| 4.272143066 | -30.807 |
| 4.273037598 | -30.748 |
| 4.273932128999999 | -30.673 |
| 4.274827148 | -30.699 |
| 4.275722656 | -30.911 |
| 4.276618164 | -30.564 |
| 4.27751416 | -30.572 |
| 4.278411133 | -30.768 |
| 4.279307617000001 | -30.802 |
| 4.280205565999999 | -30.278 |
| 4.281103027 | -30.467 |
| 4.282000977 | -30.702 |
| 4.282899414 | -30.444 |
| 4.283798340000001 | -30.088 |
| 4.284697754 | -30.228 |
| 4.285597168000001 | -30.491 |
| 4.28649707 | -30.031 |
| 4.287397460999999 | -29.676 |
| 4.2882978519999995 | -29.925 |
| 4.289199219 | -30.165 |
| 4.290101074 | -29.664 |
| 4.291002441 | -29.5 |
| 4.291904785 | -29.793 |
| 4.292807617 | -29.909 |
| 4.293710449 | -29.358 |
| 4.29461377 | -29.286 |
| 4.295517578 | -29.769 |
| 4.2964213870000005 | -29.647 |
| 4.2973256840000005 | -29.065 |
| 4.298231445000001 | -29.083 |
| 4.29913623 | -29.463 |
| 4.300041992000001 | -29.35 |
| 4.3009482420000005 | -28.974 |
| 4.301854492 | -28.993 |
| 4.30276123 | -29.388 |
| 4.303668457 | -29.189 |
| 4.3045756840000005 | -28.798 |
| 4.305483887 | -28.934 |
| 4.306392578 | -29.467 |
| 4.30730127 | -29.228 |
| 4.308209960999999 | -28.963 |
| 4.309119629 | -29.024 |
| 4.310029297 | -29.351 |
| 4.310939453 | -29.255 |
| 4.311850098 | -29.027 |
| 4.3127612300000004 | -29.165 |
| 4.313672362999999 | -29.532 |
| 4.314584473 | -29.496 |
| 4.31549707 | -29.231 |
| 4.31640918 | -29.322 |
| 4.317322266 | -29.622 |
| 4.318235351999999 | -29.826 |
| 4.319149414000001 | -29.608 |
| 4.320063477 | -29.651 |
| 4.320977539 | -29.893 |
| 4.321892578 | -30.193 |
| 4.3228076170000005 | -29.87 |
| 4.323723145 | -29.951 |
| 4.324639648000001 | -30.134 |
| 4.325556152 | -30.592 |
| 4.326473145 | -30.217 |
| 4.327390137 | -30.176 |
| 4.328307617 | -30.292 |
| 4.329225586 | -30.618 |
| 4.330144043000001 | -30.641 |
| 4.3310625 | -30.492 |
| 4.331981934000001 | -30.787 |
| 4.332901367000001 | -30.93 |
| 4.333821777 | -31.177 |
| 4.334741699 | -30.819 |
| 4.335662598 | -31.175 |
| 4.336583496 | -31.197 |
| 4.337504882999999 | -31.486 |
| 4.338426758 | -31.34 |
| 4.339349121000001 | -31.396 |
| 4.340271973 | -31.247 |
| 4.3411948240000005 | -31.42 |
| 4.342118164 | -31.466 |
| 4.34304248 | -31.179 |
| 4.343966797 | -31.263 |
| 4.344891113 | -31.075 |
| 4.345816406 | -31.185 |
| 4.346741699 | -30.944 |
| 4.34766748 | -30.805 |
| 4.34859375 | -30.596 |
| 4.34952002 | -30.762 |
| 4.350447266 | -30.494 |
| 4.3513745120000005 | -30.413 |
| 4.352302734 | -30.242 |
| 4.353230957 | -30.091 |
| 4.354159668 | -30.014 |
| 4.355088379 | -29.833 |
| 4.356017578 | -29.66 |
| 4.356947266 | -29.641 |
| 4.357877440999999 | -29.514 |
| 4.3588081050000005 | -29.346 |
| 4.35973877 | -29.235 |
| 4.36067041 | -29.012 |
| 4.361602539000001 | -28.967 |
| 4.362534668 | -28.854 |
| 4.363467285 | -28.74 |
| 4.364399902 | -28.605 |
| 4.365333496 | -28.586 |
| 4.36626709 | -28.449 |
| 4.367201172 | -28.381 |
| 4.368135742000001 | -28.324 |
| 4.3690708009999994 | -28.186 |
| 4.3700063479999995 | -28.142 |
| 4.370941895 | -28.055 |
| 4.3718784180000005 | -28.033 |
| 4.372814941 | -28.022 |
| 4.373751465000001 | -28.008 |
| 4.374688965000001 | -27.921 |
| 4.375626465 | -27.873 |
| 4.376564941 | -27.866 |
| 4.377503418 | -27.797 |
| 4.378442382999999 | -27.854 |
| 4.379381835999999 | -27.849 |
| 4.380321777 | -27.851 |
| 4.381261719 | -27.851 |
| 4.382202637000001 | -27.821 |
| 4.383143554999999 | -27.774 |
| 4.384084960999999 | -27.802 |
| 4.385026367 | -27.82 |
| 4.38596875 | -27.863 |
| 4.386911133 | -27.878 |
| 4.387854003999999 | -27.867 |
| 4.388797852 | -27.831 |
| 4.389741699 | -27.876 |
| 4.390686035 | -27.838 |
| 4.391630859 | -27.863 |
| 4.3925756840000005 | -27.886 |
| 4.393520996 | -27.903 |
| 4.394466797 | -27.93 |
| 4.395413086 | -27.954 |
| 4.396359863 | -27.992 |
| 4.397306641 | -27.96 |
| 4.398254395 | -28.089 |
| 4.399202637 | -28.124 |
| 4.400150879 | -28.211 |
| 4.401099609 | -28.24 |
| 4.40204834 | -28.361 |
| 4.402998047 | -28.387 |
| 4.403947754 | -28.456 |
| 4.404897949 | -28.427 |
| 4.405849121 | -28.53 |
| 4.4067998049999995 | -28.654 |
| 4.407751953 | -28.66 |
| 4.408704102 | -28.802 |
| 4.40965625 | -28.98 |
| 4.410608887 | -29.024 |
| 4.4115625 | -29.013 |
| 4.412516113 | -29.188 |
| 4.413469727 | -29.256 |
| 4.414424316 | -29.474 |
| 4.4153793949999995 | -29.599 |
| 4.416334473 | -29.755 |
| 4.4172905270000005 | -29.931 |
| 4.418246582 | -30.001 |
| 4.419203125 | -30.015 |
| 4.420160156 | -30.206 |
| 4.421117188 | -30.394 |
| 4.422075195000001 | -30.518 |
| 4.423033203 | -30.795 |
| 4.423991699 | -30.91 |
| 4.424950684000001 | -31.011 |
| 4.425910156 | -31.115 |
| 4.426870605 | -31.227 |
| 4.427830566 | -31.141 |
| 4.428791503999999 | -31.098 |
| 4.429752441 | -31.084 |
| 4.430713867000001 | -31.103 |
| 4.431675781 | -30.985 |
| 4.432638184 | -30.87 |
| 4.433600586 | -30.725 |
| 4.434563965000001 | -30.67 |
| 4.435527832 | -30.547 |
| 4.436492188 | -30.34 |
| 4.437456543000001 | -30.295 |
| 4.438421387 | -30.072 |
| 4.43938623 | -29.929 |
| 4.440352051 | -29.63 |
| 4.441318359 | -29.457 |
| 4.442284668 | -29.094 |
| 4.443251465 | -28.996 |
| 4.44421875 | -28.757 |
| 4.445187012 | -28.624 |
| 4.4461552730000005 | -28.456 |
| 4.447124023000001 | -28.218 |
| 4.448093262 | -28.107 |
| 4.4490625 | -27.944 |
| 4.4500322269999995 | -27.809 |
| 4.451002441 | -27.668 |
| 4.451973633 | -27.64 |
| 4.452944336 | -27.497 |
| 4.453916016 | -27.422 |
| 4.454888672 | -27.257 |
| 4.455860840000001 | -27.175 |
| 4.456833984 | -27.101 |
| 4.457807129 | -27.027 |
| 4.458780762 | -26.917 |
| 4.459754883 | -26.846 |
| 4.4607294920000005 | -26.749 |
| 4.46170459 | -26.63 |
| 4.462679688000001 | -26.514 |
| 4.463655762 | -26.405 |
| 4.464632324 | -26.352 |
| 4.465608887 | -26.277 |
| 4.466586426 | -26.224 |
| 4.467563965 | -26.111 |
| 4.468541504 | -26.065 |
| 4.46952002 | -25.939 |
| 4.470499023 | -25.877 |
| 4.471478027 | -25.846 |
| 4.472458007999999 | -25.828 |
| 4.473437988 | -25.789 |
| 4.474418945 | -25.758 |
| 4.475399902 | -25.726 |
| 4.476381348 | -25.684 |
| 4.47736377 | -25.656 |
| 4.478345703 | -25.593 |
| 4.479328613 | -25.651 |
| 4.480311523 | -25.621 |
| 4.4812954099999995 | -25.623 |
| 4.482279297 | -25.589 |
| 4.483263672 | -25.646 |
| 4.484249023 | -25.626 |
| 4.485234375 | -25.67 |
| 4.486220215 | -25.631 |
| 4.487206055 | -25.679 |
| 4.488192871 | -25.676 |
| 4.489179688 | -25.662 |
| 4.490166992000001 | -25.695 |
| 4.491155273 | -25.698 |
| 4.492143554999999 | -25.74 |
| 4.493132324 | -25.704 |
| 4.49412207 | -25.745 |
| 4.495111328 | -25.71 |
| 4.496101563 | -25.786 |
| 4.497092285 | -25.798 |
| 4.498083008 | -25.891 |
| 4.499074219 | -25.882 |
| 4.500065918000001 | -25.945 |
| 4.501058594 | -25.955 |
| 4.50205127 | -26.014 |
| 4.503044922 | -26.067 |
| 4.5040380859999996 | -26.121 |
| 4.505032227 | -26.195 |
| 4.506026855 | -26.219 |
| 4.507021484 | -26.229 |
| 4.50801709 | -26.181 |
| 4.509012695 | -26.267 |
| 4.5100087890000005 | -26.236 |
| 4.511005371 | -26.291 |
| 4.512002441 | -26.268 |
| 4.513000487999999 | -26.324 |
| 4.513998535 | -26.282 |
| 4.514997070000001 | -26.313 |
| 4.515995605 | -26.316 |
| 4.5169951170000004 | -26.301 |
| 4.5179946289999995 | -26.306 |
| 4.518995117 | -26.25 |
| 4.519995605 | -26.214 |
| 4.5209965819999995 | -26.137 |
| 4.521998047 | -26.134 |
| 4.523000488 | -26.051 |
| 4.52400293 | -26.046 |
| 4.525005859 | -25.929 |
| 4.526009277 | -25.879 |
| 4.527012695000001 | -25.805 |
| 4.5280170900000005 | -25.793 |
| 4.529021484 | -25.675 |
| 4.5300263670000005 | -25.609 |
| 4.531032227 | -25.517 |
| 4.532038085999999 | -25.413 |
| 4.533044922 | -25.314 |
| 4.5340517579999995 | -25.246 |
| 4.535059082 | -25.17 |
| 4.536066895 | -25.078 |
| 4.537075195000001 | -25.015 |
| 4.5380834960000005 | -24.857 |
| 4.539092773 | -24.832 |
| 4.540102051 | -24.716 |
| 4.5411123049999995 | -24.662 |
| 4.542122559 | -24.54 |
| 4.543134277 | -24.492 |
| 4.544145508 | -24.393 |
| 4.545157227 | -24.356 |
| 4.546169434 | -24.26 |
| 4.547182128999999 | -24.2 |
| 4.548195313 | -24.144 |
| 4.549208984 | -24.05 |
| 4.550222656 | -24.018 |
| 4.551237305 | -23.948 |
| 4.552252440999999 | -23.939 |
| 4.553268065999999 | -23.86 |
| 4.55428418 | -23.844 |
| 4.555300293 | -23.762 |
| 4.556316895 | -23.761 |
| 4.557334473 | -23.703 |
| 4.558352051 | -23.713 |
| 4.559370117 | -23.682 |
| 4.560388672 | -23.685 |
| 4.5614077150000005 | -23.672 |
| 4.562427734 | -23.664 |
| 4.563447754 | -23.673 |
| 4.564468262 | -23.68 |
| 4.56548877 | -23.702 |
| 4.566510254 | -23.698 |
| 4.567531738 | -23.765 |
| 4.568554199 | -23.737 |
| 4.56957666 | -23.791 |
| 4.570600098 | -23.79 |
| 4.571623535 | -23.832 |
| 4.572647949 | -23.838 |
| 4.573672852 | -23.906 |
| 4.574697754 | -23.896 |
| 4.5757231449999995 | -23.958 |
| 4.5767490230000005 | -24.011 |
| 4.577775391 | -24.029 |
| 4.578802246 | -24.119 |
| 4.57982959 | -24.166 |
| 4.580856934000001 | -24.237 |
| 4.5818852539999995 | -24.281 |
| 4.582914551 | -24.39 |
| 4.583943848 | -24.427 |
| 4.584973145 | -24.549 |
| 4.586003418000001 | -24.603 |
| 4.587033690999999 | -24.725 |
| 4.588064941 | -24.805 |
| 4.589096190999999 | -24.921 |
| 4.5901279299999995 | -24.983 |
| 4.5911606449999995 | -25.085 |
| 4.5921933589999995 | -25.159 |
| 4.5932270509999995 | -25.257 |
| 4.594260742 | -25.369 |
| 4.595294922 | -25.432 |
| 4.59632959 | -25.586 |
| 4.597364746 | -25.643 |
| 4.598400391 | -25.778 |
| 4.5994365230000005 | -25.808 |
| 4.600473145 | -25.934 |
| 4.601510254 | -25.978 |
| 4.602547852 | -26.129 |
| 4.603586426 | -26.178 |
| 4.604624512 | -26.262 |
| 4.605663574 | -26.365 |
| 4.606703125 | -26.402 |
| 4.607742676 | -26.454 |
| 4.608783203 | -26.461 |
| 4.6098237300000005 | -26.516 |
| 4.610865234 | -26.565 |
| 4.611906738 | -26.664 |
| 4.61294873 | -26.687 |
| 4.613992188 | -26.728 |
| 4.615035156 | -26.697 |
| 4.616078613 | -26.694 |
| 4.617123047 | -26.648 |
| 4.61816748 | -26.675 |
| 4.6192124020000005 | -26.662 |
| 4.620257813 | -26.676 |
| 4.6213037109999995 | -26.61 |
| 4.622350586 | -26.565 |
| 4.623397461 | -26.483 |
| 4.624445313 | -26.406 |
| 4.625493164000001 | -26.358 |
| 4.6265415039999995 | -26.266 |
| 4.627590332 | -26.268 |
| 4.628639648 | -26.219 |
| 4.629689453 | -26.25 |
| 4.630739257999999 | -26.208 |
| 4.631790039 | -26.233 |
| 4.632841309000001 | -26.14 |
| 4.633893554999999 | -26.146 |
| 4.634945801 | -26.132 |
| 4.635998535 | -26.124 |
| 4.63705127 | -26.129 |
| 4.6381049800000005 | -26.108 |
| 4.63915918 | -26.08 |
| 4.640213867000001 | -26.065 |
| 4.641268555 | -26.081 |
| 4.642324219 | -26.074 |
| 4.643380371 | -26.16 |
| 4.644437012 | -26.157 |
| 4.645494141 | -26.195 |
| 4.64655127 | -26.215 |
| 4.647609375 | -26.249 |
| 4.648667969 | -26.259 |
| 4.649726563 | -26.338 |
| 4.6507861329999995 | -26.383 |
| 4.651845703 | -26.473 |
| 4.65290625 | -26.538 |
| 4.653966797 | -26.585 |
| 4.655028809 | -26.701 |
| 4.656090332 | -26.779 |
| 4.6571528319999995 | -26.845 |
| 4.658215332 | -26.955 |
| 4.659278809000001 | -27.087 |
| 4.660342285 | -27.179 |
| 4.661406737999999 | -27.331 |
| 4.662471191 | -27.449 |
| 4.663536621 | -27.632 |
| 4.664602051 | -27.798 |
| 4.665668945 | -27.99 |
| 4.666735352 | -28.146 |
| 4.6678027339999995 | -28.386 |
| 4.668870117 | -28.542 |
| 4.669938477 | -28.693 |
| 4.671006835999999 | -28.895 |
| 4.672075684 | -29.056 |
| 4.673145507999999 | -29.196 |
| 4.674215332 | -29.405 |
| 4.675286132999999 | -29.692 |
| 4.676357422 | -29.898 |
| 4.6774291990000005 | -30.169 |
| 4.678500977 | -30.475 |
| 4.67957373 | -30.788 |
| 4.6806464839999995 | -31.106 |
| 4.681720215 | -31.451 |
| 4.682793945 | -31.812 |
| 4.683868652 | -32.348 |
| 4.684943359 | -32.816 |
| 4.686019043 | -33.177 |
| 4.687095703 | -33.347 |
| 4.688171875 | -33.586 |
| 4.689249023 | -33.595 |
| 4.690326172 | -33.769 |
| 4.691404297 | -33.867 |
| 4.69248291 | -33.82 |
| 4.6935615230000005 | -33.778 |
| 4.694641112999999 | -33.739 |
| 4.695720703 | -33.594 |
| 4.69680127 | -33.705 |
| 4.6978828130000005 | -33.707 |
| 4.698964355 | -33.576 |
| 4.700045898 | -33.443 |
| 4.701128418000001 | -33.246 |
| 4.702211426 | -33.187 |
| 4.703294922 | -33.051 |
| 4.704378906 | -33.093 |
| 4.705463379 | -33.007 |
| 4.706547852 | -32.948 |
| 4.707633789000001 | -32.667 |
| 4.708719727 | -32.506 |
| 4.7098061520000005 | -32.326 |
| 4.710893066 | -32.199 |
| 4.711980469 | -31.952 |
| 4.713068359 | -31.788 |
| 4.714156738 | -31.705 |
| 4.715246094 | -31.44 |
| 4.716335449 | -31.342 |
| 4.717425293 | -31.277 |
| 4.718516113 | -31.228 |
| 4.719606934000001 | -31.151 |
| 4.7206987300000005 | -31.138 |
| 4.7217905270000005 | -31.054 |
| 4.722882813 | -31.207 |
| 4.723976074 | -31.217 |
| 4.725069336 | -31.226 |
| 4.726163086 | -31.245 |
| 4.7272578130000005 | -31.221 |
| 4.728352539 | -31.168 |
| 4.72944873 | -31.148 |
| 4.730544922 | -31.225 |
| 4.731641112999999 | -31.28 |
| 4.732738281 | -31.276 |
| 4.733835938 | -31.125 |
| 4.734933594 | -31.104 |
| 4.736032227 | -31.036 |
| 4.737131348 | -31.138 |
| 4.738230957 | -31.124 |
| 4.739331055 | -31.18 |
| 4.740432129 | -31.094 |
| 4.741533203 | -31.034 |
| 4.742634766 | -30.992 |
| 4.743736815999999 | -31.022 |
| 4.744839355 | -31.084 |
| 4.7459428710000005 | -31.093 |
| 4.747046387 | -31.086 |
| 4.748150391 | -31.038 |
| 4.749255371 | -31.1 |
| 4.7503603519999995 | -31.121 |
| 4.751466797 | -31.244 |
| 4.752572754 | -31.298 |
| 4.753679688 | -31.249 |
| 4.754786621 | -31.324 |
| 4.755894531 | -31.281 |
| 4.75700293 | -31.269 |
| 4.7581118159999995 | -31.318 |
| 4.759221191 | -31.313 |
| 4.760331055 | -31.329 |
| 4.761441406 | -31.231 |
| 4.762552734 | -31.208 |
| 4.763664063 | -31.195 |
| 4.764775879 | -31.341 |
| 4.7658881840000005 | -31.411 |
| 4.767001465 | -31.436 |
| 4.768114746 | -31.419 |
| 4.769229004 | -31.493 |
| 4.770343262 | -31.437 |
| 4.771458496 | -31.362 |
| 4.772574219 | -31.373 |
| 4.773690429999999 | -31.362 |
| 4.774807129 | -31.354 |
| 4.775924315999999 | -31.226 |
| 4.777041992 | -31.18 |
| 4.778160156 | -31.166 |
| 4.779278809 | -31.188 |
| 4.780397949 | -31.159 |
| 4.781517578 | -31.239 |
| 4.782637695 | -31.311 |
| 4.783759277 | -31.353 |
| 4.784880371 | -31.402 |
| 4.786002441 | -31.381 |
| 4.787125 | -31.337 |
| 4.788247559 | -31.176 |
| 4.789371094 | -31.226 |
| 4.790495117000001 | -31.171 |
| 4.7916196289999995 | -31.213 |
| 4.7927446289999995 | -31.123 |
| 4.793870117 | -31.048 |
| 4.794996582 | -31.023 |
| 4.796123047 | -31.006 |
| 4.7972504879999995 | -30.93 |
| 4.79837793 | -30.918 |
| 4.7995063479999995 | -30.927 |
| 4.800634766 | -30.814 |
| 4.801764159999999 | -30.82 |
| 4.802894043 | -30.746 |
| 4.804023926 | -30.7 |
| 4.805154785 | -30.666 |
| 4.8062871089999994 | -30.53 |
| 4.807418945 | -30.461 |
| 4.80855127 | -30.461 |
| 4.8096840819999995 | -30.468 |
| 4.810817871 | -30.499 |
| 4.81195166 | -30.569 |
| 4.813086426 | -30.537 |
| 4.814221191 | -30.526 |
| 4.815356934 | -30.527 |
| 4.816493164000001 | -30.471 |
| 4.817630371 | -30.612 |
| 4.818767578 | -30.544 |
| 4.819905762 | -30.583 |
| 4.821043945 | -30.604 |
| 4.822182617 | -30.542 |
| 4.823322266 | -30.513 |
| 4.8244619140000005 | -30.517 |
| 4.825602539 | -30.519 |
| 4.826743652 | -30.596 |
| 4.827885254 | -30.571 |
| 4.8290278319999995 | -30.486 |
| 4.83017041 | -30.528 |
| 4.831313477 | -30.513 |
| 4.83245752 | -30.493 |
| 4.833601563 | -30.508 |
| 4.834746582 | -30.582 |
| 4.835891601999999 | -30.637 |
| 4.837037598 | -30.65 |
| 4.838184082 | -30.65 |
| 4.839331055 | -30.742 |
| 4.840479004 | -30.816 |
| 4.841626953 | -30.86 |
| 4.8427758789999995 | -31.004 |
| 4.8439248049999994 | -31.124 |
| 4.845074707 | -31.284 |
| 4.846225098 | -31.277 |
| 4.847375488 | -31.267 |
| 4.848526855 | -31.338 |
| 4.849678710999999 | -31.351 |
| 4.8508320309999995 | -31.459 |
| 4.851984862999999 | -31.449 |
| 4.8531381840000005 | -31.438 |
| 4.85429248 | -31.426 |
| 4.8554472660000005 | -31.516 |
| 4.856602050999999 | -31.531 |
| 4.857757813 | -31.531 |
| 4.858914063 | -31.566 |
| 4.860071289 | -31.563 |
| 4.861228516 | -31.583 |
| 4.862386719 | -31.503 |
| 4.8635454099999995 | -31.57 |
| 4.8647045900000006 | -31.716 |
| 4.865864257999999 | -31.637 |
| 4.867024414 | -31.584 |
| 4.868185059 | -31.419 |
| 4.869346191 | -31.44 |
| 4.870507813000001 | -31.541 |
| 4.87167041 | -31.495 |
| 4.872833008 | -31.414 |
| 4.873997070000001 | -31.513 |
| 4.875161133 | -31.395 |
| 4.876325684 | -31.221 |
| 4.877490723 | -31.297 |
| 4.878656738 | -31.28 |
| 4.879822754 | -31.446 |
| 4.880989746 | -31.36 |
| 4.8821572269999995 | -31.31 |
| 4.883325195 | -31.253 |
| 4.884493652 | -31.309 |
| 4.885662598 | -31.357 |
| 4.88683252 | -31.553 |
| 4.88800293 | -31.703 |
| 4.88917334 | -31.65 |
| 4.890344727 | -31.605 |
| 4.891516601999999 | -31.555 |
| 4.8926889650000005 | -31.555 |
| 4.893862305 | -31.413 |
| 4.895035645 | -31.471 |
| 4.896209960999999 | -31.447 |
| 4.897384766 | -31.289 |
| 4.898559570000001 | -31.174 |
| 4.89973584 | -31.116 |
| 4.900912109 | -31.028 |
| 4.902089355 | -31.052 |
| 4.9032666019999995 | -31.101 |
| 4.9044448240000005 | -31.155 |
| 4.905623535 | -31.194 |
| 4.906802734 | -31.18 |
| 4.907982422 | -31.256 |
| 4.909162598 | -31.283 |
| 4.91034375 | -31.288 |
| 4.9115253910000005 | -31.294 |
| 4.91270752 | -31.403 |
| 4.913890137 | -31.399 |
| 4.915073242 | -31.462 |
| 4.916256836 | -31.488 |
| 4.917441406 | -31.524 |
| 4.918626465 | -31.627 |
| 4.919812012 | -31.631 |
| 4.920997559000001 | -31.738 |
| 4.922184570000001 | -31.821 |
| 4.923371582 | -31.86 |
| 4.92455957 | -31.905 |
| 4.925748047 | -31.844 |
| 4.926936523 | -31.794 |
| 4.928125977 | -31.71 |
| 4.929316406 | -31.772 |
| 4.930506835999999 | -31.79 |
| 4.931698242 | -31.872 |
| 4.932890137 | -31.75 |
| 4.93408252 | -31.695 |
| 4.935275391 | -31.731 |
| 4.93646875 | -31.777 |
| 4.937663086 | -32 |
| 4.938857422 | -31.98 |
| 4.940052734 | -32.229 |
| 4.941249023 | -32.263 |
| 4.942445313 | -32.057 |
| 4.94364209 | -31.952 |
| 4.944839844 | -32.038 |
| 4.946038086 | -32.05 |
| 4.947236815999999 | -31.955 |
| 4.948436034999999 | -31.955 |
| 4.94963623 | -31.738 |
| 4.9508364259999995 | -31.829 |
| 4.9520375979999995 | -31.65 |
| 4.953239258 | -31.593 |
| 4.954441406 | -31.721 |
| 4.955644531 | -31.71 |
| 4.956847656 | -31.756 |
| 4.958051758 | -31.735 |
| 4.959256348 | -31.792 |
| 4.960461426 | -31.772 |
| 4.9616669920000005 | -31.774 |
| 4.962873535 | -31.558 |
| 4.964080566 | -31.626 |
| 4.965288085999999 | -31.663 |
| 4.966496094 | -31.524 |
| 4.96770459 | -31.477 |
| 4.968914063000001 | -31.369 |
| 4.970124023 | -31.354 |
| 4.971334473 | -31.389 |
| 4.9725454099999995 | -31.344 |
| 4.973756836 | -31.365 |
| 4.974969238 | -31.428 |
| 4.976182617 | -31.412 |
| 4.977395996 | -31.38 |
| 4.978609863 | -31.422 |
| 4.979824219 | -31.428 |
| 4.981039551 | -31.45 |
| 4.982255371 | -31.451 |
| 4.98347168 | -31.32 |
| 4.984688477 | -31.241 |
| 4.98590625 | -31.192 |
| 4.987124023000001 | -31.158 |
| 4.988343262 | -31.091 |
| 4.9895625 | -31.063 |
| 4.9907822269999995 | -31.168 |
| 4.99200293 | -31.144 |
| 4.993224121 | -31.194 |
| 4.9944458009999995 | -31.13 |
| 4.995667969 | -31.202 |
| 4.996891112999999 | -31.213 |
| 4.998114746000001 | -31.22 |
| 4.999338379 | -31.17 |
| 5.000563477 | -31.284 |
| 5.001789063 | -31.491 |
| 5.003014648000001 | -31.364 |
| 5.004241210999999 | -31.512 |
| 5.005468262 | -31.473 |
| 5.006696289000001 | -31.649 |
| 5.0079243159999995 | -31.569 |
| 5.00915332 | -31.619 |
| 5.0103828130000005 | -31.635 |
| 5.011612793 | -31.719 |
| 5.01284375 | -31.791 |
| 5.014075195 | -31.559 |
| 5.015307129 | -31.585 |
| 5.016539551 | -31.489 |
| 5.017772949 | -31.418 |
| 5.019006836 | -31.389 |
| 5.020241210999999 | -31.499 |
| 5.021476074 | -31.437 |
| 5.022711426 | -31.511 |
| 5.023947754 | -31.526 |
| 5.02518457 | -31.448 |
| 5.026421875 | -31.503 |
| 5.027660156 | -31.421 |
| 5.028898438000001 | -31.434 |
| 5.030138184 | -31.567 |
| 5.03137793 | -31.527 |
| 5.0326181640000005 | -31.526 |
| 5.033859375 | -31.475 |
| 5.035101074 | -31.337 |
| 5.03634375 | -31.251 |
| 5.037586426 | -31.06 |
| 5.038830078 | -30.918 |
| 5.040074219 | -30.896 |
| 5.0413188479999995 | -30.742 |
| 5.042564453 | -30.647 |
| 5.043810059 | -30.576 |
| 5.045056641 | -30.457 |
| 5.046304199 | -30.552 |
| 5.047551758 | -30.584 |
| 5.048800293 | -30.626 |
| 5.050049316 | -30.664 |
| 5.051299316 | -30.84 |
| 5.0525493159999995 | -30.907 |
| 5.053800293 | -31.046 |
| 5.055052246 | -31.057 |
| 5.056304199 | -31.087 |
| 5.057557129 | -31.056 |
| 5.058810547 | -31.002 |
| 5.060064453 | -30.937 |
| 5.0613193359999995 | -31.017 |
| 5.062574219 | -31.045 |
| 5.063830078 | -31.042 |
| 5.065086914 | -30.998 |
| 5.06634375 | -30.912 |
| 5.067602051 | -30.867 |
| 5.068860352 | -30.859 |
| 5.070119141 | -30.885 |
| 5.071378906 | -30.78 |
| 5.07263916 | -30.78 |
| 5.0739003910000005 | -30.611 |
| 5.075161621 | -30.601 |
| 5.076423828 | -30.479 |
| 5.077686523000001 | -30.418 |
| 5.078949707 | -30.442 |
| 5.080213867 | -30.438 |
| 5.081478516 | -30.394 |
| 5.082744141 | -30.454 |
| 5.084009766 | -30.484 |
| 5.0852763670000005 | -30.506 |
| 5.086543945000001 | -30.522 |
| 5.087811523 | -30.512 |
| 5.089080078 | -30.563 |
| 5.090349121 | -30.647 |
| 5.091618652 | -30.637 |
| 5.0928891599999995 | -30.573 |
| 5.094160156 | -30.589 |
| 5.095431641 | -30.538 |
| 5.0967041019999995 | -30.552 |
| 5.097977051 | -30.481 |
| 5.099250488 | -30.466 |
| 5.100524902 | -30.4 |
| 5.101799315999999 | -30.393 |
| 5.103074706999999 | -30.27 |
| 5.104351074 | -30.187 |
| 5.10562793 | -30.163 |
| 5.106905273000001 | -30.043 |
| 5.108183105 | -30.055 |
| 5.109461426 | -30.104 |
| 5.110741211 | -30.107 |
| 5.112020996 | -30.042 |
| 5.1133017579999995 | -30 |
| 5.11458252 | -29.88 |
| 5.115864257999999 | -29.975 |
| 5.117147460999999 | -29.959 |
| 5.1184301759999995 | -29.992 |
| 5.119713867000001 | -29.971 |
| 5.120998535 | -29.94 |
| 5.122283203 | -29.838 |
| 5.123569335999999 | -29.794 |
| 5.124855469 | -29.854 |
| 5.126142578 | -29.853 |
| 5.127430176 | -29.831 |
| 5.1287182620000005 | -29.806 |
| 5.130007813 | -29.934 |
| 5.131297363 | -29.883 |
| 5.132587402 | -29.905 |
| 5.13387793 | -29.841 |
| 5.135169434000001 | -29.823 |
| 5.136461914000001 | -29.929 |
| 5.1377548829999995 | -29.921 |
| 5.13904834 | -29.893 |
| 5.140342285 | -29.854 |
| 5.141637207 | -29.757 |
| 5.1429326170000005 | -29.7 |
| 5.144229004 | -29.731 |
| 5.1455253910000005 | -29.718 |
| 5.1468227539999996 | -29.71 |
| 5.148120605 | -29.71 |
| 5.149419922 | -29.572 |
| 5.150719238 | -29.601 |
| 5.152019043 | -29.697 |
| 5.153319824 | -29.736 |
| 5.154621094 | -29.754 |
| 5.15592334 | -29.634 |
| 5.157225585999999 | -29.665 |
| 5.158529297 | -29.66 |
| 5.159833008 | -29.559 |
| 5.161137695000001 | -29.572 |
| 5.1624428710000005 | -29.531 |
| 5.163749023 | -29.427 |
| 5.1650556640000005 | -29.377 |
| 5.166362793 | -29.456 |
| 5.1676704099999995 | -29.487 |
| 5.168979492 | -29.465 |
| 5.170288574 | -29.326 |
| 5.1715986329999994 | -29.288 |
| 5.1729091799999996 | -29.407 |
| 5.174220215 | -29.394 |
| 5.175532227 | -29.456 |
| 5.176844727 | -29.486 |
| 5.178158203 | -29.52 |
| 5.179472168 | -29.402 |
| 5.180786621 | -29.375 |
| 5.182102051 | -29.403 |
| 5.183417969 | -29.505 |
| 5.184734375 | -29.553 |
| 5.186051758 | -29.44 |
| 5.187369629 | -29.366 |
| 5.1886884769999995 | -29.293 |
| 5.190007324 | -29.282 |
| 5.191327148 | -29.138 |
| 5.192647949 | -29.101 |
| 5.193969237999999 | -29.141 |
| 5.195291504 | -29.062 |
| 5.19661377 | -29.026 |
| 5.197937012000001 | -28.967 |
| 5.19926123 | -28.97 |
| 5.200585938000001 | -28.971 |
| 5.201911132999999 | -28.959 |
| 5.203237305 | -28.861 |
| 5.204563965 | -28.873 |
| 5.205891113 | -28.866 |
| 5.2072192379999995 | -28.756 |
| 5.208547852 | -28.731 |
| 5.209877441 | -28.759 |
| 5.21120752 | -28.839 |
| 5.2125380859999995 | -28.91 |
| 5.2138696289999995 | -28.902 |
| 5.21520166 | -28.995 |
| 5.216534668 | -29.051 |
| 5.217867676 | -29.102 |
| 5.219202148 | -29.109 |
| 5.2205371089999995 | -29.197 |
| 5.221872559 | -29.197 |
| 5.223208496 | -29.084 |
| 5.224545409999999 | -29.016 |
| 5.225882813 | -28.943 |
| 5.2272216799999995 | -28.936 |
| 5.228560547 | -28.905 |
| 5.2298999020000005 | -28.854 |
| 5.2312402339999995 | -28.749 |
| 5.232581055 | -28.79 |
| 5.233922852 | -28.832 |
| 5.235265137000001 | -28.924 |
| 5.236608398 | -28.997 |
| 5.237952148000001 | -28.963 |
| 5.239296387 | -29.042 |
| 5.240641601999999 | -29.074 |
| 5.241987304999999 | -29.046 |
| 5.2433339839999995 | -29.098 |
| 5.244681152 | -29.1 |
| 5.246028809 | -29.044 |
| 5.24737793 | -28.87 |
| 5.2487270509999995 | -28.83 |
| 5.250077148 | -28.812 |
| 5.251427734 | -28.809 |
| 5.2527788090000005 | -28.834 |
| 5.254131348 | -28.763 |
| 5.2554838870000005 | -28.728 |
| 5.256837402 | -28.751 |
| 5.258191406 | -28.782 |
| 5.259546387 | -28.803 |
| 5.260901855 | -28.845 |
| 5.262258301 | -28.902 |
| 5.2636152339999995 | -28.834 |
| 5.264972656 | -28.857 |
| 5.266331054999999 | -28.759 |
| 5.26769043 | -28.803 |
| 5.269049805 | -28.814 |
| 5.270410156 | -28.76 |
| 5.271771484 | -28.72 |
| 5.273133301 | -28.605 |
| 5.274496094 | -28.579 |
| 5.275859375 | -28.532 |
| 5.277223145 | -28.571 |
| 5.278587891 | -28.554 |
| 5.279953613 | -28.592 |
| 5.281319335999999 | -28.535 |
| 5.282686034999999 | -28.517 |
| 5.284053710999999 | -28.502 |
| 5.285421875 | -28.514 |
| 5.2867910160000005 | -28.525 |
| 5.288160645 | -28.49 |
| 5.289530762 | -28.462 |
| 5.290901855 | -28.408 |
| 5.2922734380000005 | -28.357 |
| 5.293645996 | -28.35 |
| 5.295019531 | -28.309 |
| 5.296393065999999 | -28.317 |
| 5.297767578 | -28.217 |
| 5.299143066 | -28.238 |
| 5.300519043 | -28.286 |
| 5.301895996 | -28.317 |
| 5.303273438 | -28.336 |
| 5.304651367 | -28.307 |
| 5.306030273 | -28.34 |
| 5.3074101559999995 | -28.238 |
| 5.308790527 | -28.228 |
| 5.3101713870000005 | -28.233 |
| 5.311553223 | -28.272 |
| 5.312935547 | -28.247 |
| 5.314318848 | -28.22 |
| 5.315703125 | -28.268 |
| 5.317087402 | -28.258 |
| 5.318472656 | -28.366 |
| 5.3198588870000005 | -28.4 |
| 5.321246094 | -28.454 |
| 5.322633301 | -28.452 |
| 5.324021484 | -28.447 |
| 5.325410645 | -28.458 |
| 5.326800293 | -28.528 |
| 5.328190918000001 | -28.566 |
| 5.329582031 | -28.477 |
| 5.330973632999999 | -28.467 |
| 5.332366210999999 | -28.42 |
| 5.333759766 | -28.285 |
| 5.335154297 | -28.249 |
| 5.336548828 | -28.327 |
| 5.337944336 | -28.186 |
| 5.339340332 | -28.171 |
| 5.340737304999999 | -28.019 |
| 5.3421352539999996 | -27.977 |
| 5.343533690999999 | -27.962 |
| 5.344933105 | -28.036 |
| 5.346333007999999 | -27.842 |
| 5.347733398 | -27.847 |
| 5.349135254 | -27.826 |
| 5.350537109 | -27.734 |
| 5.3519399409999995 | -27.751 |
| 5.353343262 | -27.707 |
| 5.354747559000001 | -27.707 |
| 5.356152831999999 | -27.618 |
| 5.357558594 | -27.667 |
| 5.3589653319999995 | -27.491 |
| 5.360372559 | -27.462 |
| 5.361780762 | -27.44 |
| 5.363189453 | -27.451 |
| 5.364599121 | -27.444 |
| 5.366009277 | -27.451 |
| 5.367419922 | -27.512 |
| 5.368832031 | -27.443 |
| 5.370244629 | -27.439 |
| 5.371657715 | -27.349 |
| 5.373071777 | -27.425 |
| 5.374486328 | -27.378 |
| 5.375902344 | -27.371 |
| 5.377318359 | -27.315 |
| 5.378735352 | -27.279 |
| 5.380152831999999 | -27.257 |
| 5.381571289 | -27.171 |
| 5.382990723 | -27.293 |
| 5.384410645 | -27.307 |
| 5.385831055 | -27.299 |
| 5.387252440999999 | -27.298 |
| 5.388674805 | -27.332 |
| 5.390097656 | -27.335 |
| 5.391521484 | -27.354 |
| 5.392945801 | -27.34 |
| 5.394371094 | -27.314 |
| 5.395796875 | -27.281 |
| 5.397223632999999 | -27.11 |
| 5.398651367 | -27.1 |
| 5.400079590000001 | -27.043 |
| 5.401508301 | -26.863 |
| 5.402937988 | -26.845 |
| 5.4043686520000005 | -26.739 |
| 5.405799805 | -26.717 |
| 5.407231934 | -26.586 |
| 5.408664551 | -26.43 |
| 5.410098145 | -26.393 |
| 5.411532715 | -26.308 |
| 5.412967285 | -26.261 |
| 5.41440332 | -26.246 |
| 5.415839844 | -26.234 |
| 5.417276855 | -26.249 |
| 5.418715332 | -26.174 |
| 5.420154297 | -26.071 |
| 5.42159375 | -26.057 |
| 5.423033691 | -26.165 |
| 5.424475098 | -26.078 |
| 5.425916992 | -26.094 |
| 5.4273598629999995 | -26.126 |
| 5.428803223 | -26.006 |
| 5.43024707 | -25.882 |
| 5.431692383 | -25.854 |
| 5.433138184000001 | -25.772 |
| 5.434584473 | -25.668 |
| 5.436031738 | -25.617 |
| 5.43747998 | -25.397 |
| 5.438928711 | -25.338 |
| 5.440378418 | -25.337 |
| 5.441829102 | -25.068 |
| 5.443279785 | -25.023 |
| 5.444731934 | -25.001 |
| 5.446184570000001 | -24.902 |
| 5.4476381840000005 | -24.92 |
| 5.449092285 | -24.854 |
| 5.450547363 | -24.863 |
| 5.45200293 | -24.889 |
| 5.453459960999999 | -24.825 |
| 5.45491748 | -24.777 |
| 5.456375488 | -24.8 |
| 5.457833984 | -24.777 |
| 5.459293945000001 | -24.622 |
| 5.460754395 | -24.585 |
| 5.46221582 | -24.542 |
| 5.463677734 | -24.569 |
| 5.465140625 | -24.5 |
| 5.466604004 | -24.553 |
| 5.468068848 | -24.588 |
| 5.469533691 | -24.706 |
| 5.470999512000001 | -24.718 |
| 5.4724663090000005 | -24.653 |
| 5.4739340819999995 | -24.775 |
| 5.475402344 | -24.757 |
| 5.476871581999999 | -24.795 |
| 5.478341309 | -24.732 |
| 5.479812012 | -24.754 |
| 5.481283203 | -24.717 |
| 5.482755859 | -24.603 |
| 5.4842290039999995 | -24.409 |
| 5.485702637 | -24.373 |
| 5.487177246 | -24.339 |
| 5.488652832 | -24.283 |
| 5.490129395 | -24.24 |
| 5.491605957 | -24.151 |
| 5.493083984 | -24.047 |
| 5.4945625 | -23.927 |
| 5.496041992 | -23.758 |
| 5.497522461 | -23.725 |
| 5.499003418 | -23.744 |
| 5.500484863 | -23.79 |
| 5.501967285 | -23.825 |
| 5.503450684000001 | -23.744 |
| 5.504935547 | -23.642 |
| 5.50642041 | -23.678 |
| 5.50790625 | -23.749 |
| 5.509392578 | -23.711 |
| 5.510879882999999 | -23.773 |
| 5.512368652 | -23.798 |
| 5.513857422 | -23.623 |
| 5.515347168 | -23.51 |
| 5.516837891 | -23.484 |
| 5.518329102 | -23.551 |
| 5.519821777 | -23.67 |
| 5.521314453 | -23.655 |
| 5.522808105 | -23.533 |
| 5.524302734 | -23.497 |
| 5.525798340000001 | -23.496 |
| 5.527294922 | -23.548 |
| 5.528791992 | -23.594 |
| 5.530289551 | -23.603 |
| 5.531788574 | -23.58 |
| 5.533288086 | -23.571 |
| 5.534788574 | -23.408 |
| 5.536289550999999 | -23.353 |
| 5.537791503999999 | -23.563 |
| 5.539294434 | -23.66 |
| 5.54079834 | -23.739 |
| 5.542302246 | -23.633 |
| 5.543807617000001 | -23.564 |
| 5.545313477 | -23.51 |
| 5.5468203130000004 | -23.541 |
| 5.548328613 | -23.502 |
| 5.549836914 | -23.543 |
| 5.5513461909999995 | -23.48 |
| 5.552856445000001 | -23.307 |
| 5.5543671880000005 | -23.243 |
| 5.555879395 | -23.122 |
| 5.557391602 | -23.111 |
| 5.558905273000001 | -23.175 |
| 5.560419434 | -23.234 |
| 5.56193457 | -23.23 |
| 5.563450684 | -23.181 |
| 5.564967285 | -23.241 |
| 5.5664848629999995 | -23.259 |
| 5.56800293 | -23.19 |
| 5.569522460999999 | -23.257 |
| 5.57104248 | -23.297 |
| 5.572563477 | -23.328 |
| 5.574084961 | -23.398 |
| 5.575607422 | -23.302 |
| 5.5771308589999995 | -23.147 |
| 5.578655273000001 | -23.142 |
| 5.580180176 | -23.031 |
| 5.581706055 | -22.972 |
| 5.5832329099999995 | -23.095 |
| 5.584760254 | -22.912 |
| 5.586289063000001 | -23.306 |
| 5.587818359 | -23.759 |
| 5.589348145 | -24.192 |
| 5.5908789059999995 | -24.862 |
| 5.592410645 | -25.703 |
| 5.593943359 | -26.649 |
| 5.595477051 | -27.958 |
| 5.59701123 | -29.77 |
| 5.598545898 | -32.01 |